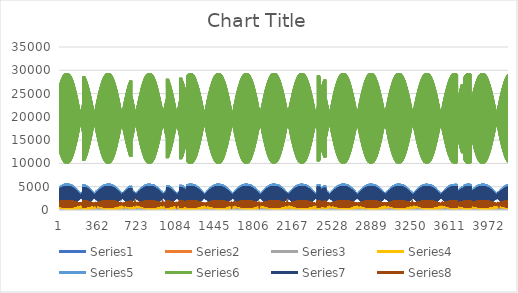
| Category | Series 0 | Series 1 | Series 2 | Series 3 | Series 4 | Series 5 | Series 6 | Series 7 |
|---|---|---|---|---|---|---|---|---|
| 0 | 326 | 234 | 315 | 957 | 4866 | 26558 | 4418 | 1771 |
| 1 | 232 | 228 | 269 | 450 | 1618 | 12702 | 1441 | 773 |
| 2 | 377 | 268 | 368 | 1084 | 4984 | 26733 | 4549 | 1919 |
| 3 | 202 | 199 | 236 | 405 | 1573 | 12532 | 1411 | 772 |
| 4 | 332 | 237 | 322 | 982 | 4953 | 26900 | 4496 | 1802 |
| 5 | 219 | 219 | 256 | 422 | 1537 | 12396 | 1366 | 737 |
| 6 | 392 | 281 | 385 | 1121 | 5070 | 27063 | 4624 | 1947 |
| 7 | 196 | 195 | 228 | 383 | 1505 | 12230 | 1353 | 763 |
| 8 | 338 | 241 | 332 | 1007 | 5030 | 27204 | 4567 | 1834 |
| 9 | 206 | 209 | 242 | 393 | 1457 | 12090 | 1292 | 703 |
| 10 | 405 | 291 | 399 | 1150 | 5141 | 27348 | 4684 | 1967 |
| 11 | 190 | 192 | 220 | 362 | 1436 | 11926 | 1294 | 752 |
| 12 | 347 | 247 | 343 | 1037 | 5104 | 27470 | 4635 | 1869 |
| 13 | 194 | 200 | 229 | 367 | 1382 | 11797 | 1222 | 673 |
| 14 | 417 | 300 | 414 | 1181 | 5217 | 27649 | 4749 | 1987 |
| 15 | 185 | 188 | 212 | 341 | 1375 | 11661 | 1243 | 742 |
| 16 | 359 | 256 | 359 | 1074 | 5187 | 27763 | 4712 | 1913 |
| 17 | 182 | 190 | 216 | 342 | 1315 | 11539 | 1161 | 647 |
| 18 | 424 | 306 | 423 | 1200 | 5276 | 27907 | 4797 | 1997 |
| 19 | 180 | 186 | 206 | 323 | 1317 | 11409 | 1192 | 730 |
| 20 | 372 | 265 | 374 | 1110 | 5258 | 28010 | 4778 | 1952 |
| 21 | 169 | 180 | 202 | 315 | 1248 | 11285 | 1101 | 621 |
| 22 | 429 | 310 | 430 | 1217 | 5329 | 28142 | 4840 | 2002 |
| 23 | 175 | 182 | 199 | 304 | 1258 | 11167 | 1140 | 713 |
| 24 | 389 | 276 | 392 | 1150 | 5328 | 28236 | 4843 | 1992 |
| 25 | 157 | 170 | 189 | 292 | 1189 | 11053 | 1049 | 601 |
| 26 | 433 | 313 | 436 | 1231 | 5378 | 28359 | 4879 | 2005 |
| 27 | 169 | 179 | 192 | 287 | 1207 | 10963 | 1094 | 695 |
| 28 | 404 | 287 | 409 | 1189 | 5393 | 28452 | 4904 | 2028 |
| 29 | 144 | 159 | 175 | 267 | 1138 | 10858 | 1004 | 585 |
| 30 | 436 | 316 | 442 | 1243 | 5421 | 28565 | 4914 | 2007 |
| 31 | 164 | 175 | 185 | 270 | 1156 | 10772 | 1046 | 672 |
| 32 | 420 | 300 | 429 | 1229 | 5451 | 28643 | 4957 | 2060 |
| 33 | 133 | 150 | 163 | 245 | 1092 | 10674 | 966 | 575 |
| 34 | 438 | 317 | 446 | 1250 | 5457 | 28737 | 4942 | 2007 |
| 35 | 158 | 172 | 178 | 254 | 1109 | 10605 | 1002 | 648 |
| 36 | 437 | 313 | 447 | 1267 | 5502 | 28804 | 5003 | 2088 |
| 37 | 123 | 142 | 150 | 225 | 1050 | 10496 | 933 | 569 |
| 38 | 438 | 318 | 448 | 1255 | 5485 | 28867 | 4964 | 2006 |
| 39 | 149 | 166 | 169 | 237 | 1062 | 10433 | 956 | 620 |
| 40 | 453 | 326 | 467 | 1306 | 5547 | 28934 | 5043 | 2112 |
| 41 | 115 | 135 | 140 | 206 | 1019 | 10353 | 910 | 570 |
| 42 | 439 | 319 | 451 | 1261 | 5518 | 29008 | 4991 | 2012 |
| 43 | 140 | 160 | 160 | 221 | 1026 | 10315 | 921 | 596 |
| 44 | 470 | 340 | 486 | 1341 | 5591 | 29069 | 5081 | 2133 |
| 45 | 109 | 130 | 132 | 191 | 1000 | 10259 | 898 | 579 |
| 46 | 438 | 318 | 453 | 1263 | 5542 | 29127 | 5011 | 2017 |
| 47 | 130 | 152 | 150 | 203 | 989 | 10208 | 884 | 571 |
| 48 | 484 | 352 | 503 | 1370 | 5618 | 29158 | 5104 | 2146 |
| 49 | 105 | 127 | 125 | 178 | 976 | 10145 | 882 | 585 |
| 50 | 440 | 320 | 456 | 1271 | 5561 | 29198 | 5027 | 2024 |
| 51 | 120 | 145 | 140 | 187 | 962 | 10125 | 856 | 550 |
| 52 | 497 | 363 | 518 | 1395 | 5643 | 29237 | 5121 | 2152 |
| 53 | 102 | 125 | 119 | 167 | 964 | 10079 | 876 | 594 |
| 54 | 440 | 320 | 459 | 1277 | 5575 | 29250 | 5040 | 2031 |
| 55 | 110 | 137 | 129 | 172 | 937 | 10057 | 831 | 530 |
| 56 | 506 | 371 | 529 | 1412 | 5657 | 29288 | 5130 | 2151 |
| 57 | 100 | 123 | 113 | 157 | 955 | 10034 | 873 | 600 |
| 58 | 444 | 323 | 465 | 1289 | 5591 | 29293 | 5056 | 2045 |
| 59 | 101 | 128 | 119 | 156 | 919 | 10027 | 814 | 514 |
| 60 | 511 | 376 | 537 | 1421 | 5661 | 29320 | 5129 | 2142 |
| 61 | 98 | 121 | 108 | 149 | 948 | 10012 | 871 | 604 |
| 62 | 450 | 327 | 474 | 1307 | 5605 | 29326 | 5070 | 2060 |
| 63 | 92 | 120 | 110 | 144 | 910 | 10032 | 806 | 503 |
| 64 | 513 | 380 | 541 | 1424 | 5653 | 29322 | 5118 | 2126 |
| 65 | 97 | 120 | 104 | 142 | 949 | 10030 | 875 | 608 |
| 66 | 459 | 335 | 485 | 1325 | 5611 | 29318 | 5079 | 2077 |
| 67 | 85 | 113 | 101 | 133 | 907 | 10051 | 805 | 499 |
| 68 | 515 | 382 | 544 | 1427 | 5648 | 29321 | 5110 | 2115 |
| 69 | 96 | 119 | 100 | 135 | 954 | 10049 | 882 | 614 |
| 70 | 469 | 344 | 498 | 1347 | 5618 | 29292 | 5088 | 2098 |
| 71 | 77 | 106 | 93 | 122 | 911 | 10080 | 811 | 503 |
| 72 | 516 | 383 | 547 | 1425 | 5631 | 29261 | 5090 | 2102 |
| 73 | 95 | 118 | 97 | 129 | 961 | 10086 | 890 | 618 |
| 74 | 480 | 353 | 511 | 1366 | 5613 | 29214 | 5085 | 2114 |
| 75 | 71 | 99 | 84 | 114 | 921 | 10122 | 824 | 511 |
| 76 | 514 | 383 | 547 | 1421 | 5613 | 29196 | 5070 | 2087 |
| 77 | 93 | 117 | 93 | 123 | 977 | 10166 | 904 | 619 |
| 78 | 490 | 362 | 522 | 1382 | 5606 | 29141 | 5079 | 2123 |
| 79 | 66 | 92 | 77 | 107 | 939 | 10203 | 844 | 522 |
| 80 | 511 | 382 | 545 | 1411 | 5585 | 29105 | 5041 | 2066 |
| 81 | 91 | 115 | 89 | 118 | 989 | 10245 | 912 | 611 |
| 82 | 501 | 372 | 536 | 1401 | 5595 | 29048 | 5070 | 2130 |
| 83 | 61 | 87 | 71 | 102 | 966 | 10308 | 874 | 539 |
| 84 | 505 | 378 | 541 | 1398 | 5552 | 28994 | 5007 | 2044 |
| 85 | 87 | 112 | 85 | 113 | 1012 | 10383 | 931 | 604 |
| 86 | 510 | 379 | 546 | 1414 | 5571 | 28926 | 5047 | 2127 |
| 87 | 58 | 83 | 65 | 99 | 997 | 10437 | 907 | 558 |
| 88 | 499 | 374 | 536 | 1382 | 5511 | 28855 | 4966 | 2020 |
| 89 | 82 | 108 | 79 | 109 | 1030 | 10508 | 943 | 592 |
| 90 | 520 | 389 | 559 | 1428 | 5537 | 28754 | 5015 | 2119 |
| 91 | 58 | 82 | 62 | 99 | 1031 | 10558 | 944 | 582 |
| 92 | 493 | 370 | 532 | 1367 | 5463 | 28663 | 4922 | 1999 |
| 93 | 77 | 103 | 74 | 105 | 1059 | 10670 | 966 | 585 |
| 94 | 528 | 398 | 569 | 1439 | 5509 | 28616 | 4988 | 2111 |
| 95 | 58 | 82 | 59 | 102 | 1084 | 10764 | 999 | 612 |
| 96 | 487 | 366 | 527 | 1351 | 5424 | 28523 | 4887 | 1984 |
| 97 | 71 | 98 | 68 | 102 | 1094 | 10869 | 996 | 581 |
| 98 | 534 | 405 | 577 | 1444 | 5464 | 28425 | 4944 | 2093 |
| 99 | 60 | 82 | 58 | 106 | 1132 | 10954 | 1048 | 639 |
| 100 | 482 | 363 | 523 | 1339 | 5374 | 28319 | 4843 | 1971 |
| 101 | 66 | 93 | 64 | 100 | 1132 | 11072 | 1028 | 581 |
| 102 | 537 | 409 | 582 | 1441 | 5412 | 28218 | 4895 | 2070 |
| 103 | 64 | 84 | 58 | 111 | 1186 | 11173 | 1104 | 668 |
| 104 | 478 | 361 | 520 | 1327 | 5321 | 28093 | 4796 | 1959 |
| 105 | 61 | 88 | 59 | 99 | 1177 | 11303 | 1069 | 586 |
| 106 | 538 | 411 | 583 | 1432 | 5352 | 27986 | 4836 | 2041 |
| 107 | 67 | 86 | 58 | 118 | 1245 | 11412 | 1162 | 696 |
| 108 | 477 | 361 | 521 | 1320 | 5266 | 27844 | 4749 | 1953 |
| 109 | 58 | 84 | 56 | 100 | 1228 | 11549 | 1115 | 596 |
| 110 | 535 | 411 | 582 | 1418 | 5285 | 27729 | 4772 | 2010 |
| 111 | 72 | 88 | 59 | 126 | 1307 | 11665 | 1221 | 722 |
| 112 | 479 | 363 | 523 | 1316 | 5210 | 27583 | 4701 | 1949 |
| 113 | 55 | 79 | 52 | 102 | 1283 | 11809 | 1166 | 609 |
| 114 | 529 | 407 | 576 | 1398 | 5211 | 27454 | 4701 | 1972 |
| 115 | 76 | 91 | 60 | 134 | 1370 | 11936 | 1280 | 743 |
| 116 | 481 | 367 | 527 | 1314 | 5151 | 27304 | 4652 | 1943 |
| 117 | 54 | 75 | 49 | 108 | 1347 | 12099 | 1226 | 627 |
| 118 | 523 | 404 | 571 | 1379 | 5135 | 27165 | 4629 | 1935 |
| 119 | 81 | 93 | 61 | 143 | 1441 | 12250 | 1346 | 763 |
| 120 | 484 | 371 | 530 | 1309 | 5084 | 26998 | 4593 | 1934 |
| 121 | 54 | 71 | 48 | 115 | 1417 | 12402 | 1293 | 652 |
| 122 | 515 | 399 | 564 | 1355 | 5050 | 26848 | 4548 | 1895 |
| 123 | 85 | 95 | 63 | 152 | 1513 | 12570 | 1411 | 780 |
| 124 | 487 | 375 | 534 | 1305 | 5013 | 26676 | 4531 | 1922 |
| 125 | 55 | 69 | 47 | 125 | 1492 | 12717 | 1365 | 683 |
| 126 | 506 | 394 | 556 | 1331 | 4965 | 26520 | 4469 | 1858 |
| 127 | 87 | 97 | 64 | 161 | 1585 | 12901 | 1475 | 793 |
| 128 | 491 | 380 | 539 | 1302 | 4941 | 26345 | 4468 | 1908 |
| 129 | 58 | 69 | 48 | 139 | 1579 | 13062 | 1450 | 721 |
| 130 | 496 | 387 | 547 | 1303 | 4876 | 26176 | 4386 | 1820 |
| 131 | 89 | 97 | 65 | 169 | 1662 | 13256 | 1542 | 804 |
| 132 | 493 | 384 | 542 | 1294 | 4860 | 25989 | 4395 | 1887 |
| 133 | 62 | 70 | 50 | 155 | 1670 | 13425 | 1538 | 763 |
| 134 | 485 | 380 | 536 | 1272 | 4781 | 25812 | 4299 | 1782 |
| 135 | 89 | 96 | 65 | 178 | 1739 | 13622 | 1608 | 813 |
| 136 | 495 | 388 | 545 | 1286 | 4776 | 25626 | 4318 | 1864 |
| 137 | 68 | 72 | 53 | 173 | 1764 | 13793 | 1629 | 808 |
| 138 | 474 | 372 | 524 | 1240 | 4685 | 25437 | 4211 | 1745 |
| 139 | 90 | 96 | 66 | 187 | 1819 | 14000 | 1677 | 824 |
| 140 | 497 | 391 | 548 | 1278 | 4687 | 25244 | 4236 | 1837 |
| 141 | 76 | 76 | 59 | 194 | 1860 | 14164 | 1722 | 854 |
| 142 | 462 | 364 | 513 | 1207 | 4586 | 25041 | 4120 | 1711 |
| 143 | 89 | 94 | 66 | 196 | 1901 | 14384 | 1748 | 836 |
| 144 | 497 | 393 | 548 | 1263 | 4587 | 24818 | 4143 | 1801 |
| 145 | 85 | 82 | 64 | 216 | 1956 | 14532 | 1814 | 899 |
| 146 | 451 | 356 | 502 | 1176 | 4484 | 24615 | 4029 | 1680 |
| 147 | 89 | 93 | 67 | 206 | 1985 | 14765 | 1822 | 850 |
| 148 | 495 | 394 | 548 | 1247 | 4492 | 24418 | 4055 | 1765 |
| 149 | 94 | 88 | 72 | 243 | 2069 | 14954 | 1921 | 949 |
| 150 | 442 | 350 | 493 | 1149 | 4388 | 24202 | 3945 | 1656 |
| 151 | 90 | 91 | 68 | 217 | 2081 | 15184 | 1907 | 871 |
| 152 | 488 | 392 | 541 | 1221 | 4381 | 23972 | 3951 | 1719 |
| 153 | 104 | 94 | 79 | 266 | 2163 | 15325 | 2010 | 987 |
| 154 | 434 | 346 | 485 | 1123 | 4275 | 23703 | 3846 | 1629 |
| 155 | 92 | 91 | 70 | 232 | 2179 | 15607 | 1996 | 897 |
| 156 | 482 | 388 | 534 | 1196 | 4282 | 23574 | 3859 | 1677 |
| 157 | 115 | 101 | 87 | 293 | 2281 | 15787 | 2120 | 1033 |
| 158 | 431 | 344 | 481 | 1105 | 4192 | 23341 | 3775 | 1617 |
| 159 | 92 | 88 | 71 | 243 | 2256 | 15956 | 2066 | 915 |
| 160 | 473 | 383 | 526 | 1170 | 4168 | 23096 | 3753 | 1629 |
| 161 | 127 | 109 | 97 | 325 | 2407 | 16269 | 2237 | 1079 |
| 162 | 427 | 343 | 477 | 1084 | 4095 | 22890 | 3692 | 1600 |
| 163 | 96 | 89 | 75 | 264 | 2388 | 16493 | 2188 | 961 |
| 164 | 460 | 374 | 514 | 1132 | 4055 | 22680 | 3648 | 1582 |
| 165 | 137 | 115 | 105 | 347 | 2512 | 16723 | 2331 | 1112 |
| 166 | 424 | 343 | 474 | 1065 | 3989 | 22435 | 3598 | 1577 |
| 167 | 101 | 89 | 80 | 287 | 2493 | 16942 | 2284 | 996 |
| 168 | 448 | 367 | 502 | 1098 | 3937 | 22224 | 3537 | 1530 |
| 169 | 146 | 121 | 112 | 369 | 2617 | 17183 | 2424 | 1136 |
| 170 | 420 | 342 | 470 | 1044 | 3881 | 21974 | 3502 | 1549 |
| 171 | 108 | 91 | 86 | 312 | 2603 | 17396 | 2386 | 1036 |
| 172 | 435 | 358 | 488 | 1063 | 3816 | 21754 | 3425 | 1481 |
| 173 | 154 | 126 | 119 | 392 | 2724 | 17645 | 2519 | 1162 |
| 174 | 418 | 342 | 468 | 1025 | 3773 | 21503 | 3406 | 1523 |
| 175 | 117 | 94 | 94 | 343 | 2721 | 17859 | 2498 | 1086 |
| 176 | 422 | 349 | 475 | 1027 | 3699 | 21290 | 3318 | 1435 |
| 177 | 161 | 131 | 126 | 413 | 2833 | 18121 | 2614 | 1186 |
| 178 | 415 | 342 | 465 | 1006 | 3672 | 21067 | 3316 | 1498 |
| 179 | 128 | 100 | 104 | 376 | 2848 | 18354 | 2618 | 1144 |
| 180 | 408 | 339 | 460 | 988 | 3578 | 20820 | 3207 | 1389 |
| 181 | 166 | 133 | 131 | 432 | 2936 | 18588 | 2703 | 1205 |
| 182 | 413 | 342 | 462 | 986 | 3560 | 20591 | 3214 | 1466 |
| 183 | 141 | 108 | 116 | 414 | 2973 | 18830 | 2736 | 1202 |
| 184 | 393 | 328 | 445 | 950 | 3461 | 20356 | 3101 | 1348 |
| 185 | 170 | 136 | 136 | 450 | 3042 | 19066 | 2795 | 1225 |
| 186 | 409 | 341 | 457 | 963 | 3442 | 20097 | 3107 | 1427 |
| 187 | 154 | 116 | 128 | 452 | 3092 | 19277 | 2848 | 1256 |
| 188 | 379 | 318 | 430 | 913 | 3341 | 19864 | 2992 | 1308 |
| 189 | 174 | 137 | 142 | 471 | 3152 | 19546 | 2890 | 1246 |
| 190 | 404 | 340 | 453 | 941 | 3331 | 19630 | 3004 | 1388 |
| 191 | 169 | 126 | 142 | 494 | 3223 | 19771 | 2970 | 1313 |
| 192 | 363 | 306 | 413 | 872 | 3222 | 19376 | 2884 | 1271 |
| 193 | 178 | 139 | 147 | 489 | 3260 | 20025 | 2985 | 1269 |
| 194 | 397 | 336 | 446 | 915 | 3213 | 19155 | 2895 | 1343 |
| 195 | 185 | 136 | 157 | 537 | 3350 | 20252 | 3087 | 1366 |
| 196 | 350 | 298 | 400 | 838 | 3108 | 18900 | 2784 | 1240 |
| 197 | 182 | 141 | 152 | 508 | 3368 | 20501 | 3080 | 1293 |
| 198 | 388 | 332 | 438 | 886 | 3095 | 18680 | 2785 | 1295 |
| 199 | 201 | 147 | 173 | 580 | 3474 | 20730 | 3201 | 1416 |
| 200 | 339 | 290 | 388 | 805 | 2994 | 18418 | 2684 | 1212 |
| 201 | 185 | 142 | 157 | 527 | 3476 | 20971 | 3175 | 1318 |
| 202 | 377 | 325 | 426 | 853 | 2974 | 18204 | 2671 | 1243 |
| 203 | 218 | 159 | 189 | 622 | 3597 | 21206 | 3313 | 1463 |
| 204 | 331 | 285 | 378 | 776 | 2884 | 17944 | 2589 | 1188 |
| 205 | 189 | 143 | 163 | 549 | 3582 | 21427 | 3271 | 1348 |
| 206 | 364 | 316 | 412 | 818 | 2853 | 17735 | 2559 | 1192 |
| 207 | 234 | 170 | 204 | 663 | 3717 | 21677 | 3421 | 1505 |
| 208 | 324 | 281 | 370 | 750 | 2779 | 17485 | 2498 | 1168 |
| 209 | 195 | 145 | 169 | 575 | 3697 | 21907 | 3375 | 1385 |
| 210 | 350 | 307 | 398 | 782 | 2732 | 17262 | 2447 | 1141 |
| 211 | 249 | 181 | 219 | 700 | 3831 | 22136 | 3523 | 1541 |
| 212 | 317 | 277 | 362 | 723 | 2671 | 17014 | 2404 | 1144 |
| 213 | 202 | 149 | 178 | 605 | 3811 | 22363 | 3479 | 1427 |
| 214 | 336 | 297 | 384 | 746 | 2614 | 16801 | 2338 | 1093 |
| 215 | 262 | 190 | 233 | 734 | 3943 | 22596 | 3622 | 1574 |
| 216 | 312 | 275 | 356 | 700 | 2568 | 16562 | 2313 | 1122 |
| 217 | 59 | 88 | 67 | 95 | 987 | 10549 | 891 | 507 |
| 218 | 526 | 396 | 565 | 1432 | 5490 | 28696 | 4962 | 2049 |
| 219 | 76 | 98 | 70 | 110 | 1056 | 10622 | 989 | 632 |
| 220 | 482 | 359 | 520 | 1355 | 5446 | 28593 | 4929 | 2034 |
| 221 | 55 | 82 | 61 | 93 | 1025 | 10721 | 928 | 520 |
| 222 | 522 | 394 | 563 | 1422 | 5443 | 28525 | 4916 | 2023 |
| 223 | 77 | 98 | 68 | 111 | 1098 | 10811 | 1027 | 643 |
| 224 | 489 | 367 | 530 | 1364 | 5412 | 28407 | 4899 | 2037 |
| 225 | 52 | 76 | 56 | 93 | 1067 | 10906 | 970 | 537 |
| 226 | 517 | 392 | 560 | 1407 | 5390 | 28323 | 4864 | 1995 |
| 227 | 77 | 98 | 67 | 112 | 1142 | 11018 | 1066 | 650 |
| 228 | 496 | 373 | 537 | 1370 | 5370 | 28200 | 4863 | 2034 |
| 229 | 50 | 72 | 52 | 95 | 1116 | 11103 | 1018 | 560 |
| 230 | 512 | 389 | 555 | 1390 | 5334 | 28104 | 4810 | 1967 |
| 231 | 77 | 98 | 65 | 114 | 1190 | 11243 | 1108 | 654 |
| 232 | 503 | 380 | 547 | 1377 | 5327 | 27976 | 4824 | 2030 |
| 233 | 50 | 70 | 50 | 99 | 1178 | 11350 | 1080 | 591 |
| 234 | 504 | 384 | 548 | 1368 | 5269 | 27862 | 4748 | 1937 |
| 235 | 76 | 97 | 64 | 116 | 1244 | 11510 | 1153 | 658 |
| 236 | 511 | 388 | 555 | 1382 | 5276 | 27743 | 4778 | 2021 |
| 237 | 52 | 69 | 48 | 106 | 1244 | 11613 | 1147 | 627 |
| 238 | 496 | 378 | 541 | 1344 | 5199 | 27599 | 4682 | 1907 |
| 239 | 73 | 94 | 61 | 118 | 1293 | 11767 | 1194 | 657 |
| 240 | 516 | 394 | 563 | 1385 | 5217 | 27474 | 4723 | 2004 |
| 241 | 55 | 70 | 49 | 116 | 1316 | 11890 | 1218 | 665 |
| 242 | 487 | 372 | 532 | 1319 | 5126 | 27313 | 4614 | 1879 |
| 243 | 70 | 90 | 58 | 120 | 1346 | 12029 | 1238 | 657 |
| 244 | 521 | 400 | 568 | 1382 | 5148 | 27167 | 4658 | 1982 |
| 245 | 59 | 73 | 50 | 128 | 1394 | 12187 | 1295 | 705 |
| 246 | 478 | 366 | 523 | 1294 | 5052 | 27016 | 4547 | 1855 |
| 247 | 68 | 87 | 56 | 123 | 1415 | 12358 | 1297 | 666 |
| 248 | 523 | 404 | 572 | 1376 | 5079 | 26886 | 4593 | 1956 |
| 249 | 64 | 76 | 52 | 142 | 1477 | 12519 | 1375 | 743 |
| 250 | 470 | 361 | 517 | 1274 | 4979 | 26721 | 4482 | 1835 |
| 251 | 66 | 84 | 54 | 128 | 1485 | 12699 | 1359 | 677 |
| 252 | 522 | 406 | 572 | 1362 | 4997 | 26563 | 4514 | 1921 |
| 253 | 71 | 80 | 56 | 157 | 1560 | 12856 | 1454 | 780 |
| 254 | 464 | 358 | 512 | 1254 | 4897 | 26379 | 4410 | 1816 |
| 255 | 65 | 82 | 52 | 134 | 1556 | 13039 | 1422 | 691 |
| 256 | 520 | 405 | 570 | 1345 | 4910 | 26223 | 4432 | 1883 |
| 257 | 78 | 84 | 59 | 173 | 1644 | 13199 | 1534 | 815 |
| 258 | 462 | 357 | 510 | 1240 | 4818 | 26028 | 4342 | 1803 |
| 259 | 64 | 79 | 52 | 142 | 1632 | 13386 | 1491 | 709 |
| 260 | 513 | 402 | 564 | 1322 | 4817 | 25860 | 4344 | 1842 |
| 261 | 86 | 89 | 64 | 190 | 1733 | 13559 | 1618 | 850 |
| 262 | 460 | 357 | 509 | 1227 | 4734 | 25650 | 4269 | 1789 |
| 263 | 65 | 76 | 52 | 153 | 1719 | 13761 | 1571 | 735 |
| 264 | 505 | 397 | 556 | 1296 | 4721 | 25487 | 4254 | 1799 |
| 265 | 94 | 94 | 69 | 207 | 1828 | 13950 | 1705 | 882 |
| 266 | 461 | 360 | 510 | 1216 | 4654 | 25283 | 4200 | 1778 |
| 267 | 66 | 74 | 52 | 165 | 1806 | 14137 | 1652 | 763 |
| 268 | 495 | 391 | 547 | 1266 | 4617 | 25084 | 4157 | 1754 |
| 269 | 101 | 99 | 73 | 223 | 1917 | 14329 | 1786 | 908 |
| 270 | 461 | 362 | 510 | 1203 | 4564 | 24881 | 4122 | 1762 |
| 271 | 69 | 73 | 54 | 182 | 1902 | 14534 | 1743 | 800 |
| 272 | 485 | 385 | 537 | 1238 | 4516 | 24687 | 4062 | 1712 |
| 273 | 107 | 102 | 78 | 240 | 2014 | 14748 | 1873 | 933 |
| 274 | 461 | 364 | 511 | 1192 | 4475 | 24478 | 4043 | 1744 |
| 275 | 74 | 73 | 58 | 201 | 2005 | 14950 | 1840 | 842 |
| 276 | 475 | 378 | 527 | 1206 | 4411 | 24277 | 3965 | 1669 |
| 277 | 112 | 105 | 81 | 254 | 2107 | 15164 | 1955 | 952 |
| 278 | 461 | 366 | 511 | 1177 | 4379 | 24057 | 3958 | 1721 |
| 279 | 81 | 76 | 63 | 225 | 2112 | 15366 | 1943 | 891 |
| 280 | 463 | 370 | 515 | 1172 | 4303 | 23847 | 3866 | 1628 |
| 281 | 116 | 107 | 85 | 268 | 2202 | 15586 | 2038 | 970 |
| 282 | 462 | 369 | 512 | 1164 | 4283 | 23633 | 3871 | 1697 |
| 283 | 89 | 80 | 70 | 251 | 2224 | 15801 | 2051 | 942 |
| 284 | 450 | 362 | 503 | 1138 | 4195 | 23417 | 3767 | 1587 |
| 285 | 119 | 108 | 88 | 284 | 2303 | 16036 | 2125 | 988 |
| 286 | 461 | 370 | 511 | 1148 | 4181 | 23196 | 3778 | 1666 |
| 287 | 99 | 85 | 77 | 279 | 2339 | 16242 | 2160 | 994 |
| 288 | 436 | 352 | 488 | 1101 | 4082 | 22971 | 3664 | 1545 |
| 289 | 121 | 108 | 91 | 297 | 2399 | 16478 | 2208 | 1003 |
| 290 | 459 | 371 | 510 | 1132 | 4076 | 22753 | 3681 | 1631 |
| 291 | 110 | 92 | 87 | 310 | 2457 | 16692 | 2270 | 1047 |
| 292 | 422 | 342 | 474 | 1064 | 3970 | 22519 | 3562 | 1508 |
| 293 | 123 | 109 | 94 | 312 | 2499 | 16928 | 2294 | 1020 |
| 294 | 456 | 372 | 508 | 1112 | 3966 | 22289 | 3579 | 1592 |
| 295 | 122 | 100 | 97 | 343 | 2571 | 17126 | 2378 | 1097 |
| 296 | 409 | 333 | 460 | 1028 | 3853 | 22029 | 3457 | 1472 |
| 297 | 125 | 109 | 97 | 326 | 2598 | 17368 | 2381 | 1039 |
| 298 | 451 | 370 | 503 | 1089 | 3855 | 21829 | 3476 | 1548 |
| 299 | 136 | 109 | 109 | 379 | 2695 | 17591 | 2494 | 1151 |
| 300 | 399 | 326 | 449 | 997 | 3749 | 21589 | 3366 | 1447 |
| 301 | 128 | 110 | 100 | 343 | 2707 | 17845 | 2478 | 1066 |
| 302 | 443 | 365 | 495 | 1059 | 3739 | 21369 | 3367 | 1500 |
| 303 | 150 | 117 | 120 | 413 | 2818 | 18076 | 2608 | 1199 |
| 304 | 391 | 321 | 441 | 969 | 3640 | 21121 | 3270 | 1422 |
| 305 | 130 | 109 | 104 | 360 | 2813 | 18315 | 2573 | 1092 |
| 306 | 432 | 359 | 484 | 1027 | 3620 | 20904 | 3256 | 1449 |
| 307 | 164 | 127 | 133 | 449 | 2941 | 18564 | 2720 | 1244 |
| 308 | 384 | 318 | 434 | 945 | 3535 | 20665 | 3179 | 1401 |
| 309 | 134 | 110 | 109 | 382 | 2926 | 18796 | 2675 | 1126 |
| 310 | 419 | 350 | 470 | 990 | 3496 | 20434 | 3140 | 1396 |
| 311 | 177 | 136 | 145 | 480 | 3055 | 19030 | 2822 | 1282 |
| 312 | 379 | 315 | 427 | 919 | 3422 | 20184 | 3080 | 1376 |
| 313 | 140 | 111 | 114 | 405 | 3038 | 19269 | 2777 | 1163 |
| 314 | 406 | 342 | 458 | 956 | 3376 | 19964 | 3029 | 1347 |
| 315 | 190 | 145 | 156 | 512 | 3172 | 19516 | 2928 | 1319 |
| 316 | 374 | 313 | 422 | 897 | 3314 | 19706 | 2985 | 1354 |
| 317 | 146 | 113 | 122 | 434 | 3152 | 19731 | 2883 | 1206 |
| 318 | 393 | 332 | 443 | 920 | 3250 | 19459 | 2913 | 1297 |
| 319 | 201 | 153 | 167 | 542 | 3287 | 19986 | 3031 | 1352 |
| 320 | 369 | 311 | 416 | 872 | 3201 | 19211 | 2886 | 1327 |
| 321 | 156 | 118 | 132 | 468 | 3276 | 20212 | 2999 | 1258 |
| 322 | 379 | 323 | 430 | 884 | 3133 | 18994 | 2805 | 1252 |
| 323 | 210 | 158 | 175 | 568 | 3400 | 20465 | 3129 | 1379 |
| 324 | 365 | 310 | 412 | 851 | 3097 | 18757 | 2794 | 1303 |
| 325 | 168 | 124 | 144 | 505 | 3399 | 20684 | 3114 | 1311 |
| 326 | 365 | 313 | 415 | 848 | 3016 | 18524 | 2698 | 1208 |
| 327 | 217 | 163 | 183 | 592 | 3509 | 20935 | 3223 | 1401 |
| 328 | 361 | 308 | 406 | 827 | 2988 | 18287 | 2696 | 1272 |
| 329 | 181 | 132 | 158 | 546 | 3526 | 21159 | 3232 | 1368 |
| 330 | 350 | 302 | 399 | 809 | 2896 | 18047 | 2588 | 1163 |
| 331 | 223 | 167 | 190 | 615 | 3617 | 21410 | 3317 | 1422 |
| 332 | 356 | 306 | 401 | 803 | 2876 | 17812 | 2594 | 1238 |
| 333 | 197 | 142 | 173 | 590 | 3652 | 21628 | 3350 | 1427 |
| 334 | 334 | 290 | 383 | 770 | 2779 | 17576 | 2482 | 1122 |
| 335 | 228 | 170 | 197 | 635 | 3719 | 21861 | 3404 | 1440 |
| 336 | 350 | 304 | 395 | 781 | 2766 | 17345 | 2493 | 1201 |
| 337 | 213 | 153 | 189 | 636 | 3778 | 22087 | 3467 | 1483 |
| 338 | 319 | 279 | 366 | 732 | 2666 | 17109 | 2380 | 1085 |
| 339 | 234 | 173 | 204 | 657 | 3830 | 22340 | 3500 | 1463 |
| 340 | 344 | 302 | 389 | 755 | 2655 | 16894 | 2392 | 1161 |
| 341 | 231 | 164 | 206 | 683 | 3902 | 22557 | 3582 | 1537 |
| 342 | 304 | 269 | 351 | 695 | 2554 | 16659 | 2281 | 1052 |
| 343 | 238 | 175 | 210 | 677 | 3933 | 22803 | 3590 | 1484 |
| 344 | 336 | 297 | 380 | 728 | 2543 | 16450 | 2288 | 1117 |
| 345 | 249 | 177 | 224 | 731 | 4021 | 23006 | 3691 | 1587 |
| 346 | 291 | 259 | 337 | 661 | 2445 | 16199 | 2185 | 1024 |
| 347 | 242 | 178 | 216 | 696 | 4036 | 23250 | 3680 | 1507 |
| 348 | 325 | 291 | 369 | 698 | 2431 | 16007 | 2183 | 1069 |
| 349 | 266 | 189 | 242 | 777 | 4138 | 23449 | 3798 | 1634 |
| 350 | 281 | 252 | 325 | 630 | 2343 | 15764 | 2097 | 1001 |
| 351 | 246 | 180 | 222 | 717 | 4136 | 23684 | 3768 | 1532 |
| 352 | 313 | 283 | 357 | 668 | 2320 | 15568 | 2079 | 1020 |
| 353 | 284 | 202 | 261 | 824 | 4255 | 23893 | 3903 | 1677 |
| 354 | 271 | 245 | 314 | 600 | 2241 | 15330 | 2008 | 978 |
| 355 | 250 | 182 | 228 | 738 | 4234 | 24101 | 3855 | 1558 |
| 356 | 299 | 272 | 342 | 632 | 2201 | 15113 | 1969 | 967 |
| 357 | 302 | 215 | 279 | 867 | 4365 | 24320 | 4000 | 1713 |
| 358 | 264 | 241 | 306 | 575 | 2144 | 14904 | 1925 | 959 |
| 359 | 256 | 184 | 236 | 765 | 4337 | 24523 | 3949 | 1592 |
| 360 | 285 | 264 | 329 | 599 | 2097 | 14712 | 1872 | 922 |
| 361 | 317 | 226 | 295 | 904 | 4468 | 24736 | 4092 | 1745 |
| 362 | 257 | 238 | 298 | 551 | 2049 | 14491 | 1843 | 939 |
| 363 | 264 | 188 | 247 | 797 | 4440 | 24932 | 4043 | 1631 |
| 364 | 270 | 252 | 313 | 564 | 1990 | 14302 | 1774 | 877 |
| 365 | 330 | 236 | 310 | 938 | 4566 | 25141 | 4178 | 1772 |
| 366 | 251 | 233 | 289 | 526 | 1956 | 14094 | 1762 | 919 |
| 367 | 274 | 194 | 259 | 832 | 4540 | 25321 | 4136 | 1673 |
| 368 | 257 | 243 | 299 | 533 | 1891 | 13915 | 1682 | 838 |
| 369 | 340 | 243 | 321 | 965 | 4656 | 25525 | 4254 | 1791 |
| 370 | 245 | 230 | 281 | 503 | 1867 | 13715 | 1684 | 897 |
| 371 | 287 | 202 | 273 | 871 | 4639 | 25687 | 4227 | 1719 |
| 372 | 243 | 232 | 284 | 501 | 1790 | 13513 | 1590 | 799 |
| 373 | 348 | 249 | 331 | 991 | 4739 | 25873 | 4325 | 1806 |
| 374 | 240 | 228 | 275 | 481 | 1779 | 13328 | 1606 | 873 |
| 375 | 302 | 212 | 290 | 916 | 4744 | 26058 | 4326 | 1770 |
| 376 | 229 | 221 | 269 | 471 | 1704 | 13174 | 1513 | 767 |
| 377 | 354 | 254 | 339 | 1013 | 4826 | 26256 | 4399 | 1821 |
| 378 | 233 | 224 | 266 | 458 | 1697 | 13001 | 1533 | 848 |
| 379 | 318 | 223 | 308 | 959 | 4839 | 26410 | 4414 | 1816 |
| 380 | 215 | 210 | 254 | 440 | 1615 | 12831 | 1433 | 734 |
| 381 | 359 | 257 | 346 | 1031 | 4900 | 26594 | 4461 | 1830 |
| 382 | 227 | 220 | 259 | 437 | 1614 | 12667 | 1457 | 818 |
| 383 | 336 | 236 | 327 | 1007 | 4933 | 26743 | 4500 | 1861 |
| 384 | 200 | 199 | 238 | 408 | 1531 | 12498 | 1358 | 708 |
| 385 | 364 | 260 | 353 | 1049 | 4972 | 26919 | 4521 | 1841 |
| 386 | 221 | 217 | 252 | 416 | 1534 | 12349 | 1383 | 787 |
| 387 | 354 | 249 | 348 | 1054 | 5023 | 27059 | 4583 | 1904 |
| 388 | 187 | 188 | 224 | 379 | 1454 | 12185 | 1291 | 686 |
| 389 | 368 | 263 | 359 | 1063 | 5039 | 27218 | 4577 | 1851 |
| 390 | 213 | 212 | 244 | 395 | 1456 | 12048 | 1310 | 753 |
| 391 | 373 | 263 | 369 | 1101 | 5107 | 27355 | 4660 | 1945 |
| 392 | 175 | 180 | 211 | 352 | 1385 | 11892 | 1232 | 673 |
| 393 | 370 | 266 | 364 | 1075 | 5101 | 27492 | 4630 | 1862 |
| 394 | 203 | 207 | 234 | 373 | 1382 | 11768 | 1240 | 717 |
| 395 | 391 | 277 | 389 | 1147 | 5187 | 27637 | 4731 | 1980 |
| 396 | 165 | 172 | 198 | 327 | 1320 | 11618 | 1178 | 661 |
| 397 | 372 | 267 | 368 | 1088 | 5162 | 27759 | 4681 | 1873 |
| 398 | 192 | 198 | 222 | 349 | 1305 | 11482 | 1167 | 677 |
| 399 | 410 | 291 | 410 | 1190 | 5257 | 27874 | 4793 | 2008 |
| 400 | 157 | 166 | 189 | 306 | 1259 | 11341 | 1128 | 654 |
| 401 | 374 | 268 | 373 | 1102 | 5220 | 27997 | 4732 | 1889 |
| 402 | 180 | 190 | 211 | 325 | 1241 | 11245 | 1106 | 643 |
| 403 | 426 | 304 | 428 | 1228 | 5328 | 28136 | 4855 | 2033 |
| 404 | 151 | 163 | 180 | 287 | 1212 | 11135 | 1091 | 651 |
| 405 | 377 | 270 | 378 | 1116 | 5277 | 28243 | 4784 | 1906 |
| 406 | 168 | 181 | 198 | 301 | 1180 | 11041 | 1048 | 610 |
| 407 | 439 | 315 | 444 | 1257 | 5382 | 28355 | 4899 | 2047 |
| 408 | 146 | 159 | 173 | 269 | 1160 | 10919 | 1048 | 644 |
| 409 | 382 | 273 | 386 | 1138 | 5330 | 28451 | 4831 | 1928 |
| 410 | 156 | 172 | 186 | 278 | 1120 | 10834 | 992 | 580 |
| 411 | 451 | 325 | 458 | 1283 | 5430 | 28552 | 4940 | 2058 |
| 412 | 142 | 155 | 166 | 253 | 1119 | 10741 | 1015 | 640 |
| 413 | 389 | 278 | 396 | 1161 | 5378 | 28631 | 4877 | 1952 |
| 414 | 145 | 163 | 174 | 257 | 1071 | 10667 | 947 | 556 |
| 415 | 459 | 332 | 468 | 1303 | 5471 | 28738 | 4973 | 2062 |
| 416 | 138 | 153 | 159 | 237 | 1078 | 10578 | 982 | 634 |
| 417 | 398 | 284 | 408 | 1188 | 5426 | 28796 | 4922 | 1981 |
| 418 | 134 | 153 | 162 | 236 | 1022 | 10496 | 903 | 534 |
| 419 | 465 | 338 | 477 | 1319 | 5508 | 28899 | 5002 | 2064 |
| 420 | 134 | 151 | 153 | 224 | 1043 | 10425 | 953 | 629 |
| 421 | 411 | 294 | 423 | 1221 | 5476 | 28942 | 4970 | 2015 |
| 422 | 123 | 144 | 150 | 216 | 984 | 10358 | 869 | 517 |
| 423 | 469 | 340 | 482 | 1327 | 5527 | 28998 | 5014 | 2058 |
| 424 | 131 | 148 | 147 | 209 | 1009 | 10287 | 923 | 619 |
| 425 | 425 | 304 | 439 | 1253 | 5517 | 29058 | 5009 | 2044 |
| 426 | 113 | 135 | 138 | 198 | 955 | 10257 | 844 | 507 |
| 427 | 470 | 342 | 485 | 1333 | 5553 | 29130 | 5032 | 2053 |
| 428 | 127 | 145 | 141 | 196 | 983 | 10201 | 900 | 608 |
| 429 | 439 | 315 | 455 | 1284 | 5552 | 29157 | 5042 | 2070 |
| 430 | 103 | 125 | 127 | 180 | 924 | 10147 | 819 | 498 |
| 431 | 472 | 344 | 489 | 1337 | 5565 | 29201 | 5038 | 2044 |
| 432 | 123 | 143 | 135 | 184 | 958 | 10121 | 877 | 593 |
| 433 | 453 | 327 | 472 | 1316 | 5582 | 29233 | 5071 | 2093 |
| 434 | 95 | 117 | 116 | 165 | 907 | 10081 | 807 | 498 |
| 435 | 472 | 345 | 491 | 1339 | 5576 | 29269 | 5044 | 2037 |
| 436 | 117 | 140 | 129 | 172 | 938 | 10065 | 856 | 576 |
| 437 | 468 | 339 | 489 | 1346 | 5606 | 29284 | 5092 | 2111 |
| 438 | 87 | 111 | 107 | 151 | 896 | 10036 | 802 | 503 |
| 439 | 470 | 343 | 491 | 1336 | 5579 | 29304 | 5043 | 2027 |
| 440 | 111 | 135 | 123 | 161 | 921 | 10035 | 837 | 557 |
| 441 | 482 | 350 | 506 | 1375 | 5623 | 29314 | 5106 | 2124 |
| 442 | 81 | 105 | 99 | 140 | 892 | 10010 | 803 | 512 |
| 443 | 468 | 343 | 492 | 1334 | 5579 | 29322 | 5040 | 2020 |
| 444 | 104 | 130 | 115 | 151 | 909 | 10025 | 823 | 538 |
| 445 | 495 | 362 | 522 | 1402 | 5632 | 29315 | 5113 | 2133 |
| 446 | 77 | 102 | 92 | 130 | 896 | 10018 | 814 | 527 |
| 447 | 465 | 341 | 490 | 1328 | 5572 | 29311 | 5033 | 2013 |
| 448 | 95 | 123 | 107 | 139 | 901 | 10040 | 813 | 520 |
| 449 | 507 | 373 | 537 | 1423 | 5631 | 29283 | 5109 | 2134 |
| 450 | 75 | 100 | 87 | 124 | 908 | 10053 | 831 | 545 |
| 451 | 462 | 339 | 489 | 1323 | 5564 | 29288 | 5024 | 2009 |
| 452 | 87 | 116 | 99 | 128 | 899 | 10080 | 809 | 506 |
| 453 | 517 | 383 | 549 | 1439 | 5627 | 29257 | 5103 | 2131 |
| 454 | 74 | 99 | 83 | 119 | 919 | 10090 | 846 | 559 |
| 455 | 461 | 339 | 490 | 1325 | 5554 | 29236 | 5016 | 2010 |
| 456 | 80 | 109 | 91 | 118 | 905 | 10143 | 812 | 496 |
| 457 | 524 | 390 | 558 | 1448 | 5612 | 29193 | 5085 | 2121 |
| 458 | 74 | 98 | 80 | 116 | 941 | 10177 | 871 | 577 |
| 459 | 461 | 340 | 492 | 1325 | 5533 | 29141 | 4999 | 2011 |
| 460 | 73 | 103 | 84 | 110 | 916 | 10233 | 821 | 491 |
| 461 | 526 | 393 | 561 | 1447 | 5585 | 29101 | 5056 | 2101 |
| 462 | 74 | 98 | 76 | 113 | 962 | 10271 | 894 | 590 |
| 463 | 465 | 343 | 498 | 1332 | 5518 | 29051 | 4986 | 2017 |
| 464 | 67 | 97 | 77 | 103 | 930 | 10325 | 834 | 487 |
| 465 | 527 | 395 | 564 | 1445 | 5556 | 28995 | 5026 | 2081 |
| 466 | 75 | 98 | 74 | 111 | 991 | 10384 | 923 | 604 |
| 467 | 471 | 349 | 506 | 1343 | 5499 | 28925 | 4972 | 2026 |
| 468 | 62 | 90 | 70 | 98 | 958 | 10465 | 861 | 493 |
| 469 | 525 | 394 | 563 | 1435 | 5516 | 28852 | 4985 | 2056 |
| 470 | 76 | 99 | 72 | 110 | 1024 | 10538 | 957 | 617 |
| 471 | 478 | 355 | 514 | 1349 | 5468 | 28766 | 4947 | 2030 |
| 472 | 57 | 84 | 65 | 94 | 988 | 10618 | 890 | 502 |
| 473 | 521 | 392 | 561 | 1424 | 5471 | 28697 | 4941 | 2029 |
| 474 | 77 | 99 | 70 | 110 | 1055 | 10678 | 985 | 623 |
| 475 | 486 | 363 | 525 | 1363 | 5441 | 28597 | 4925 | 2036 |
| 476 | 54 | 79 | 59 | 93 | 1027 | 10775 | 929 | 517 |
| 477 | 518 | 390 | 559 | 1412 | 5426 | 28518 | 4897 | 2004 |
| 478 | 77 | 99 | 68 | 111 | 1099 | 10875 | 1025 | 632 |
| 479 | 494 | 370 | 534 | 1372 | 5408 | 28413 | 4896 | 2038 |
| 480 | 51 | 74 | 55 | 94 | 1076 | 10980 | 978 | 540 |
| 481 | 512 | 388 | 554 | 1394 | 5369 | 28309 | 4842 | 1976 |
| 482 | 77 | 99 | 67 | 111 | 1145 | 11100 | 1064 | 637 |
| 483 | 501 | 377 | 542 | 1377 | 5364 | 28206 | 4857 | 2033 |
| 484 | 50 | 71 | 51 | 96 | 1127 | 11193 | 1030 | 567 |
| 485 | 505 | 383 | 548 | 1374 | 5308 | 28086 | 4784 | 1946 |
| 486 | 76 | 97 | 65 | 112 | 1189 | 11324 | 1101 | 638 |
| 487 | 508 | 385 | 552 | 1385 | 5317 | 27979 | 4815 | 2027 |
| 488 | 51 | 70 | 49 | 102 | 1188 | 11431 | 1092 | 601 |
| 489 | 497 | 379 | 541 | 1354 | 5246 | 27843 | 4725 | 1920 |
| 490 | 73 | 95 | 62 | 113 | 1238 | 11572 | 1143 | 639 |
| 491 | 515 | 393 | 561 | 1390 | 5263 | 27722 | 4764 | 2015 |
| 492 | 53 | 70 | 49 | 110 | 1257 | 11696 | 1161 | 638 |
| 493 | 489 | 373 | 533 | 1329 | 5176 | 27577 | 4660 | 1892 |
| 494 | 70 | 91 | 60 | 115 | 1291 | 11839 | 1186 | 640 |
| 495 | 520 | 398 | 566 | 1389 | 5199 | 27446 | 4704 | 1994 |
| 496 | 57 | 72 | 49 | 120 | 1328 | 11973 | 1231 | 675 |
| 497 | 480 | 367 | 525 | 1305 | 5105 | 27297 | 4595 | 1867 |
| 498 | 67 | 88 | 56 | 118 | 1348 | 12125 | 1235 | 643 |
| 499 | 524 | 403 | 572 | 1387 | 5133 | 27159 | 4642 | 1970 |
| 500 | 61 | 75 | 51 | 132 | 1398 | 12244 | 1300 | 709 |
| 501 | 472 | 362 | 518 | 1285 | 5033 | 26990 | 4531 | 1846 |
| 502 | 65 | 84 | 54 | 121 | 1415 | 12437 | 1294 | 652 |
| 503 | 525 | 406 | 573 | 1375 | 5056 | 26844 | 4569 | 1938 |
| 504 | 67 | 78 | 54 | 146 | 1485 | 12587 | 1384 | 748 |
| 505 | 467 | 358 | 513 | 1267 | 4955 | 26663 | 4462 | 1827 |
| 506 | 63 | 82 | 52 | 126 | 1483 | 12760 | 1354 | 663 |
| 507 | 522 | 406 | 572 | 1359 | 4975 | 26525 | 4491 | 1902 |
| 508 | 74 | 82 | 57 | 161 | 1568 | 12924 | 1463 | 783 |
| 509 | 463 | 357 | 510 | 1251 | 4878 | 26328 | 4395 | 1814 |
| 510 | 62 | 79 | 51 | 132 | 1554 | 13094 | 1419 | 679 |
| 511 | 517 | 404 | 567 | 1339 | 4886 | 26182 | 4408 | 1863 |
| 512 | 81 | 87 | 61 | 176 | 1655 | 13279 | 1545 | 817 |
| 513 | 462 | 358 | 510 | 1240 | 4801 | 25975 | 4329 | 1803 |
| 514 | 62 | 76 | 50 | 142 | 1637 | 13457 | 1495 | 703 |
| 515 | 509 | 399 | 560 | 1313 | 4791 | 25808 | 4318 | 1820 |
| 516 | 89 | 91 | 65 | 193 | 1745 | 13648 | 1629 | 850 |
| 517 | 462 | 360 | 510 | 1228 | 4719 | 25606 | 4259 | 1791 |
| 518 | 63 | 74 | 51 | 153 | 1723 | 13831 | 1575 | 731 |
| 519 | 500 | 394 | 551 | 1286 | 4695 | 25439 | 4228 | 1778 |
| 520 | 95 | 95 | 69 | 207 | 1832 | 14018 | 1707 | 875 |
| 521 | 463 | 362 | 512 | 1218 | 4635 | 25225 | 4185 | 1777 |
| 522 | 65 | 72 | 52 | 168 | 1814 | 14213 | 1660 | 765 |
| 523 | 490 | 387 | 542 | 1257 | 4594 | 25049 | 4134 | 1735 |
| 524 | 101 | 99 | 73 | 223 | 1925 | 14421 | 1791 | 899 |
| 525 | 464 | 364 | 513 | 1207 | 4547 | 24821 | 4107 | 1760 |
| 526 | 69 | 71 | 55 | 186 | 1910 | 14593 | 1751 | 804 |
| 527 | 479 | 380 | 530 | 1224 | 4485 | 24614 | 4033 | 1690 |
| 528 | 107 | 103 | 77 | 238 | 2020 | 14831 | 1875 | 921 |
| 529 | 464 | 367 | 514 | 1193 | 4456 | 24417 | 4026 | 1739 |
| 530 | 75 | 73 | 59 | 207 | 2016 | 15017 | 1853 | 850 |
| 531 | 468 | 373 | 520 | 1193 | 4386 | 24228 | 3940 | 1650 |
| 532 | 110 | 104 | 80 | 251 | 2111 | 15247 | 1954 | 937 |
| 533 | 465 | 369 | 514 | 1181 | 4362 | 24002 | 3942 | 1716 |
| 534 | 83 | 76 | 65 | 231 | 2125 | 15437 | 1957 | 901 |
| 535 | 456 | 365 | 508 | 1159 | 4278 | 23796 | 3841 | 1610 |
| 536 | 113 | 105 | 83 | 265 | 2210 | 15684 | 2040 | 955 |
| 537 | 464 | 371 | 514 | 1166 | 4261 | 23565 | 3850 | 1687 |
| 538 | 93 | 81 | 72 | 259 | 2242 | 15885 | 2069 | 956 |
| 539 | 442 | 355 | 494 | 1123 | 4166 | 23348 | 3739 | 1568 |
| 540 | 116 | 106 | 86 | 280 | 2306 | 16121 | 2124 | 971 |
| 541 | 463 | 373 | 514 | 1151 | 4158 | 23128 | 3756 | 1655 |
| 542 | 103 | 88 | 81 | 289 | 2357 | 16323 | 2179 | 1008 |
| 543 | 428 | 345 | 479 | 1085 | 4055 | 22907 | 3639 | 1531 |
| 544 | 117 | 106 | 89 | 293 | 2402 | 16563 | 2207 | 987 |
| 545 | 461 | 374 | 512 | 1132 | 4050 | 22677 | 3656 | 1617 |
| 546 | 115 | 95 | 90 | 321 | 2478 | 16786 | 2293 | 1062 |
| 547 | 416 | 337 | 467 | 1050 | 3942 | 22443 | 3537 | 1497 |
| 548 | 119 | 106 | 92 | 308 | 2506 | 17028 | 2297 | 1008 |
| 549 | 457 | 373 | 509 | 1111 | 3939 | 22217 | 3553 | 1575 |
| 550 | 128 | 104 | 101 | 356 | 2599 | 17250 | 2406 | 1113 |
| 551 | 404 | 329 | 455 | 1018 | 3831 | 21974 | 3440 | 1467 |
| 552 | 121 | 106 | 94 | 322 | 2609 | 17484 | 2389 | 1030 |
| 553 | 448 | 368 | 500 | 1080 | 3820 | 21750 | 3442 | 1524 |
| 554 | 141 | 112 | 112 | 389 | 2717 | 17716 | 2515 | 1159 |
| 555 | 396 | 323 | 446 | 989 | 3722 | 21513 | 3344 | 1442 |
| 556 | 124 | 106 | 98 | 340 | 2716 | 17961 | 2485 | 1057 |
| 557 | 438 | 363 | 491 | 1050 | 3702 | 21281 | 3331 | 1475 |
| 558 | 154 | 121 | 124 | 422 | 2835 | 18186 | 2624 | 1204 |
| 559 | 390 | 320 | 439 | 965 | 3615 | 21039 | 3251 | 1420 |
| 560 | 128 | 106 | 102 | 361 | 2829 | 18436 | 2588 | 1091 |
| 561 | 427 | 355 | 478 | 1015 | 3582 | 20805 | 3219 | 1424 |
| 562 | 168 | 130 | 136 | 456 | 2958 | 18671 | 2736 | 1248 |
| 563 | 384 | 317 | 433 | 940 | 3504 | 20554 | 3154 | 1398 |
| 564 | 133 | 108 | 108 | 384 | 2943 | 18910 | 2691 | 1129 |
| 565 | 413 | 346 | 464 | 978 | 3458 | 20330 | 3104 | 1373 |
| 566 | 181 | 139 | 147 | 487 | 3074 | 19145 | 2839 | 1285 |
| 567 | 380 | 316 | 428 | 918 | 3399 | 20087 | 3062 | 1377 |
| 568 | 139 | 109 | 114 | 410 | 3056 | 19371 | 2795 | 1170 |
| 569 | 400 | 337 | 451 | 943 | 3339 | 19856 | 2994 | 1325 |
| 570 | 192 | 147 | 158 | 516 | 3191 | 19632 | 2945 | 1318 |
| 571 | 375 | 314 | 423 | 895 | 3286 | 19594 | 2963 | 1351 |
| 572 | 148 | 113 | 124 | 444 | 3179 | 19858 | 2911 | 1220 |
| 573 | 387 | 327 | 437 | 907 | 3217 | 19370 | 2881 | 1277 |
| 574 | 201 | 153 | 167 | 543 | 3304 | 20111 | 3043 | 1346 |
| 575 | 371 | 313 | 418 | 872 | 3179 | 19134 | 2868 | 1325 |
| 576 | 158 | 118 | 135 | 478 | 3299 | 20324 | 3022 | 1270 |
| 577 | 372 | 317 | 422 | 868 | 3091 | 18878 | 2766 | 1228 |
| 578 | 209 | 158 | 174 | 566 | 3411 | 20579 | 3136 | 1367 |
| 579 | 366 | 311 | 412 | 849 | 3068 | 18662 | 2769 | 1294 |
| 580 | 172 | 126 | 148 | 519 | 3427 | 20812 | 3142 | 1328 |
| 581 | 357 | 307 | 407 | 832 | 2976 | 18415 | 2661 | 1186 |
| 582 | 214 | 161 | 181 | 588 | 3519 | 21056 | 3229 | 1388 |
| 583 | 362 | 310 | 408 | 827 | 2957 | 18183 | 2669 | 1262 |
| 584 | 187 | 135 | 163 | 562 | 3555 | 21283 | 3262 | 1387 |
| 585 | 342 | 296 | 391 | 794 | 2860 | 17948 | 2556 | 1145 |
| 586 | 220 | 165 | 188 | 609 | 3625 | 21519 | 3320 | 1408 |
| 587 | 357 | 308 | 401 | 801 | 2845 | 17717 | 2566 | 1225 |
| 588 | 203 | 146 | 178 | 607 | 3678 | 21745 | 3377 | 1443 |
| 589 | 326 | 284 | 374 | 755 | 2744 | 17480 | 2451 | 1106 |
| 590 | 226 | 168 | 195 | 632 | 3734 | 21997 | 3414 | 1430 |
| 591 | 350 | 305 | 395 | 777 | 2732 | 17251 | 2462 | 1184 |
| 592 | 220 | 157 | 195 | 653 | 3802 | 22207 | 3492 | 1497 |
| 593 | 312 | 274 | 359 | 718 | 2631 | 17012 | 2351 | 1073 |
| 594 | 230 | 170 | 201 | 651 | 3840 | 22458 | 3507 | 1452 |
| 595 | 343 | 302 | 388 | 752 | 2622 | 16799 | 2360 | 1143 |
| 596 | 237 | 169 | 212 | 700 | 3924 | 22662 | 3604 | 1549 |
| 597 | 298 | 263 | 344 | 681 | 2520 | 16552 | 2252 | 1041 |
| 598 | 234 | 172 | 207 | 669 | 3939 | 22903 | 3594 | 1472 |
| 599 | 333 | 295 | 377 | 722 | 2508 | 16355 | 2254 | 1094 |
| 600 | 255 | 181 | 231 | 747 | 4046 | 23123 | 3714 | 1598 |
| 601 | 287 | 256 | 332 | 651 | 2414 | 16101 | 2161 | 1017 |
| 602 | 237 | 174 | 212 | 689 | 4039 | 23336 | 3681 | 1495 |
| 603 | 321 | 287 | 365 | 690 | 2390 | 15884 | 2144 | 1043 |
| 604 | 273 | 194 | 249 | 793 | 4158 | 23541 | 3816 | 1640 |
| 605 | 278 | 250 | 322 | 622 | 2309 | 15637 | 2070 | 995 |
| 606 | 242 | 176 | 219 | 713 | 4143 | 23761 | 3775 | 1526 |
| 607 | 308 | 279 | 352 | 657 | 2281 | 15459 | 2043 | 995 |
| 608 | 291 | 207 | 267 | 838 | 4277 | 24002 | 3923 | 1683 |
| 609 | 271 | 245 | 313 | 596 | 2217 | 15239 | 1991 | 979 |
| 610 | 248 | 178 | 226 | 739 | 4250 | 24209 | 3872 | 1561 |
| 611 | 293 | 269 | 337 | 622 | 2173 | 15046 | 1942 | 948 |
| 612 | 305 | 218 | 282 | 873 | 4378 | 24412 | 4012 | 1714 |
| 613 | 265 | 242 | 305 | 572 | 2121 | 14824 | 1908 | 960 |
| 614 | 255 | 182 | 236 | 770 | 4354 | 24629 | 3966 | 1600 |
| 615 | 279 | 258 | 322 | 588 | 2065 | 14632 | 1842 | 903 |
| 616 | 318 | 227 | 297 | 908 | 4480 | 24831 | 4101 | 1742 |
| 617 | 258 | 238 | 297 | 548 | 2027 | 14412 | 1825 | 939 |
| 618 | 265 | 188 | 248 | 805 | 4458 | 25028 | 4062 | 1642 |
| 619 | 266 | 249 | 309 | 557 | 1966 | 14241 | 1750 | 863 |
| 620 | 330 | 236 | 309 | 938 | 4575 | 25226 | 4183 | 1765 |
| 621 | 252 | 234 | 289 | 523 | 1934 | 14021 | 1744 | 915 |
| 622 | 277 | 195 | 261 | 842 | 4557 | 25407 | 4154 | 1686 |
| 623 | 251 | 238 | 294 | 524 | 1865 | 13853 | 1658 | 823 |
| 624 | 339 | 242 | 320 | 964 | 4665 | 25620 | 4260 | 1782 |
| 625 | 246 | 231 | 281 | 500 | 1843 | 13642 | 1664 | 891 |
| 626 | 291 | 204 | 278 | 884 | 4655 | 25765 | 4245 | 1732 |
| 627 | 238 | 227 | 279 | 493 | 1766 | 13457 | 1569 | 786 |
| 628 | 346 | 247 | 329 | 988 | 4745 | 25962 | 4328 | 1795 |
| 629 | 241 | 228 | 275 | 478 | 1755 | 13256 | 1585 | 865 |
| 630 | 308 | 216 | 297 | 932 | 4760 | 26127 | 4344 | 1785 |
| 631 | 223 | 217 | 264 | 462 | 1679 | 13105 | 1490 | 755 |
| 632 | 352 | 252 | 337 | 1009 | 4831 | 26334 | 4401 | 1810 |
| 633 | 234 | 225 | 267 | 456 | 1675 | 12936 | 1513 | 838 |
| 634 | 325 | 228 | 315 | 979 | 4863 | 26498 | 4438 | 1834 |
| 635 | 209 | 205 | 248 | 430 | 1593 | 12768 | 1413 | 726 |
| 636 | 356 | 255 | 343 | 1025 | 4904 | 26664 | 4462 | 1820 |
| 637 | 227 | 221 | 260 | 435 | 1592 | 12603 | 1436 | 806 |
| 638 | 343 | 241 | 335 | 1026 | 4956 | 26828 | 4523 | 1878 |
| 639 | 195 | 194 | 233 | 400 | 1514 | 12449 | 1344 | 703 |
| 640 | 360 | 258 | 350 | 1042 | 4977 | 26988 | 4523 | 1831 |
| 641 | 219 | 217 | 251 | 414 | 1511 | 12288 | 1360 | 771 |
| 642 | 362 | 255 | 356 | 1073 | 5043 | 27135 | 4602 | 1918 |
| 643 | 182 | 185 | 218 | 371 | 1438 | 12136 | 1278 | 685 |
| 644 | 363 | 260 | 354 | 1055 | 5043 | 27287 | 4579 | 1842 |
| 645 | 210 | 211 | 242 | 391 | 1428 | 11964 | 1282 | 732 |
| 646 | 378 | 267 | 374 | 1112 | 5101 | 27327 | 4654 | 1944 |
| 647 | 172 | 177 | 207 | 345 | 1354 | 11748 | 1207 | 667 |
| 648 | 366 | 262 | 360 | 1069 | 5094 | 27477 | 4622 | 1851 |
| 649 | 200 | 204 | 231 | 367 | 1357 | 11680 | 1215 | 697 |
| 650 | 398 | 283 | 397 | 1162 | 5200 | 27666 | 4743 | 1986 |
| 651 | 164 | 171 | 196 | 323 | 1309 | 11554 | 1172 | 666 |
| 652 | 367 | 263 | 364 | 1081 | 5170 | 27813 | 4689 | 1871 |
| 653 | 187 | 195 | 218 | 342 | 1285 | 11425 | 1146 | 659 |
| 654 | 92 | 87 | 70 | 234 | 1991 | 14682 | 1851 | 916 |
| 655 | 442 | 349 | 492 | 1159 | 4426 | 24386 | 3981 | 1662 |
| 656 | 84 | 88 | 63 | 205 | 2013 | 14954 | 1843 | 834 |
| 657 | 491 | 392 | 543 | 1234 | 4436 | 24256 | 4000 | 1722 |
| 658 | 103 | 93 | 77 | 258 | 2114 | 15165 | 1965 | 964 |
| 659 | 437 | 346 | 487 | 1137 | 4341 | 24040 | 3907 | 1646 |
| 660 | 84 | 85 | 64 | 215 | 2101 | 15371 | 1922 | 854 |
| 661 | 482 | 387 | 534 | 1205 | 4324 | 23835 | 3894 | 1673 |
| 662 | 113 | 100 | 85 | 282 | 2216 | 15592 | 2059 | 1002 |
| 663 | 434 | 346 | 484 | 1118 | 4244 | 23617 | 3823 | 1628 |
| 664 | 87 | 84 | 67 | 231 | 2198 | 15804 | 2011 | 883 |
| 665 | 473 | 381 | 525 | 1175 | 4211 | 23399 | 3790 | 1626 |
| 666 | 123 | 106 | 92 | 306 | 2320 | 16027 | 2155 | 1036 |
| 667 | 431 | 345 | 482 | 1102 | 4146 | 23181 | 3738 | 1610 |
| 668 | 90 | 84 | 70 | 251 | 2301 | 16231 | 2106 | 919 |
| 669 | 461 | 373 | 514 | 1143 | 4101 | 22959 | 3687 | 1579 |
| 670 | 132 | 113 | 100 | 329 | 2428 | 16471 | 2253 | 1069 |
| 671 | 429 | 346 | 479 | 1083 | 4047 | 22742 | 3651 | 1591 |
| 672 | 96 | 85 | 75 | 273 | 2414 | 16693 | 2212 | 962 |
| 673 | 449 | 365 | 501 | 1108 | 3984 | 22508 | 3578 | 1532 |
| 674 | 140 | 118 | 107 | 350 | 2532 | 16923 | 2345 | 1095 |
| 675 | 427 | 346 | 477 | 1066 | 3943 | 22281 | 3558 | 1567 |
| 676 | 103 | 87 | 82 | 300 | 2523 | 17124 | 2314 | 1007 |
| 677 | 437 | 357 | 489 | 1074 | 3868 | 22037 | 3472 | 1487 |
| 678 | 147 | 122 | 112 | 370 | 2637 | 17366 | 2437 | 1120 |
| 679 | 425 | 347 | 475 | 1047 | 3838 | 21814 | 3465 | 1542 |
| 680 | 113 | 92 | 91 | 332 | 2649 | 17605 | 2434 | 1063 |
| 681 | 423 | 348 | 476 | 1037 | 3754 | 21589 | 3366 | 1443 |
| 682 | 152 | 126 | 118 | 389 | 2747 | 17856 | 2533 | 1142 |
| 683 | 423 | 347 | 472 | 1026 | 3729 | 21356 | 3367 | 1512 |
| 684 | 124 | 97 | 100 | 364 | 2767 | 18064 | 2545 | 1117 |
| 685 | 409 | 337 | 460 | 999 | 3634 | 21117 | 3257 | 1399 |
| 686 | 157 | 128 | 123 | 408 | 2852 | 18328 | 2624 | 1161 |
| 687 | 421 | 347 | 470 | 1008 | 3621 | 20893 | 3269 | 1480 |
| 688 | 137 | 105 | 112 | 400 | 2892 | 18540 | 2663 | 1174 |
| 689 | 395 | 328 | 446 | 961 | 3515 | 20638 | 3149 | 1358 |
| 690 | 161 | 130 | 128 | 426 | 2957 | 18799 | 2714 | 1179 |
| 691 | 416 | 347 | 466 | 986 | 3508 | 20423 | 3165 | 1441 |
| 692 | 151 | 114 | 124 | 439 | 3019 | 19024 | 2782 | 1231 |
| 693 | 379 | 316 | 430 | 922 | 3396 | 20158 | 3041 | 1318 |
| 694 | 164 | 131 | 133 | 443 | 3061 | 19266 | 2804 | 1199 |
| 695 | 411 | 345 | 461 | 962 | 3392 | 19946 | 3058 | 1398 |
| 696 | 166 | 124 | 138 | 480 | 3146 | 19506 | 2900 | 1285 |
| 697 | 365 | 307 | 416 | 885 | 3282 | 19683 | 2939 | 1285 |
| 698 | 167 | 133 | 137 | 461 | 3169 | 19742 | 2899 | 1222 |
| 699 | 404 | 341 | 453 | 937 | 3276 | 19466 | 2949 | 1352 |
| 700 | 181 | 135 | 153 | 524 | 3273 | 19983 | 3018 | 1338 |
| 701 | 354 | 299 | 404 | 852 | 3170 | 19208 | 2841 | 1257 |
| 702 | 171 | 134 | 142 | 480 | 3280 | 20221 | 2997 | 1249 |
| 703 | 394 | 335 | 443 | 904 | 3154 | 18985 | 2835 | 1301 |
| 704 | 198 | 146 | 168 | 564 | 3397 | 20460 | 3131 | 1386 |
| 705 | 345 | 293 | 394 | 823 | 3060 | 18730 | 2745 | 1233 |
| 706 | 175 | 135 | 147 | 501 | 3392 | 20704 | 3097 | 1280 |
| 707 | 381 | 327 | 430 | 869 | 3032 | 18512 | 2722 | 1250 |
| 708 | 213 | 156 | 183 | 603 | 3516 | 20930 | 3238 | 1429 |
| 709 | 338 | 289 | 385 | 796 | 2951 | 18255 | 2650 | 1211 |
| 710 | 180 | 137 | 154 | 526 | 3504 | 21174 | 3199 | 1314 |
| 711 | 368 | 318 | 417 | 834 | 2913 | 18046 | 2612 | 1200 |
| 712 | 229 | 167 | 198 | 641 | 3637 | 21408 | 3347 | 1471 |
| 713 | 331 | 285 | 377 | 770 | 2841 | 17776 | 2554 | 1187 |
| 714 | 187 | 139 | 162 | 555 | 3620 | 21644 | 3304 | 1354 |
| 715 | 354 | 309 | 403 | 798 | 2792 | 17572 | 2500 | 1150 |
| 716 | 242 | 177 | 211 | 676 | 3755 | 21892 | 3452 | 1506 |
| 717 | 325 | 282 | 370 | 743 | 2732 | 17307 | 2459 | 1164 |
| 718 | 194 | 142 | 171 | 584 | 3731 | 22096 | 3406 | 1395 |
| 719 | 340 | 299 | 388 | 762 | 2673 | 17104 | 2389 | 1102 |
| 720 | 254 | 186 | 224 | 708 | 3866 | 22358 | 3550 | 1536 |
| 721 | 320 | 280 | 364 | 720 | 2627 | 16854 | 2367 | 1140 |
| 722 | 205 | 148 | 182 | 622 | 3850 | 22558 | 3516 | 1445 |
| 723 | 326 | 289 | 373 | 726 | 2553 | 16630 | 2280 | 1056 |
| 724 | 264 | 192 | 234 | 737 | 3974 | 22814 | 3645 | 1561 |
| 725 | 314 | 277 | 357 | 696 | 2523 | 16403 | 2276 | 1114 |
| 726 | 218 | 155 | 197 | 663 | 3972 | 23020 | 3631 | 1499 |
| 727 | 311 | 277 | 357 | 689 | 2440 | 16181 | 2177 | 1013 |
| 728 | 272 | 198 | 243 | 761 | 4074 | 23250 | 3731 | 1581 |
| 729 | 309 | 275 | 350 | 670 | 2416 | 15953 | 2180 | 1083 |
| 730 | 233 | 165 | 213 | 707 | 4088 | 23454 | 3740 | 1553 |
| 731 | 295 | 266 | 342 | 654 | 2328 | 15732 | 2076 | 972 |
| 732 | 277 | 202 | 250 | 784 | 4172 | 23675 | 3814 | 1598 |
| 733 | 303 | 272 | 344 | 649 | 2313 | 15504 | 2087 | 1051 |
| 734 | 250 | 176 | 230 | 755 | 4207 | 23873 | 3851 | 1609 |
| 735 | 281 | 255 | 326 | 618 | 2223 | 15295 | 1981 | 937 |
| 736 | 284 | 206 | 259 | 808 | 4276 | 24110 | 3904 | 1619 |
| 737 | 297 | 269 | 337 | 624 | 2213 | 15086 | 1996 | 1016 |
| 738 | 268 | 188 | 249 | 803 | 4326 | 24302 | 3960 | 1663 |
| 739 | 265 | 244 | 309 | 581 | 2123 | 14894 | 1892 | 905 |
| 740 | 289 | 209 | 266 | 828 | 4374 | 24546 | 3988 | 1638 |
| 741 | 289 | 265 | 329 | 598 | 2110 | 14682 | 1901 | 977 |
| 742 | 286 | 201 | 268 | 851 | 4438 | 24723 | 4063 | 1712 |
| 743 | 251 | 233 | 294 | 547 | 2020 | 14475 | 1800 | 875 |
| 744 | 294 | 212 | 273 | 847 | 4465 | 24951 | 4066 | 1656 |
| 745 | 281 | 261 | 320 | 573 | 2010 | 14282 | 1806 | 935 |
| 746 | 304 | 214 | 287 | 898 | 4532 | 25066 | 4148 | 1753 |
| 747 | 239 | 224 | 280 | 515 | 1908 | 13971 | 1701 | 846 |
| 748 | 299 | 215 | 279 | 867 | 4548 | 25278 | 4137 | 1673 |
| 749 | 270 | 253 | 309 | 545 | 1914 | 13892 | 1718 | 893 |
| 750 | 324 | 228 | 308 | 949 | 4656 | 25507 | 4261 | 1804 |
| 751 | 229 | 217 | 269 | 487 | 1837 | 13676 | 1642 | 835 |
| 752 | 302 | 216 | 285 | 885 | 4648 | 25723 | 4227 | 1700 |
| 753 | 257 | 245 | 296 | 515 | 1816 | 13528 | 1624 | 847 |
| 754 | 343 | 242 | 328 | 996 | 4758 | 25909 | 4352 | 1841 |
| 755 | 220 | 211 | 258 | 461 | 1755 | 13349 | 1573 | 820 |
| 756 | 305 | 218 | 290 | 902 | 4728 | 26087 | 4297 | 1720 |
| 757 | 244 | 235 | 283 | 486 | 1717 | 13160 | 1532 | 801 |
| 758 | 359 | 255 | 347 | 1038 | 4850 | 26270 | 4433 | 1872 |
| 759 | 213 | 207 | 249 | 438 | 1672 | 12989 | 1502 | 805 |
| 760 | 311 | 221 | 298 | 930 | 4818 | 26454 | 4378 | 1752 |
| 761 | 229 | 224 | 267 | 454 | 1625 | 12828 | 1445 | 759 |
| 762 | 374 | 267 | 363 | 1073 | 4933 | 26612 | 4504 | 1896 |
| 763 | 207 | 203 | 242 | 416 | 1592 | 12648 | 1433 | 790 |
| 764 | 318 | 225 | 308 | 958 | 4898 | 26773 | 4451 | 1784 |
| 765 | 217 | 216 | 255 | 426 | 1538 | 12503 | 1365 | 722 |
| 766 | 386 | 275 | 376 | 1101 | 5009 | 26933 | 4569 | 1913 |
| 767 | 201 | 199 | 233 | 394 | 1516 | 12327 | 1367 | 774 |
| 768 | 328 | 232 | 321 | 992 | 4982 | 27093 | 4529 | 1822 |
| 769 | 203 | 205 | 241 | 398 | 1454 | 12184 | 1289 | 687 |
| 770 | 396 | 284 | 388 | 1128 | 5081 | 27233 | 4630 | 1928 |
| 771 | 195 | 195 | 225 | 373 | 1444 | 12024 | 1306 | 757 |
| 772 | 341 | 240 | 336 | 1029 | 5062 | 27380 | 4604 | 1862 |
| 773 | 191 | 195 | 227 | 371 | 1379 | 11895 | 1220 | 657 |
| 774 | 403 | 289 | 398 | 1150 | 5150 | 27537 | 4688 | 1939 |
| 775 | 190 | 192 | 218 | 353 | 1378 | 11748 | 1248 | 740 |
| 776 | 354 | 249 | 351 | 1066 | 5139 | 27652 | 4676 | 1902 |
| 777 | 177 | 184 | 212 | 343 | 1307 | 11619 | 1155 | 629 |
| 778 | 409 | 293 | 405 | 1167 | 5210 | 27804 | 4737 | 1946 |
| 779 | 185 | 189 | 211 | 334 | 1316 | 11499 | 1193 | 721 |
| 780 | 371 | 262 | 371 | 1110 | 5219 | 27928 | 4750 | 1945 |
| 781 | 165 | 174 | 198 | 317 | 1239 | 11356 | 1095 | 605 |
| 782 | 413 | 297 | 412 | 1182 | 5261 | 28031 | 4778 | 1949 |
| 783 | 179 | 186 | 204 | 315 | 1253 | 11245 | 1135 | 697 |
| 784 | 388 | 275 | 390 | 1153 | 5291 | 28162 | 4817 | 1984 |
| 785 | 152 | 163 | 184 | 291 | 1181 | 11129 | 1045 | 588 |
| 786 | 416 | 299 | 417 | 1194 | 5313 | 28273 | 4820 | 1953 |
| 787 | 173 | 182 | 197 | 297 | 1194 | 11022 | 1080 | 671 |
| 788 | 405 | 288 | 410 | 1195 | 5356 | 28377 | 4876 | 2018 |
| 789 | 140 | 154 | 171 | 267 | 1128 | 10908 | 1000 | 577 |
| 790 | 418 | 301 | 421 | 1203 | 5355 | 28466 | 4854 | 1955 |
| 791 | 166 | 178 | 189 | 279 | 1140 | 10823 | 1029 | 643 |
| 792 | 423 | 301 | 429 | 1235 | 5416 | 28573 | 4930 | 2048 |
| 793 | 130 | 146 | 160 | 246 | 1084 | 10722 | 965 | 571 |
| 794 | 419 | 302 | 425 | 1211 | 5399 | 28667 | 4890 | 1960 |
| 795 | 156 | 171 | 180 | 261 | 1089 | 10645 | 979 | 612 |
| 796 | 440 | 315 | 449 | 1276 | 5469 | 28747 | 4977 | 2072 |
| 797 | 122 | 140 | 150 | 227 | 1045 | 10553 | 935 | 569 |
| 798 | 419 | 303 | 427 | 1217 | 5433 | 28828 | 4919 | 1964 |
| 799 | 146 | 164 | 170 | 243 | 1043 | 10496 | 934 | 582 |
| 800 | 456 | 327 | 468 | 1311 | 5515 | 28905 | 5017 | 2091 |
| 801 | 116 | 135 | 141 | 210 | 1012 | 10404 | 910 | 570 |
| 802 | 419 | 303 | 430 | 1224 | 5465 | 28966 | 4945 | 1970 |
| 803 | 135 | 156 | 159 | 223 | 1001 | 10366 | 893 | 554 |
| 804 | 470 | 340 | 485 | 1341 | 5552 | 29035 | 5048 | 2104 |
| 805 | 112 | 132 | 134 | 197 | 985 | 10281 | 891 | 574 |
| 806 | 421 | 304 | 434 | 1233 | 5493 | 29081 | 4970 | 1980 |
| 807 | 125 | 148 | 148 | 205 | 961 | 10236 | 855 | 529 |
| 808 | 482 | 350 | 499 | 1363 | 5573 | 29105 | 5063 | 2109 |
| 809 | 108 | 129 | 127 | 184 | 965 | 10185 | 878 | 579 |
| 810 | 423 | 305 | 438 | 1244 | 5517 | 29170 | 4993 | 1993 |
| 811 | 115 | 140 | 138 | 188 | 932 | 10156 | 827 | 510 |
| 812 | 491 | 358 | 510 | 1382 | 5601 | 29222 | 5084 | 2111 |
| 813 | 106 | 127 | 122 | 173 | 947 | 10109 | 866 | 582 |
| 814 | 429 | 310 | 447 | 1261 | 5541 | 29244 | 5016 | 2011 |
| 815 | 105 | 131 | 127 | 172 | 906 | 10084 | 802 | 492 |
| 816 | 497 | 364 | 519 | 1394 | 5614 | 29284 | 5091 | 2106 |
| 817 | 103 | 125 | 116 | 162 | 935 | 10058 | 859 | 586 |
| 818 | 436 | 315 | 456 | 1280 | 5561 | 29292 | 5036 | 2031 |
| 819 | 97 | 123 | 117 | 157 | 891 | 10057 | 789 | 482 |
| 820 | 500 | 367 | 522 | 1397 | 5616 | 29322 | 5089 | 2094 |
| 821 | 102 | 124 | 112 | 153 | 925 | 10027 | 853 | 586 |
| 822 | 447 | 324 | 470 | 1303 | 5578 | 29317 | 5053 | 2051 |
| 823 | 89 | 115 | 108 | 145 | 879 | 10036 | 779 | 474 |
| 824 | 501 | 369 | 526 | 1401 | 5614 | 29336 | 5082 | 2082 |
| 825 | 100 | 123 | 107 | 145 | 921 | 10020 | 850 | 585 |
| 826 | 458 | 333 | 483 | 1326 | 5588 | 29311 | 5065 | 2070 |
| 827 | 81 | 107 | 99 | 133 | 871 | 10018 | 774 | 471 |
| 828 | 502 | 370 | 529 | 1403 | 5608 | 29319 | 5072 | 2069 |
| 829 | 98 | 121 | 103 | 137 | 922 | 10039 | 853 | 583 |
| 830 | 470 | 343 | 497 | 1350 | 5597 | 29297 | 5075 | 2088 |
| 831 | 74 | 100 | 90 | 123 | 877 | 10053 | 783 | 477 |
| 832 | 500 | 370 | 529 | 1398 | 5595 | 29288 | 5057 | 2054 |
| 833 | 95 | 119 | 99 | 130 | 926 | 10081 | 855 | 577 |
| 834 | 481 | 353 | 511 | 1371 | 5595 | 29242 | 5073 | 2099 |
| 835 | 68 | 93 | 82 | 114 | 888 | 10103 | 797 | 487 |
| 836 | 497 | 368 | 528 | 1390 | 5574 | 29228 | 5033 | 2036 |
| 837 | 92 | 117 | 94 | 123 | 935 | 10153 | 860 | 568 |
| 838 | 493 | 363 | 526 | 1394 | 5594 | 29196 | 5072 | 2109 |
| 839 | 63 | 88 | 74 | 107 | 908 | 10183 | 821 | 503 |
| 840 | 493 | 367 | 526 | 1380 | 5549 | 29145 | 5007 | 2019 |
| 841 | 87 | 113 | 89 | 117 | 946 | 10240 | 867 | 557 |
| 842 | 505 | 374 | 539 | 1412 | 5578 | 29094 | 5057 | 2111 |
| 843 | 60 | 85 | 69 | 103 | 935 | 10280 | 851 | 525 |
| 844 | 489 | 363 | 522 | 1367 | 5518 | 29037 | 4977 | 2002 |
| 845 | 81 | 108 | 83 | 111 | 960 | 10340 | 876 | 546 |
| 846 | 515 | 383 | 551 | 1429 | 5557 | 28973 | 5037 | 2108 |
| 847 | 59 | 84 | 65 | 101 | 968 | 10401 | 888 | 550 |
| 848 | 483 | 360 | 518 | 1355 | 5485 | 28908 | 4945 | 1987 |
| 849 | 75 | 103 | 77 | 106 | 982 | 10477 | 892 | 537 |
| 850 | 524 | 392 | 563 | 1440 | 5531 | 28839 | 5010 | 2100 |
| 851 | 59 | 83 | 63 | 101 | 1007 | 10543 | 929 | 575 |
| 852 | 478 | 357 | 515 | 1343 | 5447 | 28754 | 4911 | 1974 |
| 853 | 69 | 98 | 71 | 101 | 1011 | 10641 | 917 | 533 |
| 854 | 530 | 399 | 571 | 1445 | 5493 | 28675 | 4973 | 2084 |
| 855 | 61 | 84 | 61 | 103 | 1051 | 10715 | 975 | 601 |
| 856 | 474 | 354 | 512 | 1334 | 5406 | 28587 | 4876 | 1966 |
| 857 | 64 | 92 | 66 | 97 | 1044 | 10820 | 946 | 532 |
| 858 | 534 | 403 | 576 | 1445 | 5451 | 28506 | 4932 | 2064 |
| 859 | 63 | 85 | 60 | 107 | 1095 | 10892 | 1021 | 624 |
| 860 | 474 | 355 | 514 | 1330 | 5363 | 28379 | 4839 | 1961 |
| 861 | 59 | 87 | 61 | 95 | 1084 | 11017 | 981 | 536 |
| 862 | 534 | 406 | 578 | 1436 | 5398 | 28298 | 4881 | 2037 |
| 863 | 66 | 86 | 59 | 111 | 1152 | 11121 | 1076 | 650 |
| 864 | 474 | 356 | 516 | 1326 | 5314 | 28156 | 4797 | 1956 |
| 865 | 55 | 82 | 56 | 94 | 1124 | 11219 | 1019 | 543 |
| 866 | 531 | 405 | 576 | 1425 | 5338 | 28063 | 4822 | 2006 |
| 867 | 70 | 89 | 60 | 117 | 1209 | 11353 | 1131 | 673 |
| 868 | 477 | 360 | 519 | 1325 | 5268 | 27924 | 4758 | 1956 |
| 869 | 52 | 78 | 52 | 96 | 1181 | 11475 | 1071 | 558 |
| 870 | 526 | 403 | 572 | 1407 | 5271 | 27817 | 4757 | 1973 |
| 871 | 74 | 91 | 60 | 123 | 1268 | 11607 | 1186 | 693 |
| 872 | 482 | 365 | 526 | 1326 | 5216 | 27670 | 4714 | 1954 |
| 873 | 51 | 73 | 49 | 99 | 1238 | 11734 | 1126 | 577 |
| 874 | 521 | 400 | 567 | 1388 | 5200 | 27546 | 4690 | 1939 |
| 875 | 77 | 92 | 60 | 130 | 1330 | 11882 | 1244 | 711 |
| 876 | 486 | 370 | 531 | 1325 | 5157 | 27392 | 4663 | 1948 |
| 877 | 51 | 70 | 47 | 106 | 1306 | 12020 | 1191 | 604 |
| 878 | 513 | 395 | 560 | 1365 | 5122 | 27254 | 4615 | 1903 |
| 879 | 80 | 94 | 61 | 136 | 1394 | 12171 | 1299 | 724 |
| 880 | 491 | 376 | 537 | 1325 | 5096 | 27101 | 4609 | 1940 |
| 881 | 52 | 67 | 46 | 115 | 1378 | 12316 | 1261 | 636 |
| 882 | 505 | 390 | 553 | 1343 | 5045 | 26955 | 4543 | 1869 |
| 883 | 81 | 94 | 61 | 142 | 1457 | 12465 | 1355 | 733 |
| 884 | 496 | 381 | 543 | 1326 | 5031 | 26787 | 4551 | 1929 |
| 885 | 54 | 66 | 46 | 126 | 1456 | 12614 | 1338 | 674 |
| 886 | 496 | 384 | 546 | 1317 | 4965 | 26629 | 4468 | 1836 |
| 887 | 82 | 94 | 61 | 150 | 1535 | 12813 | 1422 | 745 |
| 888 | 499 | 386 | 547 | 1320 | 4955 | 26453 | 4482 | 1910 |
| 889 | 58 | 68 | 48 | 140 | 1546 | 12965 | 1425 | 717 |
| 890 | 486 | 377 | 535 | 1287 | 4875 | 26287 | 4385 | 1799 |
| 891 | 81 | 93 | 61 | 157 | 1606 | 13158 | 1483 | 752 |
| 892 | 503 | 391 | 552 | 1316 | 4880 | 26122 | 4413 | 1889 |
| 893 | 64 | 70 | 50 | 157 | 1635 | 13316 | 1512 | 761 |
| 894 | 474 | 370 | 524 | 1257 | 4784 | 25929 | 4301 | 1765 |
| 895 | 81 | 91 | 61 | 164 | 1684 | 13529 | 1550 | 761 |
| 896 | 505 | 395 | 555 | 1307 | 4794 | 25756 | 4333 | 1861 |
| 897 | 71 | 74 | 55 | 176 | 1730 | 13685 | 1603 | 806 |
| 898 | 464 | 363 | 514 | 1228 | 4690 | 25550 | 4216 | 1735 |
| 899 | 80 | 89 | 60 | 172 | 1761 | 13888 | 1616 | 772 |
| 900 | 506 | 398 | 557 | 1297 | 4708 | 25385 | 4252 | 1830 |
| 901 | 79 | 79 | 60 | 198 | 1830 | 14066 | 1699 | 853 |
| 902 | 454 | 356 | 504 | 1198 | 4594 | 25150 | 4130 | 1708 |
| 903 | 80 | 87 | 60 | 181 | 1846 | 14277 | 1691 | 788 |
| 904 | 503 | 398 | 555 | 1278 | 4609 | 24983 | 4160 | 1791 |
| 905 | 88 | 85 | 67 | 221 | 1934 | 14470 | 1798 | 898 |
| 906 | 446 | 351 | 496 | 1174 | 4504 | 24765 | 4051 | 1687 |
| 907 | 80 | 86 | 61 | 191 | 1934 | 14677 | 1769 | 807 |
| 908 | 497 | 396 | 549 | 1254 | 4506 | 24576 | 4063 | 1747 |
| 909 | 98 | 91 | 74 | 245 | 2037 | 14878 | 1895 | 940 |
| 910 | 441 | 348 | 491 | 1153 | 4409 | 24349 | 3969 | 1668 |
| 911 | 81 | 84 | 62 | 203 | 2026 | 15082 | 1853 | 831 |
| 912 | 488 | 391 | 541 | 1226 | 4399 | 24159 | 3963 | 1701 |
| 913 | 108 | 98 | 81 | 267 | 2141 | 15300 | 1991 | 978 |
| 914 | 437 | 347 | 487 | 1133 | 4313 | 23924 | 3885 | 1649 |
| 915 | 83 | 83 | 64 | 218 | 2126 | 15517 | 1944 | 860 |
| 916 | 478 | 384 | 531 | 1194 | 4289 | 23731 | 3860 | 1653 |
| 917 | 118 | 104 | 88 | 290 | 2245 | 15727 | 2086 | 1013 |
| 918 | 436 | 347 | 486 | 1118 | 4218 | 23493 | 3802 | 1633 |
| 919 | 87 | 83 | 67 | 237 | 2230 | 15949 | 2040 | 895 |
| 920 | 467 | 377 | 520 | 1162 | 4177 | 23286 | 3755 | 1606 |
| 921 | 127 | 110 | 95 | 313 | 2351 | 16161 | 2182 | 1045 |
| 922 | 433 | 347 | 483 | 1100 | 4118 | 23047 | 3714 | 1612 |
| 923 | 92 | 83 | 72 | 259 | 2340 | 16395 | 2143 | 937 |
| 924 | 455 | 369 | 508 | 1129 | 4064 | 22842 | 3651 | 1560 |
| 925 | 136 | 116 | 102 | 334 | 2460 | 16628 | 2280 | 1075 |
| 926 | 431 | 348 | 481 | 1082 | 4016 | 22602 | 3625 | 1590 |
| 927 | 98 | 85 | 78 | 284 | 2451 | 16840 | 2247 | 982 |
| 928 | 444 | 362 | 496 | 1095 | 3950 | 22391 | 3546 | 1515 |
| 929 | 142 | 120 | 108 | 354 | 2566 | 17083 | 2373 | 1099 |
| 930 | 430 | 349 | 480 | 1064 | 3914 | 22152 | 3534 | 1566 |
| 931 | 107 | 88 | 86 | 313 | 2569 | 17297 | 2359 | 1034 |
| 932 | 430 | 352 | 482 | 1059 | 3833 | 21926 | 3437 | 1469 |
| 933 | 147 | 123 | 113 | 372 | 2670 | 17545 | 2463 | 1119 |
| 934 | 428 | 349 | 477 | 1045 | 3806 | 21687 | 3437 | 1537 |
| 935 | 118 | 94 | 95 | 346 | 2691 | 17762 | 2475 | 1090 |
| 936 | 416 | 342 | 468 | 1020 | 3714 | 21452 | 3329 | 1425 |
| 937 | 152 | 125 | 118 | 390 | 2771 | 18000 | 2551 | 1136 |
| 938 | 426 | 350 | 475 | 1027 | 3699 | 21223 | 3339 | 1505 |
| 939 | 131 | 102 | 106 | 381 | 2813 | 18224 | 2590 | 1146 |
| 940 | 401 | 332 | 453 | 983 | 3598 | 20980 | 3223 | 1384 |
| 941 | 155 | 127 | 123 | 409 | 2881 | 18480 | 2645 | 1157 |
| 942 | 422 | 350 | 472 | 1006 | 3588 | 20750 | 3238 | 1468 |
| 943 | 144 | 110 | 118 | 420 | 2942 | 18707 | 2711 | 1204 |
| 944 | 386 | 321 | 437 | 944 | 3482 | 20513 | 3119 | 1346 |
| 945 | 159 | 128 | 127 | 425 | 2987 | 18957 | 2738 | 1177 |
| 946 | 417 | 348 | 467 | 982 | 3473 | 20277 | 3131 | 1426 |
| 947 | 159 | 120 | 131 | 459 | 3067 | 19181 | 2827 | 1258 |
| 948 | 373 | 311 | 423 | 908 | 3367 | 20035 | 3016 | 1313 |
| 949 | 162 | 129 | 131 | 442 | 3094 | 19432 | 2830 | 1199 |
| 950 | 410 | 345 | 460 | 957 | 3357 | 19805 | 3023 | 1381 |
| 951 | 174 | 130 | 146 | 500 | 3192 | 19660 | 2944 | 1311 |
| 952 | 361 | 304 | 411 | 874 | 3252 | 19550 | 2915 | 1283 |
| 953 | 165 | 130 | 136 | 461 | 3203 | 19910 | 2928 | 1225 |
| 954 | 401 | 340 | 451 | 928 | 3237 | 19326 | 2911 | 1332 |
| 955 | 190 | 141 | 161 | 542 | 3316 | 20137 | 3058 | 1360 |
| 956 | 351 | 297 | 400 | 843 | 3139 | 19067 | 2815 | 1256 |
| 957 | 169 | 132 | 141 | 482 | 3314 | 20385 | 3026 | 1254 |
| 958 | 389 | 332 | 439 | 893 | 3113 | 18840 | 2796 | 1279 |
| 959 | 206 | 152 | 175 | 581 | 3439 | 20617 | 3169 | 1405 |
| 960 | 343 | 292 | 391 | 815 | 3030 | 18593 | 2720 | 1234 |
| 961 | 173 | 133 | 146 | 504 | 3425 | 20863 | 3127 | 1286 |
| 962 | 376 | 323 | 425 | 856 | 2989 | 18353 | 2680 | 1227 |
| 963 | 221 | 162 | 190 | 618 | 3555 | 21083 | 3274 | 1444 |
| 964 | 337 | 289 | 384 | 789 | 2920 | 18114 | 2625 | 1211 |
| 965 | 179 | 135 | 154 | 531 | 3540 | 21337 | 3231 | 1325 |
| 966 | 362 | 314 | 411 | 820 | 2869 | 17890 | 2569 | 1177 |
| 967 | 236 | 173 | 204 | 655 | 3677 | 21577 | 3383 | 1483 |
| 968 | 332 | 286 | 377 | 765 | 2812 | 17647 | 2531 | 1188 |
| 969 | 187 | 138 | 163 | 563 | 3657 | 21807 | 3339 | 1368 |
| 970 | 348 | 304 | 396 | 784 | 2749 | 17422 | 2459 | 1128 |
| 971 | 247 | 181 | 216 | 686 | 3788 | 22044 | 3481 | 1512 |
| 972 | 326 | 284 | 371 | 741 | 2706 | 17181 | 2438 | 1164 |
| 973 | 197 | 143 | 174 | 599 | 3775 | 22269 | 3449 | 1417 |
| 974 | 334 | 294 | 382 | 748 | 2632 | 16957 | 2351 | 1083 |
| 975 | 257 | 188 | 226 | 715 | 3898 | 22506 | 3576 | 1538 |
| 976 | 321 | 281 | 364 | 716 | 2597 | 16717 | 2342 | 1136 |
| 977 | 210 | 151 | 189 | 640 | 3894 | 22716 | 3560 | 1471 |
| 978 | 320 | 283 | 367 | 713 | 2519 | 16503 | 2249 | 1040 |
| 979 | 265 | 193 | 235 | 741 | 4005 | 22962 | 3670 | 1561 |
| 980 | 315 | 279 | 358 | 692 | 2494 | 16275 | 2251 | 1108 |
| 981 | 225 | 160 | 204 | 683 | 4016 | 23170 | 3674 | 1526 |
| 982 | 304 | 272 | 351 | 676 | 2407 | 16057 | 2146 | 999 |
| 983 | 271 | 197 | 243 | 765 | 4107 | 23408 | 3757 | 1580 |
| 984 | 309 | 276 | 350 | 667 | 2388 | 15832 | 2154 | 1075 |
| 985 | 241 | 171 | 221 | 730 | 4136 | 23615 | 3785 | 1581 |
| 986 | 288 | 260 | 334 | 638 | 2295 | 15611 | 2045 | 959 |
| 987 | 277 | 201 | 251 | 787 | 4206 | 23845 | 3841 | 1598 |
| 988 | 303 | 274 | 344 | 644 | 2283 | 15392 | 2059 | 1039 |
| 989 | 51 | 72 | 52 | 97 | 1109 | 11093 | 1016 | 568 |
| 990 | 501 | 379 | 543 | 1370 | 5328 | 28190 | 4802 | 1947 |
| 991 | 74 | 97 | 65 | 109 | 1158 | 11219 | 1070 | 616 |
| 992 | 514 | 389 | 557 | 1399 | 5343 | 28074 | 4839 | 2038 |
| 993 | 52 | 71 | 50 | 102 | 1168 | 11325 | 1076 | 602 |
| 994 | 492 | 373 | 535 | 1347 | 5265 | 27950 | 4742 | 1920 |
| 995 | 70 | 94 | 62 | 110 | 1205 | 11455 | 1107 | 615 |
| 996 | 521 | 396 | 565 | 1402 | 5288 | 27818 | 4786 | 2021 |
| 997 | 54 | 72 | 50 | 110 | 1233 | 11570 | 1140 | 637 |
| 998 | 484 | 368 | 527 | 1324 | 5200 | 27691 | 4682 | 1896 |
| 999 | 67 | 89 | 58 | 110 | 1256 | 11713 | 1150 | 615 |
| 1000 | 525 | 402 | 572 | 1402 | 5229 | 27563 | 4731 | 2001 |
| 1001 | 58 | 74 | 51 | 120 | 1305 | 11850 | 1212 | 674 |
| 1002 | 476 | 363 | 521 | 1304 | 5135 | 27431 | 4624 | 1876 |
| 1003 | 64 | 86 | 55 | 112 | 1318 | 12015 | 1204 | 623 |
| 1004 | 527 | 406 | 575 | 1395 | 5160 | 27282 | 4665 | 1973 |
| 1005 | 63 | 77 | 52 | 131 | 1378 | 12142 | 1283 | 708 |
| 1006 | 471 | 359 | 516 | 1287 | 5065 | 27136 | 4562 | 1859 |
| 1007 | 61 | 83 | 53 | 115 | 1379 | 12316 | 1259 | 632 |
| 1008 | 526 | 407 | 575 | 1381 | 5085 | 26990 | 4593 | 1940 |
| 1009 | 69 | 80 | 55 | 143 | 1453 | 12446 | 1355 | 742 |
| 1010 | 468 | 358 | 513 | 1273 | 4992 | 26815 | 4498 | 1846 |
| 1011 | 59 | 79 | 51 | 120 | 1447 | 12632 | 1320 | 647 |
| 1012 | 523 | 406 | 572 | 1364 | 5005 | 26674 | 4517 | 1904 |
| 1013 | 75 | 84 | 58 | 157 | 1530 | 12758 | 1429 | 773 |
| 1014 | 467 | 359 | 514 | 1264 | 4919 | 26477 | 4435 | 1836 |
| 1015 | 59 | 76 | 49 | 127 | 1522 | 12963 | 1388 | 666 |
| 1016 | 516 | 402 | 565 | 1341 | 4917 | 26333 | 4433 | 1864 |
| 1017 | 82 | 88 | 61 | 172 | 1621 | 13128 | 1513 | 807 |
| 1018 | 466 | 361 | 515 | 1253 | 4843 | 26134 | 4369 | 1825 |
| 1019 | 59 | 73 | 49 | 136 | 1599 | 13304 | 1459 | 690 |
| 1020 | 508 | 398 | 559 | 1317 | 4825 | 25976 | 4347 | 1823 |
| 1021 | 89 | 92 | 65 | 187 | 1706 | 13489 | 1592 | 835 |
| 1022 | 468 | 363 | 516 | 1244 | 4766 | 25782 | 4302 | 1815 |
| 1023 | 61 | 71 | 49 | 149 | 1685 | 13668 | 1540 | 720 |
| 1024 | 499 | 392 | 550 | 1290 | 4728 | 25597 | 4257 | 1782 |
| 1025 | 95 | 96 | 69 | 201 | 1795 | 13866 | 1671 | 859 |
| 1026 | 469 | 366 | 518 | 1234 | 4683 | 25402 | 4229 | 1800 |
| 1027 | 64 | 70 | 51 | 165 | 1782 | 14064 | 1632 | 760 |
| 1028 | 489 | 386 | 540 | 1259 | 4625 | 25199 | 4160 | 1738 |
| 1029 | 99 | 99 | 72 | 213 | 1881 | 14252 | 1748 | 878 |
| 1030 | 471 | 369 | 520 | 1224 | 4596 | 25011 | 4153 | 1782 |
| 1031 | 69 | 70 | 54 | 183 | 1881 | 14456 | 1727 | 803 |
| 1032 | 478 | 378 | 529 | 1228 | 4527 | 24815 | 4069 | 1699 |
| 1033 | 103 | 101 | 74 | 226 | 1971 | 14654 | 1826 | 895 |
| 1034 | 472 | 372 | 522 | 1213 | 4503 | 24596 | 4069 | 1760 |
| 1035 | 76 | 73 | 59 | 206 | 1986 | 14863 | 1827 | 852 |
| 1036 | 467 | 371 | 518 | 1196 | 4424 | 24403 | 3974 | 1659 |
| 1037 | 106 | 102 | 77 | 239 | 2065 | 15074 | 1908 | 912 |
| 1038 | 472 | 375 | 522 | 1199 | 4407 | 24177 | 3982 | 1733 |
| 1039 | 84 | 77 | 65 | 229 | 2087 | 15250 | 1924 | 899 |
| 1040 | 455 | 363 | 506 | 1163 | 4319 | 23974 | 3878 | 1620 |
| 1041 | 108 | 102 | 79 | 252 | 2159 | 15498 | 1990 | 927 |
| 1042 | 472 | 377 | 522 | 1185 | 4312 | 23766 | 3895 | 1704 |
| 1043 | 93 | 82 | 72 | 256 | 2205 | 15699 | 2037 | 953 |
| 1044 | 440 | 352 | 492 | 1125 | 4208 | 23536 | 3777 | 1580 |
| 1045 | 110 | 102 | 82 | 265 | 2255 | 15936 | 2073 | 943 |
| 1046 | 470 | 378 | 522 | 1169 | 4208 | 23331 | 3800 | 1669 |
| 1047 | 104 | 89 | 81 | 287 | 2323 | 16153 | 2150 | 1007 |
| 1048 | 427 | 344 | 479 | 1090 | 4097 | 23086 | 3677 | 1545 |
| 1049 | 111 | 102 | 84 | 278 | 2351 | 16374 | 2156 | 960 |
| 1050 | 467 | 378 | 519 | 1149 | 4101 | 22885 | 3700 | 1628 |
| 1051 | 116 | 97 | 91 | 319 | 2442 | 16605 | 2261 | 1058 |
| 1052 | 416 | 335 | 466 | 1056 | 3990 | 22640 | 3581 | 1515 |
| 1053 | 113 | 101 | 86 | 291 | 2452 | 16828 | 2245 | 981 |
| 1054 | 461 | 376 | 514 | 1126 | 3986 | 22417 | 3593 | 1583 |
| 1055 | 129 | 105 | 101 | 352 | 2561 | 17069 | 2372 | 1107 |
| 1056 | 408 | 331 | 458 | 1029 | 3884 | 22184 | 3490 | 1492 |
| 1057 | 115 | 102 | 89 | 307 | 2557 | 17292 | 2340 | 1007 |
| 1058 | 452 | 370 | 504 | 1094 | 3870 | 21961 | 3484 | 1533 |
| 1059 | 142 | 114 | 112 | 384 | 2679 | 17532 | 2481 | 1153 |
| 1060 | 401 | 327 | 451 | 1004 | 3777 | 21718 | 3397 | 1469 |
| 1061 | 118 | 101 | 93 | 326 | 2666 | 17760 | 2438 | 1038 |
| 1062 | 440 | 363 | 492 | 1059 | 3748 | 21489 | 3370 | 1481 |
| 1063 | 155 | 123 | 123 | 415 | 2794 | 18000 | 2586 | 1193 |
| 1064 | 396 | 325 | 445 | 981 | 3669 | 21237 | 3302 | 1448 |
| 1065 | 122 | 102 | 98 | 348 | 2779 | 18230 | 2541 | 1073 |
| 1066 | 428 | 355 | 480 | 1025 | 3629 | 21023 | 3259 | 1432 |
| 1067 | 167 | 131 | 134 | 445 | 2910 | 18474 | 2691 | 1231 |
| 1068 | 391 | 322 | 440 | 957 | 3560 | 20765 | 3206 | 1425 |
| 1069 | 128 | 104 | 104 | 373 | 2893 | 18706 | 2646 | 1114 |
| 1070 | 416 | 347 | 467 | 989 | 3507 | 20545 | 3146 | 1383 |
| 1071 | 178 | 138 | 144 | 474 | 3028 | 18967 | 2796 | 1265 |
| 1072 | 387 | 321 | 435 | 934 | 3448 | 20280 | 3108 | 1400 |
| 1073 | 136 | 106 | 112 | 403 | 3010 | 19180 | 2755 | 1160 |
| 1074 | 403 | 338 | 454 | 955 | 3386 | 20059 | 3035 | 1336 |
| 1075 | 188 | 145 | 153 | 500 | 3144 | 19454 | 2899 | 1295 |
| 1076 | 383 | 320 | 430 | 912 | 3340 | 19807 | 3012 | 1375 |
| 1077 | 146 | 111 | 122 | 436 | 3135 | 19662 | 2871 | 1212 |
| 1078 | 388 | 328 | 439 | 916 | 3262 | 19569 | 2921 | 1287 |
| 1079 | 195 | 150 | 160 | 524 | 3253 | 19925 | 2994 | 1319 |
| 1080 | 379 | 319 | 426 | 890 | 3230 | 19334 | 2915 | 1346 |
| 1081 | 158 | 117 | 134 | 474 | 3259 | 20138 | 2988 | 1267 |
| 1082 | 374 | 318 | 425 | 881 | 3144 | 19093 | 2813 | 1244 |
| 1083 | 202 | 154 | 167 | 547 | 3363 | 20404 | 3090 | 1341 |
| 1084 | 375 | 318 | 421 | 867 | 3119 | 18852 | 2814 | 1314 |
| 1085 | 172 | 126 | 147 | 515 | 3389 | 20622 | 3110 | 1327 |
| 1086 | 358 | 306 | 407 | 839 | 3022 | 18610 | 2702 | 1199 |
| 1087 | 207 | 157 | 174 | 568 | 3472 | 20890 | 3183 | 1362 |
| 1088 | 370 | 316 | 416 | 844 | 3004 | 18373 | 2710 | 1278 |
| 1089 | 187 | 136 | 162 | 559 | 3516 | 21097 | 3229 | 1385 |
| 1090 | 342 | 294 | 391 | 799 | 2901 | 18121 | 2592 | 1158 |
| 1091 | 212 | 160 | 180 | 587 | 3571 | 21329 | 3267 | 1378 |
| 1092 | 365 | 315 | 411 | 821 | 2888 | 17879 | 2604 | 1238 |
| 1093 | 204 | 147 | 178 | 605 | 3640 | 21547 | 3344 | 1441 |
| 1094 | 327 | 284 | 375 | 761 | 2787 | 17640 | 2490 | 1123 |
| 1095 | 217 | 163 | 187 | 609 | 3686 | 21816 | 3368 | 1404 |
| 1096 | 358 | 311 | 404 | 795 | 2777 | 17416 | 2500 | 1195 |
| 1097 | 222 | 159 | 196 | 654 | 3774 | 22038 | 3467 | 1498 |
| 1098 | 313 | 273 | 360 | 724 | 2674 | 17170 | 2390 | 1091 |
| 1099 | 221 | 165 | 193 | 629 | 3794 | 22283 | 3462 | 1428 |
| 1100 | 348 | 306 | 393 | 765 | 2661 | 16954 | 2392 | 1148 |
| 1101 | 240 | 171 | 214 | 699 | 3895 | 22501 | 3578 | 1547 |
| 1102 | 301 | 266 | 348 | 691 | 2565 | 16708 | 2295 | 1065 |
| 1103 | 225 | 167 | 199 | 649 | 3899 | 22741 | 3555 | 1453 |
| 1104 | 337 | 299 | 383 | 734 | 2545 | 16497 | 2284 | 1098 |
| 1105 | 257 | 184 | 232 | 746 | 4016 | 22959 | 3687 | 1594 |
| 1106 | 292 | 259 | 337 | 663 | 2460 | 16255 | 2204 | 1042 |
| 1107 | 230 | 168 | 205 | 672 | 4008 | 23205 | 3652 | 1483 |
| 1108 | 324 | 290 | 369 | 699 | 2429 | 16055 | 2176 | 1048 |
| 1109 | 274 | 196 | 249 | 788 | 4128 | 23406 | 3789 | 1634 |
| 1110 | 284 | 254 | 328 | 635 | 2357 | 15811 | 2115 | 1021 |
| 1111 | 60 | 89 | 63 | 95 | 1054 | 10889 | 953 | 527 |
| 1112 | 535 | 406 | 578 | 1442 | 5423 | 28396 | 4904 | 2048 |
| 1113 | 66 | 87 | 61 | 110 | 1123 | 10989 | 1049 | 642 |
| 1114 | 474 | 355 | 514 | 1328 | 5344 | 28281 | 4824 | 1965 |
| 1115 | 56 | 84 | 58 | 93 | 1094 | 11083 | 990 | 534 |
| 1116 | 533 | 406 | 577 | 1431 | 5369 | 28185 | 4851 | 2020 |
| 1117 | 70 | 89 | 60 | 115 | 1176 | 11207 | 1101 | 664 |
| 1118 | 478 | 360 | 519 | 1329 | 5297 | 28044 | 4785 | 1965 |
| 1119 | 53 | 79 | 54 | 93 | 1131 | 11245 | 1024 | 542 |
| 1120 | 528 | 403 | 573 | 1413 | 5294 | 27880 | 4780 | 1983 |
| 1121 | 73 | 91 | 61 | 121 | 1227 | 11392 | 1149 | 683 |
| 1122 | 481 | 364 | 524 | 1328 | 5239 | 27734 | 4736 | 1961 |
| 1123 | 51 | 74 | 51 | 97 | 1190 | 11473 | 1081 | 563 |
| 1124 | 524 | 401 | 570 | 1402 | 5244 | 27652 | 4731 | 1958 |
| 1125 | 76 | 93 | 60 | 125 | 1293 | 11650 | 1210 | 702 |
| 1126 | 488 | 371 | 533 | 1336 | 5202 | 27512 | 4705 | 1966 |
| 1127 | 50 | 70 | 47 | 102 | 1266 | 11782 | 1154 | 593 |
| 1128 | 516 | 396 | 563 | 1376 | 5167 | 27370 | 4658 | 1922 |
| 1129 | 79 | 94 | 61 | 132 | 1360 | 11956 | 1269 | 717 |
| 1130 | 492 | 376 | 538 | 1333 | 5142 | 27233 | 4651 | 1956 |
| 1131 | 51 | 68 | 47 | 110 | 1343 | 12107 | 1228 | 625 |
| 1132 | 508 | 391 | 555 | 1351 | 5092 | 27094 | 4585 | 1886 |
| 1133 | 81 | 95 | 61 | 137 | 1425 | 12272 | 1325 | 726 |
| 1134 | 496 | 381 | 543 | 1331 | 5073 | 26931 | 4589 | 1942 |
| 1135 | 53 | 67 | 46 | 120 | 1418 | 12415 | 1301 | 661 |
| 1136 | 499 | 385 | 547 | 1325 | 5009 | 26779 | 4507 | 1850 |
| 1137 | 81 | 94 | 61 | 144 | 1490 | 12589 | 1381 | 733 |
| 1138 | 500 | 386 | 548 | 1328 | 5002 | 26614 | 4524 | 1925 |
| 1139 | 57 | 67 | 47 | 134 | 1500 | 12737 | 1381 | 701 |
| 1140 | 489 | 379 | 538 | 1298 | 4924 | 26450 | 4428 | 1816 |
| 1141 | 80 | 93 | 61 | 151 | 1559 | 12918 | 1439 | 739 |
| 1142 | 505 | 392 | 554 | 1327 | 4928 | 26278 | 4456 | 1906 |
| 1143 | 62 | 70 | 50 | 150 | 1590 | 13083 | 1469 | 746 |
| 1144 | 477 | 371 | 526 | 1267 | 4833 | 26099 | 4345 | 1781 |
| 1145 | 79 | 91 | 60 | 157 | 1634 | 13271 | 1503 | 747 |
| 1146 | 507 | 396 | 557 | 1318 | 4843 | 25916 | 4377 | 1878 |
| 1147 | 68 | 74 | 53 | 168 | 1682 | 13439 | 1559 | 791 |
| 1148 | 467 | 364 | 516 | 1238 | 4743 | 25732 | 4263 | 1751 |
| 1149 | 79 | 89 | 59 | 164 | 1711 | 13632 | 1570 | 758 |
| 1150 | 508 | 399 | 559 | 1307 | 4756 | 25547 | 4296 | 1846 |
| 1151 | 77 | 78 | 58 | 188 | 1779 | 13808 | 1651 | 835 |
| 1152 | 458 | 358 | 507 | 1212 | 4656 | 25368 | 4186 | 1727 |
| 1153 | 78 | 87 | 59 | 173 | 1795 | 14018 | 1644 | 774 |
| 1154 | 506 | 400 | 558 | 1291 | 4664 | 25171 | 4210 | 1810 |
| 1155 | 85 | 84 | 65 | 211 | 1883 | 14219 | 1751 | 881 |
| 1156 | 449 | 352 | 499 | 1186 | 4561 | 24973 | 4103 | 1704 |
| 1157 | 78 | 85 | 59 | 182 | 1882 | 14417 | 1721 | 792 |
| 1158 | 500 | 397 | 552 | 1267 | 4563 | 24779 | 4115 | 1767 |
| 1159 | 95 | 90 | 71 | 233 | 1980 | 14610 | 1841 | 920 |
| 1160 | 444 | 350 | 494 | 1165 | 4468 | 24568 | 4021 | 1685 |
| 1161 | 79 | 84 | 60 | 194 | 1971 | 14820 | 1802 | 814 |
| 1162 | 493 | 393 | 546 | 1241 | 4461 | 24378 | 4018 | 1723 |
| 1163 | 104 | 96 | 78 | 256 | 2083 | 15030 | 1937 | 958 |
| 1164 | 441 | 349 | 492 | 1148 | 4371 | 24135 | 3936 | 1667 |
| 1165 | 81 | 83 | 62 | 209 | 2067 | 15233 | 1890 | 842 |
| 1166 | 483 | 387 | 536 | 1210 | 4349 | 23937 | 3915 | 1675 |
| 1167 | 114 | 102 | 85 | 279 | 2188 | 15447 | 2034 | 996 |
| 1168 | 439 | 349 | 489 | 1130 | 4277 | 23706 | 3855 | 1650 |
| 1169 | 84 | 82 | 65 | 226 | 2170 | 15660 | 1985 | 877 |
| 1170 | 472 | 380 | 525 | 1178 | 4238 | 23497 | 3811 | 1628 |
| 1171 | 123 | 108 | 92 | 300 | 2293 | 15883 | 2129 | 1027 |
| 1172 | 437 | 350 | 488 | 1114 | 4179 | 23267 | 3770 | 1632 |
| 1173 | 88 | 82 | 69 | 247 | 2277 | 16096 | 2085 | 916 |
| 1174 | 461 | 372 | 513 | 1146 | 4127 | 23057 | 3708 | 1582 |
| 1175 | 131 | 113 | 98 | 321 | 2398 | 16327 | 2223 | 1055 |
| 1176 | 436 | 351 | 486 | 1098 | 4082 | 22830 | 3684 | 1612 |
| 1177 | 95 | 83 | 75 | 272 | 2393 | 16554 | 2194 | 964 |
| 1178 | 456 | 330 | 467 | 1298 | 5488 | 28852 | 4978 | 2034 |
| 1179 | 141 | 156 | 158 | 229 | 1046 | 10404 | 954 | 629 |
| 1180 | 420 | 300 | 432 | 1240 | 5489 | 28916 | 4987 | 2040 |
| 1181 | 119 | 138 | 146 | 213 | 985 | 10338 | 871 | 518 |
| 1182 | 458 | 332 | 471 | 1306 | 5516 | 28988 | 4999 | 2030 |
| 1183 | 136 | 153 | 152 | 214 | 1010 | 10274 | 921 | 612 |
| 1184 | 435 | 312 | 450 | 1275 | 5529 | 29027 | 5023 | 2067 |
| 1185 | 109 | 130 | 134 | 195 | 952 | 10212 | 844 | 510 |
| 1186 | 460 | 334 | 474 | 1311 | 5536 | 29089 | 5012 | 2026 |
| 1187 | 131 | 150 | 146 | 201 | 981 | 10178 | 893 | 594 |
| 1188 | 451 | 324 | 467 | 1310 | 5568 | 29141 | 5059 | 2092 |
| 1189 | 100 | 121 | 123 | 177 | 929 | 10119 | 827 | 510 |
| 1190 | 460 | 335 | 477 | 1314 | 5556 | 29190 | 5026 | 2022 |
| 1191 | 124 | 145 | 139 | 187 | 955 | 10111 | 867 | 574 |
| 1192 | 465 | 336 | 484 | 1340 | 5594 | 29209 | 5082 | 2109 |
| 1193 | 93 | 115 | 114 | 163 | 914 | 10056 | 818 | 515 |
| 1194 | 458 | 334 | 477 | 1312 | 5561 | 29242 | 5027 | 2015 |
| 1195 | 117 | 140 | 131 | 175 | 932 | 10056 | 842 | 552 |
| 1196 | 480 | 349 | 503 | 1372 | 5619 | 29274 | 5104 | 2125 |
| 1197 | 87 | 111 | 106 | 150 | 903 | 10005 | 815 | 523 |
| 1198 | 456 | 333 | 477 | 1310 | 5568 | 29289 | 5031 | 2011 |
| 1199 | 107 | 133 | 122 | 160 | 910 | 10011 | 819 | 529 |
| 1200 | 495 | 361 | 519 | 1400 | 5634 | 29304 | 5115 | 2133 |
| 1201 | 83 | 108 | 99 | 141 | 901 | 9986 | 819 | 536 |
| 1202 | 454 | 332 | 477 | 1308 | 5567 | 29295 | 5029 | 2008 |
| 1203 | 99 | 126 | 113 | 148 | 898 | 10009 | 806 | 511 |
| 1204 | 506 | 371 | 533 | 1419 | 5637 | 29297 | 5114 | 2133 |
| 1205 | 81 | 106 | 95 | 134 | 905 | 9990 | 827 | 549 |
| 1206 | 453 | 331 | 478 | 1310 | 5567 | 29295 | 5029 | 2010 |
| 1207 | 90 | 119 | 105 | 136 | 889 | 10011 | 795 | 496 |
| 1208 | 515 | 380 | 544 | 1435 | 5638 | 29292 | 5113 | 2130 |
| 1209 | 80 | 105 | 90 | 127 | 913 | 10012 | 840 | 562 |
| 1210 | 455 | 333 | 482 | 1315 | 5565 | 29263 | 5028 | 2016 |
| 1211 | 82 | 112 | 96 | 125 | 890 | 10056 | 795 | 485 |
| 1212 | 520 | 386 | 551 | 1440 | 5624 | 29241 | 5095 | 2116 |
| 1213 | 79 | 104 | 86 | 122 | 926 | 10069 | 857 | 575 |
| 1214 | 458 | 335 | 487 | 1322 | 5554 | 29199 | 5021 | 2022 |
| 1215 | 76 | 106 | 89 | 116 | 896 | 10118 | 801 | 480 |
| 1216 | 522 | 388 | 555 | 1440 | 5604 | 29182 | 5073 | 2099 |
| 1217 | 79 | 104 | 83 | 118 | 941 | 10136 | 873 | 584 |
| 1218 | 463 | 340 | 495 | 1333 | 5541 | 29114 | 5011 | 2031 |
| 1219 | 69 | 99 | 82 | 108 | 906 | 10188 | 809 | 478 |
| 1220 | 522 | 389 | 556 | 1437 | 5579 | 29097 | 5045 | 2079 |
| 1221 | 80 | 103 | 80 | 115 | 963 | 10233 | 896 | 595 |
| 1222 | 473 | 348 | 506 | 1350 | 5538 | 29049 | 5010 | 2047 |
| 1223 | 64 | 92 | 74 | 102 | 932 | 10323 | 835 | 485 |
| 1224 | 520 | 389 | 556 | 1430 | 5549 | 29008 | 5015 | 2058 |
| 1225 | 80 | 103 | 77 | 113 | 992 | 10378 | 924 | 604 |
| 1226 | 479 | 355 | 514 | 1359 | 5512 | 28921 | 4990 | 2052 |
| 1227 | 59 | 86 | 68 | 97 | 956 | 10449 | 859 | 494 |
| 1228 | 517 | 387 | 554 | 1420 | 5509 | 28876 | 4975 | 2033 |
| 1229 | 80 | 103 | 75 | 111 | 1019 | 10517 | 948 | 608 |
| 1230 | 489 | 363 | 526 | 1373 | 5490 | 28789 | 4971 | 2059 |
| 1231 | 55 | 80 | 62 | 95 | 985 | 10582 | 890 | 507 |
| 1232 | 514 | 386 | 553 | 1410 | 5469 | 28723 | 4936 | 2011 |
| 1233 | 79 | 102 | 73 | 109 | 1052 | 10678 | 978 | 610 |
| 1234 | 498 | 372 | 537 | 1386 | 5462 | 28627 | 4948 | 2062 |
| 1235 | 52 | 75 | 57 | 94 | 1029 | 10761 | 936 | 531 |
| 1236 | 507 | 382 | 547 | 1391 | 5414 | 28530 | 4883 | 1982 |
| 1237 | 77 | 100 | 70 | 108 | 1087 | 10865 | 1007 | 609 |
| 1238 | 506 | 380 | 546 | 1395 | 5423 | 28436 | 4912 | 2057 |
| 1239 | 51 | 73 | 54 | 96 | 1077 | 10956 | 986 | 558 |
| 1240 | 500 | 378 | 542 | 1373 | 5363 | 28340 | 4834 | 1958 |
| 1241 | 74 | 98 | 67 | 107 | 1123 | 11060 | 1036 | 605 |
| 1242 | 514 | 388 | 556 | 1404 | 5379 | 28223 | 4872 | 2049 |
| 1243 | 51 | 72 | 51 | 100 | 1127 | 11139 | 1037 | 588 |
| 1244 | 493 | 374 | 535 | 1354 | 5305 | 28102 | 4779 | 1933 |
| 1245 | 70 | 94 | 64 | 107 | 1163 | 11257 | 1069 | 602 |
| 1246 | 522 | 396 | 566 | 1411 | 5330 | 27974 | 4826 | 2036 |
| 1247 | 53 | 73 | 50 | 106 | 1182 | 11327 | 1094 | 620 |
| 1248 | 486 | 369 | 530 | 1337 | 5247 | 27846 | 4726 | 1913 |
| 1249 | 67 | 90 | 60 | 108 | 1218 | 11506 | 1116 | 606 |
| 1250 | 524 | 399 | 569 | 1402 | 5256 | 27644 | 4756 | 2009 |
| 1251 | 57 | 75 | 51 | 113 | 1240 | 11528 | 1151 | 651 |
| 1252 | 477 | 362 | 520 | 1311 | 5169 | 27502 | 4655 | 1886 |
| 1253 | 64 | 87 | 57 | 108 | 1259 | 11688 | 1151 | 606 |
| 1254 | 530 | 406 | 577 | 1407 | 5213 | 27412 | 4714 | 1993 |
| 1255 | 62 | 77 | 52 | 126 | 1331 | 11857 | 1241 | 695 |
| 1256 | 473 | 360 | 517 | 1297 | 5119 | 27271 | 4612 | 1878 |
| 1257 | 61 | 83 | 53 | 111 | 1336 | 12034 | 1219 | 621 |
| 1258 | 528 | 407 | 576 | 1394 | 5148 | 27174 | 4652 | 1963 |
| 1259 | 67 | 80 | 54 | 136 | 1407 | 12175 | 1312 | 728 |
| 1260 | 469 | 358 | 514 | 1282 | 5051 | 27005 | 4552 | 1864 |
| 1261 | 59 | 80 | 51 | 114 | 1393 | 12333 | 1269 | 630 |
| 1262 | 524 | 406 | 573 | 1375 | 5064 | 26864 | 4571 | 1924 |
| 1263 | 73 | 84 | 57 | 148 | 1479 | 12483 | 1381 | 758 |
| 1264 | 469 | 359 | 515 | 1273 | 4982 | 26698 | 4492 | 1855 |
| 1265 | 57 | 76 | 49 | 120 | 1461 | 12655 | 1332 | 647 |
| 1266 | 519 | 404 | 569 | 1356 | 4983 | 26560 | 4494 | 1886 |
| 1267 | 79 | 88 | 60 | 162 | 1561 | 12829 | 1458 | 788 |
| 1268 | 469 | 361 | 517 | 1266 | 4912 | 26384 | 4432 | 1847 |
| 1269 | 57 | 73 | 48 | 129 | 1535 | 12989 | 1401 | 670 |
| 1270 | 512 | 399 | 562 | 1331 | 4893 | 26218 | 4409 | 1845 |
| 1271 | 86 | 91 | 63 | 175 | 1642 | 13175 | 1532 | 814 |
| 1272 | 471 | 364 | 518 | 1257 | 4835 | 26035 | 4365 | 1835 |
| 1273 | 59 | 70 | 48 | 140 | 1616 | 13339 | 1476 | 698 |
| 1274 | 503 | 393 | 553 | 1305 | 4802 | 25872 | 4324 | 1805 |
| 1275 | 91 | 95 | 66 | 187 | 1721 | 13524 | 1604 | 835 |
| 1276 | 472 | 367 | 521 | 1250 | 4756 | 25676 | 4296 | 1822 |
| 1277 | 61 | 69 | 49 | 153 | 1703 | 13698 | 1559 | 732 |
| 1278 | 494 | 388 | 545 | 1279 | 4708 | 25504 | 4236 | 1765 |
| 1279 | 96 | 98 | 69 | 200 | 1808 | 13906 | 1682 | 855 |
| 1280 | 474 | 371 | 524 | 1241 | 4671 | 25292 | 4221 | 1806 |
| 1281 | 65 | 69 | 52 | 171 | 1798 | 14077 | 1650 | 774 |
| 1282 | 483 | 381 | 534 | 1248 | 4608 | 25111 | 4143 | 1724 |
| 1283 | 99 | 99 | 71 | 212 | 1896 | 14303 | 1759 | 873 |
| 1284 | 475 | 373 | 524 | 1228 | 4582 | 24906 | 4142 | 1784 |
| 1285 | 71 | 71 | 56 | 190 | 1897 | 14469 | 1746 | 819 |
| 1286 | 472 | 373 | 523 | 1216 | 4507 | 24720 | 4050 | 1684 |
| 1287 | 102 | 100 | 73 | 224 | 1981 | 14694 | 1832 | 885 |
| 1288 | 477 | 377 | 527 | 1219 | 4494 | 24512 | 4061 | 1761 |
| 1289 | 78 | 74 | 61 | 213 | 2003 | 14874 | 1847 | 868 |
| 1290 | 459 | 365 | 511 | 1182 | 4404 | 24305 | 3955 | 1645 |
| 1291 | 103 | 100 | 76 | 236 | 2075 | 15115 | 1913 | 900 |
| 1292 | 477 | 380 | 528 | 1206 | 4396 | 24088 | 3973 | 1732 |
| 1293 | 88 | 80 | 68 | 239 | 2114 | 15301 | 1954 | 921 |
| 1294 | 446 | 355 | 497 | 1145 | 4295 | 23873 | 3856 | 1606 |
| 1295 | 104 | 100 | 77 | 248 | 2165 | 15536 | 1991 | 914 |
| 1296 | 476 | 381 | 528 | 1192 | 4298 | 23671 | 3882 | 1699 |
| 1297 | 98 | 86 | 76 | 267 | 2226 | 15726 | 2061 | 972 |
| 1298 | 433 | 347 | 485 | 1112 | 4191 | 23450 | 3763 | 1574 |
| 1299 | 105 | 99 | 79 | 260 | 2258 | 15959 | 2072 | 930 |
| 1300 | 473 | 382 | 525 | 1172 | 4193 | 23236 | 3784 | 1659 |
| 1301 | 109 | 93 | 85 | 297 | 2341 | 16167 | 2169 | 1022 |
| 1302 | 422 | 339 | 474 | 1080 | 4084 | 23001 | 3668 | 1544 |
| 1303 | 107 | 99 | 81 | 273 | 2355 | 16394 | 2158 | 950 |
| 1304 | 469 | 380 | 521 | 1150 | 4081 | 22772 | 3680 | 1614 |
| 1305 | 121 | 101 | 95 | 330 | 2460 | 16621 | 2281 | 1072 |
| 1306 | 413 | 334 | 464 | 1052 | 3980 | 22552 | 3577 | 1520 |
| 1307 | 109 | 99 | 84 | 288 | 2464 | 16863 | 2255 | 977 |
| 1308 | 459 | 374 | 511 | 1118 | 3969 | 22339 | 3574 | 1566 |
| 1309 | 133 | 109 | 104 | 358 | 2571 | 17067 | 2382 | 1113 |
| 1310 | 407 | 330 | 457 | 1027 | 3875 | 22098 | 3484 | 1497 |
| 1311 | 112 | 99 | 87 | 305 | 2567 | 17315 | 2348 | 1005 |
| 1312 | 449 | 368 | 501 | 1088 | 3853 | 21883 | 3467 | 1517 |
| 1313 | 145 | 117 | 115 | 388 | 2687 | 17531 | 2489 | 1155 |
| 1314 | 403 | 328 | 453 | 1006 | 3770 | 21629 | 3393 | 1477 |
| 1315 | 115 | 99 | 91 | 326 | 2678 | 17779 | 2449 | 1039 |
| 1316 | 436 | 360 | 488 | 1051 | 3732 | 21411 | 3353 | 1466 |
| 1317 | 157 | 125 | 125 | 418 | 2802 | 17994 | 2592 | 1194 |
| 1318 | 398 | 327 | 448 | 983 | 3662 | 21153 | 3298 | 1455 |
| 1319 | 120 | 100 | 97 | 349 | 2784 | 18219 | 2546 | 1076 |
| 1320 | 424 | 351 | 476 | 1017 | 3609 | 20920 | 3239 | 1415 |
| 1321 | 169 | 133 | 135 | 446 | 2916 | 18461 | 2695 | 1228 |
| 1322 | 395 | 327 | 444 | 963 | 3562 | 20706 | 3211 | 1436 |
| 1323 | 127 | 101 | 104 | 377 | 2904 | 18700 | 2658 | 1122 |
| 1324 | 411 | 343 | 463 | 983 | 3497 | 20478 | 3136 | 1371 |
| 1325 | 178 | 139 | 143 | 471 | 3030 | 18944 | 2796 | 1258 |
| 1326 | 391 | 325 | 439 | 939 | 3448 | 20222 | 3111 | 1408 |
| 1327 | 137 | 106 | 114 | 409 | 3024 | 19178 | 2771 | 1173 |
| 1328 | 397 | 333 | 448 | 945 | 3373 | 19997 | 3022 | 1323 |
| 1329 | 186 | 144 | 150 | 493 | 3135 | 19413 | 2888 | 1281 |
| 1330 | 387 | 324 | 435 | 919 | 3342 | 19767 | 3016 | 1381 |
| 1331 | 148 | 112 | 124 | 445 | 3142 | 19633 | 2882 | 1227 |
| 1332 | 384 | 325 | 435 | 911 | 3259 | 19541 | 2918 | 1281 |
| 1333 | 192 | 148 | 157 | 515 | 3240 | 19876 | 2979 | 1301 |
| 1334 | 384 | 324 | 432 | 899 | 3236 | 19301 | 2920 | 1352 |
| 1335 | 162 | 120 | 137 | 485 | 3271 | 20111 | 3003 | 1286 |
| 1336 | 368 | 312 | 418 | 871 | 3138 | 19052 | 2807 | 1236 |
| 1337 | 197 | 151 | 163 | 536 | 3347 | 20340 | 3070 | 1321 |
| 1338 | 380 | 322 | 427 | 877 | 3124 | 18828 | 2819 | 1317 |
| 1339 | 176 | 128 | 151 | 525 | 3391 | 20555 | 3114 | 1340 |
| 1340 | 354 | 302 | 403 | 833 | 3026 | 18596 | 2705 | 1198 |
| 1341 | 202 | 153 | 169 | 555 | 3453 | 20799 | 3162 | 1341 |
| 1342 | 375 | 321 | 422 | 854 | 3017 | 18376 | 2720 | 1280 |
| 1343 | 192 | 139 | 166 | 568 | 3517 | 21024 | 3232 | 1396 |
| 1344 | 338 | 291 | 387 | 796 | 2913 | 18136 | 2604 | 1162 |
| 1345 | 206 | 155 | 175 | 575 | 3559 | 21268 | 3254 | 1362 |
| 1346 | 369 | 318 | 416 | 830 | 2904 | 17910 | 2615 | 1237 |
| 1347 | 208 | 150 | 182 | 615 | 3644 | 21498 | 3350 | 1451 |
| 1348 | 324 | 281 | 372 | 758 | 2796 | 17649 | 2500 | 1129 |
| 1349 | 209 | 157 | 180 | 591 | 3657 | 21702 | 3338 | 1381 |
| 1350 | 360 | 313 | 407 | 802 | 2790 | 17456 | 2509 | 1191 |
| 1351 | 225 | 162 | 199 | 659 | 3764 | 21954 | 3460 | 1501 |
| 1352 | 314 | 274 | 361 | 727 | 2696 | 17230 | 2413 | 1105 |
| 1353 | 213 | 159 | 186 | 613 | 3771 | 22202 | 3439 | 1410 |
| 1354 | 349 | 306 | 395 | 770 | 2675 | 17015 | 2401 | 1142 |
| 1355 | 243 | 174 | 217 | 705 | 3888 | 22437 | 3572 | 1549 |
| 1356 | 304 | 267 | 350 | 697 | 2592 | 16792 | 2322 | 1083 |
| 1357 | 217 | 161 | 191 | 633 | 3874 | 22653 | 3531 | 1438 |
| 1358 | 337 | 298 | 383 | 737 | 2562 | 16581 | 2296 | 1093 |
| 1359 | 260 | 186 | 234 | 747 | 4003 | 22890 | 3676 | 1591 |
| 1360 | 296 | 262 | 340 | 669 | 2485 | 16343 | 2230 | 1060 |
| 1361 | 223 | 163 | 198 | 657 | 3978 | 23098 | 3625 | 1470 |
| 1362 | 322 | 288 | 368 | 701 | 2443 | 16129 | 2185 | 1041 |
| 1363 | 276 | 198 | 249 | 786 | 4111 | 23330 | 3773 | 1627 |
| 1364 | 290 | 259 | 334 | 646 | 2388 | 15919 | 2146 | 1042 |
| 1365 | 229 | 166 | 207 | 686 | 4083 | 23536 | 3722 | 1507 |
| 1366 | 309 | 279 | 354 | 668 | 2334 | 15716 | 2085 | 997 |
| 1367 | 289 | 208 | 263 | 819 | 4214 | 23760 | 3864 | 1656 |
| 1368 | 283 | 254 | 325 | 620 | 2287 | 15495 | 2058 | 1019 |
| 1369 | 238 | 170 | 217 | 720 | 4190 | 23960 | 3819 | 1549 |
| 1370 | 295 | 269 | 340 | 634 | 2224 | 15286 | 1984 | 952 |
| 1371 | 302 | 216 | 276 | 852 | 4317 | 24183 | 3953 | 1683 |
| 1372 | 278 | 252 | 318 | 598 | 2187 | 15049 | 1971 | 996 |
| 1373 | 249 | 177 | 231 | 759 | 4302 | 24378 | 3924 | 1598 |
| 1374 | 281 | 258 | 326 | 601 | 2122 | 14875 | 1890 | 912 |
| 1375 | 311 | 224 | 287 | 880 | 4417 | 24600 | 4040 | 1706 |
| 1376 | 272 | 248 | 310 | 572 | 2096 | 14668 | 1891 | 973 |
| 1377 | 262 | 185 | 245 | 797 | 4407 | 24777 | 4022 | 1645 |
| 1378 | 267 | 248 | 310 | 567 | 2018 | 14475 | 1796 | 872 |
| 1379 | 319 | 229 | 296 | 904 | 4507 | 25000 | 4116 | 1722 |
| 1380 | 266 | 246 | 304 | 550 | 2001 | 14271 | 1806 | 946 |
| 1381 | 278 | 195 | 262 | 843 | 4515 | 25169 | 4122 | 1697 |
| 1382 | 252 | 237 | 294 | 533 | 1915 | 14063 | 1702 | 835 |
| 1383 | 325 | 233 | 305 | 928 | 4597 | 25386 | 4193 | 1739 |
| 1384 | 260 | 243 | 296 | 527 | 1906 | 13864 | 1720 | 916 |
| 1385 | 295 | 207 | 281 | 890 | 4618 | 25524 | 4217 | 1748 |
| 1386 | 237 | 225 | 278 | 500 | 1821 | 13674 | 1618 | 803 |
| 1387 | 331 | 238 | 313 | 949 | 4685 | 25756 | 4267 | 1755 |
| 1388 | 254 | 240 | 290 | 505 | 1825 | 13530 | 1645 | 887 |
| 1389 | 313 | 220 | 300 | 937 | 4725 | 25916 | 4316 | 1797 |
| 1390 | 223 | 214 | 262 | 468 | 1735 | 13337 | 1542 | 777 |
| 1391 | 334 | 240 | 318 | 963 | 4761 | 26112 | 4332 | 1765 |
| 1392 | 246 | 235 | 281 | 482 | 1733 | 13175 | 1560 | 850 |
| 1393 | 332 | 233 | 320 | 986 | 4825 | 26280 | 4408 | 1843 |
| 1394 | 209 | 204 | 249 | 438 | 1649 | 12982 | 1466 | 754 |
| 1395 | 338 | 242 | 325 | 981 | 4841 | 26465 | 4400 | 1780 |
| 1396 | 237 | 230 | 272 | 458 | 1643 | 12822 | 1475 | 810 |
| 1397 | 350 | 247 | 341 | 1034 | 4915 | 26598 | 4488 | 1882 |
| 1398 | 198 | 195 | 235 | 409 | 1567 | 12632 | 1396 | 736 |
| 1399 | 342 | 245 | 330 | 995 | 4908 | 26755 | 4457 | 1793 |
| 1400 | 226 | 223 | 261 | 434 | 1555 | 12475 | 1392 | 768 |
| 1401 | 367 | 260 | 360 | 1076 | 4986 | 26840 | 4551 | 1911 |
| 1402 | 189 | 190 | 226 | 387 | 1490 | 12274 | 1330 | 722 |
| 1403 | 343 | 245 | 334 | 1011 | 4976 | 27024 | 4516 | 1808 |
| 1404 | 215 | 215 | 250 | 409 | 1469 | 12109 | 1311 | 728 |
| 1405 | 387 | 275 | 382 | 1126 | 5088 | 27174 | 4643 | 1951 |
| 1406 | 182 | 184 | 215 | 363 | 1433 | 11998 | 1284 | 717 |
| 1407 | 346 | 247 | 339 | 1025 | 5049 | 27312 | 4582 | 1830 |
| 1408 | 202 | 205 | 236 | 381 | 1406 | 11898 | 1252 | 694 |
| 1409 | 402 | 287 | 399 | 1159 | 5165 | 27491 | 4709 | 1976 |
| 1410 | 175 | 179 | 206 | 341 | 1369 | 11741 | 1230 | 706 |
| 1411 | 351 | 250 | 347 | 1046 | 5120 | 27624 | 4645 | 1854 |
| 1412 | 189 | 196 | 223 | 355 | 1329 | 11630 | 1178 | 656 |
| 1413 | 416 | 298 | 414 | 1192 | 5231 | 27770 | 4765 | 1993 |
| 1414 | 170 | 176 | 199 | 322 | 1306 | 11475 | 1177 | 696 |
| 1415 | 358 | 254 | 357 | 1074 | 5188 | 27888 | 4707 | 1883 |
| 1416 | 177 | 187 | 210 | 330 | 1259 | 11374 | 1114 | 625 |
| 1417 | 427 | 307 | 427 | 1218 | 5291 | 28017 | 4816 | 2006 |
| 1418 | 165 | 173 | 191 | 304 | 1252 | 11253 | 1133 | 688 |
| 1419 | 366 | 260 | 368 | 1101 | 5248 | 28114 | 4764 | 1913 |
| 1420 | 165 | 177 | 198 | 306 | 1195 | 11141 | 1056 | 596 |
| 1421 | 435 | 313 | 437 | 1238 | 5341 | 28241 | 4858 | 2012 |
| 1422 | 161 | 170 | 185 | 287 | 1200 | 11034 | 1089 | 677 |
| 1423 | 379 | 269 | 383 | 1135 | 5313 | 28340 | 4825 | 1949 |
| 1424 | 154 | 168 | 185 | 283 | 1137 | 10925 | 1004 | 572 |
| 1425 | 440 | 317 | 444 | 1253 | 5386 | 28444 | 4894 | 2014 |
| 1426 | 156 | 168 | 178 | 271 | 1151 | 10832 | 1048 | 665 |
| 1427 | 392 | 279 | 399 | 1171 | 5374 | 28536 | 4883 | 1985 |
| 1428 | 142 | 158 | 172 | 261 | 1087 | 10745 | 960 | 553 |
| 1429 | 444 | 320 | 450 | 1265 | 5424 | 28626 | 4923 | 2013 |
| 1430 | 151 | 165 | 172 | 254 | 1103 | 10644 | 1004 | 648 |
| 1431 | 408 | 290 | 416 | 1209 | 5429 | 28709 | 4935 | 2019 |
| 1432 | 131 | 149 | 160 | 240 | 1043 | 10577 | 922 | 539 |
| 1433 | 447 | 323 | 456 | 1276 | 5461 | 28794 | 4951 | 2013 |
| 1434 | 147 | 162 | 166 | 240 | 1064 | 10494 | 969 | 633 |
| 1435 | 423 | 302 | 434 | 1244 | 5476 | 28851 | 4978 | 2048 |
| 1436 | 120 | 139 | 148 | 219 | 1004 | 10426 | 889 | 529 |
| 1437 | 448 | 325 | 459 | 1282 | 5490 | 28937 | 4973 | 2011 |
| 1438 | 141 | 159 | 159 | 224 | 1026 | 10364 | 933 | 612 |
| 1439 | 438 | 314 | 452 | 1279 | 5521 | 28989 | 5019 | 2074 |
| 1440 | 111 | 131 | 136 | 201 | 970 | 10286 | 862 | 523 |
| 1441 | 449 | 326 | 462 | 1287 | 5514 | 29055 | 4991 | 2008 |
| 1442 | 135 | 154 | 152 | 210 | 993 | 10256 | 900 | 590 |
| 1443 | 454 | 327 | 470 | 1314 | 5559 | 29100 | 5054 | 2097 |
| 1444 | 103 | 124 | 126 | 183 | 946 | 10184 | 845 | 525 |
| 1445 | 449 | 326 | 464 | 1288 | 5530 | 29145 | 5002 | 2004 |
| 1446 | 127 | 148 | 144 | 196 | 962 | 10166 | 868 | 565 |
| 1447 | 470 | 339 | 488 | 1348 | 5592 | 29196 | 5082 | 2115 |
| 1448 | 96 | 118 | 117 | 169 | 928 | 10106 | 835 | 531 |
| 1449 | 447 | 325 | 464 | 1287 | 5542 | 29217 | 5010 | 2001 |
| 1450 | 118 | 142 | 135 | 182 | 933 | 10091 | 838 | 541 |
| 1451 | 484 | 352 | 505 | 1378 | 5616 | 29260 | 5101 | 2127 |
| 1452 | 92 | 115 | 110 | 157 | 918 | 10055 | 832 | 541 |
| 1453 | 445 | 324 | 464 | 1286 | 5550 | 29267 | 5017 | 2001 |
| 1454 | 108 | 134 | 125 | 166 | 909 | 10041 | 814 | 518 |
| 1455 | 497 | 363 | 521 | 1403 | 5630 | 29299 | 5111 | 2131 |
| 1456 | 89 | 113 | 105 | 149 | 913 | 10022 | 832 | 552 |
| 1457 | 445 | 324 | 466 | 1291 | 5559 | 29299 | 5024 | 2005 |
| 1458 | 99 | 127 | 116 | 153 | 894 | 10018 | 798 | 501 |
| 1459 | 506 | 372 | 532 | 1419 | 5635 | 29310 | 5112 | 2129 |
| 1460 | 87 | 111 | 100 | 141 | 913 | 10010 | 837 | 563 |
| 1461 | 447 | 325 | 471 | 1298 | 5563 | 29303 | 5029 | 2013 |
| 1462 | 91 | 120 | 107 | 141 | 886 | 10026 | 789 | 488 |
| 1463 | 513 | 379 | 541 | 1429 | 5633 | 29311 | 5107 | 2121 |
| 1464 | 86 | 110 | 95 | 134 | 913 | 10009 | 842 | 572 |
| 1465 | 451 | 329 | 477 | 1310 | 5567 | 29283 | 5034 | 2025 |
| 1466 | 84 | 113 | 100 | 130 | 884 | 10048 | 787 | 480 |
| 1467 | 517 | 382 | 547 | 1434 | 5626 | 29291 | 5096 | 2109 |
| 1468 | 85 | 109 | 92 | 128 | 923 | 10052 | 855 | 581 |
| 1469 | 457 | 334 | 485 | 1322 | 5563 | 29237 | 5032 | 2036 |
| 1470 | 77 | 106 | 91 | 120 | 885 | 10089 | 789 | 474 |
| 1471 | 518 | 384 | 549 | 1433 | 5608 | 29241 | 5075 | 2092 |
| 1472 | 85 | 109 | 88 | 123 | 937 | 10114 | 870 | 589 |
| 1473 | 465 | 341 | 495 | 1336 | 5557 | 29174 | 5030 | 2050 |
| 1474 | 70 | 98 | 83 | 111 | 894 | 10148 | 798 | 474 |
| 1475 | 517 | 385 | 550 | 1429 | 5585 | 29162 | 5050 | 2072 |
| 1476 | 85 | 108 | 85 | 119 | 955 | 10199 | 888 | 596 |
| 1477 | 474 | 348 | 506 | 1352 | 5548 | 29090 | 5024 | 2062 |
| 1478 | 64 | 91 | 76 | 104 | 912 | 10243 | 817 | 481 |
| 1479 | 514 | 384 | 549 | 1421 | 5554 | 29062 | 5018 | 2051 |
| 1480 | 84 | 108 | 82 | 115 | 975 | 10302 | 907 | 598 |
| 1481 | 483 | 357 | 517 | 1368 | 5534 | 28987 | 5013 | 2072 |
| 1482 | 59 | 85 | 69 | 99 | 936 | 10353 | 843 | 493 |
| 1483 | 511 | 382 | 547 | 1411 | 5519 | 28943 | 4983 | 2029 |
| 1484 | 83 | 107 | 79 | 112 | 998 | 10426 | 927 | 598 |
| 1485 | 493 | 366 | 530 | 1384 | 5514 | 28858 | 4996 | 2077 |
| 1486 | 56 | 80 | 64 | 96 | 970 | 10491 | 879 | 512 |
| 1487 | 507 | 380 | 544 | 1398 | 5481 | 28802 | 4944 | 2006 |
| 1488 | 81 | 104 | 76 | 109 | 1024 | 10567 | 947 | 593 |
| 1489 | 503 | 376 | 541 | 1399 | 5489 | 28711 | 4973 | 2078 |
| 1490 | 54 | 77 | 59 | 96 | 1009 | 10640 | 920 | 536 |
| 1491 | 501 | 377 | 540 | 1384 | 5439 | 28645 | 4904 | 1985 |
| 1492 | 77 | 102 | 72 | 107 | 1055 | 10736 | 973 | 589 |
| 1493 | 513 | 384 | 552 | 1410 | 5455 | 28535 | 4942 | 2073 |
| 1494 | 53 | 75 | 56 | 97 | 1054 | 10809 | 967 | 564 |
| 1495 | 494 | 372 | 534 | 1365 | 5390 | 28455 | 4857 | 1962 |
| 1496 | 73 | 98 | 68 | 105 | 1093 | 10934 | 1003 | 585 |
| 1497 | 520 | 392 | 562 | 1418 | 5414 | 28342 | 4903 | 2063 |
| 1498 | 54 | 75 | 54 | 101 | 1107 | 11009 | 1021 | 594 |
| 1499 | 487 | 368 | 528 | 1347 | 5338 | 28253 | 4809 | 1941 |
| 1500 | 68 | 93 | 64 | 104 | 1131 | 11137 | 1035 | 582 |
| 1501 | 526 | 399 | 570 | 1423 | 5369 | 28134 | 4860 | 2048 |
| 1502 | 56 | 76 | 53 | 107 | 1166 | 11232 | 1081 | 628 |
| 1503 | 479 | 362 | 521 | 1323 | 5264 | 27962 | 4742 | 1916 |
| 1504 | 64 | 90 | 60 | 103 | 1176 | 11369 | 1073 | 583 |
| 1505 | 531 | 405 | 576 | 1422 | 5313 | 27898 | 4806 | 2026 |
| 1506 | 60 | 78 | 54 | 114 | 1229 | 11486 | 1144 | 661 |
| 1507 | 476 | 361 | 519 | 1314 | 5225 | 27794 | 4708 | 1911 |
| 1508 | 60 | 86 | 56 | 103 | 1227 | 11631 | 1118 | 589 |
| 1509 | 532 | 408 | 579 | 1414 | 5255 | 27676 | 4750 | 2000 |
| 1510 | 64 | 81 | 55 | 124 | 1297 | 11761 | 1210 | 693 |
| 1511 | 472 | 359 | 516 | 1302 | 5165 | 27537 | 4655 | 1900 |
| 1512 | 57 | 81 | 53 | 105 | 1282 | 11901 | 1166 | 597 |
| 1513 | 530 | 408 | 577 | 1400 | 5182 | 27398 | 4680 | 1966 |
| 1514 | 69 | 84 | 56 | 133 | 1365 | 12045 | 1275 | 722 |
| 1515 | 472 | 360 | 517 | 1294 | 5101 | 27252 | 4601 | 1892 |
| 1516 | 56 | 78 | 50 | 108 | 1345 | 12193 | 1223 | 613 |
| 1517 | 525 | 405 | 573 | 1381 | 5104 | 27103 | 4605 | 1929 |
| 1518 | 75 | 87 | 58 | 144 | 1436 | 12340 | 1342 | 748 |
| 1519 | 473 | 362 | 519 | 1288 | 5037 | 26954 | 4546 | 1886 |
| 1520 | 55 | 74 | 48 | 115 | 1412 | 12497 | 1286 | 632 |
| 1521 | 518 | 401 | 567 | 1358 | 5023 | 26793 | 4528 | 1891 |
| 1522 | 80 | 90 | 61 | 155 | 1509 | 12650 | 1410 | 772 |
| 1523 | 475 | 365 | 522 | 1284 | 4970 | 26633 | 4487 | 1878 |
| 1524 | 55 | 71 | 47 | 124 | 1489 | 12821 | 1359 | 659 |
| 1525 | 510 | 397 | 560 | 1336 | 4938 | 26462 | 4448 | 1852 |
| 1526 | 85 | 93 | 63 | 165 | 1583 | 12963 | 1476 | 792 |
| 1527 | 479 | 370 | 527 | 1280 | 4896 | 26282 | 4423 | 1867 |
| 1528 | 57 | 69 | 47 | 135 | 1573 | 13160 | 1438 | 692 |
| 1529 | 502 | 392 | 552 | 1311 | 4853 | 26126 | 4368 | 1816 |
| 1530 | 90 | 96 | 65 | 176 | 1669 | 13341 | 1554 | 814 |
| 1531 | 480 | 373 | 529 | 1270 | 4818 | 25939 | 4355 | 1852 |
| 1532 | 60 | 68 | 49 | 149 | 1656 | 13501 | 1519 | 728 |
| 1533 | 493 | 386 | 543 | 1283 | 4760 | 25765 | 4282 | 1777 |
| 1534 | 93 | 97 | 67 | 187 | 1751 | 13709 | 1625 | 829 |
| 1535 | 483 | 377 | 532 | 1263 | 4740 | 25584 | 4284 | 1836 |
| 1536 | 65 | 69 | 51 | 166 | 1750 | 13871 | 1609 | 771 |
| 1537 | 481 | 379 | 532 | 1252 | 4663 | 25385 | 4191 | 1737 |
| 1538 | 95 | 98 | 69 | 197 | 1833 | 14085 | 1696 | 842 |
| 1539 | 485 | 381 | 535 | 1254 | 4654 | 25207 | 4207 | 1814 |
| 1540 | 71 | 71 | 55 | 186 | 1851 | 14261 | 1707 | 820 |
| 1541 | 469 | 370 | 520 | 1218 | 4563 | 24992 | 4099 | 1699 |
| 1542 | 95 | 97 | 70 | 207 | 1914 | 14467 | 1766 | 851 |
| 1543 | 487 | 384 | 537 | 1245 | 4564 | 24813 | 4125 | 1787 |
| 1544 | 79 | 76 | 61 | 209 | 1956 | 14665 | 1808 | 869 |
| 1545 | 457 | 362 | 508 | 1184 | 4461 | 24594 | 4007 | 1662 |
| 1546 | 96 | 96 | 71 | 217 | 1999 | 14868 | 1839 | 862 |
| 1547 | 487 | 387 | 539 | 1233 | 4467 | 24401 | 4035 | 1755 |
| 1548 | 88 | 82 | 67 | 235 | 2063 | 15076 | 1910 | 919 |
| 1549 | 445 | 353 | 495 | 1151 | 4359 | 24182 | 3915 | 1629 |
| 1550 | 97 | 95 | 72 | 228 | 2092 | 15291 | 1920 | 879 |
| 1551 | 484 | 388 | 536 | 1214 | 4365 | 23974 | 3939 | 1716 |
| 1552 | 98 | 88 | 75 | 260 | 2168 | 15479 | 2009 | 964 |
| 1553 | 434 | 346 | 485 | 1121 | 4257 | 23754 | 3824 | 1601 |
| 1554 | 97 | 95 | 73 | 240 | 2187 | 15721 | 2004 | 898 |
| 1555 | 480 | 386 | 532 | 1191 | 4260 | 23559 | 3843 | 1674 |
| 1556 | 109 | 95 | 84 | 289 | 2278 | 15916 | 2114 | 1011 |
| 1557 | 426 | 341 | 477 | 1096 | 4157 | 23319 | 3736 | 1578 |
| 1558 | 99 | 94 | 75 | 254 | 2286 | 16153 | 2092 | 921 |
| 1559 | 473 | 382 | 525 | 1166 | 4154 | 23128 | 3742 | 1630 |
| 1560 | 120 | 102 | 93 | 318 | 2394 | 16365 | 2221 | 1056 |
| 1561 | 419 | 337 | 470 | 1071 | 4053 | 22869 | 3646 | 1555 |
| 1562 | 101 | 93 | 78 | 269 | 2385 | 16590 | 2182 | 948 |
| 1563 | 463 | 377 | 516 | 1135 | 4040 | 22685 | 3636 | 1582 |
| 1564 | 132 | 110 | 102 | 345 | 2505 | 16817 | 2324 | 1097 |
| 1565 | 414 | 335 | 465 | 1048 | 3951 | 22427 | 3557 | 1535 |
| 1566 | 104 | 93 | 81 | 286 | 2486 | 17024 | 2273 | 977 |
| 1567 | 452 | 370 | 505 | 1103 | 3924 | 22234 | 3529 | 1532 |
| 1568 | 143 | 118 | 111 | 373 | 2616 | 17270 | 2425 | 1134 |
| 1569 | 411 | 334 | 461 | 1028 | 3851 | 21982 | 3469 | 1516 |
| 1570 | 108 | 93 | 86 | 308 | 2596 | 17484 | 2375 | 1015 |
| 1571 | 440 | 362 | 492 | 1068 | 3804 | 21761 | 3416 | 1482 |
| 1572 | 154 | 124 | 120 | 399 | 2727 | 17729 | 2523 | 1167 |
| 1573 | 408 | 333 | 457 | 1009 | 3747 | 21523 | 3378 | 1494 |
| 1574 | 114 | 95 | 92 | 334 | 2711 | 17951 | 2482 | 1059 |
| 1575 | 427 | 353 | 479 | 1032 | 3687 | 21304 | 3308 | 1434 |
| 1576 | 162 | 130 | 127 | 421 | 2829 | 18173 | 2614 | 1192 |
| 1577 | 406 | 334 | 455 | 989 | 3640 | 21052 | 3284 | 1470 |
| 1578 | 123 | 98 | 100 | 364 | 2827 | 18409 | 2591 | 1108 |
| 1579 | 414 | 343 | 466 | 998 | 3572 | 20849 | 3202 | 1390 |
| 1580 | 170 | 135 | 135 | 443 | 2939 | 18646 | 2710 | 1217 |
| 1581 | 402 | 333 | 451 | 969 | 3533 | 20590 | 3189 | 1443 |
| 1582 | 134 | 103 | 110 | 399 | 2951 | 18878 | 2708 | 1164 |
| 1583 | 400 | 334 | 451 | 961 | 3454 | 20379 | 3095 | 1346 |
| 1584 | 176 | 139 | 141 | 465 | 3051 | 19130 | 2809 | 1242 |
| 1585 | 399 | 333 | 447 | 947 | 3425 | 20124 | 3091 | 1412 |
| 1586 | 146 | 110 | 122 | 434 | 3071 | 19336 | 2821 | 1218 |
| 1587 | 385 | 324 | 436 | 923 | 3336 | 19908 | 2986 | 1302 |
| 1588 | 181 | 141 | 147 | 485 | 3156 | 19597 | 2899 | 1260 |
| 1589 | 395 | 332 | 443 | 926 | 3315 | 19662 | 2992 | 1379 |
| 1590 | 160 | 119 | 134 | 473 | 3193 | 19800 | 2936 | 1274 |
| 1591 | 371 | 313 | 421 | 885 | 3218 | 19429 | 2879 | 1261 |
| 1592 | 186 | 144 | 153 | 505 | 3263 | 20069 | 2991 | 1280 |
| 1593 | 391 | 331 | 438 | 903 | 3203 | 19193 | 2889 | 1340 |
| 1594 | 175 | 129 | 149 | 517 | 3323 | 20286 | 3058 | 1332 |
| 1595 | 355 | 301 | 405 | 845 | 3098 | 18944 | 2771 | 1222 |
| 1596 | 189 | 146 | 158 | 523 | 3367 | 20531 | 3081 | 1300 |
| 1597 | 385 | 329 | 433 | 881 | 3091 | 18727 | 2785 | 1300 |
| 1598 | 191 | 139 | 165 | 561 | 3449 | 20759 | 3175 | 1387 |
| 1599 | 341 | 291 | 390 | 808 | 2987 | 18488 | 2673 | 1190 |
| 1600 | 193 | 147 | 163 | 540 | 3468 | 20987 | 3170 | 1321 |
| 1601 | 378 | 325 | 425 | 853 | 2974 | 18259 | 2676 | 1253 |
| 1602 | 208 | 151 | 180 | 605 | 3572 | 21225 | 3287 | 1438 |
| 1603 | 329 | 283 | 377 | 774 | 2873 | 18008 | 2573 | 1162 |
| 1604 | 196 | 149 | 168 | 558 | 3570 | 21431 | 3259 | 1345 |
| 1605 | 367 | 318 | 415 | 824 | 2854 | 17768 | 2564 | 1203 |
| 1606 | 225 | 163 | 197 | 649 | 3690 | 21656 | 3395 | 1485 |
| 1607 | 320 | 278 | 367 | 747 | 2771 | 17548 | 2485 | 1142 |
| 1608 | 201 | 150 | 174 | 582 | 3690 | 21924 | 3367 | 1380 |
| 1609 | 354 | 309 | 401 | 787 | 2741 | 17335 | 2458 | 1153 |
| 1610 | 241 | 174 | 213 | 689 | 3811 | 22140 | 3504 | 1528 |
| 1611 | 312 | 272 | 357 | 718 | 2665 | 17100 | 2392 | 1118 |
| 1612 | 205 | 152 | 180 | 605 | 3795 | 22378 | 3461 | 1410 |
| 1613 | 341 | 301 | 388 | 753 | 2624 | 16886 | 2349 | 1103 |
| 1614 | 256 | 185 | 228 | 727 | 3923 | 22592 | 3604 | 1565 |
| 1615 | 306 | 269 | 350 | 695 | 2563 | 16651 | 2304 | 1098 |
| 1616 | 211 | 155 | 188 | 633 | 3904 | 22821 | 3560 | 1447 |
| 1617 | 327 | 290 | 373 | 717 | 2508 | 16439 | 2243 | 1054 |
| 1618 | 271 | 196 | 243 | 764 | 4037 | 23051 | 3706 | 1600 |
| 1619 | 299 | 265 | 342 | 667 | 2457 | 16199 | 2212 | 1074 |
| 1620 | 220 | 159 | 198 | 664 | 4013 | 23261 | 3660 | 1488 |
| 1621 | 313 | 281 | 359 | 684 | 2396 | 15997 | 2139 | 1008 |
| 1622 | 283 | 204 | 255 | 797 | 4142 | 23490 | 3798 | 1627 |
| 1623 | 294 | 262 | 335 | 644 | 2360 | 15782 | 2127 | 1051 |
| 1624 | 230 | 164 | 210 | 701 | 4120 | 23675 | 3760 | 1533 |
| 1625 | 299 | 271 | 345 | 650 | 2288 | 15571 | 2040 | 966 |
| 1626 | 293 | 211 | 266 | 824 | 4241 | 23912 | 3884 | 1649 |
| 1627 | 289 | 260 | 329 | 622 | 2262 | 15360 | 2041 | 1028 |
| 1628 | 244 | 172 | 224 | 742 | 4234 | 24102 | 3866 | 1585 |
| 1629 | 284 | 260 | 329 | 616 | 2178 | 15127 | 1940 | 925 |
| 1630 | 301 | 217 | 276 | 852 | 4343 | 24333 | 3972 | 1671 |
| 1631 | 283 | 257 | 322 | 597 | 2165 | 14939 | 1954 | 1001 |
| 1632 | 260 | 183 | 242 | 789 | 4354 | 24531 | 3978 | 1643 |
| 1633 | 269 | 248 | 313 | 580 | 2077 | 14729 | 1848 | 888 |
| 1634 | 306 | 220 | 283 | 870 | 4431 | 24732 | 4045 | 1684 |
| 1635 | 277 | 254 | 315 | 573 | 2067 | 14539 | 1866 | 970 |
| 1636 | 276 | 195 | 260 | 834 | 4462 | 24927 | 4078 | 1694 |
| 1637 | 254 | 237 | 297 | 546 | 1977 | 14333 | 1758 | 854 |
| 1638 | 312 | 224 | 291 | 892 | 4523 | 25138 | 4123 | 1701 |
| 1639 | 271 | 251 | 308 | 551 | 1971 | 14136 | 1777 | 936 |
| 1640 | 295 | 207 | 279 | 884 | 4573 | 25323 | 4180 | 1745 |
| 1641 | 239 | 225 | 281 | 511 | 1880 | 13939 | 1672 | 823 |
| 1642 | 317 | 228 | 298 | 911 | 4612 | 25527 | 4200 | 1717 |
| 1643 | 263 | 247 | 300 | 527 | 1877 | 13763 | 1690 | 898 |
| 1644 | 313 | 220 | 298 | 931 | 4673 | 25692 | 4272 | 1790 |
| 1645 | 225 | 215 | 266 | 479 | 1788 | 13563 | 1591 | 798 |
| 1646 | 320 | 230 | 304 | 928 | 4694 | 25893 | 4269 | 1731 |
| 1647 | 254 | 242 | 291 | 503 | 1785 | 13405 | 1604 | 858 |
| 1648 | 331 | 233 | 318 | 979 | 4772 | 26051 | 4361 | 1832 |
| 1649 | 213 | 206 | 253 | 450 | 1699 | 13183 | 1514 | 777 |
| 1650 | 322 | 231 | 307 | 939 | 4754 | 26164 | 4320 | 1738 |
| 1651 | 244 | 235 | 281 | 478 | 1689 | 13024 | 1514 | 815 |
| 1652 | 351 | 247 | 340 | 1029 | 4869 | 26393 | 4449 | 1873 |
| 1653 | 203 | 199 | 241 | 423 | 1619 | 12827 | 1446 | 762 |
| 1654 | 327 | 234 | 314 | 960 | 4850 | 26558 | 4405 | 1765 |
| 1655 | 231 | 226 | 268 | 450 | 1604 | 12695 | 1433 | 774 |
| 1656 | 368 | 261 | 359 | 1073 | 4960 | 26723 | 4530 | 1907 |
| 1657 | 196 | 194 | 232 | 400 | 1547 | 12507 | 1385 | 751 |
| 1658 | 328 | 235 | 318 | 970 | 4902 | 26781 | 4450 | 1775 |
| 1659 | 219 | 217 | 255 | 423 | 1510 | 12313 | 1345 | 730 |
| 1660 | 385 | 274 | 378 | 1114 | 5039 | 26994 | 4600 | 1934 |
| 1661 | 189 | 189 | 222 | 377 | 1480 | 12198 | 1331 | 742 |
| 1662 | 335 | 238 | 327 | 1001 | 5007 | 27188 | 4547 | 1815 |
| 1663 | 205 | 208 | 241 | 394 | 1437 | 12058 | 1278 | 695 |
| 1664 | 400 | 285 | 394 | 1148 | 5123 | 27338 | 4672 | 1959 |
| 1665 | 184 | 186 | 215 | 358 | 1413 | 11912 | 1274 | 731 |
| 1666 | 342 | 242 | 337 | 1027 | 5078 | 27472 | 4612 | 1843 |
| 1667 | 193 | 198 | 228 | 367 | 1364 | 11795 | 1209 | 661 |
| 1668 | 411 | 294 | 406 | 1171 | 5181 | 27595 | 4721 | 1970 |
| 1669 | 178 | 182 | 207 | 338 | 1348 | 11644 | 1218 | 717 |
| 1670 | 351 | 248 | 349 | 1058 | 5149 | 27737 | 4676 | 1877 |
| 1671 | 181 | 189 | 215 | 342 | 1293 | 11531 | 1144 | 630 |
| 1672 | 419 | 301 | 417 | 1195 | 5243 | 27859 | 4772 | 1980 |
| 1673 | 173 | 179 | 200 | 320 | 1287 | 11381 | 1165 | 704 |
| 1674 | 363 | 257 | 364 | 1094 | 5220 | 27984 | 4743 | 1914 |
| 1675 | 168 | 178 | 201 | 317 | 1228 | 11286 | 1085 | 603 |
| 1676 | 426 | 306 | 427 | 1215 | 5302 | 28117 | 4821 | 1989 |
| 1677 | 168 | 176 | 193 | 301 | 1230 | 11151 | 1117 | 690 |
| 1678 | 377 | 267 | 380 | 1129 | 5283 | 28199 | 4803 | 1951 |
| 1679 | 157 | 169 | 188 | 293 | 1168 | 11062 | 1032 | 582 |
| 1680 | 431 | 310 | 433 | 1230 | 5349 | 28333 | 4859 | 1991 |
| 1681 | 164 | 173 | 187 | 284 | 1179 | 10946 | 1072 | 674 |
| 1682 | 392 | 278 | 397 | 1168 | 5348 | 28411 | 4864 | 1988 |
| 1683 | 145 | 159 | 177 | 271 | 1114 | 10848 | 985 | 563 |
| 1684 | 434 | 313 | 439 | 1242 | 5393 | 28530 | 4895 | 1993 |
| 1685 | 159 | 171 | 180 | 268 | 1132 | 10758 | 1029 | 655 |
| 1686 | 408 | 291 | 416 | 1208 | 5411 | 28611 | 4922 | 2024 |
| 1687 | 133 | 148 | 162 | 246 | 1065 | 10659 | 943 | 548 |
| 1688 | 437 | 315 | 444 | 1251 | 5428 | 28700 | 4922 | 1992 |
| 1689 | 153 | 167 | 173 | 252 | 1085 | 10587 | 985 | 632 |
| 1690 | 425 | 303 | 435 | 1248 | 5464 | 28779 | 4971 | 2055 |
| 1691 | 123 | 140 | 150 | 227 | 1029 | 10510 | 914 | 543 |
| 1692 | 436 | 315 | 445 | 1254 | 5457 | 28845 | 4943 | 1989 |
| 1693 | 146 | 163 | 167 | 237 | 1041 | 10433 | 942 | 607 |
| 1694 | 442 | 316 | 454 | 1286 | 5511 | 28926 | 5014 | 2080 |
| 1695 | 113 | 132 | 139 | 208 | 994 | 10368 | 887 | 540 |
| 1696 | 437 | 317 | 449 | 1260 | 5488 | 28994 | 4968 | 1990 |
| 1697 | 138 | 158 | 158 | 221 | 1002 | 10306 | 903 | 580 |
| 1698 | 457 | 329 | 473 | 1320 | 5548 | 29035 | 5045 | 2098 |
| 1699 | 106 | 127 | 130 | 191 | 968 | 10253 | 869 | 543 |
| 1700 | 436 | 317 | 450 | 1262 | 5510 | 29102 | 4984 | 1990 |
| 1701 | 128 | 150 | 148 | 204 | 966 | 10204 | 867 | 553 |
| 1702 | 472 | 342 | 490 | 1351 | 5580 | 29131 | 5071 | 2112 |
| 1703 | 101 | 123 | 122 | 177 | 947 | 10156 | 855 | 549 |
| 1704 | 435 | 315 | 451 | 1264 | 5528 | 29191 | 4999 | 1992 |
| 1705 | 118 | 143 | 139 | 188 | 936 | 10121 | 836 | 529 |
| 1706 | 486 | 353 | 506 | 1380 | 5608 | 29226 | 5094 | 2123 |
| 1707 | 97 | 121 | 117 | 167 | 931 | 10071 | 846 | 556 |
| 1708 | 436 | 316 | 454 | 1271 | 5545 | 29253 | 5014 | 1999 |
| 1709 | 109 | 135 | 128 | 172 | 913 | 10062 | 813 | 509 |
| 1710 | 497 | 363 | 520 | 1400 | 5626 | 29283 | 5107 | 2125 |
| 1711 | 95 | 118 | 110 | 156 | 924 | 10038 | 845 | 564 |
| 1712 | 437 | 317 | 457 | 1276 | 5552 | 29277 | 5021 | 2006 |
| 1713 | 100 | 127 | 119 | 158 | 893 | 10023 | 795 | 493 |
| 1714 | 505 | 371 | 530 | 1414 | 5634 | 29318 | 5111 | 2122 |
| 1715 | 93 | 116 | 105 | 148 | 920 | 10017 | 846 | 572 |
| 1716 | 443 | 321 | 465 | 1292 | 5566 | 29306 | 5035 | 2021 |
| 1717 | 92 | 120 | 110 | 145 | 879 | 10001 | 781 | 480 |
| 1718 | 510 | 375 | 537 | 1423 | 5633 | 29324 | 5105 | 2112 |
| 1719 | 92 | 115 | 101 | 140 | 921 | 10019 | 850 | 580 |
| 1720 | 450 | 327 | 475 | 1309 | 5575 | 29307 | 5046 | 2038 |
| 1721 | 84 | 112 | 101 | 134 | 874 | 10011 | 777 | 472 |
| 1722 | 512 | 378 | 540 | 1424 | 5623 | 29302 | 5092 | 2097 |
| 1723 | 91 | 114 | 97 | 134 | 925 | 10040 | 857 | 585 |
| 1724 | 459 | 335 | 486 | 1328 | 5580 | 29281 | 5053 | 2055 |
| 1725 | 77 | 105 | 93 | 123 | 877 | 10046 | 781 | 470 |
| 1726 | 511 | 378 | 541 | 1421 | 5606 | 29257 | 5072 | 2079 |
| 1727 | 90 | 113 | 93 | 127 | 932 | 10083 | 865 | 587 |
| 1728 | 469 | 343 | 499 | 1347 | 5579 | 29230 | 5054 | 2070 |
| 1729 | 70 | 97 | 85 | 115 | 886 | 10103 | 791 | 474 |
| 1730 | 510 | 378 | 542 | 1418 | 5590 | 29209 | 5052 | 2063 |
| 1731 | 88 | 112 | 90 | 122 | 942 | 10139 | 874 | 586 |
| 1732 | 479 | 352 | 511 | 1367 | 5574 | 29155 | 5051 | 2083 |
| 1733 | 65 | 91 | 77 | 108 | 904 | 10178 | 811 | 484 |
| 1734 | 508 | 378 | 542 | 1411 | 5565 | 29125 | 5027 | 2044 |
| 1735 | 87 | 111 | 86 | 117 | 962 | 10246 | 891 | 585 |
| 1736 | 490 | 362 | 523 | 1382 | 5558 | 29047 | 5037 | 2089 |
| 1737 | 60 | 85 | 70 | 102 | 926 | 10277 | 836 | 498 |
| 1738 | 504 | 376 | 539 | 1400 | 5532 | 29014 | 4993 | 2023 |
| 1739 | 84 | 109 | 83 | 113 | 981 | 10365 | 906 | 580 |
| 1740 | 500 | 371 | 535 | 1399 | 5541 | 28943 | 5022 | 2093 |
| 1741 | 57 | 81 | 64 | 98 | 954 | 10390 | 867 | 517 |
| 1742 | 499 | 373 | 535 | 1386 | 5495 | 28883 | 4956 | 2002 |
| 1743 | 80 | 106 | 78 | 109 | 1004 | 10498 | 924 | 573 |
| 1744 | 510 | 381 | 548 | 1414 | 5517 | 28808 | 5000 | 2092 |
| 1745 | 55 | 78 | 60 | 97 | 992 | 10536 | 908 | 543 |
| 1746 | 492 | 369 | 530 | 1368 | 5447 | 28708 | 4911 | 1979 |
| 1747 | 76 | 102 | 74 | 106 | 1031 | 10658 | 945 | 566 |
| 1748 | 519 | 390 | 559 | 1425 | 5484 | 28640 | 4968 | 2085 |
| 1749 | 55 | 78 | 58 | 99 | 1040 | 10717 | 959 | 573 |
| 1750 | 485 | 364 | 524 | 1351 | 5402 | 28534 | 4868 | 1960 |
| 1751 | 69 | 97 | 68 | 102 | 1044 | 10742 | 953 | 553 |
| 1752 | 527 | 398 | 570 | 1435 | 5433 | 28368 | 4920 | 2069 |
| 1753 | 57 | 79 | 57 | 103 | 1097 | 10898 | 1018 | 607 |
| 1754 | 480 | 361 | 520 | 1337 | 5363 | 28351 | 4834 | 1949 |
| 1755 | 65 | 92 | 64 | 100 | 1104 | 11025 | 1006 | 561 |
| 1756 | 533 | 404 | 577 | 1439 | 5407 | 28271 | 4894 | 2058 |
| 1757 | 59 | 80 | 56 | 109 | 1152 | 11127 | 1072 | 635 |
| 1758 | 475 | 358 | 517 | 1324 | 5309 | 28135 | 4786 | 1936 |
| 1759 | 61 | 88 | 59 | 99 | 1152 | 11282 | 1048 | 565 |
| 1760 | 533 | 407 | 578 | 1428 | 5343 | 28040 | 4832 | 2028 |
| 1761 | 63 | 82 | 56 | 114 | 1210 | 11378 | 1128 | 663 |
| 1762 | 473 | 357 | 516 | 1315 | 5255 | 27918 | 4739 | 1927 |
| 1763 | 57 | 83 | 55 | 99 | 1197 | 11520 | 1087 | 570 |
| 1764 | 533 | 408 | 579 | 1418 | 5281 | 27807 | 4771 | 1997 |
| 1765 | 67 | 84 | 57 | 122 | 1269 | 11629 | 1185 | 688 |
| 1766 | 474 | 359 | 518 | 1311 | 5198 | 27653 | 4689 | 1921 |
| 1767 | 55 | 79 | 52 | 101 | 1254 | 11788 | 1139 | 583 |
| 1768 | 528 | 405 | 575 | 1400 | 5208 | 27533 | 4701 | 1962 |
| 1769 | 72 | 87 | 58 | 131 | 1336 | 11909 | 1249 | 715 |
| 1770 | 476 | 362 | 520 | 1305 | 5135 | 27362 | 4635 | 1915 |
| 1771 | 53 | 75 | 49 | 105 | 1314 | 12067 | 1195 | 600 |
| 1772 | 522 | 402 | 570 | 1380 | 5133 | 27251 | 4629 | 1926 |
| 1773 | 76 | 89 | 59 | 140 | 1404 | 12201 | 1312 | 738 |
| 1774 | 479 | 366 | 525 | 1304 | 5075 | 27078 | 4584 | 1911 |
| 1775 | 53 | 71 | 47 | 111 | 1379 | 12350 | 1257 | 623 |
| 1776 | 516 | 398 | 564 | 1360 | 5054 | 26944 | 4555 | 1891 |
| 1777 | 81 | 92 | 61 | 149 | 1478 | 12517 | 1380 | 759 |
| 1778 | 482 | 371 | 529 | 1299 | 5009 | 26765 | 4527 | 1903 |
| 1779 | 53 | 68 | 46 | 121 | 1457 | 12677 | 1331 | 653 |
| 1780 | 507 | 393 | 556 | 1335 | 4967 | 26608 | 4473 | 1852 |
| 1781 | 85 | 94 | 63 | 159 | 1552 | 12847 | 1446 | 776 |
| 1782 | 485 | 375 | 533 | 1295 | 4937 | 26435 | 4463 | 1891 |
| 1783 | 56 | 67 | 47 | 133 | 1534 | 12988 | 1406 | 688 |
| 1784 | 498 | 388 | 548 | 1309 | 4882 | 26274 | 4393 | 1816 |
| 1785 | 87 | 96 | 64 | 167 | 1626 | 13182 | 1510 | 788 |
| 1786 | 489 | 379 | 537 | 1291 | 4864 | 26096 | 4398 | 1876 |
| 1787 | 60 | 68 | 49 | 148 | 1630 | 13364 | 1499 | 732 |
| 1788 | 488 | 381 | 538 | 1278 | 4791 | 25922 | 4308 | 1778 |
| 1789 | 88 | 95 | 64 | 175 | 1702 | 13542 | 1576 | 797 |
| 1790 | 492 | 384 | 541 | 1284 | 4780 | 25725 | 4321 | 1854 |
| 1791 | 65 | 70 | 52 | 166 | 1724 | 13726 | 1589 | 777 |
| 1792 | 476 | 373 | 527 | 1248 | 4697 | 25556 | 4221 | 1741 |
| 1793 | 89 | 95 | 65 | 184 | 1783 | 13918 | 1645 | 808 |
| 1794 | 494 | 388 | 544 | 1275 | 4694 | 25349 | 4242 | 1828 |
| 1795 | 72 | 74 | 56 | 187 | 1821 | 14099 | 1684 | 824 |
| 1796 | 464 | 365 | 515 | 1215 | 4600 | 25170 | 4133 | 1706 |
| 1797 | 89 | 94 | 66 | 194 | 1867 | 14309 | 1717 | 820 |
| 1798 | 495 | 391 | 546 | 1264 | 4605 | 24971 | 4160 | 1799 |
| 1799 | 80 | 78 | 62 | 209 | 1921 | 14486 | 1779 | 871 |
| 1800 | 453 | 357 | 503 | 1184 | 4501 | 24766 | 4043 | 1674 |
| 1801 | 89 | 93 | 67 | 204 | 1955 | 14708 | 1794 | 835 |
| 1802 | 494 | 392 | 546 | 1250 | 4511 | 24574 | 4072 | 1766 |
| 1803 | 90 | 84 | 69 | 234 | 2031 | 14904 | 1883 | 920 |
| 1804 | 443 | 351 | 494 | 1154 | 4401 | 24344 | 3954 | 1646 |
| 1805 | 90 | 91 | 67 | 214 | 2045 | 15115 | 1873 | 852 |
| 1806 | 490 | 391 | 542 | 1229 | 4409 | 24162 | 3977 | 1725 |
| 1807 | 100 | 90 | 76 | 260 | 2139 | 15326 | 1985 | 966 |
| 1808 | 435 | 345 | 484 | 1127 | 4302 | 23932 | 3868 | 1623 |
| 1809 | 91 | 90 | 68 | 225 | 2133 | 15517 | 1951 | 871 |
| 1810 | 484 | 389 | 536 | 1205 | 4303 | 23736 | 3878 | 1681 |
| 1811 | 111 | 97 | 84 | 287 | 2247 | 15753 | 2087 | 1009 |
| 1812 | 429 | 342 | 479 | 1106 | 4206 | 23508 | 3784 | 1604 |
| 1813 | 92 | 89 | 70 | 240 | 2235 | 15962 | 2044 | 898 |
| 1814 | 475 | 383 | 527 | 1175 | 4190 | 23291 | 3772 | 1632 |
| 1815 | 122 | 105 | 93 | 314 | 2357 | 16190 | 2188 | 1050 |
| 1816 | 425 | 340 | 475 | 1086 | 4108 | 23070 | 3699 | 1585 |
| 1817 | 95 | 88 | 73 | 257 | 2339 | 16406 | 2139 | 930 |
| 1818 | 463 | 376 | 516 | 1140 | 4075 | 22851 | 3665 | 1582 |
| 1819 | 133 | 112 | 101 | 338 | 2462 | 16625 | 2284 | 1084 |
| 1820 | 422 | 340 | 473 | 1067 | 4008 | 22623 | 3611 | 1567 |
| 1821 | 99 | 88 | 77 | 278 | 2446 | 16853 | 2237 | 966 |
| 1822 | 451 | 368 | 504 | 1108 | 3962 | 22408 | 3560 | 1535 |
| 1823 | 142 | 118 | 109 | 362 | 2571 | 17082 | 2382 | 1117 |
| 1824 | 420 | 340 | 469 | 1048 | 3903 | 22159 | 3519 | 1545 |
| 1825 | 105 | 89 | 83 | 302 | 2558 | 17306 | 2341 | 1009 |
| 1826 | 440 | 360 | 493 | 1074 | 3847 | 21951 | 3453 | 1490 |
| 1827 | 151 | 124 | 117 | 385 | 2682 | 17554 | 2481 | 1146 |
| 1828 | 417 | 340 | 466 | 1027 | 3796 | 21695 | 3425 | 1520 |
| 1829 | 113 | 92 | 90 | 330 | 2672 | 17759 | 2449 | 1056 |
| 1830 | 426 | 351 | 479 | 1038 | 3729 | 21483 | 3344 | 1443 |
| 1831 | 158 | 129 | 124 | 407 | 2792 | 18023 | 2577 | 1172 |
| 1832 | 414 | 340 | 463 | 1008 | 3692 | 21242 | 3333 | 1495 |
| 1833 | 123 | 97 | 100 | 362 | 2793 | 18228 | 2563 | 1110 |
| 1834 | 413 | 342 | 465 | 1001 | 3606 | 20993 | 3232 | 1396 |
| 1835 | 165 | 132 | 129 | 426 | 2896 | 18483 | 2668 | 1192 |
| 1836 | 412 | 340 | 461 | 988 | 3585 | 20776 | 3236 | 1466 |
| 1837 | 134 | 104 | 111 | 397 | 2917 | 18701 | 2680 | 1166 |
| 1838 | 398 | 331 | 449 | 962 | 3488 | 20528 | 3124 | 1352 |
| 1839 | 169 | 135 | 135 | 446 | 3003 | 18955 | 2760 | 1213 |
| 1840 | 408 | 339 | 456 | 967 | 3473 | 20303 | 3134 | 1432 |
| 1841 | 148 | 112 | 123 | 435 | 3044 | 19177 | 2800 | 1224 |
| 1842 | 382 | 320 | 433 | 923 | 3371 | 20061 | 3017 | 1311 |
| 1843 | 173 | 136 | 140 | 463 | 3107 | 19427 | 2849 | 1230 |
| 1844 | 404 | 339 | 452 | 945 | 3359 | 19825 | 3030 | 1393 |
| 1845 | 163 | 121 | 136 | 477 | 3170 | 19650 | 2918 | 1281 |
| 1846 | 368 | 309 | 418 | 885 | 3255 | 19590 | 2913 | 1274 |
| 1847 | 177 | 138 | 145 | 483 | 3215 | 19904 | 2943 | 1252 |
| 1848 | 399 | 337 | 448 | 924 | 3248 | 19356 | 2927 | 1353 |
| 1849 | 178 | 131 | 151 | 519 | 3295 | 20120 | 3034 | 1336 |
| 1850 | 355 | 300 | 404 | 849 | 3141 | 19114 | 2812 | 1241 |
| 1851 | 181 | 140 | 150 | 501 | 3325 | 20383 | 3039 | 1276 |
| 1852 | 391 | 333 | 440 | 894 | 3128 | 18881 | 2815 | 1304 |
| 1853 | 194 | 142 | 166 | 562 | 3419 | 20594 | 3148 | 1386 |
| 1854 | 342 | 292 | 391 | 815 | 3027 | 18633 | 2711 | 1211 |
| 1855 | 184 | 142 | 156 | 521 | 3433 | 20854 | 3134 | 1301 |
| 1856 | 381 | 327 | 429 | 865 | 3012 | 18418 | 2706 | 1257 |
| 1857 | 210 | 153 | 182 | 604 | 3542 | 21067 | 3260 | 1435 |
| 1858 | 333 | 286 | 381 | 786 | 2917 | 18160 | 2616 | 1187 |
| 1859 | 188 | 143 | 160 | 542 | 3540 | 21317 | 3231 | 1331 |
| 1860 | 368 | 319 | 416 | 829 | 2887 | 17932 | 2591 | 1204 |
| 1861 | 227 | 165 | 197 | 646 | 3663 | 21542 | 3371 | 1480 |
| 1862 | 325 | 281 | 372 | 757 | 2808 | 17689 | 2521 | 1165 |
| 1863 | 193 | 144 | 167 | 565 | 3650 | 21782 | 3329 | 1363 |
| 1864 | 355 | 310 | 403 | 795 | 2770 | 17476 | 2482 | 1154 |
| 1865 | 242 | 176 | 213 | 685 | 3781 | 22010 | 3476 | 1519 |
| 1866 | 318 | 277 | 364 | 731 | 2703 | 17236 | 2430 | 1142 |
| 1867 | 199 | 147 | 174 | 592 | 3758 | 22236 | 3428 | 1399 |
| 1868 | 341 | 300 | 389 | 759 | 2651 | 17013 | 2371 | 1104 |
| 1869 | 256 | 186 | 226 | 719 | 3892 | 22466 | 3575 | 1552 |
| 1870 | 313 | 274 | 357 | 707 | 2600 | 16782 | 2340 | 1121 |
| 1871 | 207 | 150 | 184 | 625 | 3875 | 22698 | 3536 | 1444 |
| 1872 | 327 | 290 | 374 | 724 | 2535 | 16552 | 2265 | 1057 |
| 1873 | 268 | 194 | 239 | 751 | 4003 | 22920 | 3673 | 1582 |
| 1874 | 307 | 271 | 349 | 682 | 2495 | 16331 | 2248 | 1097 |
| 1875 | 218 | 157 | 197 | 662 | 3992 | 23147 | 3645 | 1493 |
| 1876 | 313 | 279 | 359 | 687 | 2423 | 16116 | 2162 | 1013 |
| 1877 | 278 | 201 | 249 | 778 | 4106 | 23363 | 3763 | 1605 |
| 1878 | 301 | 268 | 343 | 658 | 2393 | 15890 | 2157 | 1070 |
| 1879 | 231 | 164 | 210 | 703 | 4105 | 23576 | 3750 | 1543 |
| 1880 | 298 | 270 | 345 | 654 | 2314 | 15683 | 2063 | 972 |
| 1881 | 285 | 206 | 258 | 803 | 4206 | 23798 | 3848 | 1624 |
| 1882 | 296 | 265 | 336 | 635 | 2292 | 15460 | 2067 | 1041 |
| 1883 | 246 | 174 | 227 | 749 | 4223 | 24007 | 3860 | 1598 |
| 1884 | 282 | 258 | 328 | 616 | 2202 | 15234 | 1961 | 930 |
| 1885 | 292 | 211 | 266 | 826 | 4299 | 24202 | 3928 | 1641 |
| 1886 | 289 | 262 | 329 | 609 | 2185 | 15006 | 1971 | 1007 |
| 1887 | 265 | 186 | 246 | 798 | 4342 | 24427 | 3970 | 1654 |
| 1888 | 268 | 247 | 312 | 583 | 2105 | 14835 | 1874 | 898 |
| 1889 | 298 | 215 | 274 | 849 | 4402 | 24637 | 4016 | 1661 |
| 1890 | 284 | 260 | 323 | 587 | 2096 | 14640 | 1890 | 977 |
| 1891 | 281 | 197 | 263 | 841 | 4448 | 24825 | 4069 | 1703 |
| 1892 | 252 | 235 | 295 | 546 | 2002 | 14429 | 1781 | 864 |
| 1893 | 303 | 218 | 281 | 868 | 4490 | 25037 | 4090 | 1676 |
| 1894 | 276 | 256 | 314 | 562 | 1995 | 14244 | 1796 | 937 |
| 1895 | 300 | 211 | 284 | 893 | 4560 | 25232 | 4171 | 1754 |
| 1896 | 238 | 224 | 280 | 512 | 1903 | 14027 | 1694 | 836 |
| 1897 | 307 | 220 | 287 | 886 | 4575 | 25416 | 4163 | 1692 |
| 1898 | 267 | 251 | 305 | 538 | 1899 | 13865 | 1706 | 897 |
| 1899 | 318 | 223 | 303 | 940 | 4662 | 25613 | 4264 | 1797 |
| 1900 | 226 | 215 | 266 | 483 | 1816 | 13661 | 1619 | 816 |
| 1901 | 310 | 222 | 292 | 902 | 4658 | 25788 | 4236 | 1709 |
| 1902 | 257 | 244 | 295 | 512 | 1802 | 13485 | 1615 | 854 |
| 1903 | 337 | 237 | 323 | 989 | 4763 | 25984 | 4355 | 1838 |
| 1904 | 216 | 209 | 255 | 456 | 1731 | 13298 | 1547 | 800 |
| 1905 | 314 | 224 | 299 | 920 | 4742 | 26148 | 4309 | 1730 |
| 1906 | 245 | 236 | 283 | 484 | 1708 | 13128 | 1527 | 810 |
| 1907 | 355 | 251 | 343 | 1033 | 4856 | 26329 | 4438 | 1872 |
| 1908 | 208 | 203 | 246 | 431 | 1652 | 12952 | 1479 | 786 |
| 1909 | 317 | 226 | 304 | 939 | 4823 | 26488 | 4380 | 1752 |
| 1910 | 231 | 226 | 269 | 454 | 1616 | 12777 | 1440 | 767 |
| 1911 | 371 | 263 | 360 | 1072 | 4940 | 26651 | 4511 | 1900 |
| 1912 | 201 | 198 | 237 | 409 | 1569 | 12577 | 1408 | 770 |
| 1913 | 323 | 229 | 313 | 966 | 4907 | 26811 | 4457 | 1782 |
| 1914 | 218 | 216 | 255 | 425 | 1532 | 12455 | 1363 | 728 |
| 1915 | 385 | 274 | 377 | 1106 | 5022 | 26971 | 4583 | 1923 |
| 1916 | 196 | 195 | 229 | 388 | 1503 | 12293 | 1354 | 760 |
| 1917 | 329 | 233 | 322 | 991 | 4983 | 27113 | 4527 | 1812 |
| 1918 | 205 | 207 | 242 | 398 | 1451 | 12153 | 1287 | 692 |
| 1919 | 397 | 284 | 390 | 1135 | 5096 | 27275 | 4645 | 1941 |
| 1920 | 190 | 191 | 221 | 367 | 1433 | 11996 | 1293 | 745 |
| 1921 | 339 | 240 | 334 | 1024 | 5061 | 27402 | 4599 | 1848 |
| 1922 | 192 | 197 | 228 | 371 | 1375 | 11862 | 1217 | 660 |
| 1923 | 406 | 291 | 401 | 1160 | 5163 | 27559 | 4702 | 1954 |
| 1924 | 185 | 188 | 213 | 348 | 1369 | 11719 | 1238 | 732 |
| 1925 | 351 | 247 | 348 | 1058 | 5136 | 27669 | 4669 | 1886 |
| 1926 | 180 | 187 | 215 | 344 | 1303 | 11591 | 1152 | 630 |
| 1927 | 413 | 297 | 410 | 1179 | 5222 | 27818 | 4750 | 1961 |
| 1928 | 180 | 185 | 206 | 328 | 1307 | 11465 | 1184 | 715 |
| 1929 | 365 | 258 | 365 | 1097 | 5208 | 27919 | 4737 | 1926 |
| 1930 | 168 | 177 | 201 | 320 | 1238 | 11342 | 1093 | 606 |
| 1931 | 418 | 300 | 418 | 1196 | 5276 | 28063 | 4795 | 1966 |
| 1932 | 175 | 182 | 200 | 311 | 1249 | 11227 | 1133 | 697 |
| 1933 | 381 | 270 | 384 | 1139 | 5283 | 28170 | 4807 | 1967 |
| 1934 | 155 | 166 | 187 | 294 | 1181 | 11129 | 1044 | 586 |
| 1935 | 422 | 304 | 424 | 1209 | 5327 | 28295 | 4836 | 1969 |
| 1936 | 169 | 179 | 192 | 292 | 1194 | 11025 | 1083 | 676 |
| 1937 | 397 | 282 | 401 | 1177 | 5343 | 28372 | 4862 | 2000 |
| 1938 | 143 | 156 | 174 | 270 | 1127 | 10922 | 998 | 570 |
| 1939 | 424 | 305 | 428 | 1220 | 5370 | 28508 | 4871 | 1971 |
| 1940 | 163 | 175 | 186 | 276 | 1141 | 10824 | 1033 | 651 |
| 1941 | 414 | 294 | 421 | 1219 | 5405 | 28575 | 4919 | 2033 |
| 1942 | 132 | 147 | 161 | 248 | 1079 | 10730 | 958 | 559 |
| 1943 | 426 | 308 | 433 | 1229 | 5411 | 28693 | 4903 | 1973 |
| 1944 | 156 | 171 | 178 | 260 | 1093 | 10657 | 987 | 624 |
| 1945 | 431 | 308 | 441 | 1259 | 5458 | 28748 | 4967 | 2061 |
| 1946 | 123 | 140 | 150 | 228 | 1038 | 10557 | 925 | 555 |
| 1947 | 427 | 309 | 436 | 1235 | 5444 | 28851 | 4930 | 1975 |
| 1948 | 148 | 165 | 170 | 242 | 1048 | 10508 | 944 | 596 |
| 1949 | 447 | 321 | 460 | 1295 | 5505 | 28900 | 5008 | 2083 |
| 1950 | 115 | 135 | 141 | 210 | 1006 | 10417 | 901 | 556 |
| 1951 | 427 | 309 | 438 | 1237 | 5469 | 28976 | 4949 | 1975 |
| 1952 | 138 | 158 | 160 | 225 | 1006 | 10374 | 902 | 568 |
| 1953 | 463 | 334 | 478 | 1330 | 5546 | 29036 | 5043 | 2101 |
| 1954 | 109 | 129 | 132 | 194 | 976 | 10288 | 880 | 558 |
| 1955 | 426 | 308 | 440 | 1243 | 5496 | 29101 | 4973 | 1980 |
| 1956 | 127 | 150 | 149 | 207 | 966 | 10252 | 863 | 541 |
| 1957 | 477 | 346 | 495 | 1360 | 5579 | 29143 | 5071 | 2113 |
| 1958 | 105 | 126 | 125 | 182 | 959 | 10201 | 870 | 566 |
| 1959 | 427 | 308 | 442 | 1248 | 5515 | 29181 | 4989 | 1986 |
| 1960 | 117 | 141 | 138 | 189 | 936 | 10174 | 833 | 518 |
| 1961 | 488 | 355 | 508 | 1379 | 5598 | 29220 | 5084 | 2115 |
| 1962 | 102 | 124 | 119 | 171 | 941 | 10123 | 858 | 570 |
| 1963 | 429 | 310 | 447 | 1259 | 5533 | 29244 | 5005 | 1997 |
| 1964 | 107 | 134 | 129 | 174 | 908 | 10096 | 806 | 498 |
| 1965 | 497 | 363 | 519 | 1397 | 5615 | 29288 | 5096 | 2114 |
| 1966 | 99 | 122 | 114 | 160 | 927 | 10058 | 850 | 574 |
| 1967 | 435 | 314 | 455 | 1276 | 5556 | 29307 | 5028 | 2016 |
| 1968 | 99 | 126 | 119 | 158 | 892 | 10065 | 791 | 485 |
| 1969 | 502 | 369 | 525 | 1404 | 5619 | 29319 | 5095 | 2105 |
| 1970 | 98 | 120 | 109 | 151 | 922 | 10039 | 849 | 579 |
| 1971 | 442 | 321 | 465 | 1294 | 5568 | 29325 | 5041 | 2033 |
| 1972 | 91 | 118 | 110 | 146 | 880 | 10046 | 780 | 475 |
| 1973 | 504 | 371 | 530 | 1409 | 5618 | 29337 | 5089 | 2094 |
| 1974 | 96 | 119 | 105 | 144 | 918 | 10028 | 849 | 582 |
| 1975 | 452 | 329 | 477 | 1316 | 5581 | 29329 | 5056 | 2054 |
| 1976 | 83 | 110 | 101 | 134 | 874 | 10044 | 776 | 470 |
| 1977 | 505 | 373 | 533 | 1411 | 5613 | 29329 | 5080 | 2081 |
| 1978 | 94 | 118 | 100 | 136 | 922 | 10052 | 853 | 584 |
| 1979 | 463 | 337 | 490 | 1337 | 5587 | 29303 | 5063 | 2071 |
| 1980 | 76 | 102 | 92 | 124 | 876 | 10070 | 780 | 471 |
| 1981 | 505 | 373 | 534 | 1408 | 5599 | 29293 | 5063 | 2065 |
| 1982 | 93 | 117 | 97 | 130 | 928 | 10097 | 860 | 583 |
| 1983 | 474 | 347 | 503 | 1358 | 5588 | 29261 | 5065 | 2086 |
| 1984 | 69 | 95 | 84 | 115 | 884 | 10120 | 792 | 477 |
| 1985 | 503 | 373 | 534 | 1402 | 5578 | 29232 | 5040 | 2046 |
| 1986 | 91 | 116 | 93 | 124 | 937 | 10162 | 866 | 578 |
| 1987 | 486 | 357 | 517 | 1378 | 5583 | 29198 | 5061 | 2096 |
| 1988 | 64 | 89 | 76 | 107 | 899 | 10183 | 809 | 488 |
| 1989 | 499 | 371 | 531 | 1393 | 5548 | 29132 | 5009 | 2025 |
| 1990 | 88 | 113 | 89 | 118 | 947 | 10235 | 873 | 569 |
| 1991 | 497 | 367 | 531 | 1399 | 5573 | 29110 | 5053 | 2103 |
| 1992 | 60 | 85 | 70 | 103 | 926 | 10286 | 839 | 508 |
| 1993 | 495 | 369 | 529 | 1381 | 5523 | 29049 | 4983 | 2009 |
| 1994 | 84 | 110 | 84 | 113 | 965 | 10355 | 887 | 561 |
| 1995 | 507 | 376 | 542 | 1413 | 5551 | 28991 | 5032 | 2102 |
| 1996 | 58 | 82 | 65 | 100 | 957 | 10408 | 874 | 531 |
| 1997 | 489 | 364 | 524 | 1366 | 5486 | 28920 | 4947 | 1989 |
| 1998 | 78 | 105 | 79 | 108 | 982 | 10469 | 898 | 550 |
| 1999 | 517 | 387 | 556 | 1430 | 5529 | 28861 | 5011 | 2100 |
| 2000 | 57 | 81 | 62 | 100 | 995 | 10543 | 915 | 558 |
| 2001 | 483 | 361 | 520 | 1352 | 5450 | 28777 | 4913 | 1974 |
| 2002 | 72 | 100 | 73 | 103 | 1012 | 10633 | 922 | 544 |
| 2003 | 525 | 394 | 565 | 1438 | 5494 | 28694 | 4976 | 2087 |
| 2004 | 58 | 81 | 59 | 101 | 1040 | 10712 | 962 | 585 |
| 2005 | 478 | 357 | 516 | 1339 | 5406 | 28603 | 4873 | 1959 |
| 2006 | 67 | 95 | 68 | 100 | 1044 | 10816 | 949 | 541 |
| 2007 | 531 | 400 | 572 | 1441 | 5452 | 28520 | 4935 | 2069 |
| 2008 | 59 | 82 | 58 | 105 | 1086 | 10892 | 1009 | 611 |
| 2009 | 474 | 356 | 514 | 1328 | 5361 | 28412 | 4834 | 1950 |
| 2010 | 62 | 90 | 63 | 97 | 1080 | 11007 | 980 | 542 |
| 2011 | 534 | 405 | 578 | 1438 | 5405 | 28331 | 4890 | 2049 |
| 2012 | 62 | 83 | 58 | 109 | 1138 | 11100 | 1061 | 639 |
| 2013 | 473 | 355 | 514 | 1323 | 5315 | 28197 | 4794 | 1945 |
| 2014 | 58 | 85 | 58 | 96 | 1123 | 11212 | 1018 | 548 |
| 2015 | 534 | 407 | 579 | 1431 | 5350 | 28105 | 4836 | 2021 |
| 2016 | 66 | 85 | 58 | 116 | 1200 | 11338 | 1121 | 666 |
| 2017 | 473 | 357 | 515 | 1317 | 5265 | 27958 | 4751 | 1940 |
| 2018 | 55 | 81 | 54 | 96 | 1174 | 11457 | 1065 | 558 |
| 2019 | 530 | 405 | 575 | 1413 | 5283 | 27861 | 4771 | 1987 |
| 2020 | 70 | 88 | 59 | 122 | 1258 | 11587 | 1177 | 689 |
| 2021 | 477 | 360 | 519 | 1316 | 5213 | 27713 | 4708 | 1938 |
| 2022 | 52 | 76 | 51 | 99 | 1229 | 11708 | 1116 | 572 |
| 2023 | 525 | 403 | 572 | 1398 | 5216 | 27601 | 4706 | 1954 |
| 2024 | 74 | 90 | 59 | 130 | 1322 | 11851 | 1236 | 711 |
| 2025 | 480 | 366 | 525 | 1317 | 5159 | 27441 | 4662 | 1937 |
| 2026 | 51 | 72 | 48 | 104 | 1294 | 11994 | 1178 | 596 |
| 2027 | 518 | 398 | 565 | 1374 | 5137 | 27307 | 4632 | 1917 |
| 2028 | 78 | 92 | 61 | 137 | 1388 | 12144 | 1296 | 730 |
| 2029 | 484 | 370 | 530 | 1314 | 5095 | 27144 | 4606 | 1929 |
| 2030 | 51 | 69 | 47 | 111 | 1364 | 12288 | 1245 | 623 |
| 2031 | 511 | 394 | 559 | 1354 | 5063 | 27019 | 4561 | 1883 |
| 2032 | 81 | 94 | 62 | 144 | 1452 | 12437 | 1354 | 742 |
| 2033 | 489 | 375 | 536 | 1314 | 5032 | 26843 | 4550 | 1920 |
| 2034 | 53 | 67 | 46 | 122 | 1439 | 12590 | 1318 | 656 |
| 2035 | 502 | 389 | 551 | 1330 | 4982 | 26702 | 4486 | 1849 |
| 2036 | 83 | 95 | 62 | 152 | 1526 | 12771 | 1419 | 756 |
| 2037 | 492 | 380 | 540 | 1310 | 4960 | 26514 | 4486 | 1906 |
| 2038 | 56 | 67 | 47 | 134 | 1524 | 12923 | 1401 | 697 |
| 2039 | 493 | 383 | 542 | 1300 | 4893 | 26358 | 4402 | 1811 |
| 2040 | 84 | 94 | 62 | 159 | 1594 | 13091 | 1477 | 763 |
| 2041 | 496 | 385 | 545 | 1307 | 4887 | 26179 | 4419 | 1888 |
| 2042 | 61 | 68 | 49 | 149 | 1611 | 13259 | 1486 | 739 |
| 2043 | 482 | 375 | 531 | 1272 | 4807 | 26019 | 4323 | 1777 |
| 2044 | 84 | 94 | 62 | 167 | 1671 | 13451 | 1543 | 773 |
| 2045 | 499 | 390 | 549 | 1300 | 4807 | 25831 | 4346 | 1865 |
| 2046 | 67 | 71 | 52 | 167 | 1704 | 13620 | 1576 | 784 |
| 2047 | 471 | 368 | 521 | 1242 | 4716 | 25653 | 4239 | 1744 |
| 2048 | 84 | 92 | 63 | 175 | 1750 | 13820 | 1611 | 783 |
| 2049 | 500 | 393 | 551 | 1290 | 4720 | 25458 | 4266 | 1837 |
| 2050 | 74 | 76 | 57 | 188 | 1804 | 13999 | 1672 | 832 |
| 2051 | 459 | 360 | 509 | 1209 | 4620 | 25270 | 4152 | 1712 |
| 2052 | 83 | 90 | 63 | 183 | 1832 | 14201 | 1682 | 795 |
| 2053 | 500 | 395 | 552 | 1277 | 4629 | 25075 | 4180 | 1803 |
| 2054 | 83 | 81 | 63 | 210 | 1903 | 14386 | 1767 | 877 |
| 2055 | 450 | 354 | 500 | 1183 | 4527 | 24884 | 4069 | 1687 |
| 2056 | 83 | 89 | 63 | 192 | 1917 | 14588 | 1756 | 811 |
| 2057 | 498 | 396 | 550 | 1260 | 4534 | 24678 | 4091 | 1765 |
| 2058 | 93 | 87 | 70 | 235 | 2008 | 14787 | 1866 | 922 |
| 2059 | 442 | 349 | 493 | 1158 | 4432 | 24471 | 3986 | 1665 |
| 2060 | 84 | 87 | 64 | 204 | 2012 | 15006 | 1841 | 833 |
| 2061 | 491 | 392 | 543 | 1233 | 4428 | 24266 | 3991 | 1720 |
| 2062 | 103 | 94 | 78 | 259 | 2114 | 15208 | 1964 | 964 |
| 2063 | 437 | 346 | 487 | 1134 | 4332 | 24041 | 3898 | 1643 |
| 2064 | 85 | 87 | 65 | 217 | 2105 | 15421 | 1925 | 857 |
| 2065 | 482 | 387 | 535 | 1204 | 4320 | 23848 | 3891 | 1673 |
| 2066 | 113 | 100 | 85 | 282 | 2213 | 15613 | 2056 | 1000 |
| 2067 | 434 | 346 | 484 | 1118 | 4241 | 23632 | 3820 | 1628 |
| 2068 | 87 | 85 | 67 | 232 | 2201 | 15837 | 2013 | 886 |
| 2069 | 473 | 381 | 525 | 1174 | 4211 | 23418 | 3789 | 1627 |
| 2070 | 123 | 107 | 93 | 307 | 2325 | 16066 | 2159 | 1039 |
| 2071 | 431 | 345 | 482 | 1100 | 4142 | 23188 | 3734 | 1610 |
| 2072 | 91 | 84 | 71 | 252 | 2308 | 16282 | 2112 | 923 |
| 2073 | 461 | 373 | 513 | 1141 | 4098 | 22977 | 3683 | 1580 |
| 2074 | 132 | 113 | 100 | 329 | 2430 | 16507 | 2254 | 1071 |
| 2075 | 429 | 345 | 479 | 1082 | 4044 | 22756 | 3648 | 1591 |
| 2076 | 96 | 85 | 75 | 273 | 2414 | 16714 | 2211 | 963 |
| 2077 | 450 | 367 | 503 | 1110 | 3988 | 22538 | 3581 | 1536 |
| 2078 | 141 | 118 | 107 | 351 | 2534 | 16947 | 2346 | 1097 |
| 2079 | 428 | 347 | 478 | 1066 | 3945 | 22312 | 3560 | 1569 |
| 2080 | 103 | 87 | 82 | 300 | 2528 | 17166 | 2318 | 1010 |
| 2081 | 438 | 358 | 490 | 1076 | 3874 | 22080 | 3476 | 1490 |
| 2082 | 147 | 122 | 113 | 371 | 2643 | 17413 | 2442 | 1123 |
| 2083 | 426 | 346 | 475 | 1046 | 3839 | 21849 | 3466 | 1543 |
| 2084 | 113 | 92 | 91 | 331 | 2648 | 17626 | 2431 | 1063 |
| 2085 | 424 | 348 | 476 | 1038 | 3756 | 21619 | 3368 | 1445 |
| 2086 | 152 | 126 | 118 | 389 | 2744 | 17870 | 2530 | 1142 |
| 2087 | 423 | 347 | 472 | 1027 | 3734 | 21399 | 3371 | 1514 |
| 2088 | 124 | 98 | 101 | 364 | 2766 | 18081 | 2543 | 1117 |
| 2089 | 410 | 338 | 461 | 1001 | 3640 | 21156 | 3261 | 1401 |
| 2090 | 157 | 128 | 123 | 407 | 2847 | 18323 | 2617 | 1159 |
| 2091 | 420 | 347 | 469 | 1008 | 3625 | 20931 | 3272 | 1481 |
| 2092 | 137 | 105 | 112 | 399 | 2885 | 18523 | 2655 | 1172 |
| 2093 | 395 | 328 | 446 | 962 | 3519 | 20660 | 3151 | 1359 |
| 2094 | 161 | 130 | 128 | 425 | 2950 | 18770 | 2708 | 1179 |
| 2095 | 416 | 346 | 465 | 986 | 3511 | 20437 | 3167 | 1443 |
| 2096 | 151 | 114 | 125 | 440 | 3020 | 19019 | 2783 | 1233 |
| 2097 | 380 | 316 | 430 | 923 | 3409 | 20218 | 3053 | 1323 |
| 2098 | 164 | 131 | 132 | 442 | 3060 | 19263 | 2803 | 1201 |
| 2099 | 412 | 345 | 461 | 964 | 3405 | 20006 | 3069 | 1404 |
| 2100 | 165 | 124 | 137 | 478 | 3138 | 19475 | 2892 | 1283 |
| 2101 | 366 | 307 | 416 | 887 | 3295 | 19752 | 2951 | 1290 |
| 2102 | 167 | 132 | 137 | 459 | 3164 | 19728 | 2893 | 1222 |
| 2103 | 405 | 342 | 454 | 940 | 3291 | 19540 | 2962 | 1358 |
| 2104 | 181 | 134 | 152 | 521 | 3264 | 19956 | 3009 | 1336 |
| 2105 | 355 | 300 | 405 | 855 | 3183 | 19275 | 2852 | 1261 |
| 2106 | 172 | 134 | 142 | 480 | 3274 | 20201 | 2991 | 1250 |
| 2107 | 395 | 336 | 444 | 908 | 3170 | 19069 | 2850 | 1308 |
| 2108 | 197 | 145 | 167 | 561 | 3386 | 20431 | 3120 | 1384 |
| 2109 | 346 | 293 | 394 | 825 | 3073 | 18803 | 2756 | 1237 |
| 2110 | 174 | 134 | 146 | 497 | 3379 | 20662 | 3085 | 1276 |
| 2111 | 383 | 328 | 432 | 874 | 3051 | 18606 | 2739 | 1257 |
| 2112 | 212 | 156 | 182 | 600 | 3504 | 20894 | 3227 | 1427 |
| 2113 | 338 | 289 | 386 | 799 | 2967 | 18343 | 2664 | 1216 |
| 2114 | 178 | 136 | 152 | 521 | 3488 | 21125 | 3183 | 1309 |
| 2115 | 370 | 320 | 419 | 840 | 2932 | 18134 | 2628 | 1207 |
| 2116 | 227 | 167 | 197 | 638 | 3624 | 21364 | 3335 | 1469 |
| 2117 | 332 | 286 | 379 | 773 | 2856 | 17850 | 2568 | 1193 |
| 2118 | 185 | 138 | 160 | 549 | 3599 | 21572 | 3285 | 1348 |
| 2119 | 356 | 309 | 405 | 803 | 2808 | 17638 | 2513 | 1156 |
| 2120 | 241 | 176 | 210 | 673 | 3737 | 21814 | 3436 | 1503 |
| 2121 | 328 | 284 | 372 | 749 | 2757 | 17417 | 2482 | 1174 |
| 2122 | 193 | 141 | 169 | 579 | 3717 | 22047 | 3394 | 1392 |
| 2123 | 342 | 299 | 390 | 767 | 2696 | 17213 | 2411 | 1111 |
| 2124 | 252 | 184 | 221 | 701 | 3845 | 22279 | 3531 | 1531 |
| 2125 | 322 | 281 | 366 | 725 | 2651 | 16962 | 2388 | 1149 |
| 2126 | 203 | 147 | 181 | 617 | 3835 | 22508 | 3503 | 1442 |
| 2127 | 329 | 290 | 376 | 733 | 2580 | 16753 | 2304 | 1067 |
| 2128 | 263 | 191 | 232 | 732 | 3956 | 22749 | 3628 | 1558 |
| 2129 | 316 | 278 | 358 | 700 | 2544 | 16503 | 2294 | 1121 |
| 2130 | 217 | 155 | 195 | 658 | 3953 | 22953 | 3613 | 1495 |
| 2131 | 313 | 279 | 360 | 696 | 2467 | 16308 | 2202 | 1023 |
| 2132 | 271 | 197 | 241 | 756 | 4058 | 23190 | 3716 | 1578 |
| 2133 | 311 | 276 | 352 | 676 | 2441 | 16069 | 2202 | 1092 |
| 2134 | 231 | 164 | 210 | 700 | 4067 | 23382 | 3720 | 1547 |
| 2135 | 298 | 268 | 345 | 660 | 2357 | 15868 | 2100 | 982 |
| 2136 | 276 | 201 | 249 | 780 | 4157 | 23630 | 3801 | 1595 |
| 2137 | 305 | 273 | 346 | 653 | 2338 | 15634 | 2109 | 1060 |
| 2138 | 248 | 175 | 228 | 749 | 4190 | 23828 | 3835 | 1604 |
| 2139 | 283 | 257 | 328 | 623 | 2247 | 15418 | 2001 | 944 |
| 2140 | 282 | 204 | 256 | 801 | 4254 | 24048 | 3884 | 1613 |
| 2141 | 298 | 269 | 338 | 627 | 2233 | 15199 | 2013 | 1023 |
| 2142 | 265 | 187 | 246 | 794 | 4298 | 24220 | 3935 | 1653 |
| 2143 | 267 | 245 | 312 | 588 | 2140 | 14974 | 1906 | 910 |
| 2144 | 288 | 208 | 263 | 822 | 4350 | 24457 | 3966 | 1631 |
| 2145 | 291 | 266 | 331 | 605 | 2137 | 14802 | 1924 | 986 |
| 2146 | 284 | 200 | 265 | 846 | 4421 | 24663 | 4048 | 1708 |
| 2147 | 253 | 235 | 297 | 553 | 2047 | 14601 | 1824 | 884 |
| 2148 | 291 | 210 | 269 | 838 | 4442 | 24874 | 4044 | 1647 |
| 2149 | 283 | 262 | 322 | 580 | 2034 | 14397 | 1828 | 943 |
| 2150 | 303 | 213 | 285 | 896 | 4530 | 25068 | 4147 | 1755 |
| 2151 | 240 | 225 | 282 | 520 | 1949 | 14196 | 1738 | 860 |
| 2152 | 295 | 212 | 275 | 857 | 4532 | 25272 | 4123 | 1668 |
| 2153 | 272 | 255 | 312 | 552 | 1933 | 14009 | 1733 | 898 |
| 2154 | 321 | 226 | 305 | 942 | 4632 | 25447 | 4238 | 1795 |
| 2155 | 231 | 218 | 271 | 493 | 1862 | 13820 | 1663 | 843 |
| 2156 | 298 | 214 | 281 | 874 | 4617 | 25641 | 4198 | 1689 |
| 2157 | 260 | 247 | 299 | 522 | 1836 | 13638 | 1641 | 854 |
| 2158 | 339 | 240 | 325 | 987 | 4729 | 25819 | 4324 | 1832 |
| 2159 | 223 | 213 | 261 | 468 | 1775 | 13447 | 1589 | 827 |
| 2160 | 303 | 217 | 288 | 896 | 4705 | 26014 | 4276 | 1715 |
| 2161 | 246 | 236 | 285 | 491 | 1738 | 13271 | 1550 | 808 |
| 2162 | 356 | 252 | 343 | 1028 | 4824 | 26188 | 4408 | 1864 |
| 2163 | 216 | 208 | 252 | 445 | 1692 | 13087 | 1519 | 812 |
| 2164 | 307 | 218 | 294 | 920 | 4788 | 26356 | 4351 | 1742 |
| 2165 | 233 | 227 | 272 | 463 | 1648 | 12926 | 1466 | 768 |
| 2166 | 371 | 264 | 359 | 1065 | 4910 | 26527 | 4483 | 1890 |
| 2167 | 209 | 204 | 244 | 422 | 1616 | 12756 | 1453 | 797 |
| 2168 | 314 | 222 | 303 | 946 | 4867 | 26663 | 4422 | 1772 |
| 2169 | 220 | 217 | 258 | 434 | 1560 | 12589 | 1385 | 730 |
| 2170 | 384 | 274 | 374 | 1096 | 4993 | 26861 | 4555 | 1910 |
| 2171 | 204 | 201 | 237 | 402 | 1543 | 12435 | 1392 | 784 |
| 2172 | 324 | 229 | 316 | 982 | 4959 | 27005 | 4508 | 1813 |
| 2173 | 207 | 207 | 244 | 406 | 1480 | 12281 | 1311 | 696 |
| 2174 | 392 | 281 | 385 | 1120 | 5065 | 27169 | 4616 | 1924 |
| 2175 | 199 | 198 | 229 | 381 | 1472 | 12138 | 1331 | 767 |
| 2176 | 337 | 238 | 332 | 1018 | 5040 | 27302 | 4584 | 1853 |
| 2177 | 193 | 197 | 230 | 377 | 1400 | 11986 | 1239 | 663 |
| 2178 | 400 | 286 | 394 | 1141 | 5130 | 27459 | 4669 | 1932 |
| 2179 | 193 | 195 | 221 | 361 | 1403 | 11853 | 1269 | 748 |
| 2180 | 351 | 248 | 348 | 1059 | 5121 | 27585 | 4659 | 1896 |
| 2181 | 181 | 187 | 216 | 352 | 1329 | 11709 | 1174 | 637 |
| 2182 | 404 | 290 | 401 | 1159 | 5189 | 27728 | 4718 | 1938 |
| 2183 | 188 | 191 | 214 | 342 | 1336 | 11585 | 1210 | 727 |
| 2184 | 368 | 259 | 367 | 1101 | 5198 | 27851 | 4731 | 1937 |
| 2185 | 167 | 176 | 201 | 324 | 1261 | 11445 | 1114 | 613 |
| 2186 | 409 | 294 | 408 | 1175 | 5247 | 27985 | 4765 | 1944 |
| 2187 | 181 | 188 | 207 | 322 | 1273 | 11333 | 1152 | 703 |
| 2188 | 384 | 272 | 386 | 1143 | 5271 | 28093 | 4799 | 1976 |
| 2189 | 155 | 165 | 187 | 299 | 1201 | 11213 | 1063 | 595 |
| 2190 | 412 | 296 | 412 | 1185 | 5293 | 28201 | 4802 | 1946 |
| 2191 | 176 | 184 | 200 | 305 | 1216 | 11118 | 1100 | 678 |
| 2192 | 401 | 284 | 405 | 1183 | 5333 | 28301 | 4856 | 2008 |
| 2193 | 144 | 156 | 175 | 275 | 1148 | 10997 | 1018 | 583 |
| 2194 | 414 | 298 | 417 | 1195 | 5339 | 28413 | 4840 | 1950 |
| 2195 | 168 | 179 | 192 | 287 | 1159 | 10905 | 1045 | 648 |
| 2196 | 419 | 298 | 425 | 1227 | 5398 | 28516 | 4915 | 2041 |
| 2197 | 133 | 148 | 163 | 253 | 1100 | 10794 | 979 | 575 |
| 2198 | 416 | 300 | 421 | 1205 | 5384 | 28614 | 4878 | 1956 |
| 2199 | 159 | 174 | 183 | 269 | 1109 | 10733 | 997 | 619 |
| 2200 | 436 | 312 | 445 | 1265 | 5451 | 28688 | 4961 | 2065 |
| 2201 | 125 | 142 | 152 | 233 | 1060 | 10620 | 948 | 573 |
| 2202 | 416 | 300 | 423 | 1209 | 5417 | 28773 | 4905 | 1958 |
| 2203 | 149 | 166 | 173 | 250 | 1059 | 10568 | 949 | 588 |
| 2204 | 452 | 325 | 463 | 1303 | 5500 | 28861 | 5005 | 2086 |
| 2205 | 119 | 137 | 145 | 217 | 1025 | 10465 | 922 | 574 |
| 2206 | 416 | 300 | 426 | 1216 | 5451 | 28925 | 4934 | 1966 |
| 2207 | 138 | 158 | 163 | 231 | 1013 | 10416 | 904 | 558 |
| 2208 | 467 | 337 | 481 | 1335 | 5541 | 29000 | 5039 | 2101 |
| 2209 | 114 | 134 | 137 | 202 | 998 | 10340 | 903 | 578 |
| 2210 | 416 | 300 | 429 | 1224 | 5479 | 29042 | 4959 | 1974 |
| 2211 | 127 | 150 | 152 | 212 | 975 | 10300 | 867 | 533 |
| 2212 | 479 | 347 | 495 | 1358 | 5570 | 29110 | 5062 | 2107 |
| 2213 | 111 | 131 | 131 | 190 | 974 | 10233 | 886 | 581 |
| 2214 | 420 | 302 | 434 | 1238 | 5509 | 29153 | 4986 | 1989 |
| 2215 | 118 | 142 | 142 | 195 | 941 | 10199 | 835 | 513 |
| 2216 | 487 | 355 | 506 | 1375 | 5591 | 29201 | 5077 | 2107 |
| 2217 | 108 | 129 | 125 | 178 | 953 | 10143 | 872 | 583 |
| 2218 | 426 | 306 | 442 | 1255 | 5534 | 29233 | 5011 | 2008 |
| 2219 | 108 | 133 | 130 | 177 | 915 | 10129 | 811 | 495 |
| 2220 | 493 | 360 | 513 | 1385 | 5601 | 29258 | 5081 | 2100 |
| 2221 | 105 | 127 | 119 | 167 | 937 | 10078 | 860 | 584 |
| 2222 | 434 | 314 | 454 | 1277 | 5557 | 29287 | 5034 | 2029 |
| 2223 | 99 | 125 | 121 | 163 | 895 | 10078 | 793 | 483 |
| 2224 | 497 | 364 | 519 | 1393 | 5613 | 29322 | 5087 | 2093 |
| 2225 | 103 | 125 | 114 | 158 | 928 | 10042 | 855 | 586 |
| 2226 | 444 | 321 | 465 | 1297 | 5572 | 29310 | 5050 | 2048 |
| 2227 | 91 | 117 | 111 | 149 | 882 | 10048 | 782 | 475 |
| 2228 | 498 | 366 | 522 | 1396 | 5614 | 29349 | 5084 | 2082 |
| 2229 | 101 | 124 | 109 | 149 | 921 | 10026 | 851 | 584 |
| 2230 | 456 | 331 | 480 | 1324 | 5591 | 29335 | 5068 | 2070 |
| 2231 | 83 | 109 | 102 | 138 | 872 | 10025 | 776 | 471 |
| 2232 | 498 | 367 | 525 | 1398 | 5610 | 29346 | 5076 | 2068 |
| 2233 | 99 | 123 | 105 | 141 | 921 | 10039 | 852 | 581 |
| 2234 | 467 | 341 | 494 | 1347 | 5600 | 29321 | 5079 | 2087 |
| 2235 | 76 | 101 | 92 | 126 | 876 | 10053 | 783 | 475 |
| 2236 | 497 | 366 | 524 | 1392 | 5594 | 29307 | 5057 | 2050 |
| 2237 | 96 | 121 | 101 | 134 | 922 | 10070 | 850 | 573 |
| 2238 | 480 | 351 | 509 | 1371 | 5604 | 29293 | 5083 | 2101 |
| 2239 | 70 | 94 | 84 | 117 | 883 | 10087 | 793 | 484 |
| 2240 | 494 | 365 | 524 | 1387 | 5580 | 29270 | 5040 | 2036 |
| 2241 | 93 | 118 | 97 | 127 | 925 | 10116 | 851 | 562 |
| 2242 | 492 | 361 | 523 | 1392 | 5601 | 29236 | 5080 | 2110 |
| 2243 | 65 | 90 | 77 | 111 | 902 | 10157 | 816 | 501 |
| 2244 | 491 | 364 | 522 | 1377 | 5557 | 29196 | 5016 | 2019 |
| 2245 | 88 | 114 | 91 | 120 | 933 | 10192 | 855 | 550 |
| 2246 | 504 | 372 | 537 | 1412 | 5587 | 29143 | 5067 | 2112 |
| 2247 | 62 | 87 | 71 | 105 | 925 | 10242 | 842 | 521 |
| 2248 | 486 | 361 | 519 | 1365 | 5531 | 29109 | 4990 | 2004 |
| 2249 | 82 | 109 | 85 | 114 | 946 | 10292 | 863 | 539 |
| 2250 | 513 | 381 | 549 | 1428 | 5570 | 29043 | 5049 | 2110 |
| 2251 | 60 | 85 | 67 | 103 | 953 | 10347 | 874 | 544 |
| 2252 | 480 | 357 | 514 | 1351 | 5495 | 28977 | 4956 | 1988 |
| 2253 | 76 | 104 | 79 | 107 | 963 | 10407 | 875 | 529 |
| 2254 | 523 | 390 | 561 | 1441 | 5546 | 28919 | 5025 | 2103 |
| 2255 | 60 | 85 | 64 | 102 | 988 | 10473 | 911 | 568 |
| 2256 | 476 | 355 | 512 | 1343 | 5464 | 28845 | 4928 | 1978 |
| 2257 | 69 | 99 | 73 | 102 | 990 | 10560 | 897 | 524 |
| 2258 | 530 | 398 | 570 | 1447 | 5516 | 28783 | 4995 | 2091 |
| 2259 | 61 | 85 | 63 | 104 | 1031 | 10636 | 957 | 594 |
| 2260 | 472 | 352 | 509 | 1332 | 5423 | 28676 | 4892 | 1968 |
| 2261 | 64 | 93 | 68 | 97 | 1019 | 10723 | 922 | 523 |
| 2262 | 533 | 402 | 574 | 1447 | 5473 | 28610 | 4953 | 2070 |
| 2263 | 64 | 86 | 61 | 107 | 1077 | 10817 | 1004 | 619 |
| 2264 | 472 | 353 | 511 | 1329 | 5386 | 28501 | 4861 | 1966 |
| 2265 | 60 | 88 | 63 | 95 | 1055 | 10909 | 954 | 525 |
| 2266 | 534 | 405 | 577 | 1440 | 5423 | 28415 | 4903 | 2044 |
| 2267 | 67 | 88 | 61 | 111 | 1127 | 11021 | 1053 | 642 |
| 2268 | 473 | 355 | 513 | 1327 | 5343 | 28294 | 4824 | 1965 |
| 2269 | 56 | 83 | 58 | 93 | 1098 | 11118 | 994 | 534 |
| 2270 | 531 | 403 | 574 | 1427 | 5364 | 28194 | 4846 | 2013 |
| 2271 | 70 | 89 | 61 | 116 | 1177 | 11227 | 1101 | 663 |
| 2272 | 477 | 359 | 520 | 1330 | 5298 | 28057 | 4786 | 1966 |
| 2273 | 53 | 78 | 54 | 95 | 1149 | 11345 | 1041 | 547 |
| 2274 | 526 | 401 | 571 | 1411 | 5304 | 27966 | 4787 | 1981 |
| 2275 | 73 | 91 | 61 | 120 | 1236 | 11477 | 1156 | 683 |
| 2276 | 482 | 364 | 525 | 1330 | 5249 | 27826 | 4745 | 1964 |
| 2277 | 51 | 73 | 50 | 97 | 1204 | 11598 | 1094 | 566 |
| 2278 | 520 | 398 | 566 | 1392 | 5234 | 27708 | 4720 | 1948 |
| 2279 | 76 | 93 | 61 | 126 | 1294 | 11739 | 1209 | 697 |
| 2280 | 487 | 370 | 532 | 1333 | 5196 | 27564 | 4698 | 1960 |
| 2281 | 50 | 70 | 48 | 103 | 1266 | 11859 | 1154 | 591 |
| 2282 | 515 | 394 | 561 | 1374 | 5166 | 27442 | 4655 | 1917 |
| 2283 | 78 | 94 | 61 | 132 | 1355 | 12015 | 1264 | 710 |
| 2284 | 492 | 375 | 537 | 1333 | 5136 | 27280 | 4646 | 1952 |
| 2285 | 51 | 67 | 46 | 111 | 1337 | 12145 | 1223 | 623 |
| 2286 | 506 | 390 | 554 | 1349 | 5088 | 27146 | 4583 | 1882 |
| 2287 | 80 | 94 | 61 | 137 | 1421 | 12322 | 1321 | 720 |
| 2288 | 496 | 381 | 543 | 1331 | 5070 | 26981 | 4587 | 1941 |
| 2289 | 53 | 66 | 46 | 120 | 1410 | 12443 | 1295 | 658 |
| 2290 | 498 | 384 | 546 | 1325 | 5009 | 26837 | 4508 | 1849 |
| 2291 | 80 | 94 | 61 | 143 | 1486 | 12633 | 1378 | 728 |
| 2292 | 502 | 387 | 549 | 1331 | 5004 | 26675 | 4528 | 1927 |
| 2293 | 57 | 67 | 47 | 134 | 1494 | 12764 | 1378 | 701 |
| 2294 | 487 | 377 | 536 | 1296 | 4923 | 26499 | 4428 | 1814 |
| 2295 | 79 | 92 | 60 | 149 | 1557 | 12965 | 1437 | 734 |
| 2296 | 505 | 392 | 554 | 1327 | 4930 | 26343 | 4459 | 1905 |
| 2297 | 62 | 70 | 50 | 150 | 1580 | 13088 | 1461 | 744 |
| 2298 | 477 | 370 | 526 | 1268 | 4838 | 26161 | 4351 | 1784 |
| 2299 | 78 | 90 | 59 | 156 | 1628 | 13297 | 1497 | 742 |
| 2300 | 508 | 397 | 558 | 1321 | 4852 | 25996 | 4386 | 1880 |
| 2301 | 69 | 74 | 54 | 168 | 1677 | 13461 | 1556 | 791 |
| 2302 | 466 | 363 | 515 | 1238 | 4749 | 25804 | 4270 | 1754 |
| 2303 | 77 | 88 | 59 | 163 | 1705 | 13663 | 1564 | 753 |
| 2304 | 508 | 399 | 559 | 1308 | 4761 | 25622 | 4301 | 1846 |
| 2305 | 77 | 79 | 59 | 189 | 1772 | 13831 | 1647 | 834 |
| 2306 | 456 | 357 | 506 | 1211 | 4659 | 25434 | 4190 | 1729 |
| 2307 | 77 | 86 | 59 | 171 | 1786 | 14038 | 1636 | 768 |
| 2308 | 506 | 399 | 557 | 1290 | 4665 | 25232 | 4211 | 1808 |
| 2309 | 85 | 84 | 65 | 209 | 1868 | 14206 | 1738 | 876 |
| 2310 | 449 | 352 | 499 | 1187 | 4563 | 25023 | 4106 | 1706 |
| 2311 | 77 | 85 | 59 | 180 | 1873 | 14432 | 1714 | 787 |
| 2312 | 500 | 397 | 553 | 1267 | 4569 | 24853 | 4121 | 1767 |
| 2313 | 94 | 90 | 71 | 231 | 1968 | 14605 | 1831 | 916 |
| 2314 | 445 | 350 | 495 | 1169 | 4478 | 24641 | 4031 | 1690 |
| 2315 | 78 | 83 | 60 | 192 | 1965 | 14836 | 1797 | 811 |
| 2316 | 493 | 393 | 545 | 1240 | 4464 | 24439 | 4022 | 1721 |
| 2317 | 104 | 96 | 78 | 253 | 2069 | 15008 | 1924 | 954 |
| 2318 | 441 | 349 | 491 | 1149 | 4379 | 24204 | 3945 | 1670 |
| 2319 | 79 | 81 | 61 | 206 | 2054 | 15219 | 1878 | 836 |
| 2320 | 483 | 387 | 536 | 1212 | 4362 | 24036 | 3927 | 1677 |
| 2321 | 114 | 102 | 85 | 276 | 2176 | 15442 | 2023 | 991 |
| 2322 | 439 | 349 | 489 | 1133 | 4289 | 23801 | 3867 | 1655 |
| 2323 | 82 | 80 | 64 | 223 | 2151 | 15628 | 1967 | 868 |
| 2324 | 473 | 380 | 525 | 1183 | 4255 | 23612 | 3827 | 1631 |
| 2325 | 122 | 108 | 91 | 298 | 2281 | 15871 | 2119 | 1022 |
| 2326 | 439 | 351 | 489 | 1120 | 4199 | 23386 | 3789 | 1640 |
| 2327 | 87 | 80 | 68 | 244 | 2263 | 16083 | 2073 | 911 |
| 2328 | 460 | 372 | 513 | 1147 | 4141 | 23166 | 3720 | 1584 |
| 2329 | 130 | 113 | 97 | 317 | 2381 | 16306 | 2207 | 1048 |
| 2330 | 438 | 352 | 487 | 1103 | 4098 | 22946 | 3700 | 1618 |
| 2331 | 94 | 82 | 74 | 270 | 2376 | 16535 | 2180 | 959 |
| 2332 | 449 | 365 | 502 | 1114 | 4028 | 22724 | 3617 | 1540 |
| 2333 | 136 | 117 | 102 | 334 | 2481 | 16751 | 2295 | 1068 |
| 2334 | 436 | 352 | 486 | 1085 | 3995 | 22495 | 3608 | 1592 |
| 2335 | 103 | 86 | 82 | 298 | 2487 | 16961 | 2285 | 1009 |
| 2336 | 436 | 356 | 489 | 1080 | 3914 | 22257 | 3512 | 1496 |
| 2337 | 141 | 119 | 107 | 353 | 2588 | 17207 | 2388 | 1090 |
| 2338 | 434 | 353 | 484 | 1066 | 3887 | 22018 | 3511 | 1564 |
| 2339 | 114 | 92 | 91 | 329 | 2610 | 17426 | 2402 | 1065 |
| 2340 | 422 | 346 | 474 | 1041 | 3799 | 21801 | 3406 | 1453 |
| 2341 | 145 | 121 | 112 | 370 | 2692 | 17674 | 2478 | 1109 |
| 2342 | 432 | 354 | 482 | 1048 | 3782 | 21565 | 3415 | 1532 |
| 2343 | 125 | 99 | 101 | 363 | 2731 | 17888 | 2516 | 1120 |
| 2344 | 407 | 335 | 459 | 1003 | 3684 | 21342 | 3301 | 1413 |
| 2345 | 148 | 123 | 116 | 387 | 2796 | 18142 | 2568 | 1128 |
| 2346 | 429 | 354 | 479 | 1029 | 3674 | 21109 | 3315 | 1496 |
| 2347 | 138 | 107 | 112 | 400 | 2857 | 18361 | 2634 | 1176 |
| 2348 | 392 | 325 | 443 | 963 | 3564 | 20853 | 3193 | 1372 |
| 2349 | 151 | 124 | 120 | 403 | 2899 | 18604 | 2657 | 1146 |
| 2350 | 425 | 353 | 475 | 1007 | 3561 | 20643 | 3211 | 1455 |
| 2351 | 153 | 116 | 125 | 440 | 2984 | 18842 | 2753 | 1232 |
| 2352 | 379 | 315 | 429 | 927 | 3450 | 20387 | 3091 | 1339 |
| 2353 | 155 | 125 | 124 | 420 | 3005 | 19074 | 2750 | 1168 |
| 2354 | 417 | 350 | 468 | 980 | 3442 | 20162 | 3100 | 1408 |
| 2355 | 168 | 127 | 139 | 480 | 3108 | 19317 | 2868 | 1284 |
| 2356 | 367 | 307 | 417 | 893 | 3338 | 19918 | 2993 | 1310 |
| 2357 | 157 | 125 | 128 | 437 | 3112 | 19550 | 2844 | 1193 |
| 2358 | 409 | 345 | 459 | 951 | 3325 | 19697 | 2990 | 1359 |
| 2359 | 183 | 137 | 153 | 519 | 3229 | 19789 | 2979 | 1331 |
| 2360 | 358 | 301 | 407 | 865 | 3228 | 19448 | 2897 | 1286 |
| 2361 | 161 | 127 | 133 | 457 | 3221 | 20022 | 2942 | 1222 |
| 2362 | 396 | 337 | 446 | 915 | 3200 | 19212 | 2874 | 1306 |
| 2363 | 199 | 148 | 168 | 558 | 3352 | 20273 | 3091 | 1377 |
| 2364 | 351 | 297 | 399 | 838 | 3118 | 18970 | 2801 | 1264 |
| 2365 | 166 | 128 | 139 | 481 | 3334 | 20500 | 3044 | 1257 |
| 2366 | 383 | 328 | 433 | 880 | 3080 | 18744 | 2762 | 1256 |
| 2367 | 213 | 158 | 182 | 593 | 3467 | 20735 | 3194 | 1416 |
| 2368 | 345 | 294 | 393 | 814 | 3012 | 18504 | 2709 | 1243 |
| 2369 | 171 | 130 | 146 | 507 | 3446 | 20965 | 3146 | 1295 |
| 2370 | 370 | 319 | 420 | 845 | 2962 | 18283 | 2652 | 1207 |
| 2371 | 226 | 167 | 194 | 627 | 3582 | 21206 | 3296 | 1450 |
| 2372 | 340 | 292 | 387 | 790 | 2904 | 18027 | 2613 | 1219 |
| 2373 | 180 | 134 | 156 | 540 | 3566 | 21437 | 3256 | 1340 |
| 2374 | 356 | 309 | 405 | 808 | 2838 | 17794 | 2538 | 1157 |
| 2375 | 238 | 176 | 206 | 659 | 3698 | 21685 | 3398 | 1483 |
| 2376 | 334 | 289 | 379 | 764 | 2795 | 17561 | 2518 | 1193 |
| 2377 | 189 | 138 | 166 | 574 | 3682 | 21894 | 3364 | 1388 |
| 2378 | 342 | 299 | 390 | 772 | 2724 | 17349 | 2434 | 1113 |
| 2379 | 247 | 182 | 216 | 686 | 3806 | 22146 | 3493 | 1507 |
| 2380 | 329 | 287 | 373 | 740 | 2690 | 17109 | 2425 | 1168 |
| 2381 | 59 | 86 | 68 | 98 | 942 | 10408 | 847 | 489 |
| 2382 | 517 | 387 | 555 | 1422 | 5516 | 28912 | 4981 | 2036 |
| 2383 | 81 | 104 | 76 | 111 | 1014 | 10508 | 945 | 607 |
| 2384 | 490 | 364 | 527 | 1375 | 5497 | 28830 | 4979 | 2064 |
| 2385 | 55 | 80 | 62 | 95 | 977 | 10556 | 884 | 507 |
| 2386 | 512 | 385 | 551 | 1408 | 5470 | 28741 | 4937 | 2010 |
| 2387 | 80 | 103 | 74 | 109 | 1047 | 10669 | 974 | 609 |
| 2388 | 499 | 372 | 537 | 1388 | 5470 | 28670 | 4956 | 2066 |
| 2389 | 53 | 76 | 58 | 94 | 1019 | 10724 | 928 | 530 |
| 2390 | 267 | 194 | 239 | 755 | 4111 | 23469 | 3756 | 1564 |
| 2391 | 313 | 279 | 354 | 668 | 2370 | 15750 | 2137 | 1068 |
| 2392 | 251 | 177 | 230 | 752 | 4163 | 23670 | 3814 | 1608 |
| 2393 | 281 | 255 | 327 | 625 | 2273 | 15517 | 2026 | 954 |
| 2394 | 272 | 198 | 247 | 777 | 4212 | 23910 | 3843 | 1585 |
| 2395 | 306 | 276 | 347 | 645 | 2265 | 15310 | 2039 | 1029 |
| 2396 | 269 | 190 | 249 | 803 | 4286 | 24112 | 3926 | 1663 |
| 2397 | 266 | 243 | 310 | 589 | 2173 | 15108 | 1938 | 926 |
| 2398 | 276 | 201 | 253 | 795 | 4309 | 24331 | 3927 | 1605 |
| 2399 | 297 | 271 | 338 | 619 | 2162 | 14903 | 1943 | 986 |
| 2400 | 289 | 203 | 269 | 852 | 4398 | 24524 | 4029 | 1711 |
| 2401 | 254 | 235 | 297 | 557 | 2076 | 14697 | 1853 | 902 |
| 2402 | 280 | 203 | 259 | 813 | 4403 | 24745 | 4008 | 1625 |
| 2403 | 286 | 265 | 327 | 590 | 2062 | 14518 | 1849 | 942 |
| 2404 | 307 | 216 | 288 | 898 | 4504 | 24930 | 4125 | 1752 |
| 2405 | 244 | 227 | 285 | 528 | 1980 | 14290 | 1771 | 881 |
| 2406 | 285 | 205 | 265 | 834 | 4496 | 25141 | 4090 | 1649 |
| 2407 | 274 | 256 | 315 | 560 | 1960 | 14127 | 1754 | 896 |
| 2408 | 325 | 230 | 308 | 945 | 4610 | 25330 | 4219 | 1793 |
| 2409 | 235 | 221 | 275 | 501 | 1889 | 13900 | 1692 | 864 |
| 2410 | 289 | 207 | 271 | 854 | 4584 | 25515 | 4168 | 1674 |
| 2411 | 260 | 247 | 301 | 529 | 1859 | 13744 | 1660 | 850 |
| 2412 | 343 | 243 | 326 | 987 | 4710 | 25714 | 4308 | 1827 |
| 2413 | 228 | 217 | 266 | 477 | 1806 | 13537 | 1621 | 849 |
| 2414 | 293 | 209 | 279 | 878 | 4672 | 25878 | 4247 | 1703 |
| 2415 | 247 | 237 | 287 | 498 | 1763 | 13376 | 1570 | 808 |
| 2416 | 357 | 254 | 342 | 1023 | 4801 | 26080 | 4388 | 1854 |
| 2417 | 222 | 213 | 258 | 454 | 1723 | 13181 | 1551 | 833 |
| 2418 | 301 | 214 | 289 | 909 | 4764 | 26243 | 4332 | 1740 |
| 2419 | 233 | 227 | 273 | 467 | 1668 | 13010 | 1482 | 768 |
| 2420 | 370 | 264 | 357 | 1056 | 4886 | 26427 | 4461 | 1876 |
| 2421 | 216 | 210 | 250 | 433 | 1644 | 12841 | 1482 | 817 |
| 2422 | 312 | 220 | 302 | 945 | 4855 | 26585 | 4417 | 1781 |
| 2423 | 220 | 217 | 259 | 438 | 1582 | 12689 | 1404 | 732 |
| 2424 | 378 | 271 | 367 | 1078 | 4957 | 26737 | 4520 | 1888 |
| 2425 | 211 | 206 | 243 | 412 | 1563 | 12492 | 1411 | 797 |
| 2426 | 325 | 229 | 317 | 984 | 4943 | 26900 | 4499 | 1823 |
| 2427 | 207 | 206 | 245 | 410 | 1501 | 12371 | 1330 | 700 |
| 2428 | 386 | 276 | 377 | 1102 | 5035 | 27072 | 4586 | 1902 |
| 2429 | 206 | 203 | 235 | 392 | 1492 | 12196 | 1349 | 778 |
| 2430 | 341 | 240 | 335 | 1026 | 5032 | 27208 | 4582 | 1869 |
| 2431 | 194 | 196 | 230 | 382 | 1424 | 12070 | 1260 | 671 |
| 2432 | 392 | 281 | 385 | 1121 | 5103 | 27371 | 4642 | 1911 |
| 2433 | 200 | 200 | 228 | 371 | 1423 | 11912 | 1287 | 756 |
| 2434 | 356 | 251 | 352 | 1066 | 5110 | 27483 | 4653 | 1909 |
| 2435 | 180 | 185 | 215 | 354 | 1350 | 11783 | 1194 | 646 |
| 2436 | 396 | 284 | 391 | 1138 | 5165 | 27651 | 4693 | 1918 |
| 2437 | 193 | 196 | 221 | 352 | 1354 | 11643 | 1224 | 731 |
| 2438 | 373 | 263 | 372 | 1111 | 5191 | 27763 | 4728 | 1951 |
| 2439 | 167 | 175 | 201 | 327 | 1281 | 11504 | 1134 | 625 |
| 2440 | 400 | 287 | 397 | 1152 | 5223 | 27908 | 4740 | 1924 |
| 2441 | 187 | 193 | 214 | 333 | 1291 | 11392 | 1165 | 703 |
| 2442 | 391 | 277 | 392 | 1155 | 5267 | 28021 | 4798 | 1988 |
| 2443 | 154 | 164 | 186 | 300 | 1220 | 11261 | 1082 | 609 |
| 2444 | 102 | 99 | 75 | 233 | 2064 | 15091 | 1901 | 894 |
| 2445 | 480 | 382 | 531 | 1212 | 4411 | 24158 | 3985 | 1737 |
| 2446 | 89 | 81 | 68 | 240 | 2113 | 15291 | 1954 | 928 |
| 2447 | 446 | 354 | 496 | 1145 | 4310 | 23951 | 3869 | 1613 |
| 2448 | 103 | 99 | 76 | 243 | 2153 | 15505 | 1978 | 908 |
| 2449 | 479 | 384 | 530 | 1197 | 4310 | 23733 | 3891 | 1702 |
| 2450 | 99 | 88 | 76 | 268 | 2223 | 15711 | 2058 | 977 |
| 2451 | 434 | 347 | 485 | 1113 | 4204 | 23522 | 3775 | 1581 |
| 2452 | 104 | 99 | 78 | 256 | 2249 | 15943 | 2063 | 926 |
| 2453 | 475 | 383 | 528 | 1178 | 4205 | 23299 | 3793 | 1662 |
| 2454 | 111 | 94 | 85 | 298 | 2337 | 16153 | 2166 | 1026 |
| 2455 | 423 | 340 | 475 | 1083 | 4100 | 23080 | 3683 | 1554 |
| 2456 | 106 | 98 | 80 | 270 | 2350 | 16390 | 2152 | 948 |
| 2457 | 469 | 381 | 521 | 1151 | 4093 | 22856 | 3689 | 1616 |
| 2458 | 123 | 103 | 95 | 328 | 2451 | 16599 | 2272 | 1073 |
| 2459 | 415 | 334 | 465 | 1055 | 3992 | 22621 | 3588 | 1528 |
| 2460 | 108 | 98 | 83 | 285 | 2450 | 16836 | 2242 | 973 |
| 2461 | 461 | 375 | 513 | 1122 | 3980 | 22413 | 3583 | 1569 |
| 2462 | 134 | 110 | 105 | 358 | 2563 | 17049 | 2376 | 1115 |
| 2463 | 410 | 332 | 461 | 1034 | 3892 | 22175 | 3501 | 1509 |
| 2464 | 111 | 98 | 87 | 303 | 2556 | 17285 | 2338 | 1003 |
| 2465 | 450 | 369 | 502 | 1089 | 3865 | 21956 | 3476 | 1519 |
| 2466 | 147 | 118 | 115 | 388 | 2681 | 17519 | 2484 | 1157 |
| 2467 | 405 | 330 | 455 | 1010 | 3784 | 21706 | 3407 | 1486 |
| 2468 | 114 | 98 | 90 | 323 | 2664 | 17749 | 2437 | 1037 |
| 2469 | 437 | 360 | 490 | 1054 | 3744 | 21487 | 3363 | 1469 |
| 2470 | 158 | 126 | 125 | 416 | 2794 | 17986 | 2586 | 1193 |
| 2471 | 402 | 329 | 451 | 990 | 3682 | 21253 | 3317 | 1467 |
| 2472 | 119 | 99 | 96 | 347 | 2774 | 18201 | 2538 | 1076 |
| 2473 | 425 | 352 | 477 | 1021 | 3626 | 21022 | 3255 | 1421 |
| 2474 | 169 | 133 | 134 | 443 | 2907 | 18453 | 2687 | 1225 |
| 2475 | 398 | 329 | 447 | 969 | 3576 | 20780 | 3224 | 1445 |
| 2476 | 127 | 101 | 104 | 376 | 2894 | 18677 | 2650 | 1124 |
| 2477 | 412 | 344 | 464 | 985 | 3506 | 20543 | 3144 | 1374 |
| 2478 | 177 | 139 | 142 | 467 | 3018 | 18927 | 2785 | 1253 |
| 2479 | 394 | 327 | 442 | 946 | 3467 | 20310 | 3128 | 1419 |
| 2480 | 137 | 106 | 114 | 409 | 3017 | 19155 | 2765 | 1177 |
| 2481 | 398 | 334 | 449 | 947 | 3386 | 20071 | 3033 | 1327 |
| 2482 | 184 | 144 | 149 | 488 | 3124 | 19391 | 2876 | 1275 |
| 2483 | 390 | 326 | 439 | 925 | 3358 | 19841 | 3030 | 1389 |
| 2484 | 149 | 112 | 125 | 445 | 3138 | 19622 | 2879 | 1231 |
| 2485 | 383 | 323 | 434 | 910 | 3267 | 19598 | 2924 | 1282 |
| 2486 | 190 | 147 | 156 | 511 | 3234 | 19877 | 2972 | 1296 |
| 2487 | 387 | 326 | 435 | 905 | 3245 | 19355 | 2929 | 1357 |
| 2488 | 163 | 120 | 138 | 487 | 3267 | 20101 | 3001 | 1290 |
| 2489 | 368 | 312 | 418 | 870 | 3148 | 19120 | 2816 | 1239 |
| 2490 | 196 | 150 | 162 | 531 | 3343 | 20354 | 3066 | 1317 |
| 2491 | 382 | 324 | 429 | 880 | 3134 | 18892 | 2827 | 1320 |
| 2492 | 178 | 130 | 152 | 527 | 3389 | 20560 | 3115 | 1345 |
| 2493 | 352 | 301 | 402 | 832 | 3031 | 18650 | 2710 | 1200 |
| 2494 | 200 | 152 | 168 | 551 | 3448 | 20822 | 3156 | 1336 |
| 2495 | 377 | 323 | 424 | 858 | 3023 | 18430 | 2725 | 1281 |
| 2496 | 194 | 140 | 167 | 572 | 3515 | 21035 | 3232 | 1401 |
| 2497 | 338 | 291 | 387 | 796 | 2917 | 18172 | 2608 | 1165 |
| 2498 | 204 | 155 | 174 | 571 | 3557 | 21293 | 3251 | 1358 |
| 2499 | 370 | 320 | 417 | 832 | 2908 | 17956 | 2618 | 1237 |
| 2500 | 211 | 152 | 185 | 618 | 3644 | 21511 | 3350 | 1456 |
| 2501 | 323 | 280 | 371 | 756 | 2797 | 17682 | 2501 | 1130 |
| 2502 | 208 | 156 | 179 | 588 | 3659 | 21748 | 3340 | 1380 |
| 2503 | 361 | 315 | 409 | 804 | 2793 | 17502 | 2511 | 1190 |
| 2504 | 228 | 164 | 201 | 663 | 3765 | 21977 | 3461 | 1505 |
| 2505 | 313 | 273 | 360 | 726 | 2694 | 17241 | 2411 | 1107 |
| 2506 | 211 | 157 | 184 | 608 | 3762 | 22200 | 3430 | 1404 |
| 2507 | 350 | 307 | 396 | 771 | 2675 | 17043 | 2401 | 1139 |
| 2508 | 245 | 176 | 218 | 707 | 3884 | 22436 | 3569 | 1550 |
| 2509 | 304 | 268 | 350 | 698 | 2588 | 16790 | 2320 | 1085 |
| 2510 | 216 | 159 | 190 | 631 | 3870 | 22663 | 3528 | 1436 |
| 2511 | 335 | 298 | 382 | 735 | 2553 | 16571 | 2288 | 1086 |
| 2512 | 261 | 188 | 235 | 749 | 3999 | 22887 | 3673 | 1591 |
| 2513 | 297 | 263 | 341 | 671 | 2485 | 16342 | 2232 | 1065 |
| 2514 | 221 | 162 | 197 | 656 | 3978 | 23115 | 3626 | 1470 |
| 2515 | 322 | 288 | 368 | 701 | 2441 | 16136 | 2183 | 1039 |
| 2516 | 277 | 199 | 250 | 786 | 4106 | 23315 | 3768 | 1625 |
| 2517 | 291 | 260 | 334 | 646 | 2383 | 15896 | 2143 | 1044 |
| 2518 | 228 | 165 | 206 | 686 | 4084 | 23541 | 3723 | 1508 |
| 2519 | 309 | 278 | 354 | 667 | 2331 | 15706 | 2082 | 994 |
| 2520 | 290 | 208 | 264 | 821 | 4216 | 23763 | 3865 | 1656 |
| 2521 | 285 | 256 | 326 | 622 | 2284 | 15460 | 2056 | 1022 |
| 2522 | 238 | 170 | 218 | 722 | 4197 | 23977 | 3827 | 1554 |
| 2523 | 295 | 269 | 340 | 633 | 2224 | 15279 | 1983 | 951 |
| 2524 | 301 | 217 | 276 | 851 | 4320 | 24198 | 3956 | 1682 |
| 2525 | 278 | 253 | 319 | 597 | 2186 | 15044 | 1971 | 998 |
| 2526 | 249 | 177 | 231 | 760 | 4303 | 24383 | 3926 | 1601 |
| 2527 | 281 | 259 | 326 | 600 | 2115 | 14846 | 1884 | 908 |
| 2528 | 311 | 224 | 287 | 881 | 4419 | 24614 | 4041 | 1704 |
| 2529 | 273 | 250 | 311 | 573 | 2091 | 14638 | 1887 | 974 |
| 2530 | 264 | 186 | 247 | 803 | 4414 | 24791 | 4029 | 1652 |
| 2531 | 266 | 248 | 310 | 567 | 2013 | 14446 | 1792 | 870 |
| 2532 | 318 | 228 | 296 | 904 | 4512 | 25019 | 4121 | 1721 |
| 2533 | 267 | 247 | 305 | 550 | 1997 | 14242 | 1803 | 946 |
| 2534 | 280 | 197 | 265 | 849 | 4526 | 25201 | 4134 | 1705 |
| 2535 | 250 | 235 | 293 | 530 | 1910 | 14040 | 1697 | 832 |
| 2536 | 324 | 233 | 304 | 925 | 4598 | 25405 | 4193 | 1734 |
| 2537 | 261 | 244 | 297 | 527 | 1903 | 13856 | 1717 | 915 |
| 2538 | 298 | 209 | 284 | 897 | 4633 | 25585 | 4232 | 1756 |
| 2539 | 235 | 223 | 276 | 497 | 1817 | 13675 | 1614 | 801 |
| 2540 | 329 | 236 | 310 | 942 | 4678 | 25766 | 4260 | 1746 |
| 2541 | 254 | 240 | 289 | 504 | 1809 | 13482 | 1631 | 879 |
| 2542 | 316 | 222 | 303 | 946 | 4736 | 25954 | 4327 | 1805 |
| 2543 | 221 | 213 | 261 | 465 | 1727 | 13309 | 1535 | 775 |
| 2544 | 334 | 239 | 318 | 961 | 4764 | 26144 | 4334 | 1762 |
| 2545 | 246 | 235 | 281 | 480 | 1718 | 13121 | 1546 | 841 |
| 2546 | 335 | 236 | 324 | 994 | 4832 | 26299 | 4415 | 1849 |
| 2547 | 208 | 203 | 247 | 434 | 1642 | 12958 | 1461 | 753 |
| 2548 | 337 | 241 | 323 | 977 | 4842 | 26489 | 4400 | 1776 |
| 2549 | 236 | 229 | 271 | 457 | 1632 | 12788 | 1465 | 802 |
| 2550 | 353 | 249 | 344 | 1043 | 4924 | 26629 | 4498 | 1888 |
| 2551 | 197 | 194 | 234 | 406 | 1562 | 12622 | 1393 | 736 |
| 2552 | 340 | 243 | 328 | 993 | 4916 | 26812 | 4465 | 1792 |
| 2553 | 225 | 222 | 260 | 432 | 1547 | 12462 | 1384 | 762 |
| 2554 | 373 | 263 | 365 | 1089 | 5016 | 26966 | 4580 | 1925 |
| 2555 | 188 | 188 | 224 | 382 | 1487 | 12291 | 1330 | 724 |
| 2556 | 343 | 245 | 334 | 1009 | 4988 | 27117 | 4528 | 1810 |
| 2557 | 213 | 214 | 248 | 404 | 1465 | 12157 | 1307 | 722 |
| 2558 | 390 | 277 | 385 | 1131 | 5099 | 27274 | 4653 | 1955 |
| 2559 | 180 | 183 | 214 | 359 | 1421 | 12005 | 1275 | 714 |
| 2560 | 346 | 247 | 340 | 1027 | 5057 | 27405 | 4589 | 1831 |
| 2561 | 200 | 204 | 234 | 377 | 1386 | 11866 | 1233 | 684 |
| 2562 | 405 | 289 | 402 | 1166 | 5173 | 27561 | 4717 | 1978 |
| 2563 | 174 | 180 | 206 | 339 | 1358 | 11731 | 1222 | 705 |
| 2564 | 351 | 249 | 347 | 1048 | 5125 | 27683 | 4651 | 1856 |
| 2565 | 187 | 195 | 221 | 351 | 1311 | 11590 | 1163 | 648 |
| 2566 | 418 | 299 | 417 | 1196 | 5238 | 27826 | 4772 | 1994 |
| 2567 | 169 | 176 | 198 | 320 | 1299 | 11474 | 1172 | 696 |
| 2568 | 359 | 254 | 358 | 1077 | 5194 | 27943 | 4715 | 1887 |
| 2569 | 175 | 185 | 208 | 326 | 1243 | 11341 | 1100 | 617 |
| 2570 | 428 | 307 | 428 | 1220 | 5295 | 28065 | 4819 | 2004 |
| 2571 | 164 | 172 | 191 | 301 | 1241 | 11233 | 1124 | 685 |
| 2572 | 369 | 262 | 371 | 1108 | 5260 | 28176 | 4775 | 1920 |
| 2573 | 163 | 175 | 195 | 301 | 1181 | 11117 | 1044 | 590 |
| 2574 | 435 | 313 | 438 | 1238 | 5344 | 28284 | 4859 | 2008 |
| 2575 | 160 | 170 | 184 | 284 | 1190 | 11016 | 1080 | 674 |
| 2576 | 381 | 271 | 386 | 1142 | 5322 | 28386 | 4834 | 1955 |
| 2577 | 152 | 166 | 183 | 279 | 1125 | 10908 | 994 | 567 |
| 2578 | 440 | 317 | 445 | 1254 | 5389 | 28487 | 4896 | 2011 |
| 2579 | 155 | 167 | 177 | 268 | 1136 | 10789 | 1034 | 658 |
| 2580 | 397 | 282 | 403 | 1182 | 5385 | 28580 | 4895 | 1993 |
| 2581 | 140 | 156 | 170 | 257 | 1077 | 10714 | 951 | 549 |
| 2582 | 444 | 321 | 451 | 1268 | 5435 | 28684 | 4932 | 2014 |
| 2583 | 151 | 164 | 171 | 251 | 1099 | 10644 | 1000 | 645 |
| 2584 | 410 | 293 | 419 | 1214 | 5434 | 28736 | 4940 | 2023 |
| 2585 | 128 | 146 | 157 | 235 | 1032 | 10550 | 913 | 535 |
| 2586 | 447 | 323 | 456 | 1276 | 5467 | 28841 | 4956 | 2012 |
| 2587 | 146 | 161 | 165 | 237 | 1057 | 10493 | 962 | 626 |
| 2588 | 427 | 305 | 438 | 1253 | 5487 | 28902 | 4989 | 2055 |
| 2589 | 118 | 137 | 145 | 215 | 993 | 10394 | 880 | 526 |
| 2590 | 449 | 325 | 460 | 1284 | 5496 | 28981 | 4978 | 2010 |
| 2591 | 140 | 158 | 158 | 222 | 1019 | 10357 | 925 | 605 |
| 2592 | 443 | 318 | 457 | 1290 | 5532 | 29035 | 5030 | 2081 |
| 2593 | 108 | 128 | 133 | 196 | 963 | 10274 | 857 | 522 |
| 2594 | 448 | 325 | 462 | 1285 | 5515 | 29086 | 4991 | 2004 |
| 2595 | 133 | 153 | 150 | 207 | 985 | 10252 | 891 | 581 |
| 2596 | 458 | 330 | 475 | 1323 | 5566 | 29136 | 5060 | 2101 |
| 2597 | 101 | 123 | 124 | 180 | 940 | 10178 | 842 | 526 |
| 2598 | 447 | 325 | 463 | 1286 | 5532 | 29180 | 5003 | 2001 |
| 2599 | 125 | 147 | 142 | 193 | 951 | 10155 | 857 | 555 |
| 2600 | 474 | 343 | 493 | 1357 | 5598 | 29227 | 5088 | 2118 |
| 2601 | 95 | 118 | 116 | 166 | 925 | 10100 | 834 | 533 |
| 2602 | 446 | 324 | 463 | 1286 | 5547 | 29258 | 5015 | 2001 |
| 2603 | 115 | 140 | 133 | 177 | 925 | 10087 | 830 | 532 |
| 2604 | 487 | 355 | 509 | 1383 | 5613 | 29259 | 5098 | 2124 |
| 2605 | 91 | 115 | 109 | 156 | 910 | 10024 | 826 | 541 |
| 2606 | 445 | 324 | 465 | 1287 | 5551 | 29271 | 5018 | 2000 |
| 2607 | 106 | 132 | 123 | 163 | 903 | 10031 | 808 | 512 |
| 2608 | 499 | 365 | 523 | 1406 | 5630 | 29306 | 5111 | 2129 |
| 2609 | 89 | 113 | 104 | 147 | 912 | 10018 | 833 | 554 |
| 2610 | 444 | 323 | 467 | 1293 | 5565 | 29326 | 5030 | 2008 |
| 2611 | 97 | 125 | 114 | 150 | 892 | 10034 | 796 | 496 |
| 2612 | 508 | 373 | 534 | 1420 | 5638 | 29340 | 5114 | 2126 |
| 2613 | 87 | 111 | 99 | 139 | 909 | 10008 | 836 | 562 |
| 2614 | 448 | 326 | 472 | 1302 | 5567 | 29320 | 5033 | 2015 |
| 2615 | 89 | 118 | 105 | 137 | 884 | 10040 | 788 | 484 |
| 2616 | 513 | 379 | 541 | 1429 | 5632 | 29329 | 5105 | 2115 |
| 2617 | 86 | 110 | 95 | 132 | 915 | 10029 | 845 | 572 |
| 2618 | 452 | 330 | 478 | 1312 | 5565 | 29286 | 5034 | 2026 |
| 2619 | 82 | 111 | 97 | 126 | 882 | 10065 | 786 | 476 |
| 2620 | 516 | 382 | 546 | 1431 | 5621 | 29300 | 5091 | 2101 |
| 2621 | 85 | 109 | 91 | 126 | 924 | 10072 | 857 | 581 |
| 2622 | 460 | 336 | 488 | 1328 | 5566 | 29252 | 5037 | 2042 |
| 2623 | 75 | 104 | 89 | 117 | 884 | 10103 | 788 | 471 |
| 2624 | 517 | 384 | 549 | 1431 | 5603 | 29242 | 5070 | 2084 |
| 2625 | 85 | 109 | 87 | 122 | 939 | 10140 | 873 | 588 |
| 2626 | 469 | 344 | 499 | 1344 | 5562 | 29188 | 5036 | 2056 |
| 2627 | 68 | 96 | 81 | 109 | 897 | 10181 | 802 | 474 |
| 2628 | 515 | 384 | 549 | 1425 | 5575 | 29150 | 5039 | 2063 |
| 2629 | 85 | 109 | 84 | 118 | 954 | 10213 | 887 | 592 |
| 2630 | 479 | 353 | 511 | 1363 | 5552 | 29091 | 5028 | 2068 |
| 2631 | 63 | 89 | 74 | 103 | 921 | 10292 | 827 | 485 |
| 2632 | 512 | 382 | 547 | 1416 | 5546 | 29057 | 5009 | 2042 |
| 2633 | 84 | 108 | 82 | 114 | 978 | 10339 | 908 | 594 |
| 2634 | 488 | 361 | 523 | 1378 | 5537 | 28993 | 5016 | 2077 |
| 2635 | 58 | 83 | 67 | 98 | 946 | 10409 | 854 | 498 |
| 2636 | 509 | 381 | 546 | 1406 | 5512 | 28940 | 4975 | 2021 |
| 2637 | 82 | 106 | 78 | 110 | 1001 | 10471 | 927 | 591 |
| 2638 | 498 | 370 | 535 | 1392 | 5511 | 28846 | 4993 | 2079 |
| 2639 | 55 | 79 | 62 | 96 | 981 | 10551 | 891 | 519 |
| 2640 | 505 | 379 | 542 | 1392 | 5470 | 28790 | 4934 | 1998 |
| 2641 | 79 | 104 | 75 | 108 | 1031 | 10635 | 953 | 589 |
| 2642 | 507 | 379 | 546 | 1403 | 5479 | 28683 | 4964 | 2077 |
| 2643 | 53 | 76 | 58 | 96 | 1020 | 10706 | 932 | 543 |
| 2644 | 499 | 375 | 538 | 1377 | 5425 | 28619 | 4890 | 1976 |
| 2645 | 76 | 101 | 71 | 106 | 1064 | 10815 | 979 | 584 |
| 2646 | 515 | 387 | 556 | 1415 | 5447 | 28519 | 4935 | 2072 |
| 2647 | 53 | 75 | 55 | 97 | 1068 | 10884 | 981 | 572 |
| 2648 | 491 | 370 | 532 | 1358 | 5373 | 28417 | 4841 | 1953 |
| 2649 | 71 | 97 | 67 | 104 | 1101 | 11010 | 1009 | 580 |
| 2650 | 524 | 396 | 567 | 1424 | 5407 | 28320 | 4896 | 2061 |
| 2651 | 54 | 76 | 53 | 102 | 1127 | 11106 | 1041 | 605 |
| 2652 | 483 | 365 | 525 | 1337 | 5314 | 28190 | 4787 | 1930 |
| 2653 | 67 | 92 | 62 | 102 | 1140 | 11219 | 1041 | 576 |
| 2654 | 529 | 402 | 574 | 1426 | 5356 | 28100 | 4848 | 2042 |
| 2655 | 57 | 77 | 53 | 109 | 1185 | 11328 | 1101 | 638 |
| 2656 | 477 | 361 | 520 | 1321 | 5259 | 27961 | 4738 | 1915 |
| 2657 | 62 | 88 | 58 | 102 | 1188 | 11454 | 1082 | 580 |
| 2658 | 532 | 406 | 578 | 1422 | 5298 | 27853 | 4791 | 2018 |
| 2659 | 61 | 79 | 54 | 117 | 1251 | 11587 | 1166 | 670 |
| 2660 | 473 | 358 | 516 | 1307 | 5202 | 27718 | 4688 | 1904 |
| 2661 | 59 | 84 | 54 | 103 | 1240 | 11715 | 1128 | 586 |
| 2662 | 532 | 408 | 579 | 1411 | 5230 | 27587 | 4726 | 1987 |
| 2663 | 66 | 82 | 55 | 126 | 1317 | 11854 | 1230 | 701 |
| 2664 | 472 | 359 | 516 | 1299 | 5141 | 27444 | 4636 | 1896 |
| 2665 | 56 | 80 | 52 | 105 | 1300 | 11997 | 1183 | 599 |
| 2666 | 528 | 407 | 575 | 1393 | 5155 | 27305 | 4654 | 1951 |
| 2667 | 71 | 85 | 57 | 136 | 1387 | 12140 | 1296 | 729 |
| 2668 | 473 | 361 | 518 | 1293 | 5078 | 27147 | 4581 | 1889 |
| 2669 | 55 | 76 | 49 | 110 | 1365 | 12292 | 1242 | 616 |
| 2670 | 524 | 405 | 572 | 1376 | 5081 | 27014 | 4583 | 1917 |
| 2671 | 77 | 88 | 59 | 148 | 1460 | 12441 | 1364 | 756 |
| 2672 | 474 | 363 | 521 | 1287 | 5012 | 26834 | 4525 | 1882 |
| 2673 | 55 | 73 | 48 | 117 | 1437 | 12602 | 1310 | 639 |
| 2674 | 516 | 400 | 565 | 1353 | 4998 | 26695 | 4505 | 1878 |
| 2675 | 82 | 91 | 61 | 159 | 1539 | 12777 | 1438 | 781 |
| 2676 | 476 | 367 | 524 | 1281 | 4941 | 26502 | 4462 | 1872 |
| 2677 | 55 | 69 | 47 | 127 | 1513 | 12927 | 1381 | 666 |
| 2678 | 509 | 396 | 559 | 1330 | 4911 | 26355 | 4423 | 1840 |
| 2679 | 87 | 94 | 63 | 170 | 1618 | 13119 | 1509 | 802 |
| 2680 | 480 | 371 | 528 | 1276 | 4869 | 26171 | 4400 | 1862 |
| 2681 | 57 | 68 | 47 | 139 | 1593 | 13255 | 1458 | 699 |
| 2682 | 500 | 390 | 550 | 1303 | 4820 | 25999 | 4338 | 1801 |
| 2683 | 91 | 96 | 66 | 180 | 1697 | 13467 | 1579 | 818 |
| 2684 | 482 | 375 | 531 | 1269 | 4792 | 25817 | 4332 | 1848 |
| 2685 | 61 | 67 | 49 | 155 | 1688 | 13631 | 1550 | 742 |
| 2686 | 489 | 384 | 540 | 1273 | 4726 | 25631 | 4250 | 1762 |
| 2687 | 93 | 97 | 67 | 190 | 1777 | 13838 | 1648 | 831 |
| 2688 | 484 | 379 | 534 | 1261 | 4707 | 25439 | 4256 | 1828 |
| 2689 | 66 | 69 | 52 | 173 | 1785 | 14011 | 1643 | 787 |
| 2690 | 477 | 376 | 529 | 1240 | 4628 | 25255 | 4159 | 1723 |
| 2691 | 94 | 98 | 69 | 200 | 1859 | 14221 | 1718 | 842 |
| 2692 | 487 | 383 | 537 | 1252 | 4619 | 25056 | 4176 | 1804 |
| 2693 | 74 | 73 | 57 | 194 | 1884 | 14393 | 1739 | 835 |
| 2694 | 466 | 368 | 517 | 1209 | 4531 | 24868 | 4070 | 1687 |
| 2695 | 96 | 97 | 70 | 211 | 1946 | 14616 | 1792 | 854 |
| 2696 | 488 | 387 | 539 | 1242 | 4529 | 24659 | 4093 | 1776 |
| 2697 | 82 | 78 | 63 | 218 | 1991 | 14800 | 1842 | 885 |
| 2698 | 453 | 359 | 504 | 1173 | 4427 | 24453 | 3976 | 1650 |
| 2699 | 96 | 96 | 71 | 221 | 2036 | 15031 | 1871 | 869 |
| 2700 | 486 | 387 | 538 | 1225 | 4429 | 24243 | 3999 | 1741 |
| 2701 | 92 | 84 | 70 | 244 | 2098 | 15213 | 1944 | 935 |
| 2702 | 442 | 351 | 493 | 1143 | 4326 | 24038 | 3885 | 1620 |
| 2703 | 97 | 95 | 73 | 233 | 2127 | 15444 | 1951 | 886 |
| 2704 | 484 | 388 | 535 | 1208 | 4330 | 23835 | 3908 | 1704 |
| 2705 | 102 | 90 | 78 | 271 | 2208 | 15635 | 2047 | 982 |
| 2706 | 431 | 344 | 483 | 1113 | 4223 | 23601 | 3794 | 1592 |
| 2707 | 98 | 95 | 74 | 245 | 2220 | 15862 | 2033 | 906 |
| 2708 | 478 | 386 | 531 | 1184 | 4223 | 23398 | 3807 | 1660 |
| 2709 | 113 | 98 | 87 | 300 | 2321 | 16076 | 2153 | 1029 |
| 2710 | 423 | 340 | 474 | 1086 | 4120 | 23160 | 3704 | 1569 |
| 2711 | 100 | 94 | 76 | 260 | 2323 | 16308 | 2125 | 932 |
| 2712 | 470 | 381 | 523 | 1156 | 4114 | 22965 | 3705 | 1613 |
| 2713 | 125 | 105 | 97 | 328 | 2434 | 16518 | 2258 | 1073 |
| 2714 | 418 | 336 | 468 | 1064 | 4022 | 22725 | 3619 | 1550 |
| 2715 | 102 | 93 | 79 | 275 | 2423 | 16745 | 2216 | 959 |
| 2716 | 459 | 374 | 512 | 1123 | 3996 | 22506 | 3595 | 1562 |
| 2717 | 137 | 113 | 106 | 357 | 2548 | 16979 | 2362 | 1113 |
| 2718 | 414 | 335 | 463 | 1042 | 3916 | 22265 | 3526 | 1529 |
| 2719 | 106 | 93 | 83 | 296 | 2532 | 17212 | 2316 | 994 |
| 2720 | 448 | 367 | 501 | 1090 | 3878 | 22045 | 3486 | 1514 |
| 2721 | 148 | 120 | 115 | 383 | 2657 | 17431 | 2461 | 1147 |
| 2722 | 411 | 335 | 461 | 1023 | 3815 | 21815 | 3439 | 1510 |
| 2723 | 111 | 94 | 88 | 318 | 2643 | 17666 | 2419 | 1033 |
| 2724 | 435 | 358 | 487 | 1054 | 3760 | 21588 | 3376 | 1464 |
| 2725 | 158 | 128 | 124 | 408 | 2768 | 17896 | 2560 | 1179 |
| 2726 | 408 | 334 | 457 | 1002 | 3707 | 21343 | 3344 | 1486 |
| 2727 | 118 | 96 | 96 | 347 | 2760 | 18137 | 2529 | 1080 |
| 2728 | 422 | 350 | 474 | 1019 | 3641 | 21119 | 3266 | 1418 |
| 2729 | 166 | 133 | 131 | 431 | 2877 | 18366 | 2656 | 1206 |
| 2730 | 406 | 335 | 455 | 984 | 3603 | 20879 | 3251 | 1463 |
| 2731 | 128 | 100 | 104 | 378 | 2880 | 18598 | 2640 | 1132 |
| 2732 | 409 | 340 | 461 | 983 | 3524 | 20647 | 3158 | 1373 |
| 2733 | 173 | 138 | 138 | 453 | 2986 | 18836 | 2752 | 1230 |
| 2734 | 401 | 333 | 450 | 961 | 3492 | 20403 | 3152 | 1433 |
| 2735 | 139 | 106 | 115 | 413 | 3003 | 19073 | 2757 | 1187 |
| 2736 | 395 | 330 | 446 | 946 | 3406 | 20175 | 3050 | 1329 |
| 2737 | 179 | 141 | 144 | 474 | 3097 | 19318 | 2848 | 1252 |
| 2738 | 398 | 332 | 445 | 939 | 3383 | 19935 | 3053 | 1401 |
| 2739 | 152 | 114 | 127 | 451 | 3126 | 19534 | 2872 | 1242 |
| 2740 | 380 | 320 | 431 | 908 | 3288 | 19702 | 2943 | 1286 |
| 2741 | 184 | 143 | 150 | 494 | 3201 | 19787 | 2938 | 1270 |
| 2742 | 394 | 332 | 441 | 918 | 3272 | 19470 | 2952 | 1366 |
| 2743 | 167 | 123 | 140 | 492 | 3254 | 20018 | 2993 | 1301 |
| 2744 | 364 | 309 | 414 | 869 | 3168 | 19217 | 2834 | 1245 |
| 2745 | 188 | 145 | 156 | 514 | 3307 | 20254 | 3029 | 1291 |
| 2746 | 389 | 330 | 437 | 896 | 3161 | 18998 | 2850 | 1328 |
| 2747 | 182 | 134 | 156 | 536 | 3384 | 20497 | 3113 | 1359 |
| 2748 | 349 | 298 | 399 | 830 | 3054 | 18750 | 2731 | 1210 |
| 2749 | 192 | 147 | 161 | 531 | 3414 | 20725 | 3121 | 1311 |
| 2750 | 383 | 327 | 430 | 870 | 3044 | 18522 | 2741 | 1282 |
| 2751 | 198 | 145 | 171 | 579 | 3505 | 20958 | 3225 | 1410 |
| 2752 | 336 | 289 | 385 | 795 | 2942 | 18285 | 2633 | 1180 |
| 2753 | 195 | 148 | 165 | 548 | 3517 | 21182 | 3212 | 1333 |
| 2754 | 374 | 322 | 422 | 842 | 2926 | 18047 | 2631 | 1234 |
| 2755 | 216 | 156 | 188 | 625 | 3630 | 21426 | 3339 | 1461 |
| 2756 | 326 | 281 | 373 | 763 | 2834 | 17819 | 2539 | 1155 |
| 2757 | 199 | 150 | 171 | 570 | 3629 | 21660 | 3311 | 1363 |
| 2758 | 361 | 315 | 409 | 806 | 2805 | 17580 | 2518 | 1182 |
| 2759 | 232 | 168 | 205 | 666 | 3748 | 21887 | 3447 | 1506 |
| 2760 | 317 | 275 | 362 | 733 | 2723 | 17347 | 2442 | 1130 |
| 2761 | 204 | 152 | 177 | 592 | 3736 | 22118 | 3407 | 1394 |
| 2762 | 349 | 307 | 397 | 775 | 2694 | 17145 | 2414 | 1135 |
| 2763 | 248 | 180 | 220 | 708 | 3866 | 22351 | 3552 | 1548 |
| 2764 | 310 | 271 | 355 | 708 | 2621 | 16897 | 2353 | 1110 |
| 2765 | 209 | 154 | 184 | 618 | 3844 | 22563 | 3505 | 1428 |
| 2766 | 336 | 297 | 383 | 740 | 2577 | 16690 | 2307 | 1086 |
| 2767 | 263 | 190 | 236 | 746 | 3982 | 22814 | 3657 | 1585 |
| 2768 | 303 | 268 | 347 | 682 | 2516 | 16441 | 2262 | 1088 |
| 2769 | 216 | 157 | 193 | 648 | 3955 | 23014 | 3607 | 1468 |
| 2770 | 322 | 287 | 368 | 704 | 2461 | 16235 | 2199 | 1038 |
| 2771 | 277 | 200 | 249 | 780 | 4091 | 23259 | 3753 | 1617 |
| 2772 | 297 | 264 | 339 | 657 | 2416 | 16011 | 2176 | 1067 |
| 2773 | 225 | 162 | 204 | 682 | 4066 | 23451 | 3709 | 1512 |
| 2774 | 308 | 277 | 354 | 670 | 2350 | 15795 | 2097 | 994 |
| 2775 | 288 | 208 | 261 | 811 | 4194 | 23691 | 3843 | 1642 |
| 2776 | 293 | 262 | 334 | 635 | 2318 | 15580 | 2089 | 1044 |
| 2777 | 237 | 168 | 217 | 721 | 4179 | 23883 | 3815 | 1561 |
| 2778 | 293 | 267 | 339 | 635 | 2239 | 15361 | 1995 | 950 |
| 2779 | 297 | 214 | 271 | 837 | 4293 | 24115 | 3928 | 1662 |
| 2780 | 287 | 259 | 326 | 611 | 2218 | 15155 | 2002 | 1018 |
| 2781 | 251 | 177 | 233 | 765 | 4294 | 24303 | 3922 | 1615 |
| 2782 | 278 | 255 | 323 | 600 | 2136 | 14953 | 1902 | 911 |
| 2783 | 304 | 219 | 279 | 860 | 4386 | 24524 | 4008 | 1679 |
| 2784 | 280 | 256 | 319 | 586 | 2116 | 14724 | 1909 | 986 |
| 2785 | 268 | 188 | 250 | 810 | 4405 | 24711 | 4025 | 1667 |
| 2786 | 263 | 244 | 306 | 565 | 2033 | 14546 | 1809 | 874 |
| 2787 | 310 | 223 | 288 | 882 | 4482 | 24940 | 4089 | 1697 |
| 2788 | 275 | 254 | 313 | 564 | 2024 | 14339 | 1825 | 957 |
| 2789 | 285 | 199 | 268 | 857 | 4515 | 25108 | 4127 | 1718 |
| 2790 | 248 | 233 | 291 | 531 | 1934 | 14144 | 1720 | 841 |
| 2791 | 316 | 227 | 295 | 904 | 4573 | 25335 | 4166 | 1713 |
| 2792 | 267 | 250 | 305 | 539 | 1928 | 13955 | 1737 | 920 |
| 2793 | 303 | 213 | 288 | 906 | 4622 | 25496 | 4225 | 1768 |
| 2794 | 233 | 221 | 274 | 496 | 1837 | 13755 | 1634 | 812 |
| 2795 | 320 | 230 | 302 | 921 | 4656 | 25710 | 4237 | 1726 |
| 2796 | 259 | 245 | 296 | 516 | 1834 | 13588 | 1650 | 882 |
| 2797 | 321 | 226 | 308 | 954 | 4723 | 25869 | 4318 | 1813 |
| 2798 | 221 | 211 | 260 | 466 | 1749 | 13389 | 1557 | 790 |
| 2799 | 323 | 232 | 307 | 937 | 4736 | 26066 | 4306 | 1742 |
| 2800 | 250 | 239 | 286 | 491 | 1742 | 13229 | 1564 | 841 |
| 2801 | 341 | 240 | 329 | 1004 | 4824 | 26232 | 4409 | 1856 |
| 2802 | 209 | 203 | 247 | 437 | 1664 | 13030 | 1484 | 771 |
| 2803 | 327 | 234 | 313 | 955 | 4817 | 26418 | 4376 | 1760 |
| 2804 | 238 | 231 | 275 | 465 | 1651 | 12880 | 1477 | 798 |
| 2805 | 359 | 254 | 349 | 1051 | 4916 | 26570 | 4491 | 1892 |
| 2806 | 200 | 197 | 237 | 412 | 1589 | 12704 | 1420 | 759 |
| 2807 | 329 | 236 | 318 | 970 | 4890 | 26736 | 4441 | 1778 |
| 2808 | 226 | 222 | 261 | 436 | 1564 | 12561 | 1395 | 756 |
| 2809 | 377 | 267 | 368 | 1092 | 5001 | 26891 | 4565 | 1923 |
| 2810 | 193 | 192 | 228 | 390 | 1514 | 12367 | 1357 | 746 |
| 2811 | 334 | 238 | 325 | 992 | 4971 | 27060 | 4513 | 1804 |
| 2812 | 212 | 213 | 248 | 408 | 1480 | 12236 | 1316 | 715 |
| 2813 | 393 | 280 | 386 | 1130 | 5084 | 27205 | 4638 | 1949 |
| 2814 | 186 | 188 | 219 | 368 | 1447 | 12079 | 1301 | 736 |
| 2815 | 339 | 241 | 333 | 1015 | 5043 | 27354 | 4578 | 1830 |
| 2816 | 199 | 203 | 235 | 381 | 1402 | 11956 | 1244 | 680 |
| 2817 | 406 | 290 | 401 | 1160 | 5152 | 27491 | 4696 | 1966 |
| 2818 | 181 | 184 | 211 | 348 | 1380 | 11800 | 1245 | 725 |
| 2819 | 347 | 246 | 343 | 1043 | 5114 | 27629 | 4643 | 1861 |
| 2820 | 187 | 194 | 222 | 355 | 1327 | 11680 | 1175 | 647 |
| 2821 | 416 | 298 | 413 | 1185 | 5215 | 27759 | 4749 | 1978 |
| 2822 | 176 | 182 | 205 | 330 | 1318 | 11532 | 1192 | 712 |
| 2823 | 357 | 253 | 357 | 1077 | 5187 | 27890 | 4711 | 1897 |
| 2824 | 175 | 184 | 208 | 329 | 1258 | 11421 | 1112 | 617 |
| 2825 | 424 | 304 | 423 | 1206 | 5274 | 28017 | 4798 | 1987 |
| 2826 | 171 | 178 | 196 | 310 | 1259 | 11289 | 1141 | 698 |
| 2827 | 370 | 262 | 372 | 1111 | 5255 | 28129 | 4775 | 1934 |
| 2828 | 162 | 174 | 195 | 304 | 1195 | 11185 | 1055 | 592 |
| 2829 | 429 | 309 | 431 | 1223 | 5326 | 28248 | 4840 | 1991 |
| 2830 | 166 | 175 | 190 | 292 | 1205 | 11071 | 1094 | 683 |
| 2831 | 384 | 273 | 388 | 1148 | 5318 | 28342 | 4835 | 1970 |
| 2832 | 150 | 164 | 182 | 281 | 1138 | 10971 | 1005 | 571 |
| 2833 | 433 | 312 | 436 | 1236 | 5369 | 28453 | 4875 | 1991 |
| 2834 | 161 | 172 | 183 | 274 | 1154 | 10873 | 1049 | 665 |
| 2835 | 400 | 284 | 406 | 1186 | 5377 | 28533 | 4891 | 2005 |
| 2836 | 138 | 154 | 169 | 257 | 1085 | 10764 | 958 | 553 |
| 2837 | 436 | 315 | 443 | 1249 | 5412 | 28645 | 4908 | 1994 |
| 2838 | 156 | 169 | 177 | 259 | 1106 | 10685 | 1005 | 645 |
| 2839 | 417 | 297 | 426 | 1228 | 5439 | 28729 | 4948 | 2040 |
| 2840 | 127 | 144 | 156 | 236 | 1043 | 10597 | 924 | 544 |
| 2841 | 438 | 316 | 446 | 1254 | 5445 | 28806 | 4934 | 1991 |
| 2842 | 150 | 165 | 170 | 243 | 1063 | 10531 | 964 | 621 |
| 2843 | 433 | 310 | 444 | 1264 | 5486 | 28875 | 4990 | 2066 |
| 2844 | 117 | 136 | 144 | 215 | 1007 | 10453 | 896 | 539 |
| 2845 | 438 | 317 | 449 | 1259 | 5474 | 28949 | 4956 | 1991 |
| 2846 | 142 | 161 | 162 | 228 | 1019 | 10384 | 921 | 594 |
| 2847 | 449 | 323 | 464 | 1303 | 5532 | 29017 | 5032 | 2090 |
| 2848 | 109 | 129 | 134 | 198 | 977 | 10317 | 874 | 539 |
| 2849 | 438 | 317 | 451 | 1263 | 5501 | 29075 | 4977 | 1991 |
| 2850 | 133 | 154 | 153 | 212 | 983 | 10268 | 884 | 568 |
| 2851 | 466 | 336 | 482 | 1337 | 5567 | 29117 | 5061 | 2108 |
| 2852 | 103 | 124 | 125 | 182 | 955 | 10219 | 859 | 544 |
| 2853 | 437 | 317 | 451 | 1263 | 5518 | 29166 | 4990 | 1990 |
| 2854 | 124 | 147 | 143 | 195 | 952 | 10191 | 853 | 543 |
| 2855 | 479 | 347 | 498 | 1364 | 5594 | 29209 | 5083 | 2118 |
| 2856 | 99 | 121 | 119 | 170 | 935 | 10126 | 847 | 550 |
| 2857 | 436 | 316 | 453 | 1267 | 5535 | 29244 | 5005 | 1994 |
| 2858 | 114 | 139 | 134 | 180 | 923 | 10115 | 824 | 520 |
| 2859 | 492 | 358 | 513 | 1390 | 5618 | 29287 | 5101 | 2125 |
| 2860 | 95 | 118 | 112 | 160 | 923 | 10068 | 841 | 558 |
| 2861 | 437 | 317 | 456 | 1273 | 5544 | 29276 | 5013 | 2000 |
| 2862 | 104 | 131 | 123 | 164 | 902 | 10070 | 803 | 501 |
| 2863 | 502 | 368 | 525 | 1407 | 5629 | 29326 | 5108 | 2125 |
| 2864 | 93 | 117 | 107 | 150 | 919 | 10048 | 843 | 568 |
| 2865 | 439 | 319 | 461 | 1282 | 5555 | 29314 | 5024 | 2010 |
| 2866 | 96 | 124 | 115 | 151 | 885 | 10039 | 787 | 486 |
| 2867 | 508 | 374 | 533 | 1417 | 5631 | 29345 | 5106 | 2116 |
| 2868 | 92 | 115 | 103 | 143 | 917 | 10033 | 844 | 574 |
| 2869 | 445 | 323 | 469 | 1298 | 5566 | 29326 | 5036 | 2025 |
| 2870 | 88 | 116 | 105 | 138 | 875 | 10032 | 777 | 474 |
| 2871 | 512 | 378 | 539 | 1425 | 5628 | 29343 | 5098 | 2105 |
| 2872 | 91 | 114 | 98 | 136 | 919 | 10044 | 850 | 581 |
| 2873 | 453 | 330 | 479 | 1316 | 5573 | 29306 | 5044 | 2042 |
| 2874 | 80 | 109 | 97 | 127 | 877 | 10068 | 780 | 471 |
| 2875 | 511 | 378 | 541 | 1421 | 5610 | 29301 | 5078 | 2086 |
| 2876 | 90 | 114 | 95 | 130 | 926 | 10085 | 859 | 585 |
| 2877 | 462 | 338 | 491 | 1333 | 5571 | 29263 | 5046 | 2057 |
| 2878 | 73 | 101 | 88 | 118 | 881 | 10112 | 785 | 470 |
| 2879 | 511 | 379 | 542 | 1419 | 5595 | 29262 | 5059 | 2069 |
| 2880 | 89 | 113 | 91 | 124 | 934 | 10132 | 867 | 586 |
| 2881 | 473 | 347 | 504 | 1354 | 5569 | 29202 | 5046 | 2072 |
| 2882 | 67 | 94 | 80 | 110 | 892 | 10172 | 799 | 475 |
| 2883 | 509 | 379 | 542 | 1414 | 5573 | 29187 | 5036 | 2052 |
| 2884 | 87 | 112 | 87 | 119 | 951 | 10224 | 883 | 587 |
| 2885 | 483 | 356 | 516 | 1371 | 5558 | 29113 | 5038 | 2082 |
| 2886 | 62 | 87 | 73 | 103 | 913 | 10265 | 821 | 487 |
| 2887 | 506 | 377 | 540 | 1403 | 5539 | 29074 | 5001 | 2029 |
| 2888 | 85 | 110 | 84 | 114 | 969 | 10331 | 897 | 583 |
| 2889 | 494 | 366 | 529 | 1388 | 5543 | 29010 | 5024 | 2088 |
| 2890 | 58 | 83 | 67 | 99 | 940 | 10377 | 851 | 505 |
| 2891 | 502 | 375 | 537 | 1392 | 5507 | 28962 | 4968 | 2010 |
| 2892 | 82 | 108 | 80 | 110 | 989 | 10451 | 912 | 576 |
| 2893 | 504 | 375 | 541 | 1405 | 5523 | 28882 | 5006 | 2091 |
| 2894 | 55 | 79 | 62 | 97 | 976 | 10513 | 889 | 529 |
| 2895 | 497 | 372 | 534 | 1378 | 5468 | 28816 | 4930 | 1989 |
| 2896 | 78 | 104 | 76 | 107 | 1013 | 10590 | 930 | 568 |
| 2897 | 513 | 384 | 552 | 1416 | 5489 | 28710 | 4974 | 2084 |
| 2898 | 54 | 78 | 58 | 97 | 1014 | 10650 | 930 | 554 |
| 2899 | 490 | 367 | 528 | 1360 | 5416 | 28612 | 4882 | 1966 |
| 2900 | 73 | 100 | 71 | 104 | 1046 | 10765 | 957 | 563 |
| 2901 | 522 | 393 | 563 | 1428 | 5458 | 28550 | 4944 | 2076 |
| 2902 | 55 | 78 | 56 | 100 | 1067 | 10854 | 986 | 586 |
| 2903 | 484 | 363 | 523 | 1344 | 5376 | 28465 | 4846 | 1952 |
| 2904 | 68 | 95 | 66 | 101 | 1078 | 10950 | 984 | 559 |
| 2905 | 529 | 400 | 572 | 1434 | 5414 | 28349 | 4901 | 2061 |
| 2906 | 57 | 78 | 55 | 104 | 1111 | 11006 | 1032 | 613 |
| 2907 | 479 | 361 | 520 | 1335 | 5327 | 28219 | 4802 | 1939 |
| 2908 | 63 | 90 | 61 | 99 | 1126 | 11158 | 1026 | 563 |
| 2909 | 532 | 405 | 577 | 1430 | 5362 | 28115 | 4852 | 2039 |
| 2910 | 60 | 80 | 55 | 110 | 1179 | 11262 | 1099 | 647 |
| 2911 | 474 | 357 | 515 | 1317 | 5271 | 27993 | 4752 | 1926 |
| 2912 | 59 | 86 | 57 | 98 | 1170 | 11389 | 1063 | 566 |
| 2913 | 533 | 407 | 578 | 1422 | 5302 | 27881 | 4793 | 2010 |
| 2914 | 65 | 83 | 56 | 118 | 1237 | 11498 | 1155 | 674 |
| 2915 | 473 | 358 | 516 | 1311 | 5218 | 27752 | 4706 | 1920 |
| 2916 | 56 | 81 | 53 | 99 | 1220 | 11633 | 1108 | 574 |
| 2917 | 531 | 407 | 577 | 1410 | 5237 | 27624 | 4731 | 1979 |
| 2918 | 69 | 85 | 57 | 126 | 1305 | 11770 | 1220 | 702 |
| 2919 | 474 | 360 | 518 | 1306 | 5159 | 27475 | 4656 | 1915 |
| 2920 | 54 | 77 | 50 | 103 | 1282 | 11915 | 1166 | 590 |
| 2921 | 525 | 404 | 573 | 1389 | 5161 | 27341 | 4657 | 1942 |
| 2922 | 74 | 88 | 58 | 135 | 1372 | 12056 | 1283 | 727 |
| 2923 | 476 | 363 | 522 | 1302 | 5099 | 27193 | 4604 | 1909 |
| 2924 | 53 | 73 | 48 | 108 | 1345 | 12198 | 1224 | 609 |
| 2925 | 519 | 401 | 567 | 1369 | 5084 | 27048 | 4583 | 1905 |
| 2926 | 79 | 91 | 60 | 145 | 1442 | 12350 | 1347 | 749 |
| 2927 | 481 | 368 | 527 | 1301 | 5038 | 26892 | 4552 | 1905 |
| 2928 | 53 | 69 | 46 | 116 | 1418 | 12506 | 1294 | 636 |
| 2929 | 511 | 396 | 560 | 1347 | 5004 | 26730 | 4508 | 1870 |
| 2930 | 83 | 93 | 62 | 154 | 1518 | 12680 | 1417 | 769 |
| 2931 | 483 | 372 | 531 | 1296 | 4966 | 26563 | 4489 | 1893 |
| 2932 | 54 | 68 | 46 | 127 | 1498 | 12836 | 1371 | 670 |
| 2933 | 503 | 391 | 552 | 1321 | 4916 | 26396 | 4426 | 1832 |
| 2934 | 86 | 95 | 63 | 163 | 1591 | 13013 | 1481 | 783 |
| 2935 | 487 | 377 | 535 | 1291 | 4894 | 26235 | 4426 | 1881 |
| 2936 | 57 | 67 | 47 | 140 | 1582 | 13169 | 1452 | 708 |
| 2937 | 494 | 386 | 544 | 1295 | 4829 | 26052 | 4345 | 1796 |
| 2938 | 88 | 96 | 64 | 172 | 1666 | 13355 | 1546 | 795 |
| 2939 | 490 | 381 | 539 | 1286 | 4818 | 25883 | 4357 | 1864 |
| 2940 | 62 | 68 | 50 | 157 | 1676 | 13533 | 1544 | 753 |
| 2941 | 483 | 378 | 533 | 1264 | 4737 | 25687 | 4259 | 1759 |
| 2942 | 89 | 95 | 65 | 181 | 1746 | 13727 | 1615 | 806 |
| 2943 | 492 | 385 | 541 | 1277 | 4731 | 25502 | 4277 | 1839 |
| 2944 | 68 | 71 | 53 | 176 | 1773 | 13905 | 1637 | 800 |
| 2945 | 471 | 370 | 522 | 1232 | 4641 | 25312 | 4170 | 1722 |
| 2946 | 89 | 95 | 66 | 190 | 1829 | 14109 | 1685 | 816 |
| 2947 | 493 | 388 | 544 | 1267 | 4642 | 25119 | 4195 | 1811 |
| 2948 | 76 | 75 | 58 | 197 | 1871 | 14280 | 1731 | 846 |
| 2949 | 459 | 362 | 510 | 1199 | 4543 | 24918 | 4081 | 1688 |
| 2950 | 90 | 93 | 66 | 200 | 1914 | 14504 | 1759 | 829 |
| 2951 | 494 | 392 | 546 | 1257 | 4553 | 24737 | 4112 | 1781 |
| 2952 | 85 | 81 | 65 | 221 | 1977 | 14687 | 1833 | 895 |
| 2953 | 448 | 354 | 499 | 1169 | 4443 | 24508 | 3992 | 1657 |
| 2954 | 90 | 92 | 67 | 210 | 2002 | 14910 | 1837 | 845 |
| 2955 | 492 | 392 | 544 | 1238 | 4453 | 24328 | 4019 | 1742 |
| 2956 | 95 | 87 | 72 | 247 | 2085 | 15106 | 1935 | 942 |
| 2957 | 438 | 347 | 489 | 1139 | 4343 | 24092 | 3904 | 1631 |
| 2958 | 91 | 91 | 68 | 220 | 2093 | 15321 | 1917 | 863 |
| 2959 | 487 | 390 | 539 | 1215 | 4349 | 23913 | 3922 | 1699 |
| 2960 | 106 | 94 | 80 | 273 | 2192 | 15526 | 2035 | 986 |
| 2961 | 432 | 344 | 482 | 1117 | 4248 | 23671 | 3821 | 1611 |
| 2962 | 92 | 90 | 70 | 234 | 2190 | 15742 | 2004 | 887 |
| 2963 | 480 | 386 | 532 | 1189 | 4244 | 23480 | 3823 | 1655 |
| 2964 | 117 | 101 | 89 | 300 | 2305 | 15961 | 2141 | 1030 |
| 2965 | 426 | 341 | 477 | 1094 | 4148 | 23230 | 3734 | 1590 |
| 2966 | 94 | 89 | 72 | 250 | 2293 | 16186 | 2098 | 916 |
| 2967 | 469 | 380 | 521 | 1156 | 4128 | 23033 | 3715 | 1605 |
| 2968 | 128 | 109 | 98 | 327 | 2414 | 16408 | 2241 | 1069 |
| 2969 | 423 | 340 | 472 | 1073 | 4048 | 22789 | 3646 | 1571 |
| 2970 | 97 | 89 | 76 | 268 | 2396 | 16626 | 2192 | 949 |
| 2971 | 458 | 372 | 510 | 1124 | 4015 | 22593 | 3609 | 1557 |
| 2972 | 138 | 116 | 106 | 351 | 2521 | 16850 | 2337 | 1102 |
| 2973 | 420 | 340 | 470 | 1056 | 3947 | 22337 | 3558 | 1552 |
| 2974 | 102 | 89 | 80 | 291 | 2508 | 17086 | 2296 | 989 |
| 2975 | 445 | 364 | 498 | 1090 | 3897 | 22128 | 3500 | 1509 |
| 2976 | 148 | 121 | 113 | 376 | 2634 | 17322 | 2439 | 1135 |
| 2977 | 417 | 339 | 467 | 1035 | 3843 | 21878 | 3466 | 1529 |
| 2978 | 109 | 91 | 87 | 317 | 2620 | 17538 | 2401 | 1034 |
| 2979 | 433 | 356 | 485 | 1055 | 3782 | 21675 | 3393 | 1463 |
| 2980 | 156 | 127 | 121 | 397 | 2740 | 17778 | 2532 | 1160 |
| 2981 | 414 | 339 | 464 | 1016 | 3738 | 21421 | 3373 | 1504 |
| 2982 | 117 | 94 | 95 | 345 | 2735 | 17990 | 2508 | 1082 |
| 2983 | 420 | 347 | 472 | 1020 | 3665 | 21208 | 3286 | 1418 |
| 2984 | 162 | 131 | 127 | 418 | 2848 | 18249 | 2627 | 1184 |
| 2985 | 412 | 340 | 461 | 996 | 3631 | 20956 | 3278 | 1477 |
| 2986 | 129 | 100 | 105 | 381 | 2861 | 18465 | 2627 | 1140 |
| 2987 | 406 | 338 | 458 | 984 | 3547 | 20732 | 3178 | 1375 |
| 2988 | 167 | 134 | 133 | 438 | 2955 | 18721 | 2720 | 1204 |
| 2989 | 409 | 339 | 457 | 975 | 3521 | 20486 | 3179 | 1446 |
| 2990 | 142 | 108 | 117 | 417 | 2985 | 18938 | 2745 | 1197 |
| 2991 | 390 | 326 | 441 | 942 | 3426 | 20259 | 3068 | 1330 |
| 2992 | 171 | 136 | 138 | 455 | 3059 | 19190 | 2809 | 1222 |
| 2993 | 405 | 339 | 454 | 955 | 3410 | 20016 | 3077 | 1411 |
| 2994 | 156 | 117 | 130 | 457 | 3111 | 19412 | 2863 | 1254 |
| 2995 | 376 | 316 | 427 | 906 | 3312 | 19785 | 2964 | 1292 |
| 2996 | 175 | 137 | 143 | 475 | 3167 | 19663 | 2902 | 1242 |
| 2997 | 401 | 338 | 449 | 933 | 3298 | 19541 | 2974 | 1371 |
| 2998 | 171 | 126 | 144 | 499 | 3240 | 19891 | 2984 | 1311 |
| 2999 | 361 | 305 | 411 | 866 | 3193 | 19303 | 2858 | 1255 |
| 3000 | 179 | 139 | 148 | 492 | 3275 | 20143 | 2996 | 1264 |
| 3001 | 395 | 335 | 443 | 908 | 3181 | 19066 | 2865 | 1326 |
| 3002 | 187 | 137 | 158 | 541 | 3363 | 20361 | 3098 | 1363 |
| 3003 | 348 | 296 | 397 | 832 | 3080 | 18827 | 2758 | 1224 |
| 3004 | 182 | 141 | 153 | 512 | 3382 | 20608 | 3090 | 1288 |
| 3005 | 386 | 331 | 435 | 879 | 3065 | 18600 | 2757 | 1279 |
| 3006 | 203 | 148 | 174 | 584 | 3486 | 20826 | 3210 | 1412 |
| 3007 | 338 | 289 | 386 | 799 | 2969 | 18358 | 2661 | 1198 |
| 3008 | 187 | 142 | 158 | 531 | 3488 | 21075 | 3185 | 1315 |
| 3009 | 374 | 323 | 423 | 845 | 2940 | 18107 | 2641 | 1227 |
| 3010 | 220 | 160 | 191 | 628 | 3610 | 21304 | 3323 | 1460 |
| 3011 | 329 | 283 | 376 | 770 | 2859 | 17881 | 2565 | 1174 |
| 3012 | 191 | 144 | 164 | 553 | 3599 | 21547 | 3285 | 1347 |
| 3013 | 362 | 315 | 410 | 812 | 2829 | 17688 | 2537 | 1179 |
| 3014 | 235 | 171 | 206 | 666 | 3729 | 21785 | 3431 | 1503 |
| 3015 | 321 | 279 | 367 | 743 | 2752 | 17433 | 2473 | 1152 |
| 3016 | 196 | 146 | 170 | 578 | 3707 | 22010 | 3382 | 1381 |
| 3017 | 348 | 306 | 397 | 777 | 2711 | 17236 | 2427 | 1129 |
| 3018 | 250 | 181 | 220 | 704 | 3843 | 22250 | 3532 | 1539 |
| 3019 | 316 | 275 | 360 | 719 | 2650 | 16994 | 2384 | 1132 |
| 3020 | 203 | 148 | 179 | 608 | 3820 | 22477 | 3485 | 1421 |
| 3021 | 334 | 295 | 382 | 742 | 2593 | 16776 | 2319 | 1081 |
| 3022 | 264 | 191 | 235 | 739 | 3956 | 22711 | 3633 | 1573 |
| 3023 | 310 | 273 | 353 | 694 | 2547 | 16549 | 2295 | 1110 |
| 3024 | 212 | 153 | 190 | 642 | 3932 | 22917 | 3590 | 1467 |
| 3025 | 320 | 285 | 367 | 705 | 2477 | 16328 | 2213 | 1034 |
| 3026 | 275 | 199 | 246 | 768 | 4059 | 23154 | 3723 | 1598 |
| 3027 | 305 | 271 | 347 | 671 | 2447 | 16115 | 2206 | 1086 |
| 3028 | 224 | 159 | 203 | 681 | 4047 | 23358 | 3696 | 1517 |
| 3029 | 307 | 276 | 353 | 673 | 2368 | 15891 | 2113 | 993 |
| 3030 | 284 | 205 | 256 | 796 | 4161 | 23585 | 3811 | 1619 |
| 3031 | 299 | 267 | 340 | 647 | 2343 | 15665 | 2114 | 1058 |
| 3032 | 238 | 169 | 219 | 725 | 4162 | 23775 | 3804 | 1571 |
| 3033 | 291 | 264 | 337 | 637 | 2260 | 15457 | 2014 | 952 |
| 3034 | 290 | 209 | 264 | 818 | 4256 | 23997 | 3892 | 1637 |
| 3035 | 293 | 264 | 333 | 623 | 2243 | 15240 | 2024 | 1028 |
| 3036 | 255 | 179 | 236 | 770 | 4276 | 24188 | 3911 | 1625 |
| 3037 | 277 | 253 | 322 | 602 | 2156 | 15035 | 1920 | 916 |
| 3038 | 296 | 214 | 271 | 840 | 4352 | 24409 | 3974 | 1654 |
| 3039 | 288 | 263 | 327 | 601 | 2149 | 14842 | 1939 | 998 |
| 3040 | 271 | 191 | 253 | 816 | 4390 | 24599 | 4016 | 1677 |
| 3041 | 261 | 242 | 305 | 566 | 2053 | 14618 | 1827 | 881 |
| 3042 | 301 | 217 | 279 | 862 | 4450 | 24836 | 4058 | 1673 |
| 3043 | 280 | 258 | 319 | 576 | 2050 | 14447 | 1847 | 961 |
| 3044 | 290 | 203 | 272 | 865 | 4503 | 25016 | 4120 | 1729 |
| 3045 | 247 | 231 | 289 | 532 | 1957 | 14235 | 1742 | 851 |
| 3046 | 306 | 220 | 285 | 878 | 4535 | 25227 | 4130 | 1686 |
| 3047 | 273 | 254 | 311 | 552 | 1952 | 14065 | 1757 | 921 |
| 3048 | 308 | 217 | 292 | 914 | 4608 | 25404 | 4216 | 1775 |
| 3049 | 233 | 220 | 274 | 499 | 1862 | 13847 | 1659 | 827 |
| 3050 | 309 | 222 | 290 | 894 | 4617 | 25594 | 4200 | 1701 |
| 3051 | 264 | 248 | 301 | 527 | 1857 | 13693 | 1667 | 880 |
| 3052 | 327 | 230 | 313 | 963 | 4711 | 25784 | 4309 | 1819 |
| 3053 | 221 | 212 | 261 | 469 | 1774 | 13481 | 1583 | 807 |
| 3054 | 312 | 224 | 295 | 910 | 4700 | 25960 | 4272 | 1719 |
| 3055 | 252 | 241 | 290 | 500 | 1761 | 13323 | 1577 | 835 |
| 3056 | 346 | 245 | 333 | 1012 | 4810 | 26145 | 4397 | 1858 |
| 3057 | 213 | 206 | 251 | 445 | 1695 | 13132 | 1516 | 794 |
| 3058 | 315 | 226 | 301 | 930 | 4783 | 26312 | 4346 | 1742 |
| 3059 | 239 | 232 | 276 | 470 | 1669 | 12976 | 1490 | 792 |
| 3060 | 364 | 257 | 352 | 1052 | 4897 | 26474 | 4474 | 1889 |
| 3061 | 205 | 201 | 242 | 421 | 1618 | 12794 | 1450 | 781 |
| 3062 | 320 | 228 | 308 | 952 | 4866 | 26651 | 4419 | 1768 |
| 3063 | 226 | 223 | 264 | 443 | 1583 | 12649 | 1409 | 752 |
| 3064 | 379 | 269 | 369 | 1090 | 4980 | 26801 | 4547 | 1915 |
| 3065 | 199 | 197 | 233 | 399 | 1543 | 12472 | 1387 | 768 |
| 3066 | 325 | 231 | 317 | 976 | 4943 | 26963 | 4489 | 1796 |
| 3067 | 213 | 213 | 250 | 414 | 1498 | 12326 | 1330 | 713 |
| 3068 | 393 | 280 | 385 | 1124 | 5062 | 27122 | 4617 | 1938 |
| 3069 | 193 | 193 | 225 | 379 | 1473 | 12162 | 1328 | 756 |
| 3070 | 334 | 236 | 328 | 1006 | 5023 | 27261 | 4563 | 1831 |
| 3071 | 200 | 203 | 236 | 386 | 1422 | 12045 | 1260 | 680 |
| 3072 | 403 | 288 | 396 | 1148 | 5130 | 27417 | 4674 | 1951 |
| 3073 | 188 | 190 | 217 | 358 | 1406 | 11881 | 1270 | 742 |
| 3074 | 344 | 243 | 341 | 1038 | 5096 | 27529 | 4631 | 1866 |
| 3075 | 188 | 194 | 223 | 360 | 1347 | 11766 | 1192 | 650 |
| 3076 | 411 | 295 | 407 | 1171 | 5194 | 27694 | 4727 | 1962 |
| 3077 | 183 | 187 | 210 | 338 | 1341 | 11613 | 1214 | 726 |
| 3078 | 358 | 253 | 357 | 1077 | 5174 | 27807 | 4704 | 1907 |
| 3079 | 175 | 183 | 209 | 334 | 1275 | 11490 | 1127 | 621 |
| 3080 | 417 | 299 | 415 | 1190 | 5251 | 27946 | 4774 | 1967 |
| 3081 | 178 | 184 | 204 | 320 | 1283 | 11371 | 1163 | 710 |
| 3082 | 372 | 263 | 374 | 1115 | 5245 | 28047 | 4770 | 1946 |
| 3083 | 162 | 173 | 195 | 308 | 1215 | 11263 | 1073 | 598 |
| 3084 | 421 | 303 | 421 | 1202 | 5298 | 28166 | 4811 | 1969 |
| 3085 | 173 | 181 | 197 | 302 | 1225 | 11143 | 1110 | 689 |
| 3086 | 389 | 276 | 392 | 1157 | 5314 | 28280 | 4835 | 1984 |
| 3087 | 150 | 163 | 182 | 285 | 1158 | 11038 | 1023 | 580 |
| 3088 | 424 | 305 | 426 | 1215 | 5347 | 28390 | 4851 | 1972 |
| 3089 | 167 | 178 | 190 | 286 | 1170 | 10927 | 1060 | 666 |
| 3090 | 405 | 288 | 411 | 1198 | 5378 | 28485 | 4894 | 2019 |
| 3091 | 139 | 153 | 169 | 262 | 1109 | 10844 | 982 | 568 |
| 3092 | 425 | 306 | 430 | 1222 | 5383 | 28565 | 4880 | 1971 |
| 3093 | 160 | 174 | 183 | 268 | 1115 | 10719 | 1008 | 639 |
| 3094 | 422 | 301 | 430 | 1237 | 5428 | 28635 | 4939 | 2047 |
| 3095 | 128 | 145 | 157 | 240 | 1061 | 10634 | 943 | 559 |
| 3096 | 427 | 308 | 434 | 1230 | 5423 | 28734 | 4913 | 1974 |
| 3097 | 153 | 169 | 175 | 252 | 1075 | 10575 | 969 | 614 |
| 3098 | 439 | 314 | 449 | 1276 | 5485 | 28822 | 4991 | 2074 |
| 3099 | 119 | 138 | 146 | 220 | 1029 | 10502 | 919 | 559 |
| 3100 | 427 | 309 | 437 | 1235 | 5458 | 28908 | 4941 | 1977 |
| 3101 | 144 | 162 | 166 | 235 | 1031 | 10440 | 925 | 585 |
| 3102 | 455 | 327 | 468 | 1312 | 5528 | 28966 | 5028 | 2094 |
| 3103 | 112 | 133 | 137 | 204 | 996 | 10359 | 894 | 559 |
| 3104 | 427 | 309 | 438 | 1239 | 5484 | 29033 | 4962 | 1979 |
| 3105 | 134 | 155 | 156 | 217 | 991 | 10316 | 886 | 557 |
| 3106 | 470 | 339 | 486 | 1344 | 5566 | 29094 | 5060 | 2109 |
| 3107 | 108 | 129 | 130 | 190 | 973 | 10249 | 879 | 564 |
| 3108 | 426 | 309 | 440 | 1243 | 5505 | 29129 | 4980 | 1984 |
| 3109 | 123 | 147 | 145 | 199 | 955 | 10212 | 851 | 532 |
| 3110 | 483 | 350 | 501 | 1370 | 5594 | 29191 | 5082 | 2117 |
| 3111 | 104 | 126 | 123 | 177 | 954 | 10169 | 867 | 570 |
| 3112 | 428 | 309 | 444 | 1252 | 5527 | 29217 | 5000 | 1994 |
| 3113 | 113 | 139 | 135 | 183 | 925 | 10130 | 822 | 510 |
| 3114 | 494 | 360 | 514 | 1390 | 5612 | 29264 | 5095 | 2119 |
| 3115 | 101 | 124 | 118 | 166 | 940 | 10104 | 859 | 575 |
| 3116 | 432 | 312 | 450 | 1265 | 5546 | 29280 | 5018 | 2008 |
| 3117 | 104 | 131 | 125 | 167 | 900 | 10064 | 798 | 493 |
| 3118 | 500 | 366 | 522 | 1401 | 5618 | 29292 | 5095 | 2112 |
| 3119 | 100 | 122 | 112 | 157 | 930 | 10060 | 854 | 580 |
| 3120 | 438 | 317 | 459 | 1283 | 5564 | 29320 | 5036 | 2025 |
| 3121 | 96 | 123 | 115 | 154 | 885 | 10039 | 784 | 481 |
| 3122 | 504 | 370 | 528 | 1409 | 5625 | 29339 | 5098 | 2104 |
| 3123 | 98 | 121 | 108 | 149 | 924 | 10037 | 852 | 583 |
| 3124 | 447 | 324 | 470 | 1304 | 5577 | 29334 | 5050 | 2044 |
| 3125 | 88 | 115 | 106 | 141 | 876 | 10031 | 777 | 473 |
| 3126 | 506 | 372 | 532 | 1412 | 5621 | 29344 | 5090 | 2091 |
| 3127 | 96 | 119 | 103 | 141 | 922 | 10038 | 852 | 584 |
| 3128 | 457 | 333 | 483 | 1326 | 5587 | 29327 | 5062 | 2064 |
| 3129 | 80 | 107 | 97 | 130 | 874 | 10042 | 777 | 471 |
| 3130 | 505 | 373 | 533 | 1410 | 5612 | 29328 | 5077 | 2076 |
| 3131 | 95 | 118 | 100 | 134 | 926 | 10066 | 857 | 584 |
| 3132 | 468 | 342 | 496 | 1346 | 5589 | 29288 | 5066 | 2079 |
| 3133 | 73 | 100 | 89 | 121 | 879 | 10078 | 785 | 474 |
| 3134 | 504 | 373 | 534 | 1407 | 5597 | 29285 | 5059 | 2060 |
| 3135 | 93 | 117 | 96 | 127 | 933 | 10122 | 864 | 581 |
| 3136 | 479 | 352 | 509 | 1366 | 5588 | 29239 | 5066 | 2092 |
| 3137 | 67 | 93 | 81 | 112 | 889 | 10127 | 797 | 482 |
| 3138 | 502 | 372 | 533 | 1400 | 5576 | 29220 | 5036 | 2042 |
| 3139 | 90 | 115 | 92 | 121 | 944 | 10194 | 871 | 575 |
| 3140 | 491 | 362 | 523 | 1387 | 5583 | 29172 | 5062 | 2101 |
| 3141 | 62 | 87 | 74 | 106 | 908 | 10206 | 820 | 497 |
| 3142 | 497 | 370 | 530 | 1388 | 5546 | 29121 | 5005 | 2021 |
| 3143 | 86 | 112 | 87 | 116 | 956 | 10285 | 879 | 565 |
| 3144 | 501 | 371 | 535 | 1403 | 5563 | 29057 | 5044 | 2102 |
| 3145 | 59 | 84 | 68 | 101 | 934 | 10307 | 849 | 517 |
| 3146 | 493 | 367 | 527 | 1376 | 5515 | 29013 | 4974 | 2003 |
| 3147 | 82 | 108 | 82 | 111 | 972 | 10389 | 890 | 554 |
| 3148 | 512 | 381 | 549 | 1423 | 5550 | 28959 | 5030 | 2104 |
| 3149 | 57 | 82 | 64 | 99 | 971 | 10439 | 889 | 543 |
| 3150 | 486 | 363 | 522 | 1359 | 5474 | 28867 | 4936 | 1983 |
| 3151 | 76 | 103 | 77 | 106 | 989 | 10508 | 902 | 544 |
| 3152 | 521 | 390 | 560 | 1435 | 5517 | 28794 | 4999 | 2096 |
| 3153 | 58 | 82 | 61 | 101 | 1012 | 10590 | 934 | 571 |
| 3154 | 481 | 360 | 518 | 1347 | 5441 | 28735 | 4906 | 1972 |
| 3155 | 70 | 98 | 71 | 101 | 1022 | 10690 | 930 | 541 |
| 3156 | 529 | 398 | 569 | 1441 | 5484 | 28648 | 4966 | 2084 |
| 3157 | 59 | 82 | 59 | 102 | 1054 | 10753 | 977 | 596 |
| 3158 | 476 | 356 | 514 | 1336 | 5398 | 28558 | 4867 | 1959 |
| 3159 | 65 | 93 | 66 | 98 | 1057 | 10877 | 959 | 540 |
| 3160 | 533 | 403 | 575 | 1442 | 5439 | 28465 | 4923 | 2064 |
| 3161 | 61 | 83 | 58 | 106 | 1101 | 10942 | 1025 | 621 |
| 3162 | 474 | 355 | 514 | 1328 | 5351 | 28355 | 4826 | 1951 |
| 3163 | 60 | 88 | 61 | 96 | 1095 | 11078 | 993 | 542 |
| 3164 | 535 | 407 | 579 | 1437 | 5390 | 28269 | 4875 | 2040 |
| 3165 | 64 | 84 | 58 | 111 | 1154 | 11157 | 1078 | 647 |
| 3166 | 473 | 356 | 515 | 1322 | 5302 | 28128 | 4784 | 1945 |
| 3167 | 56 | 84 | 57 | 95 | 1139 | 11295 | 1033 | 549 |
| 3168 | 533 | 407 | 578 | 1425 | 5331 | 28044 | 4817 | 2010 |
| 3169 | 68 | 86 | 58 | 117 | 1211 | 11386 | 1132 | 671 |
| 3170 | 476 | 359 | 518 | 1322 | 5254 | 27890 | 4744 | 1944 |
| 3171 | 53 | 78 | 53 | 97 | 1188 | 11521 | 1078 | 560 |
| 3172 | 529 | 404 | 574 | 1410 | 5267 | 27795 | 4755 | 1977 |
| 3173 | 72 | 89 | 59 | 124 | 1275 | 11650 | 1193 | 696 |
| 3174 | 479 | 362 | 522 | 1320 | 5204 | 27647 | 4701 | 1943 |
| 3175 | 51 | 74 | 49 | 100 | 1247 | 11784 | 1133 | 578 |
| 3176 | 522 | 401 | 569 | 1389 | 5193 | 27516 | 4684 | 1940 |
| 3177 | 76 | 91 | 60 | 132 | 1338 | 11921 | 1251 | 715 |
| 3178 | 483 | 368 | 528 | 1320 | 5147 | 27374 | 4653 | 1939 |
| 3179 | 51 | 70 | 47 | 105 | 1313 | 12072 | 1197 | 602 |
| 3180 | 515 | 397 | 563 | 1367 | 5117 | 27233 | 4611 | 1905 |
| 3181 | 79 | 93 | 61 | 137 | 1400 | 12205 | 1307 | 729 |
| 3182 | 488 | 373 | 534 | 1319 | 5085 | 27081 | 4598 | 1931 |
| 3183 | 52 | 68 | 46 | 114 | 1384 | 12366 | 1266 | 633 |
| 3184 | 508 | 392 | 556 | 1345 | 5042 | 26943 | 4541 | 1871 |
| 3185 | 82 | 94 | 61 | 145 | 1467 | 12513 | 1366 | 741 |
| 3186 | 492 | 378 | 539 | 1317 | 5016 | 26762 | 4537 | 1919 |
| 3187 | 54 | 67 | 46 | 125 | 1463 | 12678 | 1342 | 669 |
| 3188 | 499 | 386 | 548 | 1320 | 4959 | 26624 | 4463 | 1836 |
| 3189 | 83 | 94 | 62 | 152 | 1539 | 12842 | 1428 | 752 |
| 3190 | 495 | 382 | 543 | 1312 | 4944 | 26436 | 4471 | 1902 |
| 3191 | 58 | 67 | 47 | 138 | 1544 | 12999 | 1422 | 709 |
| 3192 | 489 | 380 | 538 | 1291 | 4873 | 26286 | 4382 | 1800 |
| 3193 | 83 | 94 | 62 | 160 | 1612 | 13186 | 1491 | 760 |
| 3194 | 499 | 388 | 548 | 1309 | 4870 | 26102 | 4404 | 1884 |
| 3195 | 63 | 69 | 50 | 155 | 1631 | 13328 | 1506 | 752 |
| 3196 | 478 | 372 | 528 | 1263 | 4784 | 25927 | 4302 | 1767 |
| 3197 | 83 | 92 | 62 | 168 | 1690 | 13539 | 1558 | 771 |
| 3198 | 502 | 393 | 552 | 1303 | 4791 | 25747 | 4332 | 1861 |
| 3199 | 69 | 73 | 54 | 174 | 1735 | 13718 | 1607 | 802 |
| 3200 | 466 | 364 | 515 | 1229 | 4688 | 25549 | 4213 | 1732 |
| 3201 | 83 | 91 | 62 | 175 | 1767 | 13907 | 1624 | 780 |
| 3202 | 503 | 395 | 554 | 1291 | 4702 | 25373 | 4249 | 1829 |
| 3203 | 78 | 78 | 59 | 196 | 1832 | 14099 | 1700 | 848 |
| 3204 | 455 | 357 | 505 | 1200 | 4595 | 25173 | 4130 | 1704 |
| 3205 | 82 | 89 | 62 | 183 | 1849 | 14289 | 1695 | 793 |
| 3206 | 502 | 397 | 553 | 1276 | 4607 | 24982 | 4159 | 1793 |
| 3207 | 86 | 84 | 65 | 219 | 1933 | 14490 | 1796 | 892 |
| 3208 | 447 | 352 | 497 | 1175 | 4504 | 24783 | 4050 | 1682 |
| 3209 | 82 | 87 | 62 | 193 | 1936 | 14684 | 1772 | 811 |
| 3210 | 498 | 396 | 550 | 1255 | 4508 | 24578 | 4066 | 1752 |
| 3211 | 96 | 89 | 73 | 242 | 2036 | 14891 | 1893 | 935 |
| 3212 | 440 | 348 | 491 | 1152 | 4409 | 24373 | 3967 | 1661 |
| 3213 | 83 | 86 | 63 | 205 | 2030 | 15099 | 1857 | 834 |
| 3214 | 489 | 392 | 542 | 1227 | 4402 | 24169 | 3967 | 1707 |
| 3215 | 106 | 96 | 80 | 265 | 2137 | 15299 | 1986 | 973 |
| 3216 | 436 | 346 | 486 | 1132 | 4313 | 23952 | 3884 | 1643 |
| 3217 | 84 | 85 | 65 | 219 | 2124 | 15515 | 1942 | 860 |
| 3218 | 481 | 386 | 533 | 1198 | 4296 | 23756 | 3868 | 1661 |
| 3219 | 116 | 102 | 87 | 289 | 2242 | 15728 | 2083 | 1011 |
| 3220 | 434 | 346 | 484 | 1116 | 4217 | 23517 | 3799 | 1625 |
| 3221 | 87 | 84 | 67 | 236 | 2224 | 15935 | 2034 | 892 |
| 3222 | 470 | 379 | 522 | 1167 | 4185 | 23319 | 3764 | 1614 |
| 3223 | 126 | 109 | 95 | 313 | 2352 | 16180 | 2184 | 1047 |
| 3224 | 431 | 346 | 481 | 1096 | 4116 | 23074 | 3712 | 1605 |
| 3225 | 92 | 84 | 72 | 256 | 2332 | 16385 | 2134 | 930 |
| 3226 | 458 | 371 | 510 | 1133 | 4069 | 22869 | 3657 | 1566 |
| 3227 | 135 | 115 | 102 | 335 | 2457 | 16626 | 2278 | 1076 |
| 3228 | 430 | 346 | 480 | 1080 | 4019 | 22641 | 3626 | 1586 |
| 3229 | 98 | 85 | 77 | 280 | 2440 | 16825 | 2236 | 973 |
| 3230 | 446 | 363 | 499 | 1100 | 3956 | 22418 | 3553 | 1521 |
| 3231 | 142 | 120 | 108 | 356 | 2562 | 17073 | 2372 | 1103 |
| 3232 | 428 | 348 | 478 | 1062 | 3918 | 22191 | 3537 | 1564 |
| 3233 | 106 | 88 | 84 | 308 | 2558 | 17284 | 2348 | 1025 |
| 3234 | 433 | 354 | 485 | 1064 | 3838 | 21951 | 3444 | 1475 |
| 3235 | 149 | 123 | 114 | 375 | 2668 | 17537 | 2464 | 1125 |
| 3236 | 425 | 347 | 475 | 1042 | 3811 | 21728 | 3441 | 1536 |
| 3237 | 116 | 93 | 94 | 340 | 2677 | 17742 | 2460 | 1078 |
| 3238 | 419 | 344 | 470 | 1026 | 3724 | 21502 | 3339 | 1431 |
| 3239 | 153 | 126 | 119 | 392 | 2768 | 17984 | 2550 | 1142 |
| 3240 | 424 | 348 | 473 | 1025 | 3705 | 21273 | 3346 | 1506 |
| 3241 | 128 | 100 | 104 | 375 | 2800 | 18205 | 2576 | 1134 |
| 3242 | 405 | 335 | 457 | 990 | 3610 | 21039 | 3234 | 1390 |
| 3243 | 157 | 128 | 124 | 410 | 2875 | 18459 | 2642 | 1161 |
| 3244 | 421 | 348 | 470 | 1004 | 3593 | 20791 | 3242 | 1469 |
| 3245 | 141 | 108 | 116 | 413 | 2927 | 18677 | 2696 | 1192 |
| 3246 | 389 | 323 | 440 | 949 | 3489 | 20556 | 3125 | 1348 |
| 3247 | 160 | 129 | 128 | 427 | 2979 | 18926 | 2732 | 1179 |
| 3248 | 416 | 347 | 465 | 981 | 3481 | 20331 | 3140 | 1430 |
| 3249 | 155 | 117 | 129 | 450 | 3047 | 19140 | 2808 | 1245 |
| 3250 | 376 | 314 | 426 | 913 | 3376 | 20094 | 3023 | 1313 |
| 3251 | 164 | 130 | 133 | 446 | 3086 | 19400 | 2825 | 1202 |
| 3252 | 411 | 345 | 460 | 958 | 3369 | 19869 | 3035 | 1388 |
| 3253 | 170 | 127 | 142 | 491 | 3171 | 19612 | 2923 | 1297 |
| 3254 | 363 | 305 | 414 | 880 | 3261 | 19602 | 2921 | 1282 |
| 3255 | 167 | 132 | 138 | 465 | 3195 | 19875 | 2921 | 1227 |
| 3256 | 402 | 340 | 452 | 930 | 3251 | 19394 | 2926 | 1341 |
| 3257 | 186 | 138 | 157 | 533 | 3298 | 20093 | 3040 | 1349 |
| 3258 | 352 | 298 | 401 | 845 | 3147 | 19131 | 2822 | 1254 |
| 3259 | 171 | 133 | 142 | 482 | 3301 | 20345 | 3015 | 1252 |
| 3260 | 392 | 334 | 441 | 898 | 3131 | 18924 | 2814 | 1290 |
| 3261 | 202 | 148 | 172 | 573 | 3419 | 20568 | 3151 | 1395 |
| 3262 | 345 | 293 | 393 | 819 | 3042 | 18672 | 2730 | 1233 |
| 3263 | 174 | 134 | 147 | 503 | 3408 | 20801 | 3110 | 1282 |
| 3264 | 379 | 326 | 429 | 865 | 3011 | 18451 | 2702 | 1239 |
| 3265 | 217 | 159 | 187 | 613 | 3541 | 21042 | 3261 | 1439 |
| 3266 | 337 | 289 | 384 | 792 | 2935 | 18203 | 2637 | 1211 |
| 3267 | 179 | 135 | 154 | 529 | 3524 | 21283 | 3216 | 1320 |
| 3268 | 365 | 316 | 414 | 827 | 2887 | 17968 | 2587 | 1187 |
| 3269 | 232 | 170 | 201 | 649 | 3657 | 21510 | 3365 | 1477 |
| 3270 | 332 | 286 | 377 | 767 | 2829 | 17741 | 2545 | 1189 |
| 3271 | 186 | 138 | 162 | 558 | 3637 | 21744 | 3321 | 1361 |
| 3272 | 351 | 306 | 399 | 790 | 2769 | 17504 | 2477 | 1138 |
| 3273 | 244 | 179 | 213 | 680 | 3767 | 21963 | 3462 | 1508 |
| 3274 | 327 | 284 | 371 | 745 | 2726 | 17283 | 2455 | 1166 |
| 3275 | 196 | 143 | 173 | 593 | 3754 | 22197 | 3428 | 1407 |
| 3276 | 337 | 296 | 385 | 755 | 2657 | 17067 | 2375 | 1094 |
| 3277 | 254 | 186 | 224 | 709 | 3874 | 22417 | 3556 | 1534 |
| 3278 | 321 | 281 | 365 | 720 | 2618 | 16822 | 2359 | 1140 |
| 3279 | 208 | 149 | 185 | 631 | 3871 | 22644 | 3537 | 1458 |
| 3280 | 324 | 286 | 371 | 721 | 2545 | 16620 | 2272 | 1051 |
| 3281 | 264 | 193 | 234 | 737 | 3981 | 22871 | 3650 | 1559 |
| 3282 | 316 | 279 | 358 | 696 | 2516 | 16388 | 2270 | 1114 |
| 3283 | 221 | 158 | 200 | 671 | 3985 | 23072 | 3645 | 1511 |
| 3284 | 309 | 276 | 356 | 686 | 2434 | 16179 | 2172 | 1010 |
| 3285 | 271 | 197 | 242 | 760 | 4081 | 23308 | 3736 | 1578 |
| 3286 | 310 | 276 | 351 | 672 | 2415 | 15962 | 2179 | 1084 |
| 3287 | 237 | 167 | 216 | 716 | 4102 | 23509 | 3754 | 1566 |
| 3288 | 293 | 264 | 340 | 650 | 2324 | 15736 | 2072 | 971 |
| 3289 | 277 | 201 | 250 | 784 | 4181 | 23736 | 3821 | 1596 |
| 3290 | 304 | 273 | 345 | 649 | 2314 | 15537 | 2087 | 1051 |
| 3291 | 254 | 179 | 234 | 764 | 4223 | 23943 | 3866 | 1622 |
| 3292 | 277 | 252 | 322 | 612 | 2218 | 15309 | 1976 | 934 |
| 3293 | 282 | 205 | 257 | 803 | 4274 | 24151 | 3901 | 1612 |
| 3294 | 298 | 271 | 339 | 626 | 2213 | 15121 | 1995 | 1014 |
| 3295 | 272 | 191 | 252 | 812 | 4337 | 24360 | 3971 | 1673 |
| 3296 | 263 | 241 | 307 | 577 | 2119 | 14905 | 1888 | 904 |
| 3297 | 286 | 207 | 263 | 820 | 4365 | 24556 | 3978 | 1628 |
| 3298 | 291 | 267 | 332 | 603 | 2111 | 14695 | 1899 | 974 |
| 3299 | 291 | 204 | 272 | 864 | 4452 | 24769 | 4076 | 1724 |
| 3300 | 250 | 232 | 293 | 545 | 2024 | 14503 | 1805 | 880 |
| 3301 | 290 | 209 | 269 | 838 | 4459 | 24963 | 4059 | 1648 |
| 3302 | 281 | 261 | 321 | 574 | 2008 | 14300 | 1803 | 929 |
| 3303 | 310 | 218 | 293 | 912 | 4557 | 25160 | 4172 | 1768 |
| 3304 | 238 | 223 | 279 | 514 | 1931 | 14113 | 1724 | 859 |
| 3305 | 294 | 211 | 274 | 856 | 4547 | 25349 | 4136 | 1668 |
| 3306 | 269 | 253 | 309 | 546 | 1913 | 13937 | 1713 | 886 |
| 3307 | 327 | 231 | 311 | 955 | 4653 | 25524 | 4257 | 1804 |
| 3308 | 229 | 217 | 269 | 487 | 1842 | 13734 | 1648 | 842 |
| 3309 | 297 | 213 | 280 | 875 | 4632 | 25719 | 4211 | 1691 |
| 3310 | 257 | 245 | 297 | 516 | 1816 | 13569 | 1622 | 842 |
| 3311 | 345 | 244 | 330 | 998 | 4752 | 25910 | 4345 | 1840 |
| 3312 | 221 | 212 | 259 | 463 | 1755 | 13354 | 1573 | 825 |
| 3313 | 302 | 216 | 287 | 898 | 4718 | 26069 | 4288 | 1718 |
| 3314 | 243 | 235 | 283 | 486 | 1719 | 13191 | 1531 | 798 |
| 3315 | 361 | 256 | 347 | 1038 | 4845 | 26265 | 4427 | 1870 |
| 3316 | 215 | 208 | 251 | 440 | 1679 | 13021 | 1508 | 812 |
| 3317 | 308 | 219 | 296 | 923 | 4803 | 26410 | 4364 | 1748 |
| 3318 | 230 | 225 | 269 | 457 | 1632 | 12869 | 1451 | 759 |
| 3319 | 374 | 267 | 362 | 1070 | 4928 | 26605 | 4499 | 1892 |
| 3320 | 210 | 205 | 244 | 420 | 1604 | 12698 | 1444 | 799 |
| 3321 | 316 | 223 | 306 | 954 | 4886 | 26734 | 4441 | 1783 |
| 3322 | 217 | 215 | 255 | 429 | 1544 | 12535 | 1370 | 722 |
| 3323 | 385 | 275 | 375 | 1099 | 5003 | 26919 | 4563 | 1909 |
| 3324 | 204 | 201 | 236 | 399 | 1530 | 12379 | 1381 | 783 |
| 3325 | 328 | 231 | 321 | 990 | 4973 | 27047 | 4523 | 1826 |
| 3326 | 203 | 204 | 241 | 399 | 1465 | 12233 | 1297 | 689 |
| 3327 | 393 | 282 | 385 | 1120 | 5072 | 27217 | 4620 | 1919 |
| 3328 | 199 | 198 | 229 | 379 | 1461 | 12092 | 1321 | 766 |
| 3329 | 341 | 240 | 336 | 1028 | 5054 | 27339 | 4598 | 1866 |
| 3330 | 191 | 195 | 227 | 373 | 1392 | 11954 | 1231 | 660 |
| 3331 | 398 | 285 | 392 | 1137 | 5133 | 27496 | 4670 | 1925 |
| 3332 | 194 | 195 | 222 | 358 | 1390 | 11798 | 1257 | 744 |
| 3333 | 356 | 252 | 354 | 1069 | 5131 | 27604 | 4670 | 1907 |
| 3334 | 178 | 184 | 213 | 346 | 1318 | 11660 | 1164 | 633 |
| 3335 | 404 | 290 | 400 | 1155 | 5191 | 27743 | 4717 | 1931 |
| 3336 | 188 | 192 | 215 | 340 | 1326 | 11535 | 1200 | 723 |
| 3337 | 373 | 263 | 373 | 1113 | 5211 | 27867 | 4744 | 1949 |
| 3338 | 165 | 174 | 199 | 320 | 1257 | 11424 | 1112 | 614 |
| 3339 | 408 | 293 | 406 | 1171 | 5253 | 28021 | 4769 | 1940 |
| 3340 | 182 | 189 | 208 | 321 | 1268 | 11312 | 1147 | 699 |
| 3341 | 389 | 276 | 391 | 1153 | 5279 | 28102 | 4807 | 1986 |
| 3342 | 153 | 164 | 186 | 295 | 1197 | 11184 | 1060 | 598 |
| 3343 | 411 | 296 | 411 | 1181 | 5301 | 28245 | 4809 | 1944 |
| 3344 | 176 | 185 | 201 | 304 | 1210 | 11094 | 1093 | 673 |
| 3345 | 407 | 289 | 411 | 1196 | 5345 | 28324 | 4868 | 2020 |
| 3346 | 142 | 155 | 173 | 272 | 1143 | 10958 | 1015 | 587 |
| 3347 | 412 | 296 | 415 | 1191 | 5347 | 28450 | 4847 | 1949 |
| 3348 | 168 | 180 | 193 | 287 | 1156 | 10892 | 1041 | 644 |
| 3349 | 424 | 302 | 430 | 1236 | 5404 | 28516 | 4920 | 2048 |
| 3350 | 132 | 147 | 161 | 250 | 1100 | 10779 | 981 | 582 |
| 3351 | 412 | 297 | 417 | 1195 | 5380 | 28614 | 4873 | 1950 |
| 3352 | 158 | 173 | 183 | 267 | 1095 | 10674 | 982 | 609 |
| 3353 | 441 | 316 | 451 | 1278 | 5459 | 28689 | 4968 | 2072 |
| 3354 | 125 | 142 | 152 | 232 | 1063 | 10606 | 953 | 583 |
| 3355 | 413 | 297 | 420 | 1202 | 5421 | 28790 | 4908 | 1957 |
| 3356 | 148 | 165 | 172 | 248 | 1051 | 10531 | 938 | 579 |
| 3357 | 457 | 328 | 468 | 1311 | 5506 | 28859 | 5009 | 2090 |
| 3358 | 120 | 138 | 144 | 216 | 1027 | 10445 | 926 | 583 |
| 3359 | 414 | 298 | 424 | 1213 | 5457 | 28942 | 4940 | 1969 |
| 3360 | 136 | 157 | 161 | 228 | 1009 | 10403 | 899 | 553 |
| 3361 | 471 | 340 | 484 | 1338 | 5542 | 28992 | 5039 | 2101 |
| 3362 | 116 | 136 | 138 | 203 | 1000 | 10326 | 907 | 586 |
| 3363 | 416 | 299 | 428 | 1222 | 5484 | 29055 | 4965 | 1980 |
| 3364 | 126 | 149 | 150 | 209 | 972 | 10291 | 863 | 529 |
| 3365 | 481 | 349 | 497 | 1359 | 5571 | 29109 | 5060 | 2105 |
| 3366 | 112 | 132 | 131 | 189 | 973 | 10213 | 887 | 587 |
| 3367 | 421 | 303 | 435 | 1240 | 5513 | 29155 | 4992 | 1997 |
| 3368 | 116 | 141 | 140 | 192 | 939 | 10190 | 831 | 509 |
| 3369 | 489 | 357 | 507 | 1376 | 5592 | 29200 | 5075 | 2105 |
| 3370 | 110 | 131 | 125 | 178 | 954 | 10128 | 873 | 589 |
| 3371 | 428 | 308 | 445 | 1259 | 5537 | 29217 | 5014 | 2016 |
| 3372 | 107 | 133 | 130 | 176 | 915 | 10122 | 809 | 495 |
| 3373 | 493 | 361 | 514 | 1385 | 5604 | 29268 | 5081 | 2098 |
| 3374 | 108 | 129 | 120 | 167 | 942 | 10086 | 866 | 591 |
| 3375 | 436 | 315 | 456 | 1278 | 5554 | 29257 | 5032 | 2036 |
| 3376 | 98 | 124 | 119 | 161 | 894 | 10072 | 790 | 482 |
| 3377 | 496 | 364 | 519 | 1390 | 5610 | 29317 | 5083 | 2088 |
| 3378 | 106 | 127 | 115 | 158 | 931 | 10047 | 857 | 589 |
| 3379 | 448 | 324 | 470 | 1306 | 5582 | 29320 | 5060 | 2061 |
| 3380 | 90 | 116 | 110 | 148 | 879 | 10027 | 779 | 475 |
| 3381 | 497 | 366 | 522 | 1395 | 5612 | 29337 | 5080 | 2077 |
| 3382 | 104 | 126 | 111 | 150 | 927 | 10040 | 856 | 588 |
| 3383 | 460 | 334 | 485 | 1331 | 5597 | 29329 | 5076 | 2082 |
| 3384 | 82 | 108 | 100 | 136 | 877 | 10037 | 780 | 476 |
| 3385 | 496 | 366 | 522 | 1390 | 5601 | 29321 | 5065 | 2060 |
| 3386 | 101 | 124 | 107 | 141 | 923 | 10047 | 851 | 580 |
| 3387 | 472 | 344 | 498 | 1355 | 5605 | 29321 | 5084 | 2098 |
| 3388 | 75 | 100 | 91 | 125 | 878 | 10053 | 785 | 481 |
| 3389 | 495 | 365 | 522 | 1386 | 5590 | 29301 | 5052 | 2046 |
| 3390 | 98 | 122 | 102 | 134 | 921 | 10069 | 848 | 570 |
| 3391 | 485 | 355 | 514 | 1380 | 5608 | 29286 | 5088 | 2110 |
| 3392 | 69 | 94 | 83 | 117 | 889 | 10098 | 800 | 493 |
| 3393 | 492 | 364 | 521 | 1379 | 5574 | 29256 | 5033 | 2031 |
| 3394 | 93 | 119 | 97 | 126 | 925 | 10128 | 848 | 558 |
| 3395 | 496 | 365 | 528 | 1400 | 5600 | 29217 | 5079 | 2115 |
| 3396 | 64 | 90 | 76 | 110 | 904 | 10158 | 819 | 508 |
| 3397 | 488 | 361 | 519 | 1369 | 5552 | 29189 | 5010 | 2014 |
| 3398 | 88 | 114 | 92 | 120 | 934 | 10208 | 853 | 545 |
| 3399 | 507 | 375 | 541 | 1418 | 5588 | 29138 | 5067 | 2116 |
| 3400 | 62 | 87 | 71 | 105 | 926 | 10235 | 845 | 528 |
| 3401 | 482 | 358 | 515 | 1357 | 5523 | 29090 | 4982 | 1999 |
| 3402 | 81 | 109 | 85 | 113 | 947 | 10310 | 862 | 535 |
| 3403 | 518 | 385 | 553 | 1435 | 5573 | 29045 | 5051 | 2114 |
| 3404 | 61 | 86 | 68 | 103 | 955 | 10337 | 877 | 551 |
| 3405 | 479 | 356 | 513 | 1348 | 5495 | 28976 | 4957 | 1989 |
| 3406 | 75 | 104 | 79 | 106 | 966 | 10428 | 876 | 527 |
| 3407 | 526 | 393 | 564 | 1445 | 5549 | 28926 | 5027 | 2106 |
| 3408 | 62 | 86 | 65 | 103 | 994 | 10482 | 919 | 578 |
| 3409 | 473 | 353 | 509 | 1336 | 5458 | 28828 | 4922 | 1977 |
| 3410 | 69 | 98 | 73 | 100 | 988 | 10563 | 894 | 522 |
| 3411 | 532 | 400 | 572 | 1449 | 5513 | 28779 | 4991 | 2090 |
| 3412 | 63 | 87 | 63 | 105 | 1034 | 10640 | 960 | 602 |
| 3413 | 471 | 351 | 508 | 1330 | 5423 | 28675 | 4893 | 1973 |
| 3414 | 63 | 93 | 67 | 96 | 1015 | 10712 | 917 | 519 |
| 3415 | 535 | 404 | 576 | 1448 | 5473 | 28611 | 4952 | 2068 |
| 3416 | 66 | 88 | 62 | 108 | 1080 | 10815 | 1008 | 626 |
| 3417 | 472 | 353 | 511 | 1330 | 5388 | 28497 | 4864 | 1973 |
| 3418 | 59 | 87 | 62 | 94 | 1055 | 10911 | 954 | 525 |
| 3419 | 533 | 404 | 576 | 1437 | 5418 | 28405 | 4897 | 2038 |
| 3420 | 69 | 89 | 62 | 111 | 1127 | 11011 | 1053 | 646 |
| 3421 | 476 | 356 | 516 | 1331 | 5348 | 28294 | 4830 | 1974 |
| 3422 | 55 | 82 | 57 | 93 | 1099 | 11121 | 994 | 534 |
| 3423 | 529 | 402 | 573 | 1422 | 5362 | 28206 | 4842 | 2008 |
| 3424 | 72 | 91 | 61 | 115 | 1174 | 11212 | 1097 | 663 |
| 3425 | 480 | 362 | 522 | 1336 | 5306 | 28075 | 4794 | 1975 |
| 3426 | 52 | 77 | 53 | 94 | 1146 | 11334 | 1039 | 548 |
| 3427 | 525 | 401 | 570 | 1410 | 5305 | 27980 | 4787 | 1979 |
| 3428 | 74 | 93 | 61 | 120 | 1232 | 11458 | 1152 | 681 |
| 3429 | 485 | 367 | 528 | 1337 | 5256 | 27828 | 4753 | 1974 |
| 3430 | 51 | 73 | 50 | 97 | 1204 | 11586 | 1095 | 569 |
| 3431 | 519 | 397 | 565 | 1390 | 5238 | 27729 | 4723 | 1946 |
| 3432 | 77 | 94 | 62 | 125 | 1291 | 11725 | 1205 | 695 |
| 3433 | 490 | 372 | 534 | 1337 | 5201 | 27570 | 4704 | 1967 |
| 3434 | 50 | 69 | 47 | 103 | 1262 | 11832 | 1151 | 594 |
| 3435 | 512 | 393 | 559 | 1370 | 5167 | 27459 | 4656 | 1913 |
| 3436 | 79 | 95 | 61 | 130 | 1350 | 11998 | 1257 | 706 |
| 3437 | 495 | 378 | 541 | 1339 | 5145 | 27301 | 4654 | 1961 |
| 3438 | 51 | 67 | 46 | 111 | 1333 | 12114 | 1220 | 627 |
| 3439 | 504 | 388 | 551 | 1346 | 5091 | 27162 | 4583 | 1880 |
| 3440 | 80 | 95 | 61 | 135 | 1412 | 12287 | 1311 | 713 |
| 3441 | 500 | 384 | 547 | 1339 | 5082 | 27006 | 4598 | 1948 |
| 3442 | 53 | 67 | 46 | 121 | 1412 | 12426 | 1298 | 666 |
| 3443 | 494 | 382 | 542 | 1317 | 5009 | 26851 | 4507 | 1844 |
| 3444 | 79 | 93 | 60 | 139 | 1474 | 12593 | 1364 | 717 |
| 3445 | 505 | 390 | 553 | 1337 | 5012 | 26694 | 4534 | 1931 |
| 3446 | 58 | 69 | 48 | 135 | 1495 | 12745 | 1380 | 709 |
| 3447 | 484 | 374 | 532 | 1290 | 4928 | 26539 | 4432 | 1813 |
| 3448 | 77 | 91 | 59 | 146 | 1540 | 12908 | 1418 | 722 |
| 3449 | 509 | 394 | 557 | 1334 | 4937 | 26362 | 4464 | 1908 |
| 3450 | 63 | 72 | 50 | 151 | 1581 | 13073 | 1464 | 751 |
| 3451 | 474 | 368 | 522 | 1262 | 4844 | 26201 | 4356 | 1783 |
| 3452 | 76 | 89 | 58 | 152 | 1611 | 13245 | 1479 | 730 |
| 3453 | 511 | 398 | 561 | 1326 | 4856 | 26010 | 4389 | 1879 |
| 3454 | 70 | 76 | 55 | 169 | 1675 | 13431 | 1555 | 796 |
| 3455 | 464 | 361 | 513 | 1235 | 4758 | 25844 | 4278 | 1757 |
| 3456 | 75 | 87 | 58 | 159 | 1693 | 13623 | 1552 | 744 |
| 3457 | 509 | 400 | 560 | 1311 | 4768 | 25655 | 4306 | 1844 |
| 3458 | 78 | 80 | 59 | 188 | 1766 | 13789 | 1641 | 836 |
| 3459 | 456 | 356 | 505 | 1212 | 4670 | 25473 | 4201 | 1736 |
| 3460 | 75 | 85 | 57 | 167 | 1774 | 13994 | 1624 | 760 |
| 3461 | 507 | 400 | 559 | 1293 | 4677 | 25285 | 4220 | 1807 |
| 3462 | 87 | 86 | 65 | 210 | 1863 | 14174 | 1734 | 877 |
| 3463 | 450 | 353 | 500 | 1191 | 4580 | 25079 | 4122 | 1716 |
| 3464 | 75 | 83 | 57 | 177 | 1860 | 14380 | 1701 | 780 |
| 3465 | 500 | 397 | 553 | 1269 | 4578 | 24894 | 4127 | 1764 |
| 3466 | 96 | 92 | 72 | 231 | 1963 | 14573 | 1827 | 916 |
| 3467 | 446 | 351 | 496 | 1172 | 4489 | 24679 | 4043 | 1699 |
| 3468 | 76 | 81 | 58 | 189 | 1947 | 14769 | 1780 | 803 |
| 3469 | 492 | 392 | 544 | 1241 | 4474 | 24495 | 4030 | 1719 |
| 3470 | 105 | 97 | 78 | 252 | 2062 | 14980 | 1919 | 952 |
| 3471 | 445 | 351 | 494 | 1157 | 4400 | 24282 | 3966 | 1685 |
| 3472 | 77 | 79 | 60 | 203 | 2041 | 15173 | 1866 | 832 |
| 3473 | 482 | 385 | 534 | 1211 | 4367 | 24074 | 3930 | 1673 |
| 3474 | 114 | 103 | 84 | 273 | 2164 | 15401 | 2012 | 985 |
| 3475 | 444 | 353 | 494 | 1142 | 4307 | 23864 | 3885 | 1668 |
| 3476 | 81 | 79 | 63 | 222 | 2145 | 15604 | 1964 | 870 |
| 3477 | 471 | 378 | 523 | 1179 | 4257 | 23646 | 3828 | 1627 |
| 3478 | 122 | 108 | 90 | 291 | 2260 | 15813 | 2099 | 1011 |
| 3479 | 443 | 354 | 493 | 1127 | 4211 | 23436 | 3801 | 1650 |
| 3480 | 86 | 80 | 68 | 244 | 2251 | 16035 | 2064 | 913 |
| 3481 | 459 | 370 | 512 | 1146 | 4147 | 23212 | 3726 | 1583 |
| 3482 | 128 | 113 | 96 | 310 | 2364 | 16261 | 2191 | 1036 |
| 3483 | 441 | 355 | 492 | 1111 | 4111 | 22990 | 3712 | 1627 |
| 3484 | 94 | 82 | 74 | 270 | 2365 | 16480 | 2172 | 962 |
| 3485 | 447 | 363 | 500 | 1113 | 4035 | 22766 | 3623 | 1539 |
| 3486 | 134 | 115 | 100 | 328 | 2468 | 16715 | 2282 | 1058 |
| 3487 | 441 | 356 | 491 | 1094 | 4009 | 22542 | 3622 | 1601 |
| 3488 | 104 | 86 | 82 | 299 | 2481 | 16924 | 2283 | 1015 |
| 3489 | 434 | 354 | 487 | 1077 | 3923 | 22318 | 3520 | 1497 |
| 3490 | 138 | 118 | 105 | 345 | 2570 | 17168 | 2370 | 1077 |
| 3491 | 438 | 356 | 488 | 1074 | 3903 | 22090 | 3525 | 1570 |
| 3492 | 114 | 92 | 91 | 330 | 2599 | 17377 | 2394 | 1068 |
| 3493 | 420 | 344 | 472 | 1040 | 3809 | 21857 | 3415 | 1455 |
| 3494 | 142 | 119 | 109 | 362 | 2673 | 17630 | 2459 | 1095 |
| 3495 | 436 | 357 | 486 | 1057 | 3797 | 21636 | 3428 | 1537 |
| 3496 | 127 | 100 | 101 | 365 | 2721 | 17835 | 2509 | 1124 |
| 3497 | 405 | 333 | 457 | 1001 | 3692 | 21389 | 3309 | 1415 |
| 3498 | 145 | 121 | 113 | 378 | 2777 | 18089 | 2549 | 1114 |
| 3499 | 433 | 358 | 484 | 1037 | 3689 | 21180 | 3328 | 1500 |
| 3500 | 139 | 108 | 113 | 401 | 2844 | 18304 | 2625 | 1179 |
| 3501 | 392 | 323 | 443 | 963 | 3577 | 20921 | 3206 | 1378 |
| 3502 | 148 | 121 | 117 | 394 | 2877 | 18546 | 2636 | 1133 |
| 3503 | 428 | 356 | 478 | 1014 | 3573 | 20707 | 3221 | 1456 |
| 3504 | 154 | 118 | 126 | 440 | 2968 | 18776 | 2740 | 1232 |
| 3505 | 378 | 314 | 428 | 928 | 3463 | 20452 | 3105 | 1347 |
| 3506 | 150 | 122 | 121 | 410 | 2979 | 19001 | 2726 | 1154 |
| 3507 | 419 | 351 | 470 | 985 | 3456 | 20239 | 3111 | 1407 |
| 3508 | 169 | 128 | 140 | 479 | 3091 | 19248 | 2853 | 1282 |
| 3509 | 368 | 308 | 418 | 899 | 3354 | 19984 | 3009 | 1321 |
| 3510 | 154 | 123 | 125 | 429 | 3090 | 19482 | 2825 | 1183 |
| 3511 | 409 | 345 | 459 | 953 | 3335 | 19764 | 2998 | 1357 |
| 3512 | 185 | 138 | 154 | 518 | 3210 | 19713 | 2963 | 1328 |
| 3513 | 361 | 303 | 410 | 872 | 3246 | 19514 | 2916 | 1300 |
| 3514 | 157 | 124 | 130 | 451 | 3202 | 19961 | 2926 | 1216 |
| 3515 | 397 | 336 | 446 | 919 | 3215 | 19300 | 2887 | 1306 |
| 3516 | 199 | 148 | 167 | 553 | 3328 | 20182 | 3069 | 1370 |
| 3517 | 355 | 300 | 403 | 846 | 3137 | 19040 | 2820 | 1277 |
| 3518 | 162 | 125 | 136 | 474 | 3313 | 20425 | 3026 | 1250 |
| 3519 | 384 | 328 | 434 | 884 | 3098 | 18839 | 2778 | 1257 |
| 3520 | 212 | 157 | 180 | 588 | 3445 | 20659 | 3175 | 1407 |
| 3521 | 350 | 297 | 396 | 823 | 3030 | 18565 | 2727 | 1255 |
| 3522 | 169 | 128 | 144 | 504 | 3429 | 20889 | 3132 | 1292 |
| 3523 | 370 | 318 | 419 | 848 | 2978 | 18366 | 2667 | 1207 |
| 3524 | 225 | 166 | 192 | 620 | 3563 | 21138 | 3279 | 1441 |
| 3525 | 344 | 294 | 390 | 797 | 2923 | 18103 | 2633 | 1230 |
| 3526 | 178 | 131 | 154 | 534 | 3543 | 21348 | 3238 | 1337 |
| 3527 | 356 | 309 | 405 | 813 | 2859 | 17897 | 2558 | 1161 |
| 3528 | 236 | 174 | 203 | 650 | 3673 | 21602 | 3376 | 1469 |
| 3529 | 339 | 293 | 384 | 773 | 2815 | 17634 | 2538 | 1205 |
| 3530 | 188 | 137 | 165 | 572 | 3662 | 21807 | 3348 | 1387 |
| 3531 | 342 | 298 | 391 | 777 | 2744 | 17433 | 2451 | 1116 |
| 3532 | 244 | 180 | 212 | 675 | 3780 | 22060 | 3469 | 1493 |
| 3533 | 334 | 291 | 378 | 750 | 2712 | 17191 | 2446 | 1178 |
| 3534 | 202 | 145 | 179 | 613 | 3786 | 22274 | 3465 | 1444 |
| 3535 | 327 | 288 | 375 | 739 | 2627 | 16970 | 2345 | 1072 |
| 3536 | 251 | 184 | 220 | 697 | 3880 | 22503 | 3555 | 1510 |
| 3537 | 328 | 288 | 371 | 726 | 2605 | 16740 | 2351 | 1146 |
| 3538 | 218 | 155 | 195 | 658 | 3908 | 22723 | 3579 | 1500 |
| 3539 | 312 | 276 | 359 | 702 | 2516 | 16533 | 2245 | 1033 |
| 3540 | 256 | 187 | 226 | 718 | 3980 | 22947 | 3641 | 1528 |
| 3541 | 323 | 286 | 365 | 702 | 2498 | 16293 | 2254 | 1111 |
| 3542 | 235 | 166 | 212 | 704 | 4027 | 23165 | 3691 | 1555 |
| 3543 | 296 | 264 | 342 | 665 | 2407 | 16093 | 2147 | 995 |
| 3544 | 261 | 191 | 234 | 741 | 4084 | 23399 | 3730 | 1548 |
| 3545 | 317 | 283 | 359 | 679 | 2394 | 15862 | 2158 | 1073 |
| 3546 | 252 | 178 | 230 | 752 | 4143 | 23590 | 3798 | 1607 |
| 3547 | 281 | 254 | 326 | 629 | 2301 | 15660 | 2053 | 963 |
| 3548 | 266 | 194 | 240 | 760 | 4181 | 23828 | 3814 | 1566 |
| 3549 | 309 | 279 | 351 | 654 | 2289 | 15443 | 2060 | 1031 |
| 3550 | 270 | 190 | 249 | 800 | 4258 | 24018 | 3903 | 1657 |
| 3551 | 267 | 244 | 311 | 594 | 2197 | 15223 | 1961 | 934 |
| 3552 | 270 | 196 | 246 | 779 | 4277 | 24246 | 3897 | 1586 |
| 3553 | 300 | 274 | 342 | 628 | 2186 | 15032 | 1964 | 989 |
| 3554 | 289 | 204 | 268 | 849 | 4372 | 24438 | 4007 | 1704 |
| 3555 | 256 | 236 | 299 | 565 | 2099 | 14801 | 1876 | 913 |
| 3556 | 274 | 198 | 252 | 798 | 4370 | 24640 | 3978 | 1609 |
| 3557 | 288 | 266 | 330 | 597 | 2082 | 14626 | 1867 | 942 |
| 3558 | 307 | 217 | 288 | 897 | 4483 | 24846 | 4106 | 1748 |
| 3559 | 247 | 229 | 288 | 535 | 2009 | 14418 | 1799 | 895 |
| 3560 | 278 | 199 | 258 | 816 | 4462 | 25044 | 4060 | 1633 |
| 3561 | 276 | 258 | 317 | 567 | 1978 | 14229 | 1769 | 896 |
| 3562 | 325 | 230 | 307 | 940 | 4584 | 25239 | 4197 | 1785 |
| 3563 | 240 | 225 | 279 | 511 | 1921 | 14037 | 1723 | 880 |
| 3564 | 281 | 201 | 264 | 838 | 4551 | 25420 | 4140 | 1660 |
| 3565 | 262 | 248 | 303 | 535 | 1878 | 13850 | 1675 | 850 |
| 3566 | 340 | 242 | 323 | 977 | 4677 | 25609 | 4278 | 1814 |
| 3567 | 233 | 221 | 271 | 488 | 1835 | 13665 | 1649 | 864 |
| 3568 | 288 | 205 | 273 | 866 | 4645 | 25798 | 4225 | 1694 |
| 3569 | 248 | 237 | 288 | 503 | 1780 | 13480 | 1584 | 807 |
| 3570 | 354 | 252 | 339 | 1012 | 4767 | 25978 | 4357 | 1839 |
| 3571 | 227 | 217 | 263 | 466 | 1751 | 13298 | 1577 | 847 |
| 3572 | 296 | 210 | 284 | 899 | 4737 | 26151 | 4310 | 1732 |
| 3573 | 235 | 227 | 274 | 473 | 1690 | 13130 | 1501 | 770 |
| 3574 | 365 | 261 | 351 | 1039 | 4849 | 26321 | 4427 | 1857 |
| 3575 | 222 | 213 | 255 | 444 | 1671 | 12960 | 1507 | 828 |
| 3576 | 308 | 217 | 298 | 935 | 4826 | 26485 | 4392 | 1773 |
| 3577 | 222 | 217 | 261 | 445 | 1602 | 12795 | 1421 | 734 |
| 3578 | 373 | 267 | 361 | 1065 | 4929 | 26664 | 4494 | 1871 |
| 3579 | 216 | 210 | 248 | 423 | 1592 | 12625 | 1438 | 808 |
| 3580 | 321 | 226 | 314 | 976 | 4915 | 26802 | 4475 | 1817 |
| 3581 | 208 | 207 | 247 | 416 | 1516 | 12449 | 1343 | 701 |
| 3582 | 381 | 273 | 371 | 1088 | 5004 | 26980 | 4558 | 1884 |
| 3583 | 211 | 207 | 241 | 402 | 1521 | 12325 | 1376 | 788 |
| 3584 | 337 | 237 | 332 | 1017 | 5003 | 27110 | 4558 | 1863 |
| 3585 | 195 | 196 | 232 | 388 | 1443 | 12168 | 1277 | 675 |
| 3586 | 385 | 276 | 377 | 1104 | 5069 | 27277 | 4611 | 1891 |
| 3587 | 205 | 204 | 234 | 382 | 1449 | 12036 | 1310 | 764 |
| 3588 | 354 | 249 | 350 | 1061 | 5087 | 27406 | 4635 | 1905 |
| 3589 | 181 | 186 | 217 | 360 | 1370 | 11879 | 1212 | 650 |
| 3590 | 389 | 279 | 383 | 1120 | 5131 | 27552 | 4662 | 1899 |
| 3591 | 199 | 201 | 227 | 362 | 1379 | 11758 | 1246 | 736 |
| 3592 | 372 | 262 | 369 | 1106 | 5169 | 27683 | 4710 | 1947 |
| 3593 | 168 | 175 | 203 | 332 | 1302 | 11610 | 1153 | 631 |
| 3594 | 393 | 282 | 389 | 1133 | 5189 | 27818 | 4710 | 1905 |
| 3595 | 192 | 196 | 219 | 343 | 1311 | 11497 | 1182 | 705 |
| 3596 | 390 | 276 | 390 | 1151 | 5243 | 27936 | 4778 | 1984 |
| 3597 | 157 | 166 | 189 | 306 | 1242 | 11363 | 1102 | 617 |
| 3598 | 394 | 283 | 393 | 1142 | 5240 | 28052 | 4752 | 1910 |
| 3599 | 183 | 191 | 211 | 324 | 1248 | 11269 | 1122 | 673 |
| 3600 | 407 | 289 | 410 | 1193 | 5309 | 28164 | 4837 | 2014 |
| 3601 | 147 | 158 | 177 | 283 | 1186 | 11133 | 1057 | 609 |
| 3602 | 397 | 285 | 398 | 1153 | 5291 | 28284 | 4796 | 1919 |
| 3603 | 173 | 184 | 200 | 302 | 1183 | 11037 | 1060 | 637 |
| 3604 | 425 | 303 | 430 | 1236 | 5374 | 28386 | 4895 | 2042 |
| 3605 | 139 | 153 | 168 | 264 | 1139 | 10921 | 1020 | 606 |
| 3606 | 397 | 285 | 400 | 1160 | 5334 | 28475 | 4833 | 1927 |
| 3607 | 162 | 176 | 189 | 282 | 1125 | 10821 | 1005 | 605 |
| 3608 | 441 | 316 | 448 | 1270 | 5422 | 28543 | 4936 | 2060 |
| 3609 | 133 | 148 | 160 | 247 | 1095 | 10708 | 985 | 604 |
| 3610 | 399 | 286 | 405 | 1175 | 5381 | 28656 | 4875 | 1941 |
| 3611 | 151 | 168 | 177 | 260 | 1080 | 10674 | 962 | 578 |
| 3612 | 455 | 328 | 465 | 1301 | 5476 | 28752 | 4982 | 2077 |
| 3613 | 128 | 145 | 153 | 231 | 1060 | 10562 | 959 | 604 |
| 3614 | 401 | 288 | 410 | 1187 | 5422 | 28827 | 4911 | 1956 |
| 3615 | 139 | 159 | 166 | 240 | 1031 | 10513 | 915 | 549 |
| 3616 | 467 | 338 | 479 | 1326 | 5516 | 28914 | 5015 | 2085 |
| 3617 | 124 | 142 | 146 | 216 | 1026 | 10418 | 932 | 601 |
| 3618 | 407 | 292 | 418 | 1205 | 5457 | 28960 | 4944 | 1974 |
| 3619 | 128 | 150 | 155 | 219 | 988 | 10376 | 874 | 525 |
| 3620 | 475 | 345 | 490 | 1344 | 5545 | 29042 | 5037 | 2085 |
| 3621 | 121 | 139 | 140 | 202 | 998 | 10304 | 911 | 600 |
| 3622 | 413 | 297 | 427 | 1226 | 5491 | 29074 | 4976 | 1995 |
| 3623 | 119 | 142 | 144 | 202 | 952 | 10263 | 842 | 506 |
| 3624 | 480 | 350 | 497 | 1356 | 5565 | 29145 | 5051 | 2081 |
| 3625 | 118 | 137 | 134 | 190 | 974 | 10205 | 892 | 599 |
| 3626 | 424 | 305 | 440 | 1253 | 5527 | 29180 | 5011 | 2022 |
| 3627 | 109 | 133 | 133 | 185 | 921 | 10165 | 814 | 490 |
| 3628 | 484 | 353 | 502 | 1365 | 5583 | 29231 | 5061 | 2075 |
| 3629 | 115 | 135 | 128 | 179 | 953 | 10122 | 875 | 594 |
| 3630 | 436 | 314 | 454 | 1281 | 5557 | 29253 | 5041 | 2048 |
| 3631 | 100 | 124 | 123 | 169 | 901 | 10101 | 797 | 482 |
| 3632 | 484 | 354 | 504 | 1364 | 5582 | 29258 | 5056 | 2061 |
| 3633 | 112 | 133 | 123 | 168 | 936 | 10069 | 861 | 587 |
| 3634 | 448 | 324 | 469 | 1307 | 5579 | 29296 | 5062 | 2070 |
| 3635 | 92 | 116 | 112 | 155 | 887 | 10062 | 787 | 479 |
| 3636 | 486 | 356 | 507 | 1370 | 5595 | 29331 | 5063 | 2055 |
| 3637 | 109 | 131 | 118 | 158 | 923 | 10037 | 849 | 577 |
| 3638 | 462 | 335 | 485 | 1335 | 5597 | 29318 | 5079 | 2090 |
| 3639 | 84 | 108 | 103 | 143 | 878 | 10031 | 783 | 480 |
| 3640 | 485 | 356 | 509 | 1369 | 5594 | 29346 | 5059 | 2044 |
| 3641 | 105 | 129 | 113 | 149 | 916 | 10033 | 840 | 566 |
| 3642 | 474 | 345 | 500 | 1361 | 5608 | 29325 | 5090 | 2104 |
| 3643 | 77 | 101 | 94 | 131 | 879 | 10037 | 788 | 488 |
| 3644 | 482 | 355 | 508 | 1363 | 5584 | 29332 | 5045 | 2030 |
| 3645 | 100 | 125 | 108 | 141 | 910 | 10047 | 832 | 551 |
| 3646 | 488 | 357 | 516 | 1388 | 5618 | 29321 | 5098 | 2117 |
| 3647 | 71 | 96 | 86 | 122 | 882 | 10043 | 796 | 499 |
| 3648 | 480 | 354 | 507 | 1358 | 5575 | 29308 | 5034 | 2019 |
| 3649 | 382 | 326 | 430 | 875 | 3075 | 18661 | 2771 | 1292 |
| 3650 | 191 | 139 | 164 | 561 | 3461 | 20815 | 3184 | 1385 |
| 3651 | 340 | 291 | 388 | 805 | 2970 | 18421 | 2657 | 1181 |
| 3652 | 194 | 148 | 164 | 545 | 3483 | 21041 | 3183 | 1325 |
| 3653 | 511 | 377 | 543 | 1428 | 5603 | 29200 | 5082 | 2120 |
| 3654 | 66 | 92 | 76 | 110 | 912 | 10144 | 836 | 535 |
| 3655 | 470 | 347 | 501 | 1336 | 5524 | 29132 | 4986 | 1992 |
| 3656 | 80 | 109 | 87 | 114 | 915 | 10201 | 827 | 507 |
| 3657 | 520 | 387 | 555 | 1441 | 5586 | 29099 | 5063 | 2113 |
| 3658 | 317 | 275 | 364 | 740 | 2752 | 17491 | 2466 | 1128 |
| 3659 | 201 | 151 | 174 | 583 | 3692 | 21952 | 3368 | 1375 |
| 3660 | 353 | 309 | 400 | 785 | 2722 | 17257 | 2442 | 1146 |
| 3661 | 240 | 173 | 212 | 689 | 3812 | 22154 | 3505 | 1523 |
| 3662 | 310 | 272 | 356 | 715 | 2642 | 16993 | 2371 | 1106 |
| 3663 | 205 | 152 | 180 | 603 | 3779 | 22301 | 3446 | 1399 |
| 3664 | 340 | 300 | 387 | 752 | 2603 | 16747 | 2333 | 1096 |
| 3665 | 257 | 185 | 229 | 731 | 3931 | 22575 | 3613 | 1566 |
| 3666 | 302 | 266 | 346 | 685 | 2541 | 16536 | 2284 | 1085 |
| 3667 | 213 | 156 | 189 | 634 | 3911 | 22828 | 3568 | 1446 |
| 3668 | 326 | 290 | 373 | 716 | 2500 | 16369 | 2237 | 1052 |
| 3669 | 270 | 194 | 242 | 764 | 4042 | 23050 | 3711 | 1598 |
| 3670 | 297 | 263 | 340 | 663 | 2442 | 16109 | 2198 | 1065 |
| 3671 | 219 | 159 | 197 | 661 | 4001 | 23188 | 3650 | 1479 |
| 3672 | 314 | 282 | 360 | 688 | 2394 | 15911 | 2138 | 1009 |
| 3673 | 284 | 204 | 256 | 802 | 4159 | 23489 | 3814 | 1633 |
| 3674 | 292 | 261 | 333 | 640 | 2352 | 15701 | 2121 | 1047 |
| 3675 | 231 | 165 | 211 | 704 | 4137 | 23696 | 3776 | 1537 |
| 3676 | 298 | 270 | 344 | 647 | 2281 | 15498 | 2035 | 964 |
| 3677 | 293 | 211 | 266 | 826 | 4252 | 23913 | 3894 | 1652 |
| 3678 | 287 | 258 | 326 | 617 | 2251 | 15285 | 2031 | 1021 |
| 3679 | 244 | 173 | 225 | 743 | 4243 | 24109 | 3874 | 1585 |
| 3680 | 285 | 260 | 330 | 615 | 2174 | 15083 | 1937 | 924 |
| 3681 | 301 | 216 | 276 | 851 | 4345 | 24328 | 3974 | 1670 |
| 3682 | 281 | 255 | 320 | 594 | 2153 | 14870 | 1943 | 994 |
| 3683 | 259 | 182 | 241 | 788 | 4357 | 24528 | 3980 | 1638 |
| 3684 | 269 | 248 | 313 | 578 | 2067 | 14660 | 1839 | 884 |
| 3685 | 308 | 221 | 284 | 875 | 4439 | 24735 | 4054 | 1687 |
| 3686 | 275 | 253 | 313 | 570 | 2057 | 14469 | 1856 | 964 |
| 3687 | 276 | 194 | 259 | 835 | 4466 | 24926 | 4081 | 1691 |
| 3688 | 254 | 237 | 298 | 545 | 1970 | 14275 | 1752 | 851 |
| 3689 | 312 | 224 | 291 | 893 | 4524 | 25122 | 4125 | 1700 |
| 3690 | 269 | 250 | 306 | 548 | 1963 | 14085 | 1769 | 931 |
| 3691 | 293 | 206 | 278 | 882 | 4571 | 25309 | 4178 | 1740 |
| 3692 | 240 | 226 | 281 | 512 | 1875 | 13889 | 1666 | 820 |
| 3693 | 317 | 228 | 298 | 913 | 4612 | 25504 | 4199 | 1716 |
| 3694 | 262 | 246 | 299 | 525 | 1868 | 13704 | 1682 | 894 |
| 3695 | 312 | 219 | 298 | 932 | 4678 | 25691 | 4276 | 1789 |
| 3696 | 226 | 216 | 266 | 479 | 1783 | 13511 | 1586 | 794 |
| 3697 | 321 | 230 | 304 | 929 | 4694 | 25868 | 4270 | 1730 |
| 3698 | 253 | 241 | 289 | 500 | 1777 | 13349 | 1597 | 854 |
| 3699 | 330 | 232 | 318 | 978 | 4774 | 26043 | 4363 | 1830 |
| 3700 | 213 | 206 | 253 | 450 | 1698 | 13162 | 1512 | 773 |
| 3701 | 324 | 233 | 310 | 945 | 4772 | 26217 | 4337 | 1745 |
| 3702 | 243 | 234 | 279 | 476 | 1688 | 13007 | 1513 | 813 |
| 3703 | 349 | 246 | 338 | 1026 | 4869 | 26390 | 4449 | 1869 |
| 3704 | 203 | 199 | 241 | 424 | 1618 | 12818 | 1445 | 758 |
| 3705 | 327 | 234 | 314 | 961 | 4849 | 26552 | 4405 | 1763 |
| 3706 | 231 | 226 | 268 | 450 | 1600 | 12673 | 1430 | 771 |
| 3707 | 367 | 260 | 358 | 1071 | 4958 | 26722 | 4529 | 1904 |
| 3708 | 195 | 193 | 230 | 399 | 1542 | 12490 | 1381 | 745 |
| 3709 | 330 | 236 | 320 | 978 | 4924 | 26870 | 4471 | 1783 |
| 3710 | 218 | 217 | 254 | 421 | 1515 | 12362 | 1350 | 730 |
| 3711 | 384 | 273 | 376 | 1110 | 5040 | 27035 | 4600 | 1931 |
| 3712 | 188 | 189 | 222 | 377 | 1473 | 12190 | 1323 | 735 |
| 3713 | 67 | 80 | 53 | 151 | 1688 | 13648 | 1543 | 720 |
| 3714 | 510 | 401 | 561 | 1309 | 4744 | 25570 | 4279 | 1816 |
| 3715 | 87 | 88 | 64 | 200 | 1790 | 13835 | 1669 | 857 |
| 3716 | 454 | 354 | 503 | 1207 | 4655 | 25362 | 4195 | 1749 |
| 3717 | 67 | 77 | 53 | 161 | 1773 | 14022 | 1620 | 743 |
| 3718 | 502 | 396 | 553 | 1282 | 4646 | 25189 | 4186 | 1772 |
| 3719 | 95 | 93 | 70 | 218 | 1886 | 14226 | 1757 | 892 |
| 3720 | 453 | 355 | 502 | 1193 | 4568 | 24974 | 4119 | 1735 |
| 3721 | 68 | 75 | 54 | 174 | 1861 | 14409 | 1701 | 770 |
| 3722 | 492 | 390 | 544 | 1253 | 4544 | 24798 | 4090 | 1726 |
| 3723 | 102 | 98 | 75 | 236 | 1978 | 14615 | 1841 | 920 |
| 3724 | 453 | 356 | 502 | 1181 | 4483 | 24589 | 4045 | 1720 |
| 3725 | 71 | 74 | 56 | 190 | 1954 | 14802 | 1788 | 803 |
| 3726 | 482 | 384 | 535 | 1224 | 4442 | 24400 | 3996 | 1684 |
| 3727 | 109 | 102 | 80 | 253 | 2069 | 15015 | 1924 | 944 |
| 3728 | 454 | 359 | 503 | 1171 | 4394 | 24181 | 3967 | 1704 |
| 3729 | 76 | 74 | 59 | 210 | 2058 | 15215 | 1887 | 845 |
| 3730 | 471 | 376 | 523 | 1192 | 4336 | 23980 | 3898 | 1642 |
| 3731 | 162 | 172 | 185 | 282 | 1172 | 10931 | 1065 | 667 |
| 3732 | 390 | 277 | 395 | 1163 | 5335 | 28377 | 4852 | 1978 |
| 3733 | 144 | 158 | 175 | 270 | 1108 | 10834 | 979 | 558 |
| 3734 | 433 | 312 | 438 | 1241 | 5386 | 28512 | 4889 | 1989 |
| 3735 | 158 | 170 | 179 | 268 | 1129 | 10758 | 1027 | 652 |
| 3736 | 406 | 289 | 413 | 1202 | 5399 | 28587 | 4912 | 2015 |
| 3737 | 133 | 149 | 163 | 248 | 1061 | 10649 | 939 | 545 |
| 3738 | 435 | 314 | 442 | 1250 | 5425 | 28696 | 4919 | 1989 |
| 3739 | 152 | 166 | 173 | 252 | 1082 | 10581 | 982 | 629 |
| 3740 | 423 | 301 | 432 | 1243 | 5456 | 28765 | 4964 | 2047 |
| 3741 | 122 | 140 | 150 | 227 | 1020 | 10486 | 906 | 536 |
| 3742 | 437 | 315 | 446 | 1256 | 5455 | 28841 | 4942 | 1987 |
| 3743 | 146 | 163 | 166 | 237 | 1042 | 10442 | 944 | 606 |
| 3744 | 438 | 314 | 451 | 1279 | 5500 | 28902 | 5003 | 2071 |
| 3745 | 113 | 132 | 139 | 208 | 988 | 10349 | 881 | 534 |
| 3746 | 436 | 316 | 448 | 1259 | 5481 | 28972 | 4961 | 1985 |
| 3747 | 138 | 157 | 158 | 222 | 1002 | 10312 | 904 | 579 |
| 3748 | 456 | 328 | 470 | 1317 | 5544 | 29035 | 5042 | 2094 |
| 3749 | 106 | 127 | 130 | 191 | 960 | 10226 | 861 | 536 |
| 3750 | 436 | 316 | 449 | 1262 | 5506 | 29092 | 4981 | 1986 |
| 3751 | 129 | 150 | 149 | 205 | 965 | 10198 | 867 | 552 |
| 3752 | 471 | 340 | 488 | 1350 | 5578 | 29132 | 5071 | 2110 |
| 3753 | 101 | 122 | 122 | 177 | 942 | 10136 | 850 | 543 |
| 3754 | 435 | 315 | 450 | 1263 | 5523 | 29173 | 4994 | 1987 |
| 3755 | 118 | 142 | 139 | 189 | 935 | 10117 | 836 | 528 |
| 3756 | 484 | 351 | 503 | 1374 | 5599 | 29202 | 5087 | 2116 |
| 3757 | 97 | 119 | 116 | 166 | 925 | 10062 | 841 | 549 |
| 3758 | 434 | 315 | 452 | 1268 | 5538 | 29240 | 5007 | 1991 |
| 3759 | 109 | 135 | 129 | 173 | 910 | 10063 | 811 | 506 |
| 3760 | 494 | 361 | 516 | 1394 | 5616 | 29269 | 5099 | 2118 |
| 3761 | 94 | 117 | 110 | 156 | 914 | 10013 | 835 | 556 |
| 3762 | 435 | 315 | 455 | 1274 | 5543 | 29258 | 5012 | 1997 |
| 3763 | 100 | 127 | 120 | 160 | 878 | 9950 | 780 | 484 |
| 3764 | 504 | 369 | 529 | 1417 | 5634 | 29302 | 5111 | 2120 |
| 3765 | 92 | 116 | 105 | 148 | 916 | 9988 | 843 | 567 |
| 3766 | 441 | 320 | 464 | 1291 | 5566 | 29300 | 5036 | 2016 |
| 3767 | 92 | 120 | 110 | 145 | 886 | 10029 | 788 | 479 |
| 3768 | 508 | 374 | 534 | 1418 | 5631 | 29335 | 5104 | 2108 |
| 3769 | 91 | 114 | 101 | 140 | 916 | 10015 | 845 | 573 |
| 3770 | 447 | 325 | 472 | 1305 | 5571 | 29315 | 5041 | 2029 |
| 3771 | 84 | 112 | 102 | 134 | 875 | 10039 | 777 | 469 |
| 3772 | 510 | 376 | 538 | 1421 | 5620 | 29325 | 5089 | 2093 |
| 3773 | 90 | 113 | 97 | 133 | 916 | 10033 | 848 | 576 |
| 3774 | 456 | 332 | 483 | 1324 | 5574 | 29295 | 5046 | 2045 |
| 3775 | 77 | 105 | 93 | 123 | 873 | 10064 | 776 | 464 |
| 3776 | 511 | 378 | 541 | 1421 | 5605 | 29289 | 5072 | 2077 |
| 3777 | 89 | 113 | 93 | 128 | 924 | 10081 | 857 | 580 |
| 3778 | 466 | 340 | 495 | 1341 | 5570 | 29238 | 5045 | 2060 |
| 3779 | 71 | 97 | 85 | 115 | 881 | 10123 | 786 | 467 |
| 3780 | 507 | 376 | 538 | 1412 | 5579 | 29216 | 5043 | 2055 |
| 3781 | 88 | 112 | 89 | 122 | 934 | 10152 | 867 | 580 |
| 3782 | 182 | 132 | 159 | 553 | 3565 | 21397 | 3265 | 1364 |
| 3783 | 346 | 300 | 395 | 797 | 2829 | 17800 | 2528 | 1138 |
| 3784 | 229 | 170 | 196 | 635 | 3668 | 21652 | 3364 | 1437 |
| 3785 | 347 | 300 | 392 | 784 | 2809 | 17578 | 2534 | 1210 |
| 3786 | 198 | 142 | 174 | 598 | 3696 | 21876 | 3388 | 1426 |
| 3787 | 330 | 288 | 378 | 757 | 2715 | 17354 | 2424 | 1096 |
| 3788 | 234 | 173 | 203 | 654 | 3771 | 22117 | 3453 | 1456 |
| 3789 | 341 | 297 | 385 | 758 | 2696 | 17121 | 2431 | 1172 |
| 3790 | 214 | 153 | 190 | 642 | 3815 | 22329 | 3498 | 1480 |
| 3791 | 315 | 276 | 361 | 719 | 2602 | 16910 | 2322 | 1057 |
| 3792 | 239 | 176 | 209 | 673 | 3869 | 22559 | 3536 | 1472 |
| 3793 | 336 | 295 | 380 | 736 | 2588 | 16680 | 2332 | 1134 |
| 3794 | 230 | 163 | 206 | 687 | 3931 | 22768 | 3607 | 1531 |
| 3795 | 300 | 266 | 347 | 683 | 2492 | 16462 | 2225 | 1023 |
| 3796 | 243 | 179 | 215 | 693 | 3970 | 23011 | 3624 | 1492 |
| 3797 | 328 | 291 | 372 | 710 | 2477 | 16234 | 2230 | 1090 |
| 3798 | 248 | 175 | 225 | 737 | 4052 | 23218 | 3719 | 1584 |
| 3799 | 286 | 255 | 331 | 647 | 2381 | 16008 | 2127 | 991 |
| 3800 | 248 | 181 | 222 | 714 | 4070 | 23446 | 3712 | 1514 |
| 3801 | 319 | 286 | 362 | 684 | 2370 | 15808 | 2131 | 1046 |
| 3802 | 266 | 188 | 243 | 784 | 4166 | 23645 | 3824 | 1632 |
| 3803 | 274 | 247 | 318 | 615 | 2282 | 15589 | 2042 | 969 |
| 3804 | 251 | 183 | 227 | 731 | 4163 | 23859 | 3794 | 1535 |
| 3805 | 307 | 278 | 351 | 653 | 2261 | 15383 | 2028 | 998 |
| 3806 | 284 | 201 | 262 | 830 | 4281 | 24078 | 3926 | 1676 |
| 3807 | 265 | 241 | 308 | 588 | 2184 | 15163 | 1957 | 949 |
| 3808 | 255 | 185 | 233 | 753 | 4264 | 24285 | 3883 | 1563 |
| 3809 | 294 | 270 | 338 | 622 | 2151 | 14944 | 1925 | 950 |
| 3810 | 302 | 214 | 280 | 876 | 4392 | 24494 | 4026 | 1716 |
| 3811 | 257 | 237 | 299 | 562 | 2092 | 14758 | 1878 | 931 |
| 3812 | 260 | 187 | 240 | 776 | 4362 | 24693 | 3972 | 1593 |
| 3813 | 280 | 259 | 323 | 586 | 2045 | 14551 | 1827 | 903 |
| 3814 | 317 | 226 | 297 | 912 | 4489 | 24890 | 4111 | 1746 |
| 3815 | 250 | 232 | 290 | 537 | 1998 | 14359 | 1797 | 911 |
| 3816 | 267 | 190 | 249 | 805 | 4460 | 25092 | 4060 | 1628 |
| 3817 | 267 | 250 | 309 | 555 | 1944 | 14161 | 1733 | 860 |
| 3818 | 330 | 235 | 311 | 945 | 4584 | 25282 | 4195 | 1772 |
| 3819 | 244 | 228 | 282 | 514 | 1908 | 13968 | 1718 | 892 |
| 3820 | 276 | 195 | 261 | 840 | 4560 | 25475 | 4152 | 1668 |
| 3821 | 252 | 239 | 294 | 522 | 1844 | 13778 | 1641 | 818 |
| 3822 | 342 | 244 | 324 | 976 | 4676 | 25670 | 4274 | 1794 |
| 3823 | 238 | 225 | 274 | 490 | 1818 | 13590 | 1639 | 870 |
| 3824 | 287 | 202 | 274 | 876 | 4654 | 25838 | 4239 | 1711 |
| 3825 | 239 | 229 | 280 | 492 | 1750 | 13417 | 1555 | 781 |
| 3826 | 350 | 250 | 333 | 1001 | 4759 | 26029 | 4345 | 1810 |
| 3827 | 233 | 222 | 267 | 469 | 1736 | 13245 | 1568 | 851 |
| 3828 | 301 | 211 | 290 | 916 | 4749 | 26185 | 4328 | 1757 |
| 3829 | 226 | 219 | 265 | 462 | 1659 | 13058 | 1472 | 747 |
| 3830 | 358 | 255 | 342 | 1025 | 4841 | 26384 | 4414 | 1825 |
| 3831 | 226 | 218 | 259 | 446 | 1652 | 12897 | 1493 | 826 |
| 3832 | 317 | 222 | 307 | 961 | 4847 | 26536 | 4419 | 1805 |
| 3833 | 212 | 208 | 251 | 432 | 1572 | 12720 | 1394 | 715 |
| 3834 | 362 | 258 | 349 | 1041 | 4908 | 26694 | 4470 | 1831 |
| 3835 | 221 | 215 | 253 | 426 | 1570 | 12555 | 1418 | 798 |
| 3836 | 334 | 234 | 326 | 1005 | 4932 | 26829 | 4498 | 1848 |
| 3837 | 197 | 196 | 235 | 401 | 1488 | 12378 | 1319 | 686 |
| 3838 | 367 | 262 | 356 | 1060 | 4982 | 27009 | 4531 | 1842 |
| 3839 | 214 | 212 | 246 | 406 | 1498 | 12268 | 1352 | 769 |
| 3840 | 351 | 247 | 345 | 1051 | 5026 | 27168 | 4585 | 1892 |
| 3841 | 183 | 185 | 220 | 372 | 1415 | 12095 | 1255 | 664 |
| 3842 | 370 | 264 | 362 | 1073 | 5048 | 27318 | 4587 | 1850 |
| 3843 | 207 | 208 | 238 | 385 | 1420 | 11968 | 1279 | 734 |
| 3844 | 370 | 260 | 365 | 1098 | 5108 | 27455 | 4660 | 1931 |
| 3845 | 171 | 176 | 206 | 345 | 1347 | 11817 | 1198 | 648 |
| 3846 | 373 | 267 | 367 | 1085 | 5108 | 27591 | 4637 | 1859 |
| 3847 | 198 | 202 | 228 | 364 | 1348 | 11705 | 1212 | 700 |
| 3848 | 388 | 274 | 385 | 1142 | 5182 | 27718 | 4727 | 1964 |
| 3849 | 162 | 169 | 195 | 321 | 1284 | 11551 | 1145 | 637 |
| 3850 | 376 | 269 | 372 | 1098 | 5168 | 27855 | 4688 | 1871 |
| 3851 | 188 | 195 | 218 | 342 | 1280 | 11451 | 1146 | 665 |
| 3852 | 405 | 287 | 405 | 1184 | 5254 | 27968 | 4790 | 1995 |
| 3853 | 153 | 163 | 185 | 299 | 1228 | 11308 | 1100 | 631 |
| 3854 | 378 | 270 | 376 | 1110 | 5222 | 28088 | 4735 | 1883 |
| 3855 | 176 | 186 | 207 | 319 | 1216 | 11224 | 1086 | 632 |
| 3856 | 422 | 301 | 424 | 1222 | 5318 | 28198 | 4846 | 2020 |
| 3857 | 147 | 159 | 177 | 281 | 1178 | 11084 | 1059 | 627 |
| 3858 | 380 | 272 | 381 | 1125 | 5275 | 28303 | 4782 | 1901 |
| 3859 | 165 | 178 | 195 | 296 | 1156 | 11009 | 1029 | 601 |
| 3860 | 437 | 313 | 441 | 1253 | 5370 | 28390 | 4890 | 2037 |
| 3861 | 143 | 156 | 169 | 264 | 1134 | 10885 | 1024 | 626 |
| 3862 | 384 | 274 | 387 | 1140 | 5322 | 28490 | 4825 | 1919 |
| 3863 | 154 | 170 | 183 | 274 | 1103 | 10819 | 979 | 573 |
| 3864 | 450 | 323 | 456 | 1282 | 5425 | 28600 | 4937 | 2052 |
| 3865 | 139 | 153 | 163 | 249 | 1094 | 10704 | 993 | 625 |
| 3866 | 391 | 278 | 397 | 1164 | 5375 | 28674 | 4874 | 1946 |
| 3867 | 144 | 162 | 173 | 254 | 1053 | 10633 | 933 | 550 |
| 3868 | 459 | 331 | 468 | 1305 | 5469 | 28772 | 4973 | 2061 |
| 3869 | 135 | 150 | 156 | 234 | 1059 | 10542 | 965 | 623 |
| 3870 | 400 | 285 | 409 | 1190 | 5423 | 28826 | 4919 | 1975 |
| 3871 | 133 | 153 | 161 | 234 | 1013 | 10490 | 896 | 531 |
| 3872 | 465 | 336 | 475 | 1317 | 5499 | 28908 | 4995 | 2060 |
| 3873 | 132 | 148 | 150 | 220 | 1027 | 10408 | 938 | 618 |
| 3874 | 411 | 294 | 423 | 1219 | 5468 | 28963 | 4961 | 2005 |
| 3875 | 123 | 144 | 150 | 215 | 974 | 10354 | 861 | 514 |
| 3876 | 469 | 339 | 481 | 1328 | 5528 | 29041 | 5015 | 2057 |
| 3877 | 129 | 146 | 145 | 207 | 998 | 10285 | 913 | 611 |
| 3878 | 424 | 303 | 437 | 1250 | 5509 | 29082 | 5001 | 2034 |
| 3879 | 114 | 135 | 139 | 197 | 944 | 10246 | 835 | 502 |
| 3880 | 471 | 342 | 486 | 1335 | 5547 | 29141 | 5028 | 2052 |
| 3881 | 124 | 143 | 139 | 193 | 971 | 10189 | 889 | 601 |
| 3882 | 437 | 313 | 453 | 1280 | 5543 | 29170 | 5033 | 2060 |
| 3883 | 104 | 126 | 127 | 180 | 918 | 10159 | 814 | 494 |
| 3884 | 472 | 343 | 489 | 1340 | 5562 | 29226 | 5037 | 2045 |
| 3885 | 121 | 141 | 133 | 182 | 948 | 10114 | 867 | 588 |
| 3886 | 450 | 324 | 468 | 1309 | 5568 | 29227 | 5056 | 2081 |
| 3887 | 95 | 118 | 116 | 164 | 898 | 10088 | 798 | 491 |
| 3888 | 473 | 344 | 491 | 1341 | 5571 | 29288 | 5041 | 2036 |
| 3889 | 116 | 138 | 128 | 171 | 928 | 10063 | 848 | 572 |
| 3890 | 464 | 336 | 485 | 1340 | 5594 | 29293 | 5080 | 2101 |
| 3891 | 87 | 110 | 107 | 150 | 885 | 10037 | 791 | 493 |
| 3892 | 471 | 344 | 493 | 1341 | 5575 | 29323 | 5040 | 2026 |
| 3893 | 110 | 134 | 121 | 160 | 913 | 10038 | 831 | 553 |
| 3894 | 478 | 347 | 501 | 1368 | 5610 | 29319 | 5094 | 2113 |
| 3895 | 81 | 105 | 98 | 139 | 881 | 10019 | 792 | 501 |
| 3896 | 468 | 343 | 491 | 1334 | 5569 | 29324 | 5031 | 2013 |
| 3897 | 102 | 128 | 114 | 150 | 900 | 10030 | 815 | 532 |
| 3898 | 491 | 358 | 517 | 1395 | 5621 | 29331 | 5103 | 2122 |
| 3899 | 76 | 101 | 91 | 129 | 882 | 10019 | 799 | 512 |
| 3900 | 465 | 341 | 490 | 1330 | 5563 | 29323 | 5024 | 2006 |
| 3901 | 95 | 122 | 106 | 139 | 890 | 10039 | 803 | 514 |
| 3902 | 504 | 370 | 532 | 1418 | 5623 | 29311 | 5103 | 2126 |
| 3903 | 73 | 98 | 86 | 123 | 893 | 10053 | 815 | 529 |
| 3904 | 461 | 339 | 488 | 1323 | 5550 | 29284 | 5011 | 1998 |
| 3905 | 87 | 115 | 98 | 128 | 887 | 10077 | 798 | 498 |
| 3906 | 512 | 378 | 543 | 1432 | 5613 | 29259 | 5090 | 2119 |
| 3907 | 72 | 97 | 82 | 118 | 906 | 10101 | 833 | 545 |
| 3908 | 460 | 338 | 489 | 1322 | 5539 | 29237 | 5001 | 1997 |
| 3909 | 79 | 109 | 91 | 118 | 890 | 10131 | 798 | 487 |
| 3910 | 521 | 386 | 554 | 1444 | 5602 | 29206 | 5077 | 2112 |
| 3911 | 71 | 96 | 78 | 114 | 922 | 10159 | 852 | 560 |
| 3912 | 460 | 338 | 491 | 1323 | 5521 | 29150 | 4986 | 1998 |
| 3913 | 72 | 103 | 83 | 110 | 901 | 10220 | 808 | 480 |
| 3914 | 523 | 389 | 558 | 1444 | 5575 | 29111 | 5049 | 2093 |
| 3915 | 72 | 96 | 75 | 111 | 947 | 10264 | 880 | 576 |
| 3916 | 463 | 341 | 496 | 1328 | 5503 | 29051 | 4972 | 2002 |
| 3917 | 67 | 96 | 77 | 103 | 916 | 10323 | 821 | 476 |
| 3918 | 525 | 392 | 561 | 1442 | 5547 | 29015 | 5019 | 2074 |
| 3919 | 72 | 96 | 73 | 110 | 973 | 10374 | 906 | 589 |
| 3920 | 468 | 346 | 502 | 1336 | 5482 | 28930 | 4956 | 2009 |
| 3921 | 62 | 90 | 70 | 98 | 939 | 10443 | 843 | 480 |
| 3922 | 523 | 392 | 561 | 1435 | 5511 | 28885 | 4983 | 2051 |
| 3923 | 73 | 97 | 70 | 109 | 1006 | 10524 | 941 | 603 |
| 3924 | 474 | 351 | 510 | 1344 | 5455 | 28784 | 4935 | 2015 |
| 3925 | 57 | 84 | 64 | 94 | 967 | 10586 | 871 | 487 |
| 3926 | 521 | 391 | 560 | 1425 | 5467 | 28728 | 4940 | 2025 |
| 3927 | 74 | 97 | 69 | 109 | 1041 | 10682 | 973 | 614 |
| 3928 | 481 | 358 | 518 | 1353 | 5428 | 28633 | 4913 | 2021 |
| 3929 | 53 | 78 | 59 | 92 | 1002 | 10750 | 906 | 500 |
| 3930 | 516 | 388 | 556 | 1410 | 5414 | 28537 | 4887 | 1995 |
| 3931 | 75 | 97 | 67 | 109 | 1078 | 10862 | 1006 | 619 |
| 3932 | 489 | 365 | 528 | 1364 | 5393 | 28449 | 4883 | 2022 |
| 3933 | 50 | 73 | 54 | 92 | 1046 | 10942 | 950 | 519 |
| 3934 | 511 | 386 | 552 | 1396 | 5364 | 28353 | 4838 | 1969 |
| 3935 | 74 | 96 | 65 | 110 | 1116 | 11051 | 1039 | 621 |
| 3936 | 496 | 373 | 537 | 1373 | 5354 | 28245 | 4849 | 2020 |
| 3937 | 49 | 70 | 51 | 95 | 1097 | 11143 | 1001 | 545 |
| 3938 | 505 | 382 | 547 | 1379 | 5309 | 28141 | 4786 | 1942 |
| 3939 | 74 | 95 | 63 | 110 | 1164 | 11282 | 1080 | 625 |
| 3940 | 503 | 380 | 546 | 1377 | 5304 | 28006 | 4804 | 2012 |
| 3941 | 49 | 68 | 48 | 99 | 1156 | 11380 | 1061 | 577 |
| 3942 | 498 | 378 | 541 | 1357 | 5246 | 27907 | 4727 | 1915 |
| 3943 | 72 | 93 | 61 | 112 | 1212 | 11526 | 1120 | 626 |
| 3944 | 510 | 387 | 554 | 1383 | 5255 | 27772 | 4759 | 2003 |
| 3945 | 51 | 68 | 47 | 106 | 1219 | 11623 | 1126 | 613 |
| 3946 | 490 | 373 | 533 | 1335 | 5179 | 27650 | 4665 | 1888 |
| 3947 | 69 | 91 | 59 | 114 | 1265 | 11790 | 1166 | 629 |
| 3948 | 517 | 394 | 562 | 1386 | 5198 | 27511 | 4706 | 1988 |
| 3949 | 54 | 69 | 48 | 115 | 1290 | 11894 | 1195 | 650 |
| 3950 | 481 | 367 | 526 | 1311 | 5108 | 27366 | 4599 | 1863 |
| 3951 | 66 | 87 | 56 | 116 | 1320 | 12066 | 1213 | 632 |
| 3952 | 520 | 399 | 567 | 1383 | 5134 | 27234 | 4646 | 1966 |
| 3953 | 58 | 72 | 49 | 127 | 1365 | 12183 | 1269 | 689 |
| 3954 | 472 | 361 | 517 | 1288 | 5036 | 27075 | 4535 | 1840 |
| 3955 | 64 | 84 | 54 | 119 | 1380 | 12354 | 1264 | 638 |
| 3956 | 522 | 402 | 570 | 1375 | 5062 | 26936 | 4577 | 1937 |
| 3957 | 64 | 75 | 52 | 140 | 1443 | 12491 | 1345 | 725 |
| 3958 | 466 | 357 | 512 | 1269 | 4963 | 26765 | 4469 | 1822 |
| 3959 | 62 | 81 | 51 | 123 | 1445 | 12662 | 1321 | 648 |
| 3960 | 521 | 404 | 569 | 1362 | 4985 | 26616 | 4503 | 1905 |
| 3961 | 71 | 79 | 55 | 155 | 1527 | 12814 | 1425 | 763 |
| 3962 | 463 | 355 | 509 | 1254 | 4892 | 26445 | 4407 | 1810 |
| 3963 | 61 | 78 | 50 | 130 | 1515 | 12978 | 1384 | 665 |
| 3964 | 516 | 402 | 566 | 1342 | 4898 | 26275 | 4421 | 1866 |
| 3965 | 78 | 84 | 59 | 171 | 1612 | 13153 | 1506 | 798 |
| 3966 | 462 | 356 | 509 | 1243 | 4818 | 26102 | 4344 | 1801 |
| 3967 | 61 | 76 | 49 | 138 | 1601 | 13352 | 1463 | 690 |
| 3968 | 510 | 398 | 559 | 1318 | 4810 | 25939 | 4338 | 1828 |
| 3969 | 85 | 89 | 63 | 186 | 1699 | 13514 | 1586 | 831 |
| 3970 | 462 | 357 | 509 | 1232 | 4739 | 25746 | 4275 | 1791 |
| 3971 | 62 | 73 | 49 | 149 | 1684 | 13712 | 1539 | 717 |
| 3972 | 502 | 394 | 552 | 1294 | 4720 | 25584 | 4252 | 1789 |
| 3973 | 92 | 93 | 67 | 201 | 1787 | 13881 | 1666 | 860 |
| 3974 | 462 | 360 | 511 | 1222 | 4658 | 25373 | 4205 | 1780 |
| 3975 | 64 | 71 | 51 | 162 | 1771 | 14078 | 1621 | 750 |
| 3976 | 493 | 388 | 544 | 1266 | 4623 | 25206 | 4162 | 1748 |
| 3977 | 98 | 97 | 71 | 217 | 1879 | 14269 | 1750 | 888 |
| 3978 | 464 | 363 | 513 | 1213 | 4576 | 24994 | 4133 | 1767 |
| 3979 | 68 | 71 | 53 | 178 | 1866 | 14462 | 1710 | 788 |
| 3980 | 483 | 382 | 534 | 1236 | 4523 | 24809 | 4068 | 1707 |
| 3981 | 104 | 100 | 75 | 231 | 1970 | 14665 | 1830 | 909 |
| 3982 | 464 | 365 | 513 | 1200 | 4488 | 24604 | 4055 | 1749 |
| 3983 | 73 | 71 | 56 | 198 | 1965 | 14859 | 1804 | 831 |
| 3984 | 474 | 376 | 525 | 1209 | 4423 | 24407 | 3976 | 1668 |
| 3985 | 108 | 102 | 78 | 245 | 2062 | 15070 | 1911 | 927 |
| 3986 | 465 | 368 | 514 | 1189 | 4398 | 24198 | 3975 | 1728 |
| 3987 | 80 | 74 | 62 | 222 | 2073 | 15275 | 1909 | 881 |
| 3988 | 460 | 367 | 511 | 1172 | 4315 | 23982 | 3877 | 1624 |
| 3989 | 110 | 104 | 81 | 257 | 2151 | 15475 | 1989 | 941 |
| 3990 | 465 | 370 | 514 | 1174 | 4301 | 23780 | 3887 | 1700 |
| 3991 | 88 | 78 | 68 | 246 | 2181 | 15696 | 2012 | 929 |
| 3992 | 448 | 359 | 499 | 1138 | 4209 | 23567 | 3779 | 1584 |
| 3993 | 113 | 104 | 83 | 270 | 2244 | 15905 | 2068 | 954 |
| 3994 | 465 | 373 | 515 | 1162 | 4204 | 23355 | 3798 | 1670 |
| 3995 | 98 | 84 | 76 | 275 | 2295 | 16124 | 2121 | 983 |
| 3996 | 434 | 349 | 485 | 1103 | 4103 | 23139 | 3683 | 1547 |
| 3997 | 115 | 104 | 86 | 285 | 2340 | 16335 | 2152 | 972 |
| 3998 | 463 | 373 | 513 | 1144 | 4099 | 22912 | 3702 | 1634 |
| 3999 | 109 | 91 | 85 | 306 | 2411 | 16563 | 2231 | 1035 |
| 4000 | 421 | 340 | 472 | 1067 | 3995 | 22699 | 3586 | 1514 |
| 4001 | 117 | 105 | 89 | 297 | 2439 | 16779 | 2238 | 990 |
| 4002 | 459 | 373 | 510 | 1123 | 3993 | 22477 | 3603 | 1594 |
| 4003 | 121 | 99 | 95 | 336 | 2522 | 16995 | 2335 | 1083 |
| 4004 | 409 | 331 | 460 | 1035 | 3887 | 22251 | 3489 | 1483 |
| 4005 | 119 | 105 | 92 | 312 | 2539 | 17228 | 2326 | 1013 |
| 4006 | 453 | 370 | 505 | 1099 | 3881 | 22021 | 3499 | 1550 |
| 4007 | 134 | 107 | 106 | 371 | 2642 | 17451 | 2447 | 1134 |
| 4008 | 401 | 326 | 450 | 1006 | 3778 | 21781 | 3394 | 1459 |
| 4009 | 122 | 105 | 95 | 328 | 2645 | 17688 | 2421 | 1040 |
| 4010 | 444 | 365 | 495 | 1068 | 3768 | 21579 | 3393 | 1503 |
| 4011 | 148 | 116 | 117 | 404 | 2761 | 17921 | 2556 | 1181 |
| 4012 | 393 | 321 | 442 | 979 | 3671 | 21322 | 3300 | 1436 |
| 4013 | 125 | 105 | 98 | 346 | 2749 | 18139 | 2514 | 1069 |
| 4014 | 433 | 358 | 484 | 1035 | 3649 | 21111 | 3281 | 1453 |
| 4015 | 161 | 125 | 128 | 436 | 2877 | 18386 | 2662 | 1223 |
| 4016 | 389 | 320 | 437 | 957 | 3569 | 20867 | 3212 | 1418 |
| 4017 | 129 | 106 | 103 | 367 | 2858 | 18599 | 2613 | 1103 |
| 4018 | 421 | 350 | 472 | 1002 | 3532 | 20645 | 3172 | 1405 |
| 4019 | 174 | 134 | 140 | 468 | 2997 | 18858 | 2770 | 1264 |
| 4020 | 384 | 318 | 432 | 935 | 3465 | 20405 | 3121 | 1398 |
| 4021 | 134 | 107 | 109 | 393 | 2972 | 19066 | 2718 | 1144 |
| 4022 | 409 | 342 | 459 | 967 | 3412 | 20172 | 3061 | 1356 |
| 4023 | 186 | 142 | 151 | 497 | 3110 | 19322 | 2871 | 1297 |
| 4024 | 380 | 316 | 427 | 912 | 3360 | 19940 | 3028 | 1375 |
| 4025 | 142 | 109 | 117 | 422 | 3090 | 19538 | 2828 | 1190 |
| 4026 | 395 | 333 | 446 | 931 | 3292 | 19700 | 2950 | 1308 |
| 4027 | 194 | 148 | 159 | 522 | 3216 | 19779 | 2964 | 1322 |
| 4028 | 377 | 316 | 424 | 892 | 3253 | 19471 | 2934 | 1351 |
| 4029 | 152 | 114 | 127 | 457 | 3211 | 20006 | 2941 | 1242 |
| 4030 | 382 | 324 | 432 | 896 | 3177 | 19243 | 2844 | 1264 |
| 4031 | 203 | 153 | 167 | 546 | 3326 | 20255 | 3060 | 1348 |
| 4032 | 372 | 314 | 419 | 869 | 3142 | 18989 | 2835 | 1321 |
| 4033 | 164 | 121 | 140 | 495 | 3335 | 20473 | 3058 | 1298 |
| 4034 | 368 | 314 | 417 | 860 | 3060 | 18772 | 2738 | 1221 |
| 4035 | 211 | 159 | 175 | 572 | 3439 | 20735 | 3159 | 1373 |
| 4036 | 367 | 312 | 413 | 845 | 3033 | 18526 | 2737 | 1291 |
| 4037 | 178 | 129 | 153 | 535 | 3458 | 20934 | 3173 | 1355 |
| 4038 | 353 | 303 | 402 | 822 | 2945 | 18303 | 2632 | 1180 |
| 4039 | 216 | 162 | 182 | 593 | 3546 | 21199 | 3250 | 1393 |
| 4040 | 363 | 311 | 408 | 822 | 2924 | 18062 | 2637 | 1256 |
| 4041 | 193 | 139 | 168 | 578 | 3582 | 21395 | 3288 | 1410 |
| 4042 | 337 | 291 | 385 | 783 | 2827 | 17827 | 2525 | 1138 |
| 4043 | 221 | 165 | 189 | 614 | 3651 | 21660 | 3341 | 1413 |
| 4044 | 358 | 310 | 403 | 800 | 2818 | 17618 | 2540 | 1219 |
| 4045 | 210 | 149 | 184 | 623 | 3709 | 21864 | 3405 | 1467 |
| 4046 | 321 | 280 | 368 | 742 | 2711 | 17362 | 2420 | 1100 |
| 4047 | 225 | 167 | 194 | 631 | 3751 | 22108 | 3426 | 1431 |
| 4048 | 351 | 306 | 396 | 774 | 2706 | 17162 | 2436 | 1176 |
| 4049 | 227 | 161 | 201 | 670 | 3831 | 22323 | 3518 | 1519 |
| 4050 | 307 | 269 | 353 | 707 | 2603 | 16922 | 2326 | 1070 |
| 4051 | 228 | 169 | 199 | 648 | 3849 | 22550 | 3511 | 1449 |
| 4052 | 342 | 301 | 387 | 748 | 2594 | 16710 | 2331 | 1129 |
| 4053 | 245 | 174 | 219 | 718 | 3952 | 22770 | 3629 | 1568 |
| 4054 | 295 | 261 | 341 | 675 | 2499 | 16476 | 2235 | 1045 |
| 4055 | 233 | 171 | 206 | 670 | 3956 | 23009 | 3607 | 1477 |
| 4056 | 330 | 294 | 374 | 715 | 2477 | 16254 | 2223 | 1078 |
| 4057 | 262 | 186 | 237 | 762 | 4066 | 23209 | 3733 | 1612 |
| 4058 | 286 | 255 | 330 | 646 | 2396 | 16037 | 2146 | 1023 |
| 4059 | 236 | 172 | 211 | 689 | 4056 | 23445 | 3695 | 1501 |
| 4060 | 318 | 286 | 362 | 683 | 2368 | 15838 | 2121 | 1030 |
| 4061 | 279 | 199 | 254 | 803 | 4175 | 23636 | 3830 | 1650 |
| 4062 | 278 | 250 | 321 | 619 | 2294 | 15591 | 2058 | 1001 |
| 4063 | 241 | 174 | 218 | 714 | 4159 | 23870 | 3787 | 1532 |
| 4064 | 303 | 275 | 347 | 648 | 2257 | 15412 | 2017 | 979 |
| 4065 | 293 | 209 | 269 | 841 | 4283 | 24070 | 3926 | 1682 |
| 4066 | 271 | 246 | 313 | 595 | 2193 | 15150 | 1970 | 979 |
| 4067 | 248 | 177 | 227 | 744 | 4263 | 24285 | 3882 | 1568 |
| 4068 | 290 | 265 | 333 | 615 | 2150 | 14992 | 1919 | 935 |
| 4069 | 308 | 220 | 284 | 878 | 4389 | 24490 | 4020 | 1715 |
| 4070 | 266 | 243 | 305 | 570 | 2105 | 14770 | 1894 | 962 |
| 4071 | 255 | 181 | 236 | 773 | 4359 | 24679 | 3971 | 1606 |
| 4072 | 276 | 257 | 320 | 584 | 2046 | 14585 | 1822 | 893 |
| 4073 | 321 | 229 | 298 | 910 | 4486 | 24894 | 4104 | 1739 |
| 4074 | 260 | 239 | 298 | 547 | 2014 | 14380 | 1815 | 941 |
| 4075 | 266 | 188 | 249 | 811 | 4464 | 25078 | 4068 | 1651 |
| 4076 | 263 | 246 | 305 | 552 | 1943 | 14183 | 1728 | 852 |
| 4077 | 331 | 237 | 310 | 939 | 4579 | 25283 | 4184 | 1759 |
| 4078 | 254 | 236 | 290 | 524 | 1925 | 13996 | 1737 | 919 |
| 4079 | 280 | 196 | 265 | 852 | 4570 | 25468 | 4168 | 1701 |
| 4080 | 249 | 235 | 290 | 518 | 1846 | 13804 | 1640 | 814 |
| 4081 | 337 | 241 | 318 | 960 | 4662 | 25655 | 4254 | 1772 |
| 4082 | 248 | 233 | 283 | 501 | 1834 | 13621 | 1656 | 891 |
| 4083 | 296 | 207 | 282 | 897 | 4672 | 25835 | 4262 | 1750 |
| 4084 | 234 | 224 | 274 | 486 | 1754 | 13447 | 1557 | 780 |
| 4085 | 343 | 246 | 325 | 980 | 4743 | 26013 | 4322 | 1783 |
| 4086 | 242 | 230 | 276 | 480 | 1749 | 13262 | 1578 | 863 |
| 4087 | 313 | 219 | 301 | 943 | 4773 | 26189 | 4356 | 1799 |
| 4088 | 220 | 213 | 260 | 455 | 1666 | 13092 | 1478 | 750 |
| 4089 | 349 | 249 | 333 | 1000 | 4825 | 26370 | 4391 | 1796 |
| 4090 | 236 | 227 | 269 | 457 | 1662 | 12911 | 1499 | 830 |
| 4091 | 331 | 232 | 321 | 992 | 4868 | 26527 | 4444 | 1844 |
| 4092 | 205 | 201 | 244 | 425 | 1578 | 12727 | 1400 | 722 |
| 4093 | 353 | 252 | 340 | 1017 | 4895 | 26671 | 4450 | 1806 |
| 4094 | 229 | 223 | 262 | 437 | 1581 | 12573 | 1424 | 798 |
| 4095 | 349 | 245 | 340 | 1037 | 4957 | 26821 | 4525 | 1886 |
| 4096 | 192 | 192 | 229 | 395 | 1508 | 12434 | 1339 | 706 |
| 4097 | 356 | 255 | 346 | 1032 | 4972 | 27009 | 4515 | 1821 |
| 4098 | 220 | 218 | 253 | 415 | 1507 | 12293 | 1353 | 763 |
| 4099 | 367 | 258 | 360 | 1083 | 5049 | 27164 | 4607 | 1924 |
| 4100 | 181 | 183 | 216 | 368 | 1431 | 12114 | 1272 | 687 |
| 4101 | 359 | 257 | 350 | 1046 | 5039 | 27307 | 4571 | 1832 |
| 4102 | 211 | 212 | 243 | 392 | 1429 | 12000 | 1279 | 724 |
| 4103 | 387 | 273 | 382 | 1130 | 5132 | 27454 | 4680 | 1959 |
| 4104 | 172 | 177 | 206 | 344 | 1369 | 11846 | 1222 | 680 |
| 4105 | 361 | 259 | 355 | 1058 | 5100 | 27576 | 4625 | 1847 |
| 4106 | 198 | 202 | 230 | 365 | 1353 | 11728 | 1207 | 686 |
| 4107 | 402 | 286 | 400 | 1168 | 5203 | 27721 | 4743 | 1985 |
| 4108 | 165 | 172 | 197 | 323 | 1308 | 11582 | 1172 | 673 |
| 4109 | 363 | 259 | 359 | 1072 | 5161 | 27836 | 4678 | 1863 |
| 4110 | 184 | 193 | 217 | 340 | 1279 | 11459 | 1136 | 647 |
| 4111 | 419 | 299 | 418 | 1206 | 5272 | 27978 | 4802 | 2007 |
| 4112 | 160 | 168 | 189 | 304 | 1253 | 11337 | 1126 | 666 |
| 4113 | 368 | 262 | 367 | 1093 | 5222 | 28079 | 4733 | 1886 |
| 4114 | 172 | 184 | 204 | 315 | 1215 | 11231 | 1076 | 613 |
| 4115 | 432 | 310 | 434 | 1235 | 5329 | 28203 | 4850 | 2021 |
| 4116 | 155 | 165 | 182 | 286 | 1201 | 11112 | 1084 | 660 |
| 4117 | 374 | 266 | 375 | 1114 | 5274 | 28274 | 4782 | 1910 |
| 4118 | 162 | 175 | 193 | 293 | 1155 | 11008 | 1021 | 586 |
| 4119 | 443 | 319 | 448 | 1261 | 5383 | 28415 | 4896 | 2033 |
| 4120 | 151 | 163 | 175 | 270 | 1156 | 10903 | 1047 | 655 |
| 4121 | 383 | 272 | 387 | 1145 | 5339 | 28498 | 4843 | 1944 |
| 4122 | 151 | 166 | 181 | 270 | 1102 | 10817 | 973 | 562 |
| 4123 | 452 | 326 | 458 | 1280 | 5429 | 28614 | 4933 | 2039 |
| 4124 | 146 | 160 | 168 | 254 | 1110 | 10714 | 1009 | 645 |
| 4125 | 393 | 280 | 401 | 1176 | 5391 | 28670 | 4891 | 1974 |
| 4126 | 140 | 158 | 169 | 250 | 1055 | 10651 | 930 | 541 |
| 4127 | 456 | 330 | 465 | 1293 | 5464 | 28780 | 4960 | 2038 |
| 4128 | 143 | 157 | 162 | 239 | 1073 | 10565 | 977 | 636 |
| 4129 | 405 | 289 | 415 | 1205 | 5436 | 28816 | 4935 | 2002 |
| 4130 | 129 | 148 | 157 | 230 | 1006 | 10467 | 886 | 521 |
| 4131 | 460 | 333 | 471 | 1305 | 5493 | 28909 | 4981 | 2034 |
| 4132 | 138 | 154 | 156 | 223 | 1036 | 10414 | 944 | 623 |
| 4133 | 421 | 300 | 432 | 1240 | 5485 | 28955 | 4982 | 2035 |
| 4134 | 118 | 138 | 145 | 211 | 972 | 10337 | 857 | 509 |
| 4135 | 462 | 335 | 475 | 1313 | 5519 | 29033 | 4999 | 2030 |
| 4136 | 134 | 152 | 150 | 210 | 1003 | 10286 | 914 | 607 |
| 4137 | 435 | 312 | 450 | 1274 | 5528 | 29073 | 5021 | 2062 |
| 4138 | 108 | 129 | 133 | 191 | 943 | 10228 | 834 | 501 |
| 4139 | 462 | 337 | 477 | 1314 | 5536 | 29129 | 5009 | 2021 |
| 4140 | 129 | 149 | 144 | 197 | 970 | 10180 | 882 | 585 |